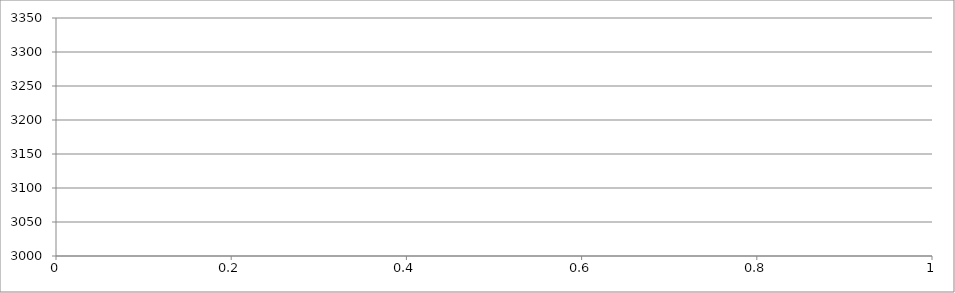
| Category | Series 0 |
|---|---|
| 0 | 3148 |
| 1 | 3148 |
| 2 | 3148 |
| 3 | 3148 |
| 4 | 3148 |
| 5 | 3148 |
| 6 | 3148 |
| 7 | 3148 |
| 8 | 3148 |
| 9 | 3148 |
| 10 | 3148 |
| 11 | 3148 |
| 12 | 3148 |
| 13 | 3148 |
| 14 | 3148 |
| 15 | 3148 |
| 16 | 3148 |
| 17 | 3148 |
| 18 | 3148 |
| 19 | 3148 |
| 20 | 3148 |
| 21 | 3148 |
| 22 | 3148 |
| 23 | 3148 |
| 24 | 3148 |
| 25 | 3148 |
| 26 | 3148 |
| 27 | 3148 |
| 28 | 3148 |
| 29 | 3148 |
| 30 | 3148 |
| 31 | 3148 |
| 32 | 3148 |
| 33 | 3148 |
| 34 | 3148 |
| 35 | 3148 |
| 36 | 3148 |
| 37 | 3148 |
| 38 | 3148 |
| 39 | 3148 |
| 40 | 3148 |
| 41 | 3148 |
| 42 | 3148 |
| 43 | 3148 |
| 44 | 3148 |
| 45 | 3148 |
| 46 | 3148 |
| 47 | 3148 |
| 48 | 3148 |
| 49 | 3148 |
| 50 | 3148 |
| 51 | 3148 |
| 52 | 3148 |
| 53 | 3148 |
| 54 | 3148 |
| 55 | 3148 |
| 56 | 3148 |
| 57 | 3148 |
| 58 | 3148 |
| 59 | 3148 |
| 60 | 3148 |
| 61 | 3148 |
| 62 | 3148 |
| 63 | 3148 |
| 64 | 3148 |
| 65 | 3148 |
| 66 | 3148 |
| 67 | 3148 |
| 68 | 3148 |
| 69 | 3148 |
| 70 | 3148 |
| 71 | 3148 |
| 72 | 3148 |
| 73 | 3148 |
| 74 | 3148 |
| 75 | 3148 |
| 76 | 3148 |
| 77 | 3148 |
| 78 | 3148 |
| 79 | 3148 |
| 80 | 3148 |
| 81 | 3148 |
| 82 | 3148 |
| 83 | 3148 |
| 84 | 3148 |
| 85 | 3148 |
| 86 | 3148 |
| 87 | 3148 |
| 88 | 3148 |
| 89 | 3148 |
| 90 | 3148 |
| 91 | 3148 |
| 92 | 3148 |
| 93 | 3148 |
| 94 | 3148 |
| 95 | 3148 |
| 96 | 3148 |
| 97 | 3148 |
| 98 | 3148 |
| 99 | 3148 |
| 100 | 3148 |
| 101 | 3148 |
| 102 | 3148 |
| 103 | 3148 |
| 104 | 3148 |
| 105 | 3136 |
| 106 | 3136 |
| 107 | 3136 |
| 108 | 3136 |
| 109 | 3136 |
| 110 | 3136 |
| 111 | 3136 |
| 112 | 3136 |
| 113 | 3136 |
| 114 | 3136 |
| 115 | 3136 |
| 116 | 3136 |
| 117 | 3136 |
| 118 | 3136 |
| 119 | 3136 |
| 120 | 3136 |
| 121 | 3136 |
| 122 | 3136 |
| 123 | 3136 |
| 124 | 3136 |
| 125 | 3136 |
| 126 | 3136 |
| 127 | 3136 |
| 128 | 3136 |
| 129 | 3136 |
| 130 | 3136 |
| 131 | 3136 |
| 132 | 3136 |
| 133 | 3136 |
| 134 | 3136 |
| 135 | 3136 |
| 136 | 3136 |
| 137 | 3136 |
| 138 | 3136 |
| 139 | 3136 |
| 140 | 3136 |
| 141 | 3136 |
| 142 | 3136 |
| 143 | 3136 |
| 144 | 3136 |
| 145 | 3136 |
| 146 | 3136 |
| 147 | 3136 |
| 148 | 3136 |
| 149 | 3136 |
| 150 | 3136 |
| 151 | 3136 |
| 152 | 3136 |
| 153 | 3136 |
| 154 | 3136 |
| 155 | 3136 |
| 156 | 3136 |
| 157 | 3136 |
| 158 | 3136 |
| 159 | 3136 |
| 160 | 3136 |
| 161 | 3136 |
| 162 | 3136 |
| 163 | 3136 |
| 164 | 3136 |
| 165 | 3136 |
| 166 | 3136 |
| 167 | 3136 |
| 168 | 3136 |
| 169 | 3136 |
| 170 | 3136 |
| 171 | 3136 |
| 172 | 3136 |
| 173 | 3136 |
| 174 | 3136 |
| 175 | 3136 |
| 176 | 3136 |
| 177 | 3136 |
| 178 | 3136 |
| 179 | 3136 |
| 180 | 3136 |
| 181 | 3136 |
| 182 | 3136 |
| 183 | 3136 |
| 184 | 3136 |
| 185 | 3136 |
| 186 | 3136 |
| 187 | 3136 |
| 188 | 3136 |
| 189 | 3136 |
| 190 | 3136 |
| 191 | 3136 |
| 192 | 3136 |
| 193 | 3136 |
| 194 | 3136 |
| 195 | 3136 |
| 196 | 3136 |
| 197 | 3136 |
| 198 | 3136 |
| 199 | 3136 |
| 200 | 3136 |
| 201 | 3136 |
| 202 | 3136 |
| 203 | 3136 |
| 204 | 3136 |
| 205 | 3136 |
| 206 | 3136 |
| 207 | 3136 |
| 208 | 3136 |
| 209 | 3136 |
| 210 | 3136 |
| 211 | 3136 |
| 212 | 3136 |
| 213 | 3136 |
| 214 | 3136 |
| 215 | 3136 |
| 216 | 3136 |
| 217 | 3136 |
| 218 | 3136 |
| 219 | 3136 |
| 220 | 3136 |
| 221 | 3136 |
| 222 | 3136 |
| 223 | 3136 |
| 224 | 3136 |
| 225 | 3136 |
| 226 | 3136 |
| 227 | 3136 |
| 228 | 3136 |
| 229 | 3136 |
| 230 | 3136 |
| 231 | 3136 |
| 232 | 3136 |
| 233 | 3136 |
| 234 | 3136 |
| 235 | 3136 |
| 236 | 3136 |
| 237 | 3136 |
| 238 | 3136 |
| 239 | 3136 |
| 240 | 3136 |
| 241 | 3136 |
| 242 | 3136 |
| 243 | 3136 |
| 244 | 3136 |
| 245 | 3136 |
| 246 | 3136 |
| 247 | 3136 |
| 248 | 3136 |
| 249 | 3136 |
| 250 | 3136 |
| 251 | 3136 |
| 252 | 3136 |
| 253 | 3136 |
| 254 | 3136 |
| 255 | 3136 |
| 256 | 3136 |
| 257 | 3136 |
| 258 | 3136 |
| 259 | 3136 |
| 260 | 3136 |
| 261 | 3136 |
| 262 | 3136 |
| 263 | 3136 |
| 264 | 3136 |
| 265 | 3136 |
| 266 | 3136 |
| 267 | 3136 |
| 268 | 3136 |
| 269 | 3136 |
| 270 | 3136 |
| 271 | 3136 |
| 272 | 3136 |
| 273 | 3136 |
| 274 | 3136 |
| 275 | 3136 |
| 276 | 3136 |
| 277 | 3136 |
| 278 | 3136 |
| 279 | 3136 |
| 280 | 3136 |
| 281 | 3136 |
| 282 | 3136 |
| 283 | 3136 |
| 284 | 3136 |
| 285 | 3136 |
| 286 | 3136 |
| 287 | 3136 |
| 288 | 3136 |
| 289 | 3136 |
| 290 | 3136 |
| 291 | 3136 |
| 292 | 3136 |
| 293 | 3136 |
| 294 | 3136 |
| 295 | 3136 |
| 296 | 3136 |
| 297 | 3136 |
| 298 | 3136 |
| 299 | 3136 |
| 300 | 3136 |
| 301 | 3136 |
| 302 | 3136 |
| 303 | 3136 |
| 304 | 3136 |
| 305 | 3136 |
| 306 | 3136 |
| 307 | 3136 |
| 308 | 3136 |
| 309 | 3136 |
| 310 | 3136 |
| 311 | 3136 |
| 312 | 3136 |
| 313 | 3136 |
| 314 | 3136 |
| 315 | 3136 |
| 316 | 3136 |
| 317 | 3136 |
| 318 | 3136 |
| 319 | 3136 |
| 320 | 3136 |
| 321 | 3136 |
| 322 | 3136 |
| 323 | 3136 |
| 324 | 3136 |
| 325 | 3136 |
| 326 | 3136 |
| 327 | 3136 |
| 328 | 3136 |
| 329 | 3136 |
| 330 | 3136 |
| 331 | 3136 |
| 332 | 3136 |
| 333 | 3136 |
| 334 | 3136 |
| 335 | 3136 |
| 336 | 3136 |
| 337 | 3136 |
| 338 | 3136 |
| 339 | 3136 |
| 340 | 3136 |
| 341 | 3148 |
| 342 | 3148 |
| 343 | 3148 |
| 344 | 3148 |
| 345 | 3148 |
| 346 | 3148 |
| 347 | 3148 |
| 348 | 3148 |
| 349 | 3148 |
| 350 | 3148 |
| 351 | 3148 |
| 352 | 3148 |
| 353 | 3148 |
| 354 | 3148 |
| 355 | 3148 |
| 356 | 3148 |
| 357 | 3148 |
| 358 | 3148 |
| 359 | 3148 |
| 360 | 3148 |
| 361 | 3148 |
| 362 | 3148 |
| 363 | 3148 |
| 364 | 3148 |
| 365 | 3148 |
| 366 | 3148 |
| 367 | 3148 |
| 368 | 3148 |
| 369 | 3148 |
| 370 | 3148 |
| 371 | 3148 |
| 372 | 3148 |
| 373 | 3148 |
| 374 | 3148 |
| 375 | 3148 |
| 376 | 3148 |
| 377 | 3148 |
| 378 | 3148 |
| 379 | 3148 |
| 380 | 3148 |
| 381 | 3148 |
| 382 | 3148 |
| 383 | 3148 |
| 384 | 3148 |
| 385 | 3148 |
| 386 | 3148 |
| 387 | 3148 |
| 388 | 3148 |
| 389 | 3148 |
| 390 | 3148 |
| 391 | 3148 |
| 392 | 3148 |
| 393 | 3148 |
| 394 | 3148 |
| 395 | 3148 |
| 396 | 3148 |
| 397 | 3148 |
| 398 | 3148 |
| 399 | 3148 |
| 400 | 3148 |
| 401 | 3148 |
| 402 | 3148 |
| 403 | 3148 |
| 404 | 3148 |
| 405 | 3148 |
| 406 | 3148 |
| 407 | 3148 |
| 408 | 3148 |
| 409 | 3148 |
| 410 | 3148 |
| 411 | 3148 |
| 412 | 3148 |
| 413 | 3148 |
| 414 | 3148 |
| 415 | 3148 |
| 416 | 3148 |
| 417 | 3148 |
| 418 | 3148 |
| 419 | 3148 |
| 420 | 3148 |
| 421 | 3148 |
| 422 | 3148 |
| 423 | 3148 |
| 424 | 3148 |
| 425 | 3148 |
| 426 | 3148 |
| 427 | 3148 |
| 428 | 3148 |
| 429 | 3148 |
| 430 | 3148 |
| 431 | 3148 |
| 432 | 3148 |
| 433 | 3148 |
| 434 | 3148 |
| 435 | 3148 |
| 436 | 3148 |
| 437 | 3148 |
| 438 | 3148 |
| 439 | 3148 |
| 440 | 3148 |
| 441 | 3148 |
| 442 | 3148 |
| 443 | 3148 |
| 444 | 3148 |
| 445 | 3148 |
| 446 | 3148 |
| 447 | 3148 |
| 448 | 3148 |
| 449 | 3148 |
| 450 | 3148 |
| 451 | 3148 |
| 452 | 3148 |
| 453 | 3148 |
| 454 | 3148 |
| 455 | 3148 |
| 456 | 3148 |
| 457 | 3148 |
| 458 | 3148 |
| 459 | 3148 |
| 460 | 3148 |
| 461 | 3148 |
| 462 | 3148 |
| 463 | 3148 |
| 464 | 3148 |
| 465 | 3148 |
| 466 | 3148 |
| 467 | 3148 |
| 468 | 3148 |
| 469 | 3148 |
| 470 | 3148 |
| 471 | 3148 |
| 472 | 3148 |
| 473 | 3148 |
| 474 | 3148 |
| 475 | 3148 |
| 476 | 3148 |
| 477 | 3148 |
| 478 | 3148 |
| 479 | 3148 |
| 480 | 3148 |
| 481 | 3148 |
| 482 | 3148 |
| 483 | 3148 |
| 484 | 3148 |
| 485 | 3148 |
| 486 | 3148 |
| 487 | 3148 |
| 488 | 3148 |
| 489 | 3148 |
| 490 | 3148 |
| 491 | 3148 |
| 492 | 3148 |
| 493 | 3148 |
| 494 | 3148 |
| 495 | 3148 |
| 496 | 3148 |
| 497 | 3148 |
| 498 | 3148 |
| 499 | 3148 |
| 500 | 3148 |
| 501 | 3148 |
| 502 | 3148 |
| 503 | 3148 |
| 504 | 3148 |
| 505 | 3148 |
| 506 | 3148 |
| 507 | 3148 |
| 508 | 3148 |
| 509 | 3148 |
| 510 | 3148 |
| 511 | 3148 |
| 512 | 3148 |
| 513 | 3148 |
| 514 | 3148 |
| 515 | 3148 |
| 516 | 3148 |
| 517 | 3148 |
| 518 | 3148 |
| 519 | 3148 |
| 520 | 3148 |
| 521 | 3148 |
| 522 | 3148 |
| 523 | 3148 |
| 524 | 3148 |
| 525 | 3148 |
| 526 | 3148 |
| 527 | 3148 |
| 528 | 3148 |
| 529 | 3148 |
| 530 | 3148 |
| 531 | 3148 |
| 532 | 3148 |
| 533 | 3148 |
| 534 | 3148 |
| 535 | 3148 |
| 536 | 3148 |
| 537 | 3148 |
| 538 | 3148 |
| 539 | 3148 |
| 540 | 3148 |
| 541 | 3148 |
| 542 | 3148 |
| 543 | 3148 |
| 544 | 3148 |
| 545 | 3148 |
| 546 | 3148 |
| 547 | 3148 |
| 548 | 3148 |
| 549 | 3148 |
| 550 | 3148 |
| 551 | 3148 |
| 552 | 3148 |
| 553 | 3148 |
| 554 | 3148 |
| 555 | 3148 |
| 556 | 3148 |
| 557 | 3148 |
| 558 | 3148 |
| 559 | 3148 |
| 560 | 3148 |
| 561 | 3148 |
| 562 | 3148 |
| 563 | 3148 |
| 564 | 3148 |
| 565 | 3148 |
| 566 | 3148 |
| 567 | 3148 |
| 568 | 3148 |
| 569 | 3148 |
| 570 | 3148 |
| 571 | 3148 |
| 572 | 3148 |
| 573 | 3148 |
| 574 | 3148 |
| 575 | 3148 |
| 576 | 3148 |
| 577 | 3148 |
| 578 | 3148 |
| 579 | 3148 |
| 580 | 3148 |
| 581 | 3148 |
| 582 | 3148 |
| 583 | 3148 |
| 584 | 3148 |
| 585 | 3148 |
| 586 | 3148 |
| 587 | 3148 |
| 588 | 3148 |
| 589 | 3148 |
| 590 | 3148 |
| 591 | 3148 |
| 592 | 3148 |
| 593 | 3148 |
| 594 | 3148 |
| 595 | 3148 |
| 596 | 3148 |
| 597 | 3148 |
| 598 | 3148 |
| 599 | 3148 |
| 600 | 3148 |
| 601 | 3148 |
| 602 | 3148 |
| 603 | 3148 |
| 604 | 3148 |
| 605 | 3148 |
| 606 | 3148 |
| 607 | 3148 |
| 608 | 3148 |
| 609 | 3148 |
| 610 | 3148 |
| 611 | 3148 |
| 612 | 3148 |
| 613 | 3148 |
| 614 | 3148 |
| 615 | 3148 |
| 616 | 3148 |
| 617 | 3148 |
| 618 | 3148 |
| 619 | 3148 |
| 620 | 3148 |
| 621 | 3148 |
| 622 | 3148 |
| 623 | 3148 |
| 624 | 3148 |
| 625 | 3148 |
| 626 | 3148 |
| 627 | 3148 |
| 628 | 3148 |
| 629 | 3148 |
| 630 | 3148 |
| 631 | 3148 |
| 632 | 3148 |
| 633 | 3148 |
| 634 | 3148 |
| 635 | 3148 |
| 636 | 3148 |
| 637 | 3148 |
| 638 | 3148 |
| 639 | 3148 |
| 640 | 3148 |
| 641 | 3148 |
| 642 | 3148 |
| 643 | 3148 |
| 644 | 3148 |
| 645 | 3148 |
| 646 | 3148 |
| 647 | 3148 |
| 648 | 3148 |
| 649 | 3148 |
| 650 | 3148 |
| 651 | 3148 |
| 652 | 3148 |
| 653 | 3148 |
| 654 | 3148 |
| 655 | 3148 |
| 656 | 3148 |
| 657 | 3148 |
| 658 | 3148 |
| 659 | 3148 |
| 660 | 3148 |
| 661 | 3148 |
| 662 | 3148 |
| 663 | 3148 |
| 664 | 3148 |
| 665 | 3148 |
| 666 | 3148 |
| 667 | 3148 |
| 668 | 3148 |
| 669 | 3148 |
| 670 | 3148 |
| 671 | 3148 |
| 672 | 3148 |
| 673 | 3148 |
| 674 | 3148 |
| 675 | 3148 |
| 676 | 3148 |
| 677 | 3148 |
| 678 | 3148 |
| 679 | 3148 |
| 680 | 3148 |
| 681 | 3148 |
| 682 | 3148 |
| 683 | 3148 |
| 684 | 3148 |
| 685 | 3148 |
| 686 | 3148 |
| 687 | 3148 |
| 688 | 3148 |
| 689 | 3148 |
| 690 | 3148 |
| 691 | 3148 |
| 692 | 3148 |
| 693 | 3148 |
| 694 | 3148 |
| 695 | 3148 |
| 696 | 3148 |
| 697 | 3148 |
| 698 | 3148 |
| 699 | 3148 |
| 700 | 3148 |
| 701 | 3148 |
| 702 | 3148 |
| 703 | 3148 |
| 704 | 3148 |
| 705 | 3148 |
| 706 | 3148 |
| 707 | 3148 |
| 708 | 3148 |
| 709 | 3148 |
| 710 | 3148 |
| 711 | 3148 |
| 712 | 3148 |
| 713 | 3148 |
| 714 | 3148 |
| 715 | 3148 |
| 716 | 3148 |
| 717 | 3148 |
| 718 | 3148 |
| 719 | 3148 |
| 720 | 3148 |
| 721 | 3148 |
| 722 | 3148 |
| 723 | 3148 |
| 724 | 3148 |
| 725 | 3148 |
| 726 | 3148 |
| 727 | 3148 |
| 728 | 3148 |
| 729 | 3148 |
| 730 | 3148 |
| 731 | 3148 |
| 732 | 3148 |
| 733 | 3148 |
| 734 | 3148 |
| 735 | 3148 |
| 736 | 3148 |
| 737 | 3148 |
| 738 | 3148 |
| 739 | 3148 |
| 740 | 3148 |
| 741 | 3148 |
| 742 | 3148 |
| 743 | 3148 |
| 744 | 3148 |
| 745 | 3148 |
| 746 | 3148 |
| 747 | 3148 |
| 748 | 3148 |
| 749 | 3148 |
| 750 | 3148 |
| 751 | 3148 |
| 752 | 3148 |
| 753 | 3148 |
| 754 | 3148 |
| 755 | 3148 |
| 756 | 3148 |
| 757 | 3148 |
| 758 | 3148 |
| 759 | 3148 |
| 760 | 3148 |
| 761 | 3148 |
| 762 | 3148 |
| 763 | 3148 |
| 764 | 3148 |
| 765 | 3148 |
| 766 | 3148 |
| 767 | 3148 |
| 768 | 3148 |
| 769 | 3148 |
| 770 | 3148 |
| 771 | 3148 |
| 772 | 3148 |
| 773 | 3148 |
| 774 | 3148 |
| 775 | 3148 |
| 776 | 3148 |
| 777 | 3148 |
| 778 | 3148 |
| 779 | 3148 |
| 780 | 3148 |
| 781 | 3148 |
| 782 | 3148 |
| 783 | 3148 |
| 784 | 3148 |
| 785 | 3148 |
| 786 | 3148 |
| 787 | 3148 |
| 788 | 3148 |
| 789 | 3148 |
| 790 | 3148 |
| 791 | 3148 |
| 792 | 3148 |
| 793 | 3148 |
| 794 | 3148 |
| 795 | 3148 |
| 796 | 3148 |
| 797 | 3148 |
| 798 | 3148 |
| 799 | 3148 |
| 800 | 3148 |
| 801 | 3148 |
| 802 | 3148 |
| 803 | 3148 |
| 804 | 3148 |
| 805 | 3148 |
| 806 | 3148 |
| 807 | 3148 |
| 808 | 3148 |
| 809 | 3148 |
| 810 | 3148 |
| 811 | 3148 |
| 812 | 3156 |
| 813 | 3156 |
| 814 | 3156 |
| 815 | 3156 |
| 816 | 3156 |
| 817 | 3156 |
| 818 | 3156 |
| 819 | 3156 |
| 820 | 3156 |
| 821 | 3156 |
| 822 | 3156 |
| 823 | 3156 |
| 824 | 3156 |
| 825 | 3156 |
| 826 | 3156 |
| 827 | 3156 |
| 828 | 3156 |
| 829 | 3156 |
| 830 | 3156 |
| 831 | 3156 |
| 832 | 3156 |
| 833 | 3156 |
| 834 | 3156 |
| 835 | 3156 |
| 836 | 3156 |
| 837 | 3156 |
| 838 | 3156 |
| 839 | 3156 |
| 840 | 3156 |
| 841 | 3156 |
| 842 | 3156 |
| 843 | 3156 |
| 844 | 3156 |
| 845 | 3156 |
| 846 | 3156 |
| 847 | 3156 |
| 848 | 3156 |
| 849 | 3156 |
| 850 | 3156 |
| 851 | 3156 |
| 852 | 3156 |
| 853 | 3156 |
| 854 | 3156 |
| 855 | 3156 |
| 856 | 3156 |
| 857 | 3156 |
| 858 | 3156 |
| 859 | 3156 |
| 860 | 3156 |
| 861 | 3156 |
| 862 | 3156 |
| 863 | 3156 |
| 864 | 3156 |
| 865 | 3156 |
| 866 | 3156 |
| 867 | 3156 |
| 868 | 3156 |
| 869 | 3156 |
| 870 | 3156 |
| 871 | 3156 |
| 872 | 3156 |
| 873 | 3156 |
| 874 | 3156 |
| 875 | 3156 |
| 876 | 3156 |
| 877 | 3156 |
| 878 | 3156 |
| 879 | 3156 |
| 880 | 3156 |
| 881 | 3156 |
| 882 | 3156 |
| 883 | 3156 |
| 884 | 3156 |
| 885 | 3156 |
| 886 | 3156 |
| 887 | 3156 |
| 888 | 3156 |
| 889 | 3156 |
| 890 | 3156 |
| 891 | 3156 |
| 892 | 3156 |
| 893 | 3156 |
| 894 | 3156 |
| 895 | 3156 |
| 896 | 3156 |
| 897 | 3156 |
| 898 | 3156 |
| 899 | 3156 |
| 900 | 3156 |
| 901 | 3156 |
| 902 | 3156 |
| 903 | 3156 |
| 904 | 3156 |
| 905 | 3156 |
| 906 | 3156 |
| 907 | 3156 |
| 908 | 3156 |
| 909 | 3156 |
| 910 | 3156 |
| 911 | 3156 |
| 912 | 3156 |
| 913 | 3156 |
| 914 | 3156 |
| 915 | 3156 |
| 916 | 3156 |
| 917 | 3156 |
| 918 | 3156 |
| 919 | 3156 |
| 920 | 3156 |
| 921 | 3156 |
| 922 | 3156 |
| 923 | 3156 |
| 924 | 3156 |
| 925 | 3156 |
| 926 | 3156 |
| 927 | 3156 |
| 928 | 3156 |
| 929 | 3156 |
| 930 | 3156 |
| 931 | 3156 |
| 932 | 3156 |
| 933 | 3156 |
| 934 | 3156 |
| 935 | 3156 |
| 936 | 3156 |
| 937 | 3156 |
| 938 | 3156 |
| 939 | 3156 |
| 940 | 3156 |
| 941 | 3156 |
| 942 | 3156 |
| 943 | 3156 |
| 944 | 3156 |
| 945 | 3156 |
| 946 | 3156 |
| 947 | 3156 |
| 948 | 3156 |
| 949 | 3156 |
| 950 | 3156 |
| 951 | 3156 |
| 952 | 3156 |
| 953 | 3156 |
| 954 | 3156 |
| 955 | 3156 |
| 956 | 3156 |
| 957 | 3156 |
| 958 | 3156 |
| 959 | 3156 |
| 960 | 3156 |
| 961 | 3156 |
| 962 | 3156 |
| 963 | 3156 |
| 964 | 3156 |
| 965 | 3156 |
| 966 | 3156 |
| 967 | 3156 |
| 968 | 3156 |
| 969 | 3156 |
| 970 | 3156 |
| 971 | 3156 |
| 972 | 3156 |
| 973 | 3156 |
| 974 | 3156 |
| 975 | 3156 |
| 976 | 3156 |
| 977 | 3156 |
| 978 | 3156 |
| 979 | 3156 |
| 980 | 3156 |
| 981 | 3156 |
| 982 | 3156 |
| 983 | 3156 |
| 984 | 3156 |
| 985 | 3156 |
| 986 | 3156 |
| 987 | 3156 |
| 988 | 3156 |
| 989 | 3156 |
| 990 | 3156 |
| 991 | 3156 |
| 992 | 3156 |
| 993 | 3156 |
| 994 | 3156 |
| 995 | 3156 |
| 996 | 3156 |
| 997 | 3156 |
| 998 | 3156 |
| 999 | 3156 |
| 1000 | 3156 |
| 1001 | 3156 |
| 1002 | 3156 |
| 1003 | 3156 |
| 1004 | 3156 |
| 1005 | 3156 |
| 1006 | 3156 |
| 1007 | 3156 |
| 1008 | 3156 |
| 1009 | 3156 |
| 1010 | 3156 |
| 1011 | 3156 |
| 1012 | 3156 |
| 1013 | 3156 |
| 1014 | 3156 |
| 1015 | 3156 |
| 1016 | 3156 |
| 1017 | 3156 |
| 1018 | 3156 |
| 1019 | 3156 |
| 1020 | 3156 |
| 1021 | 3156 |
| 1022 | 3156 |
| 1023 | 3156 |
| 1024 | 3156 |
| 1025 | 3156 |
| 1026 | 3156 |
| 1027 | 3156 |
| 1028 | 3156 |
| 1029 | 3156 |
| 1030 | 3156 |
| 1031 | 3156 |
| 1032 | 3156 |
| 1033 | 3156 |
| 1034 | 3156 |
| 1035 | 3156 |
| 1036 | 3156 |
| 1037 | 3156 |
| 1038 | 3156 |
| 1039 | 3156 |
| 1040 | 3156 |
| 1041 | 3156 |
| 1042 | 3156 |
| 1043 | 3156 |
| 1044 | 3156 |
| 1045 | 3156 |
| 1046 | 3156 |
| 1047 | 3136 |
| 1048 | 3136 |
| 1049 | 3136 |
| 1050 | 3136 |
| 1051 | 3136 |
| 1052 | 3136 |
| 1053 | 3136 |
| 1054 | 3136 |
| 1055 | 3136 |
| 1056 | 3136 |
| 1057 | 3136 |
| 1058 | 3136 |
| 1059 | 3136 |
| 1060 | 3136 |
| 1061 | 3136 |
| 1062 | 3136 |
| 1063 | 3136 |
| 1064 | 3136 |
| 1065 | 3136 |
| 1066 | 3136 |
| 1067 | 3136 |
| 1068 | 3136 |
| 1069 | 3136 |
| 1070 | 3136 |
| 1071 | 3136 |
| 1072 | 3136 |
| 1073 | 3136 |
| 1074 | 3136 |
| 1075 | 3136 |
| 1076 | 3136 |
| 1077 | 3136 |
| 1078 | 3136 |
| 1079 | 3136 |
| 1080 | 3136 |
| 1081 | 3136 |
| 1082 | 3136 |
| 1083 | 3136 |
| 1084 | 3136 |
| 1085 | 3136 |
| 1086 | 3136 |
| 1087 | 3136 |
| 1088 | 3136 |
| 1089 | 3136 |
| 1090 | 3136 |
| 1091 | 3136 |
| 1092 | 3136 |
| 1093 | 3136 |
| 1094 | 3136 |
| 1095 | 3136 |
| 1096 | 3136 |
| 1097 | 3136 |
| 1098 | 3136 |
| 1099 | 3136 |
| 1100 | 3136 |
| 1101 | 3136 |
| 1102 | 3136 |
| 1103 | 3136 |
| 1104 | 3136 |
| 1105 | 3136 |
| 1106 | 3136 |
| 1107 | 3136 |
| 1108 | 3136 |
| 1109 | 3136 |
| 1110 | 3136 |
| 1111 | 3136 |
| 1112 | 3136 |
| 1113 | 3136 |
| 1114 | 3136 |
| 1115 | 3136 |
| 1116 | 3136 |
| 1117 | 3136 |
| 1118 | 3136 |
| 1119 | 3136 |
| 1120 | 3136 |
| 1121 | 3136 |
| 1122 | 3136 |
| 1123 | 3136 |
| 1124 | 3136 |
| 1125 | 3136 |
| 1126 | 3136 |
| 1127 | 3136 |
| 1128 | 3136 |
| 1129 | 3136 |
| 1130 | 3136 |
| 1131 | 3136 |
| 1132 | 3136 |
| 1133 | 3136 |
| 1134 | 3136 |
| 1135 | 3136 |
| 1136 | 3136 |
| 1137 | 3136 |
| 1138 | 3136 |
| 1139 | 3136 |
| 1140 | 3136 |
| 1141 | 3136 |
| 1142 | 3136 |
| 1143 | 3136 |
| 1144 | 3136 |
| 1145 | 3136 |
| 1146 | 3136 |
| 1147 | 3136 |
| 1148 | 3136 |
| 1149 | 3136 |
| 1150 | 3136 |
| 1151 | 3136 |
| 1152 | 3136 |
| 1153 | 3136 |
| 1154 | 3136 |
| 1155 | 3136 |
| 1156 | 3136 |
| 1157 | 3136 |
| 1158 | 3136 |
| 1159 | 3136 |
| 1160 | 3136 |
| 1161 | 3136 |
| 1162 | 3136 |
| 1163 | 3136 |
| 1164 | 3136 |
| 1165 | 3136 |
| 1166 | 3136 |
| 1167 | 3136 |
| 1168 | 3136 |
| 1169 | 3136 |
| 1170 | 3136 |
| 1171 | 3136 |
| 1172 | 3136 |
| 1173 | 3136 |
| 1174 | 3136 |
| 1175 | 3136 |
| 1176 | 3136 |
| 1177 | 3136 |
| 1178 | 3136 |
| 1179 | 3136 |
| 1180 | 3136 |
| 1181 | 3136 |
| 1182 | 3136 |
| 1183 | 3136 |
| 1184 | 3136 |
| 1185 | 3136 |
| 1186 | 3136 |
| 1187 | 3136 |
| 1188 | 3136 |
| 1189 | 3136 |
| 1190 | 3136 |
| 1191 | 3136 |
| 1192 | 3136 |
| 1193 | 3136 |
| 1194 | 3136 |
| 1195 | 3136 |
| 1196 | 3136 |
| 1197 | 3136 |
| 1198 | 3136 |
| 1199 | 3136 |
| 1200 | 3136 |
| 1201 | 3136 |
| 1202 | 3136 |
| 1203 | 3136 |
| 1204 | 3136 |
| 1205 | 3136 |
| 1206 | 3136 |
| 1207 | 3136 |
| 1208 | 3136 |
| 1209 | 3136 |
| 1210 | 3136 |
| 1211 | 3136 |
| 1212 | 3136 |
| 1213 | 3136 |
| 1214 | 3136 |
| 1215 | 3136 |
| 1216 | 3136 |
| 1217 | 3136 |
| 1218 | 3136 |
| 1219 | 3136 |
| 1220 | 3136 |
| 1221 | 3136 |
| 1222 | 3136 |
| 1223 | 3136 |
| 1224 | 3136 |
| 1225 | 3136 |
| 1226 | 3136 |
| 1227 | 3136 |
| 1228 | 3136 |
| 1229 | 3136 |
| 1230 | 3136 |
| 1231 | 3136 |
| 1232 | 3136 |
| 1233 | 3136 |
| 1234 | 3136 |
| 1235 | 3136 |
| 1236 | 3136 |
| 1237 | 3136 |
| 1238 | 3136 |
| 1239 | 3136 |
| 1240 | 3136 |
| 1241 | 3136 |
| 1242 | 3136 |
| 1243 | 3136 |
| 1244 | 3136 |
| 1245 | 3136 |
| 1246 | 3136 |
| 1247 | 3136 |
| 1248 | 3136 |
| 1249 | 3136 |
| 1250 | 3136 |
| 1251 | 3136 |
| 1252 | 3136 |
| 1253 | 3136 |
| 1254 | 3136 |
| 1255 | 3136 |
| 1256 | 3136 |
| 1257 | 3136 |
| 1258 | 3136 |
| 1259 | 3136 |
| 1260 | 3136 |
| 1261 | 3136 |
| 1262 | 3136 |
| 1263 | 3136 |
| 1264 | 3136 |
| 1265 | 3136 |
| 1266 | 3136 |
| 1267 | 3136 |
| 1268 | 3136 |
| 1269 | 3136 |
| 1270 | 3136 |
| 1271 | 3136 |
| 1272 | 3136 |
| 1273 | 3136 |
| 1274 | 3136 |
| 1275 | 3136 |
| 1276 | 3136 |
| 1277 | 3136 |
| 1278 | 3136 |
| 1279 | 3136 |
| 1280 | 3136 |
| 1281 | 3136 |
| 1282 | 3136 |
| 1283 | 3136 |
| 1284 | 3136 |
| 1285 | 3136 |
| 1286 | 3136 |
| 1287 | 3136 |
| 1288 | 3136 |
| 1289 | 3136 |
| 1290 | 3136 |
| 1291 | 3136 |
| 1292 | 3136 |
| 1293 | 3136 |
| 1294 | 3136 |
| 1295 | 3136 |
| 1296 | 3136 |
| 1297 | 3136 |
| 1298 | 3136 |
| 1299 | 3136 |
| 1300 | 3136 |
| 1301 | 3136 |
| 1302 | 3136 |
| 1303 | 3136 |
| 1304 | 3136 |
| 1305 | 3136 |
| 1306 | 3136 |
| 1307 | 3136 |
| 1308 | 3136 |
| 1309 | 3136 |
| 1310 | 3136 |
| 1311 | 3136 |
| 1312 | 3136 |
| 1313 | 3136 |
| 1314 | 3136 |
| 1315 | 3136 |
| 1316 | 3136 |
| 1317 | 3136 |
| 1318 | 3136 |
| 1319 | 3136 |
| 1320 | 3136 |
| 1321 | 3136 |
| 1322 | 3136 |
| 1323 | 3136 |
| 1324 | 3136 |
| 1325 | 3136 |
| 1326 | 3136 |
| 1327 | 3136 |
| 1328 | 3136 |
| 1329 | 3136 |
| 1330 | 3136 |
| 1331 | 3136 |
| 1332 | 3136 |
| 1333 | 3136 |
| 1334 | 3136 |
| 1335 | 3136 |
| 1336 | 3136 |
| 1337 | 3136 |
| 1338 | 3136 |
| 1339 | 3136 |
| 1340 | 3136 |
| 1341 | 3136 |
| 1342 | 3136 |
| 1343 | 3136 |
| 1344 | 3136 |
| 1345 | 3136 |
| 1346 | 3136 |
| 1347 | 3136 |
| 1348 | 3136 |
| 1349 | 3136 |
| 1350 | 3136 |
| 1351 | 3136 |
| 1352 | 3136 |
| 1353 | 3136 |
| 1354 | 3136 |
| 1355 | 3136 |
| 1356 | 3136 |
| 1357 | 3136 |
| 1358 | 3136 |
| 1359 | 3136 |
| 1360 | 3136 |
| 1361 | 3136 |
| 1362 | 3136 |
| 1363 | 3136 |
| 1364 | 3136 |
| 1365 | 3136 |
| 1366 | 3136 |
| 1367 | 3136 |
| 1368 | 3136 |
| 1369 | 3136 |
| 1370 | 3136 |
| 1371 | 3136 |
| 1372 | 3136 |
| 1373 | 3136 |
| 1374 | 3136 |
| 1375 | 3136 |
| 1376 | 3136 |
| 1377 | 3136 |
| 1378 | 3136 |
| 1379 | 3136 |
| 1380 | 3136 |
| 1381 | 3136 |
| 1382 | 3136 |
| 1383 | 3136 |
| 1384 | 3136 |
| 1385 | 3136 |
| 1386 | 3136 |
| 1387 | 3136 |
| 1388 | 3136 |
| 1389 | 3136 |
| 1390 | 3136 |
| 1391 | 3136 |
| 1392 | 3136 |
| 1393 | 3136 |
| 1394 | 3136 |
| 1395 | 3136 |
| 1396 | 3136 |
| 1397 | 3136 |
| 1398 | 3136 |
| 1399 | 3136 |
| 1400 | 3136 |
| 1401 | 3136 |
| 1402 | 3136 |
| 1403 | 3136 |
| 1404 | 3136 |
| 1405 | 3136 |
| 1406 | 3136 |
| 1407 | 3136 |
| 1408 | 3136 |
| 1409 | 3136 |
| 1410 | 3136 |
| 1411 | 3136 |
| 1412 | 3136 |
| 1413 | 3136 |
| 1414 | 3136 |
| 1415 | 3136 |
| 1416 | 3136 |
| 1417 | 3136 |
| 1418 | 3136 |
| 1419 | 3136 |
| 1420 | 3136 |
| 1421 | 3136 |
| 1422 | 3136 |
| 1423 | 3136 |
| 1424 | 3136 |
| 1425 | 3136 |
| 1426 | 3136 |
| 1427 | 3136 |
| 1428 | 3136 |
| 1429 | 3136 |
| 1430 | 3136 |
| 1431 | 3136 |
| 1432 | 3136 |
| 1433 | 3136 |
| 1434 | 3136 |
| 1435 | 3136 |
| 1436 | 3136 |
| 1437 | 3136 |
| 1438 | 3136 |
| 1439 | 3136 |
| 1440 | 3136 |
| 1441 | 3136 |
| 1442 | 3136 |
| 1443 | 3136 |
| 1444 | 3136 |
| 1445 | 3136 |
| 1446 | 3136 |
| 1447 | 3136 |
| 1448 | 3136 |
| 1449 | 3136 |
| 1450 | 3136 |
| 1451 | 3136 |
| 1452 | 3136 |
| 1453 | 3136 |
| 1454 | 3136 |
| 1455 | 3136 |
| 1456 | 3136 |
| 1457 | 3136 |
| 1458 | 3136 |
| 1459 | 3136 |
| 1460 | 3136 |
| 1461 | 3136 |
| 1462 | 3136 |
| 1463 | 3136 |
| 1464 | 3136 |
| 1465 | 3136 |
| 1466 | 3136 |
| 1467 | 3136 |
| 1468 | 3136 |
| 1469 | 3136 |
| 1470 | 3136 |
| 1471 | 3136 |
| 1472 | 3136 |
| 1473 | 3136 |
| 1474 | 3136 |
| 1475 | 3136 |
| 1476 | 3136 |
| 1477 | 3136 |
| 1478 | 3136 |
| 1479 | 3136 |
| 1480 | 3136 |
| 1481 | 3136 |
| 1482 | 3136 |
| 1483 | 3136 |
| 1484 | 3136 |
| 1485 | 3136 |
| 1486 | 3136 |
| 1487 | 3136 |
| 1488 | 3136 |
| 1489 | 3136 |
| 1490 | 3136 |
| 1491 | 3136 |
| 1492 | 3136 |
| 1493 | 3136 |
| 1494 | 3136 |
| 1495 | 3136 |
| 1496 | 3136 |
| 1497 | 3136 |
| 1498 | 3136 |
| 1499 | 3136 |
| 1500 | 3136 |
| 1501 | 3136 |
| 1502 | 3136 |
| 1503 | 3136 |
| 1504 | 3136 |
| 1505 | 3136 |
| 1506 | 3136 |
| 1507 | 3136 |
| 1508 | 3136 |
| 1509 | 3136 |
| 1510 | 3136 |
| 1511 | 3136 |
| 1512 | 3136 |
| 1513 | 3136 |
| 1514 | 3136 |
| 1515 | 3136 |
| 1516 | 3136 |
| 1517 | 3136 |
| 1518 | 3164 |
| 1519 | 3164 |
| 1520 | 3164 |
| 1521 | 3164 |
| 1522 | 3164 |
| 1523 | 3164 |
| 1524 | 3164 |
| 1525 | 3164 |
| 1526 | 3164 |
| 1527 | 3164 |
| 1528 | 3164 |
| 1529 | 3164 |
| 1530 | 3164 |
| 1531 | 3164 |
| 1532 | 3164 |
| 1533 | 3164 |
| 1534 | 3164 |
| 1535 | 3164 |
| 1536 | 3164 |
| 1537 | 3164 |
| 1538 | 3164 |
| 1539 | 3164 |
| 1540 | 3164 |
| 1541 | 3164 |
| 1542 | 3164 |
| 1543 | 3164 |
| 1544 | 3164 |
| 1545 | 3164 |
| 1546 | 3164 |
| 1547 | 3164 |
| 1548 | 3164 |
| 1549 | 3164 |
| 1550 | 3164 |
| 1551 | 3164 |
| 1552 | 3164 |
| 1553 | 3164 |
| 1554 | 3164 |
| 1555 | 3164 |
| 1556 | 3164 |
| 1557 | 3164 |
| 1558 | 3164 |
| 1559 | 3164 |
| 1560 | 3164 |
| 1561 | 3164 |
| 1562 | 3164 |
| 1563 | 3164 |
| 1564 | 3164 |
| 1565 | 3164 |
| 1566 | 3164 |
| 1567 | 3164 |
| 1568 | 3164 |
| 1569 | 3164 |
| 1570 | 3164 |
| 1571 | 3164 |
| 1572 | 3164 |
| 1573 | 3164 |
| 1574 | 3164 |
| 1575 | 3164 |
| 1576 | 3164 |
| 1577 | 3164 |
| 1578 | 3164 |
| 1579 | 3164 |
| 1580 | 3164 |
| 1581 | 3164 |
| 1582 | 3164 |
| 1583 | 3164 |
| 1584 | 3164 |
| 1585 | 3164 |
| 1586 | 3164 |
| 1587 | 3164 |
| 1588 | 3164 |
| 1589 | 3164 |
| 1590 | 3164 |
| 1591 | 3164 |
| 1592 | 3164 |
| 1593 | 3164 |
| 1594 | 3164 |
| 1595 | 3164 |
| 1596 | 3164 |
| 1597 | 3164 |
| 1598 | 3164 |
| 1599 | 3164 |
| 1600 | 3164 |
| 1601 | 3164 |
| 1602 | 3164 |
| 1603 | 3164 |
| 1604 | 3164 |
| 1605 | 3164 |
| 1606 | 3164 |
| 1607 | 3164 |
| 1608 | 3164 |
| 1609 | 3164 |
| 1610 | 3164 |
| 1611 | 3164 |
| 1612 | 3164 |
| 1613 | 3164 |
| 1614 | 3164 |
| 1615 | 3164 |
| 1616 | 3164 |
| 1617 | 3164 |
| 1618 | 3164 |
| 1619 | 3164 |
| 1620 | 3164 |
| 1621 | 3164 |
| 1622 | 3164 |
| 1623 | 3164 |
| 1624 | 3164 |
| 1625 | 3164 |
| 1626 | 3164 |
| 1627 | 3164 |
| 1628 | 3164 |
| 1629 | 3164 |
| 1630 | 3164 |
| 1631 | 3164 |
| 1632 | 3164 |
| 1633 | 3164 |
| 1634 | 3164 |
| 1635 | 3164 |
| 1636 | 3164 |
| 1637 | 3164 |
| 1638 | 3164 |
| 1639 | 3164 |
| 1640 | 3164 |
| 1641 | 3164 |
| 1642 | 3164 |
| 1643 | 3164 |
| 1644 | 3164 |
| 1645 | 3164 |
| 1646 | 3164 |
| 1647 | 3164 |
| 1648 | 3164 |
| 1649 | 3164 |
| 1650 | 3164 |
| 1651 | 3164 |
| 1652 | 3164 |
| 1653 | 3164 |
| 1654 | 3164 |
| 1655 | 3164 |
| 1656 | 3164 |
| 1657 | 3164 |
| 1658 | 3164 |
| 1659 | 3164 |
| 1660 | 3164 |
| 1661 | 3164 |
| 1662 | 3164 |
| 1663 | 3164 |
| 1664 | 3164 |
| 1665 | 3164 |
| 1666 | 3164 |
| 1667 | 3164 |
| 1668 | 3164 |
| 1669 | 3164 |
| 1670 | 3164 |
| 1671 | 3164 |
| 1672 | 3164 |
| 1673 | 3164 |
| 1674 | 3164 |
| 1675 | 3164 |
| 1676 | 3164 |
| 1677 | 3164 |
| 1678 | 3164 |
| 1679 | 3164 |
| 1680 | 3164 |
| 1681 | 3164 |
| 1682 | 3164 |
| 1683 | 3164 |
| 1684 | 3164 |
| 1685 | 3164 |
| 1686 | 3164 |
| 1687 | 3164 |
| 1688 | 3164 |
| 1689 | 3164 |
| 1690 | 3164 |
| 1691 | 3164 |
| 1692 | 3164 |
| 1693 | 3164 |
| 1694 | 3164 |
| 1695 | 3164 |
| 1696 | 3164 |
| 1697 | 3164 |
| 1698 | 3164 |
| 1699 | 3164 |
| 1700 | 3164 |
| 1701 | 3164 |
| 1702 | 3164 |
| 1703 | 3164 |
| 1704 | 3164 |
| 1705 | 3164 |
| 1706 | 3164 |
| 1707 | 3164 |
| 1708 | 3164 |
| 1709 | 3164 |
| 1710 | 3164 |
| 1711 | 3164 |
| 1712 | 3164 |
| 1713 | 3164 |
| 1714 | 3164 |
| 1715 | 3164 |
| 1716 | 3164 |
| 1717 | 3164 |
| 1718 | 3164 |
| 1719 | 3164 |
| 1720 | 3164 |
| 1721 | 3164 |
| 1722 | 3164 |
| 1723 | 3164 |
| 1724 | 3164 |
| 1725 | 3164 |
| 1726 | 3164 |
| 1727 | 3164 |
| 1728 | 3164 |
| 1729 | 3164 |
| 1730 | 3164 |
| 1731 | 3164 |
| 1732 | 3164 |
| 1733 | 3164 |
| 1734 | 3164 |
| 1735 | 3164 |
| 1736 | 3164 |
| 1737 | 3164 |
| 1738 | 3164 |
| 1739 | 3164 |
| 1740 | 3164 |
| 1741 | 3164 |
| 1742 | 3164 |
| 1743 | 3164 |
| 1744 | 3164 |
| 1745 | 3164 |
| 1746 | 3164 |
| 1747 | 3164 |
| 1748 | 3164 |
| 1749 | 3164 |
| 1750 | 3164 |
| 1751 | 3164 |
| 1752 | 3164 |
| 1753 | 3164 |
| 1754 | 3164 |
| 1755 | 3164 |
| 1756 | 3164 |
| 1757 | 3164 |
| 1758 | 3164 |
| 1759 | 3164 |
| 1760 | 3164 |
| 1761 | 3164 |
| 1762 | 3164 |
| 1763 | 3164 |
| 1764 | 3164 |
| 1765 | 3164 |
| 1766 | 3164 |
| 1767 | 3164 |
| 1768 | 3164 |
| 1769 | 3164 |
| 1770 | 3164 |
| 1771 | 3164 |
| 1772 | 3164 |
| 1773 | 3164 |
| 1774 | 3164 |
| 1775 | 3164 |
| 1776 | 3164 |
| 1777 | 3164 |
| 1778 | 3164 |
| 1779 | 3164 |
| 1780 | 3164 |
| 1781 | 3164 |
| 1782 | 3164 |
| 1783 | 3164 |
| 1784 | 3164 |
| 1785 | 3164 |
| 1786 | 3164 |
| 1787 | 3164 |
| 1788 | 3164 |
| 1789 | 3164 |
| 1790 | 3164 |
| 1791 | 3164 |
| 1792 | 3164 |
| 1793 | 3164 |
| 1794 | 3164 |
| 1795 | 3164 |
| 1796 | 3164 |
| 1797 | 3164 |
| 1798 | 3164 |
| 1799 | 3164 |
| 1800 | 3164 |
| 1801 | 3164 |
| 1802 | 3164 |
| 1803 | 3164 |
| 1804 | 3164 |
| 1805 | 3164 |
| 1806 | 3164 |
| 1807 | 3164 |
| 1808 | 3164 |
| 1809 | 3164 |
| 1810 | 3164 |
| 1811 | 3164 |
| 1812 | 3164 |
| 1813 | 3164 |
| 1814 | 3164 |
| 1815 | 3164 |
| 1816 | 3164 |
| 1817 | 3164 |
| 1818 | 3164 |
| 1819 | 3164 |
| 1820 | 3164 |
| 1821 | 3164 |
| 1822 | 3164 |
| 1823 | 3164 |
| 1824 | 3164 |
| 1825 | 3164 |
| 1826 | 3164 |
| 1827 | 3164 |
| 1828 | 3164 |
| 1829 | 3164 |
| 1830 | 3164 |
| 1831 | 3164 |
| 1832 | 3164 |
| 1833 | 3164 |
| 1834 | 3164 |
| 1835 | 3164 |
| 1836 | 3164 |
| 1837 | 3164 |
| 1838 | 3164 |
| 1839 | 3164 |
| 1840 | 3164 |
| 1841 | 3164 |
| 1842 | 3164 |
| 1843 | 3164 |
| 1844 | 3164 |
| 1845 | 3164 |
| 1846 | 3164 |
| 1847 | 3164 |
| 1848 | 3164 |
| 1849 | 3164 |
| 1850 | 3164 |
| 1851 | 3164 |
| 1852 | 3164 |
| 1853 | 3164 |
| 1854 | 3164 |
| 1855 | 3164 |
| 1856 | 3164 |
| 1857 | 3164 |
| 1858 | 3164 |
| 1859 | 3164 |
| 1860 | 3164 |
| 1861 | 3164 |
| 1862 | 3164 |
| 1863 | 3164 |
| 1864 | 3164 |
| 1865 | 3164 |
| 1866 | 3164 |
| 1867 | 3164 |
| 1868 | 3164 |
| 1869 | 3164 |
| 1870 | 3164 |
| 1871 | 3164 |
| 1872 | 3164 |
| 1873 | 3164 |
| 1874 | 3164 |
| 1875 | 3164 |
| 1876 | 3164 |
| 1877 | 3164 |
| 1878 | 3164 |
| 1879 | 3164 |
| 1880 | 3164 |
| 1881 | 3164 |
| 1882 | 3164 |
| 1883 | 3164 |
| 1884 | 3164 |
| 1885 | 3164 |
| 1886 | 3164 |
| 1887 | 3164 |
| 1888 | 3164 |
| 1889 | 3164 |
| 1890 | 3164 |
| 1891 | 3164 |
| 1892 | 3164 |
| 1893 | 3164 |
| 1894 | 3164 |
| 1895 | 3164 |
| 1896 | 3164 |
| 1897 | 3164 |
| 1898 | 3164 |
| 1899 | 3164 |
| 1900 | 3164 |
| 1901 | 3164 |
| 1902 | 3164 |
| 1903 | 3164 |
| 1904 | 3164 |
| 1905 | 3164 |
| 1906 | 3164 |
| 1907 | 3164 |
| 1908 | 3164 |
| 1909 | 3164 |
| 1910 | 3164 |
| 1911 | 3164 |
| 1912 | 3164 |
| 1913 | 3164 |
| 1914 | 3164 |
| 1915 | 3164 |
| 1916 | 3164 |
| 1917 | 3164 |
| 1918 | 3164 |
| 1919 | 3164 |
| 1920 | 3164 |
| 1921 | 3164 |
| 1922 | 3164 |
| 1923 | 3164 |
| 1924 | 3164 |
| 1925 | 3164 |
| 1926 | 3164 |
| 1927 | 3164 |
| 1928 | 3164 |
| 1929 | 3164 |
| 1930 | 3164 |
| 1931 | 3164 |
| 1932 | 3164 |
| 1933 | 3164 |
| 1934 | 3164 |
| 1935 | 3164 |
| 1936 | 3164 |
| 1937 | 3164 |
| 1938 | 3164 |
| 1939 | 3164 |
| 1940 | 3164 |
| 1941 | 3164 |
| 1942 | 3164 |
| 1943 | 3164 |
| 1944 | 3164 |
| 1945 | 3164 |
| 1946 | 3164 |
| 1947 | 3164 |
| 1948 | 3164 |
| 1949 | 3164 |
| 1950 | 3164 |
| 1951 | 3164 |
| 1952 | 3164 |
| 1953 | 3164 |
| 1954 | 3164 |
| 1955 | 3164 |
| 1956 | 3164 |
| 1957 | 3164 |
| 1958 | 3164 |
| 1959 | 3164 |
| 1960 | 3164 |
| 1961 | 3164 |
| 1962 | 3164 |
| 1963 | 3164 |
| 1964 | 3164 |
| 1965 | 3164 |
| 1966 | 3164 |
| 1967 | 3164 |
| 1968 | 3164 |
| 1969 | 3164 |
| 1970 | 3164 |
| 1971 | 3164 |
| 1972 | 3156 |
| 1973 | 3156 |
| 1974 | 3156 |
| 1975 | 3156 |
| 1976 | 3156 |
| 1977 | 3156 |
| 1978 | 3156 |
| 1979 | 3156 |
| 1980 | 3156 |
| 1981 | 3156 |
| 1982 | 3156 |
| 1983 | 3156 |
| 1984 | 3156 |
| 1985 | 3156 |
| 1986 | 3156 |
| 1987 | 3156 |
| 1988 | 3156 |
| 1989 | 3156 |
| 1990 | 3156 |
| 1991 | 3156 |
| 1992 | 3156 |
| 1993 | 3156 |
| 1994 | 3156 |
| 1995 | 3156 |
| 1996 | 3156 |
| 1997 | 3156 |
| 1998 | 3156 |
| 1999 | 3156 |
| 2000 | 3156 |
| 2001 | 3156 |
| 2002 | 3156 |
| 2003 | 3156 |
| 2004 | 3156 |
| 2005 | 3156 |
| 2006 | 3156 |
| 2007 | 3156 |
| 2008 | 3156 |
| 2009 | 3156 |
| 2010 | 3156 |
| 2011 | 3156 |
| 2012 | 3156 |
| 2013 | 3156 |
| 2014 | 3156 |
| 2015 | 3156 |
| 2016 | 3156 |
| 2017 | 3156 |
| 2018 | 3156 |
| 2019 | 3156 |
| 2020 | 3156 |
| 2021 | 3156 |
| 2022 | 3156 |
| 2023 | 3156 |
| 2024 | 3156 |
| 2025 | 3156 |
| 2026 | 3156 |
| 2027 | 3156 |
| 2028 | 3156 |
| 2029 | 3156 |
| 2030 | 3156 |
| 2031 | 3156 |
| 2032 | 3156 |
| 2033 | 3156 |
| 2034 | 3156 |
| 2035 | 3156 |
| 2036 | 3156 |
| 2037 | 3156 |
| 2038 | 3156 |
| 2039 | 3156 |
| 2040 | 3156 |
| 2041 | 3156 |
| 2042 | 3156 |
| 2043 | 3156 |
| 2044 | 3156 |
| 2045 | 3156 |
| 2046 | 3156 |
| 2047 | 3156 |
| 2048 | 3156 |
| 2049 | 3156 |
| 2050 | 3156 |
| 2051 | 3156 |
| 2052 | 3156 |
| 2053 | 3156 |
| 2054 | 3156 |
| 2055 | 3156 |
| 2056 | 3156 |
| 2057 | 3156 |
| 2058 | 3156 |
| 2059 | 3156 |
| 2060 | 3156 |
| 2061 | 3156 |
| 2062 | 3156 |
| 2063 | 3156 |
| 2064 | 3156 |
| 2065 | 3156 |
| 2066 | 3156 |
| 2067 | 3156 |
| 2068 | 3156 |
| 2069 | 3156 |
| 2070 | 3156 |
| 2071 | 3156 |
| 2072 | 3156 |
| 2073 | 3156 |
| 2074 | 3156 |
| 2075 | 3156 |
| 2076 | 3156 |
| 2077 | 3156 |
| 2078 | 3156 |
| 2079 | 3156 |
| 2080 | 3156 |
| 2081 | 3156 |
| 2082 | 3156 |
| 2083 | 3156 |
| 2084 | 3156 |
| 2085 | 3156 |
| 2086 | 3156 |
| 2087 | 3156 |
| 2088 | 3156 |
| 2089 | 3156 |
| 2090 | 3156 |
| 2091 | 3156 |
| 2092 | 3156 |
| 2093 | 3156 |
| 2094 | 3156 |
| 2095 | 3156 |
| 2096 | 3156 |
| 2097 | 3156 |
| 2098 | 3156 |
| 2099 | 3156 |
| 2100 | 3156 |
| 2101 | 3156 |
| 2102 | 3156 |
| 2103 | 3156 |
| 2104 | 3156 |
| 2105 | 3156 |
| 2106 | 3156 |
| 2107 | 3156 |
| 2108 | 3156 |
| 2109 | 3156 |
| 2110 | 3156 |
| 2111 | 3156 |
| 2112 | 3156 |
| 2113 | 3156 |
| 2114 | 3156 |
| 2115 | 3156 |
| 2116 | 3156 |
| 2117 | 3156 |
| 2118 | 3156 |
| 2119 | 3156 |
| 2120 | 3156 |
| 2121 | 3156 |
| 2122 | 3156 |
| 2123 | 3156 |
| 2124 | 3156 |
| 2125 | 3156 |
| 2126 | 3156 |
| 2127 | 3156 |
| 2128 | 3156 |
| 2129 | 3156 |
| 2130 | 3156 |
| 2131 | 3156 |
| 2132 | 3156 |
| 2133 | 3156 |
| 2134 | 3156 |
| 2135 | 3156 |
| 2136 | 3156 |
| 2137 | 3156 |
| 2138 | 3156 |
| 2139 | 3156 |
| 2140 | 3156 |
| 2141 | 3156 |
| 2142 | 3156 |
| 2143 | 3156 |
| 2144 | 3156 |
| 2145 | 3156 |
| 2146 | 3156 |
| 2147 | 3156 |
| 2148 | 3156 |
| 2149 | 3156 |
| 2150 | 3156 |
| 2151 | 3156 |
| 2152 | 3156 |
| 2153 | 3156 |
| 2154 | 3156 |
| 2155 | 3156 |
| 2156 | 3156 |
| 2157 | 3156 |
| 2158 | 3156 |
| 2159 | 3156 |
| 2160 | 3156 |
| 2161 | 3156 |
| 2162 | 3156 |
| 2163 | 3156 |
| 2164 | 3156 |
| 2165 | 3128 |
| 2166 | 3128 |
| 2167 | 3128 |
| 2168 | 3128 |
| 2169 | 3128 |
| 2170 | 3128 |
| 2171 | 3128 |
| 2172 | 3128 |
| 2173 | 3128 |
| 2174 | 3128 |
| 2175 | 3128 |
| 2176 | 3128 |
| 2177 | 3128 |
| 2178 | 3128 |
| 2179 | 3128 |
| 2180 | 3128 |
| 2181 | 3128 |
| 2182 | 3128 |
| 2183 | 3128 |
| 2184 | 3128 |
| 2185 | 3128 |
| 2186 | 3128 |
| 2187 | 3128 |
| 2188 | 3128 |
| 2189 | 3128 |
| 2190 | 3128 |
| 2191 | 3128 |
| 2192 | 3128 |
| 2193 | 3128 |
| 2194 | 3128 |
| 2195 | 3128 |
| 2196 | 3128 |
| 2197 | 3128 |
| 2198 | 3128 |
| 2199 | 3128 |
| 2200 | 3128 |
| 2201 | 3128 |
| 2202 | 3128 |
| 2203 | 3128 |
| 2204 | 3128 |
| 2205 | 3128 |
| 2206 | 3128 |
| 2207 | 3128 |
| 2208 | 3128 |
| 2209 | 3128 |
| 2210 | 3128 |
| 2211 | 3128 |
| 2212 | 3128 |
| 2213 | 3128 |
| 2214 | 3128 |
| 2215 | 3128 |
| 2216 | 3128 |
| 2217 | 3128 |
| 2218 | 3128 |
| 2219 | 3128 |
| 2220 | 3128 |
| 2221 | 3128 |
| 2222 | 3128 |
| 2223 | 3128 |
| 2224 | 3128 |
| 2225 | 3128 |
| 2226 | 3128 |
| 2227 | 3128 |
| 2228 | 3128 |
| 2229 | 3128 |
| 2230 | 3128 |
| 2231 | 3128 |
| 2232 | 3128 |
| 2233 | 3128 |
| 2234 | 3128 |
| 2235 | 3128 |
| 2236 | 3128 |
| 2237 | 3128 |
| 2238 | 3128 |
| 2239 | 3128 |
| 2240 | 3128 |
| 2241 | 3128 |
| 2242 | 3128 |
| 2243 | 3128 |
| 2244 | 3128 |
| 2245 | 3128 |
| 2246 | 3128 |
| 2247 | 3128 |
| 2248 | 3128 |
| 2249 | 3128 |
| 2250 | 3128 |
| 2251 | 3128 |
| 2252 | 3128 |
| 2253 | 3128 |
| 2254 | 3128 |
| 2255 | 3128 |
| 2256 | 3128 |
| 2257 | 3128 |
| 2258 | 3128 |
| 2259 | 3128 |
| 2260 | 3128 |
| 2261 | 3128 |
| 2262 | 3128 |
| 2263 | 3128 |
| 2264 | 3128 |
| 2265 | 3128 |
| 2266 | 3128 |
| 2267 | 3128 |
| 2268 | 3128 |
| 2269 | 3128 |
| 2270 | 3128 |
| 2271 | 3128 |
| 2272 | 3128 |
| 2273 | 3128 |
| 2274 | 3128 |
| 2275 | 3128 |
| 2276 | 3128 |
| 2277 | 3128 |
| 2278 | 3128 |
| 2279 | 3128 |
| 2280 | 3128 |
| 2281 | 3128 |
| 2282 | 3128 |
| 2283 | 3128 |
| 2284 | 3128 |
| 2285 | 3128 |
| 2286 | 3128 |
| 2287 | 3128 |
| 2288 | 3128 |
| 2289 | 3128 |
| 2290 | 3128 |
| 2291 | 3128 |
| 2292 | 3128 |
| 2293 | 3128 |
| 2294 | 3128 |
| 2295 | 3128 |
| 2296 | 3128 |
| 2297 | 3128 |
| 2298 | 3128 |
| 2299 | 3128 |
| 2300 | 3128 |
| 2301 | 3128 |
| 2302 | 3128 |
| 2303 | 3128 |
| 2304 | 3128 |
| 2305 | 3128 |
| 2306 | 3128 |
| 2307 | 3128 |
| 2308 | 3128 |
| 2309 | 3128 |
| 2310 | 3128 |
| 2311 | 3128 |
| 2312 | 3128 |
| 2313 | 3128 |
| 2314 | 3128 |
| 2315 | 3128 |
| 2316 | 3128 |
| 2317 | 3128 |
| 2318 | 3128 |
| 2319 | 3128 |
| 2320 | 3128 |
| 2321 | 3128 |
| 2322 | 3128 |
| 2323 | 3128 |
| 2324 | 3128 |
| 2325 | 3128 |
| 2326 | 3128 |
| 2327 | 3128 |
| 2328 | 3128 |
| 2329 | 3128 |
| 2330 | 3128 |
| 2331 | 3128 |
| 2332 | 3128 |
| 2333 | 3128 |
| 2334 | 3128 |
| 2335 | 3128 |
| 2336 | 3128 |
| 2337 | 3128 |
| 2338 | 3128 |
| 2339 | 3128 |
| 2340 | 3144 |
| 2341 | 3144 |
| 2342 | 3144 |
| 2343 | 3144 |
| 2344 | 3144 |
| 2345 | 3144 |
| 2346 | 3144 |
| 2347 | 3144 |
| 2348 | 3144 |
| 2349 | 3144 |
| 2350 | 3144 |
| 2351 | 3144 |
| 2352 | 3144 |
| 2353 | 3144 |
| 2354 | 3144 |
| 2355 | 3144 |
| 2356 | 3144 |
| 2357 | 3144 |
| 2358 | 3144 |
| 2359 | 3144 |
| 2360 | 3144 |
| 2361 | 3144 |
| 2362 | 3144 |
| 2363 | 3144 |
| 2364 | 3144 |
| 2365 | 3144 |
| 2366 | 3144 |
| 2367 | 3144 |
| 2368 | 3144 |
| 2369 | 3144 |
| 2370 | 3144 |
| 2371 | 3144 |
| 2372 | 3144 |
| 2373 | 3144 |
| 2374 | 3144 |
| 2375 | 3144 |
| 2376 | 3144 |
| 2377 | 3144 |
| 2378 | 3144 |
| 2379 | 3144 |
| 2380 | 3144 |
| 2381 | 3144 |
| 2382 | 3144 |
| 2383 | 3144 |
| 2384 | 3144 |
| 2385 | 3144 |
| 2386 | 3144 |
| 2387 | 3144 |
| 2388 | 3144 |
| 2389 | 3144 |
| 2390 | 3144 |
| 2391 | 3144 |
| 2392 | 3144 |
| 2393 | 3144 |
| 2394 | 3144 |
| 2395 | 3144 |
| 2396 | 3144 |
| 2397 | 3144 |
| 2398 | 3144 |
| 2399 | 3144 |
| 2400 | 3144 |
| 2401 | 3144 |
| 2402 | 3144 |
| 2403 | 3144 |
| 2404 | 3144 |
| 2405 | 3144 |
| 2406 | 3144 |
| 2407 | 3144 |
| 2408 | 3144 |
| 2409 | 3144 |
| 2410 | 3144 |
| 2411 | 3144 |
| 2412 | 3144 |
| 2413 | 3144 |
| 2414 | 3144 |
| 2415 | 3144 |
| 2416 | 3144 |
| 2417 | 3144 |
| 2418 | 3144 |
| 2419 | 3144 |
| 2420 | 3144 |
| 2421 | 3144 |
| 2422 | 3144 |
| 2423 | 3144 |
| 2424 | 3144 |
| 2425 | 3144 |
| 2426 | 3144 |
| 2427 | 3144 |
| 2428 | 3144 |
| 2429 | 3144 |
| 2430 | 3144 |
| 2431 | 3144 |
| 2432 | 3144 |
| 2433 | 3144 |
| 2434 | 3144 |
| 2435 | 3144 |
| 2436 | 3144 |
| 2437 | 3144 |
| 2438 | 3144 |
| 2439 | 3144 |
| 2440 | 3144 |
| 2441 | 3144 |
| 2442 | 3144 |
| 2443 | 3144 |
| 2444 | 3144 |
| 2445 | 3144 |
| 2446 | 3144 |
| 2447 | 3144 |
| 2448 | 3144 |
| 2449 | 3144 |
| 2450 | 3144 |
| 2451 | 3144 |
| 2452 | 3144 |
| 2453 | 3144 |
| 2454 | 3144 |
| 2455 | 3144 |
| 2456 | 3144 |
| 2457 | 3144 |
| 2458 | 3144 |
| 2459 | 3144 |
| 2460 | 3144 |
| 2461 | 3144 |
| 2462 | 3144 |
| 2463 | 3144 |
| 2464 | 3144 |
| 2465 | 3144 |
| 2466 | 3144 |
| 2467 | 3144 |
| 2468 | 3144 |
| 2469 | 3144 |
| 2470 | 3144 |
| 2471 | 3144 |
| 2472 | 3144 |
| 2473 | 3144 |
| 2474 | 3144 |
| 2475 | 3144 |
| 2476 | 3144 |
| 2477 | 3144 |
| 2478 | 3144 |
| 2479 | 3144 |
| 2480 | 3144 |
| 2481 | 3144 |
| 2482 | 3144 |
| 2483 | 3144 |
| 2484 | 3144 |
| 2485 | 3144 |
| 2486 | 3144 |
| 2487 | 3144 |
| 2488 | 3144 |
| 2489 | 3144 |
| 2490 | 3144 |
| 2491 | 3144 |
| 2492 | 3144 |
| 2493 | 3144 |
| 2494 | 3144 |
| 2495 | 3144 |
| 2496 | 3144 |
| 2497 | 3144 |
| 2498 | 3144 |
| 2499 | 3140 |
| 2500 | 3140 |
| 2501 | 3140 |
| 2502 | 3140 |
| 2503 | 3140 |
| 2504 | 3140 |
| 2505 | 3140 |
| 2506 | 3140 |
| 2507 | 3140 |
| 2508 | 3140 |
| 2509 | 3140 |
| 2510 | 3140 |
| 2511 | 3140 |
| 2512 | 3140 |
| 2513 | 3140 |
| 2514 | 3140 |
| 2515 | 3140 |
| 2516 | 3140 |
| 2517 | 3140 |
| 2518 | 3140 |
| 2519 | 3140 |
| 2520 | 3140 |
| 2521 | 3140 |
| 2522 | 3140 |
| 2523 | 3140 |
| 2524 | 3140 |
| 2525 | 3140 |
| 2526 | 3140 |
| 2527 | 3140 |
| 2528 | 3140 |
| 2529 | 3140 |
| 2530 | 3140 |
| 2531 | 3140 |
| 2532 | 3140 |
| 2533 | 3140 |
| 2534 | 3140 |
| 2535 | 3140 |
| 2536 | 3140 |
| 2537 | 3140 |
| 2538 | 3140 |
| 2539 | 3140 |
| 2540 | 3140 |
| 2541 | 3140 |
| 2542 | 3140 |
| 2543 | 3140 |
| 2544 | 3140 |
| 2545 | 3140 |
| 2546 | 3140 |
| 2547 | 3140 |
| 2548 | 3140 |
| 2549 | 3140 |
| 2550 | 3140 |
| 2551 | 3140 |
| 2552 | 3140 |
| 2553 | 3140 |
| 2554 | 3140 |
| 2555 | 3140 |
| 2556 | 3140 |
| 2557 | 3140 |
| 2558 | 3140 |
| 2559 | 3140 |
| 2560 | 3140 |
| 2561 | 3140 |
| 2562 | 3140 |
| 2563 | 3140 |
| 2564 | 3140 |
| 2565 | 3140 |
| 2566 | 3140 |
| 2567 | 3140 |
| 2568 | 3140 |
| 2569 | 3140 |
| 2570 | 3140 |
| 2571 | 3140 |
| 2572 | 3140 |
| 2573 | 3140 |
| 2574 | 3140 |
| 2575 | 3140 |
| 2576 | 3140 |
| 2577 | 3140 |
| 2578 | 3140 |
| 2579 | 3140 |
| 2580 | 3140 |
| 2581 | 3140 |
| 2582 | 3140 |
| 2583 | 3140 |
| 2584 | 3140 |
| 2585 | 3140 |
| 2586 | 3140 |
| 2587 | 3140 |
| 2588 | 3140 |
| 2589 | 3140 |
| 2590 | 3140 |
| 2591 | 3140 |
| 2592 | 3140 |
| 2593 | 3140 |
| 2594 | 3140 |
| 2595 | 3140 |
| 2596 | 3140 |
| 2597 | 3140 |
| 2598 | 3140 |
| 2599 | 3140 |
| 2600 | 3140 |
| 2601 | 3140 |
| 2602 | 3140 |
| 2603 | 3140 |
| 2604 | 3140 |
| 2605 | 3140 |
| 2606 | 3140 |
| 2607 | 3140 |
| 2608 | 3140 |
| 2609 | 3140 |
| 2610 | 3140 |
| 2611 | 3140 |
| 2612 | 3140 |
| 2613 | 3140 |
| 2614 | 3140 |
| 2615 | 3140 |
| 2616 | 3140 |
| 2617 | 3140 |
| 2618 | 3140 |
| 2619 | 3140 |
| 2620 | 3140 |
| 2621 | 3140 |
| 2622 | 3140 |
| 2623 | 3140 |
| 2624 | 3140 |
| 2625 | 3140 |
| 2626 | 3140 |
| 2627 | 3140 |
| 2628 | 3140 |
| 2629 | 3140 |
| 2630 | 3140 |
| 2631 | 3140 |
| 2632 | 3140 |
| 2633 | 3140 |
| 2634 | 3140 |
| 2635 | 3140 |
| 2636 | 3140 |
| 2637 | 3140 |
| 2638 | 3140 |
| 2639 | 3140 |
| 2640 | 3140 |
| 2641 | 3140 |
| 2642 | 3140 |
| 2643 | 3140 |
| 2644 | 3124 |
| 2645 | 3124 |
| 2646 | 3124 |
| 2647 | 3124 |
| 2648 | 3124 |
| 2649 | 3124 |
| 2650 | 3124 |
| 2651 | 3124 |
| 2652 | 3124 |
| 2653 | 3124 |
| 2654 | 3124 |
| 2655 | 3124 |
| 2656 | 3124 |
| 2657 | 3124 |
| 2658 | 3124 |
| 2659 | 3124 |
| 2660 | 3124 |
| 2661 | 3124 |
| 2662 | 3124 |
| 2663 | 3124 |
| 2664 | 3124 |
| 2665 | 3124 |
| 2666 | 3124 |
| 2667 | 3124 |
| 2668 | 3124 |
| 2669 | 3124 |
| 2670 | 3124 |
| 2671 | 3124 |
| 2672 | 3124 |
| 2673 | 3124 |
| 2674 | 3124 |
| 2675 | 3124 |
| 2676 | 3124 |
| 2677 | 3124 |
| 2678 | 3124 |
| 2679 | 3124 |
| 2680 | 3124 |
| 2681 | 3124 |
| 2682 | 3124 |
| 2683 | 3124 |
| 2684 | 3124 |
| 2685 | 3124 |
| 2686 | 3124 |
| 2687 | 3124 |
| 2688 | 3124 |
| 2689 | 3124 |
| 2690 | 3124 |
| 2691 | 3124 |
| 2692 | 3124 |
| 2693 | 3124 |
| 2694 | 3124 |
| 2695 | 3124 |
| 2696 | 3124 |
| 2697 | 3124 |
| 2698 | 3124 |
| 2699 | 3124 |
| 2700 | 3124 |
| 2701 | 3124 |
| 2702 | 3124 |
| 2703 | 3124 |
| 2704 | 3124 |
| 2705 | 3124 |
| 2706 | 3124 |
| 2707 | 3124 |
| 2708 | 3124 |
| 2709 | 3124 |
| 2710 | 3124 |
| 2711 | 3124 |
| 2712 | 3124 |
| 2713 | 3124 |
| 2714 | 3124 |
| 2715 | 3124 |
| 2716 | 3124 |
| 2717 | 3124 |
| 2718 | 3124 |
| 2719 | 3124 |
| 2720 | 3124 |
| 2721 | 3124 |
| 2722 | 3124 |
| 2723 | 3124 |
| 2724 | 3124 |
| 2725 | 3124 |
| 2726 | 3124 |
| 2727 | 3124 |
| 2728 | 3124 |
| 2729 | 3124 |
| 2730 | 3124 |
| 2731 | 3124 |
| 2732 | 3124 |
| 2733 | 3124 |
| 2734 | 3124 |
| 2735 | 3124 |
| 2736 | 3124 |
| 2737 | 3124 |
| 2738 | 3124 |
| 2739 | 3124 |
| 2740 | 3124 |
| 2741 | 3124 |
| 2742 | 3124 |
| 2743 | 3124 |
| 2744 | 3124 |
| 2745 | 3124 |
| 2746 | 3124 |
| 2747 | 3124 |
| 2748 | 3124 |
| 2749 | 3124 |
| 2750 | 3124 |
| 2751 | 3124 |
| 2752 | 3124 |
| 2753 | 3124 |
| 2754 | 3124 |
| 2755 | 3124 |
| 2756 | 3124 |
| 2757 | 3124 |
| 2758 | 3124 |
| 2759 | 3124 |
| 2760 | 3124 |
| 2761 | 3124 |
| 2762 | 3124 |
| 2763 | 3124 |
| 2764 | 3124 |
| 2765 | 3124 |
| 2766 | 3124 |
| 2767 | 3124 |
| 2768 | 3124 |
| 2769 | 3124 |
| 2770 | 3124 |
| 2771 | 3124 |
| 2772 | 3124 |
| 2773 | 3124 |
| 2774 | 3124 |
| 2775 | 3124 |
| 2776 | 3124 |
| 2777 | 3124 |
| 2778 | 3124 |
| 2779 | 3124 |
| 2780 | 3144 |
| 2781 | 3144 |
| 2782 | 3144 |
| 2783 | 3144 |
| 2784 | 3144 |
| 2785 | 3144 |
| 2786 | 3144 |
| 2787 | 3144 |
| 2788 | 3144 |
| 2789 | 3144 |
| 2790 | 3144 |
| 2791 | 3144 |
| 2792 | 3144 |
| 2793 | 3144 |
| 2794 | 3144 |
| 2795 | 3144 |
| 2796 | 3144 |
| 2797 | 3144 |
| 2798 | 3144 |
| 2799 | 3144 |
| 2800 | 3144 |
| 2801 | 3144 |
| 2802 | 3144 |
| 2803 | 3144 |
| 2804 | 3144 |
| 2805 | 3144 |
| 2806 | 3144 |
| 2807 | 3144 |
| 2808 | 3144 |
| 2809 | 3144 |
| 2810 | 3144 |
| 2811 | 3144 |
| 2812 | 3144 |
| 2813 | 3144 |
| 2814 | 3144 |
| 2815 | 3144 |
| 2816 | 3144 |
| 2817 | 3144 |
| 2818 | 3144 |
| 2819 | 3144 |
| 2820 | 3144 |
| 2821 | 3144 |
| 2822 | 3144 |
| 2823 | 3144 |
| 2824 | 3144 |
| 2825 | 3144 |
| 2826 | 3144 |
| 2827 | 3144 |
| 2828 | 3144 |
| 2829 | 3144 |
| 2830 | 3144 |
| 2831 | 3144 |
| 2832 | 3144 |
| 2833 | 3144 |
| 2834 | 3144 |
| 2835 | 3144 |
| 2836 | 3144 |
| 2837 | 3144 |
| 2838 | 3144 |
| 2839 | 3144 |
| 2840 | 3144 |
| 2841 | 3144 |
| 2842 | 3144 |
| 2843 | 3144 |
| 2844 | 3144 |
| 2845 | 3144 |
| 2846 | 3144 |
| 2847 | 3144 |
| 2848 | 3144 |
| 2849 | 3144 |
| 2850 | 3144 |
| 2851 | 3144 |
| 2852 | 3144 |
| 2853 | 3144 |
| 2854 | 3144 |
| 2855 | 3144 |
| 2856 | 3144 |
| 2857 | 3144 |
| 2858 | 3144 |
| 2859 | 3144 |
| 2860 | 3144 |
| 2861 | 3144 |
| 2862 | 3144 |
| 2863 | 3144 |
| 2864 | 3144 |
| 2865 | 3144 |
| 2866 | 3144 |
| 2867 | 3144 |
| 2868 | 3144 |
| 2869 | 3144 |
| 2870 | 3144 |
| 2871 | 3144 |
| 2872 | 3144 |
| 2873 | 3144 |
| 2874 | 3144 |
| 2875 | 3144 |
| 2876 | 3144 |
| 2877 | 3144 |
| 2878 | 3144 |
| 2879 | 3144 |
| 2880 | 3144 |
| 2881 | 3144 |
| 2882 | 3144 |
| 2883 | 3144 |
| 2884 | 3144 |
| 2885 | 3144 |
| 2886 | 3144 |
| 2887 | 3144 |
| 2888 | 3144 |
| 2889 | 3144 |
| 2890 | 3144 |
| 2891 | 3144 |
| 2892 | 3144 |
| 2893 | 3144 |
| 2894 | 3144 |
| 2895 | 3144 |
| 2896 | 3144 |
| 2897 | 3144 |
| 2898 | 3144 |
| 2899 | 3144 |
| 2900 | 3144 |
| 2901 | 3144 |
| 2902 | 3144 |
| 2903 | 3144 |
| 2904 | 3144 |
| 2905 | 3144 |
| 2906 | 3144 |
| 2907 | 3144 |
| 2908 | 3144 |
| 2909 | 3104 |
| 2910 | 3104 |
| 2911 | 3104 |
| 2912 | 3104 |
| 2913 | 3104 |
| 2914 | 3104 |
| 2915 | 3104 |
| 2916 | 3104 |
| 2917 | 3104 |
| 2918 | 3104 |
| 2919 | 3104 |
| 2920 | 3104 |
| 2921 | 3104 |
| 2922 | 3104 |
| 2923 | 3104 |
| 2924 | 3104 |
| 2925 | 3104 |
| 2926 | 3104 |
| 2927 | 3104 |
| 2928 | 3104 |
| 2929 | 3104 |
| 2930 | 3104 |
| 2931 | 3104 |
| 2932 | 3104 |
| 2933 | 3104 |
| 2934 | 3104 |
| 2935 | 3104 |
| 2936 | 3104 |
| 2937 | 3104 |
| 2938 | 3104 |
| 2939 | 3104 |
| 2940 | 3104 |
| 2941 | 3104 |
| 2942 | 3104 |
| 2943 | 3104 |
| 2944 | 3104 |
| 2945 | 3104 |
| 2946 | 3104 |
| 2947 | 3104 |
| 2948 | 3104 |
| 2949 | 3104 |
| 2950 | 3104 |
| 2951 | 3104 |
| 2952 | 3104 |
| 2953 | 3104 |
| 2954 | 3104 |
| 2955 | 3104 |
| 2956 | 3104 |
| 2957 | 3104 |
| 2958 | 3104 |
| 2959 | 3104 |
| 2960 | 3104 |
| 2961 | 3104 |
| 2962 | 3104 |
| 2963 | 3104 |
| 2964 | 3104 |
| 2965 | 3104 |
| 2966 | 3104 |
| 2967 | 3104 |
| 2968 | 3104 |
| 2969 | 3104 |
| 2970 | 3104 |
| 2971 | 3104 |
| 2972 | 3104 |
| 2973 | 3104 |
| 2974 | 3104 |
| 2975 | 3104 |
| 2976 | 3104 |
| 2977 | 3104 |
| 2978 | 3104 |
| 2979 | 3104 |
| 2980 | 3104 |
| 2981 | 3104 |
| 2982 | 3104 |
| 2983 | 3104 |
| 2984 | 3104 |
| 2985 | 3104 |
| 2986 | 3104 |
| 2987 | 3104 |
| 2988 | 3104 |
| 2989 | 3104 |
| 2990 | 3104 |
| 2991 | 3104 |
| 2992 | 3104 |
| 2993 | 3104 |
| 2994 | 3104 |
| 2995 | 3104 |
| 2996 | 3104 |
| 2997 | 3104 |
| 2998 | 3104 |
| 2999 | 3104 |
| 3000 | 3104 |
| 3001 | 3104 |
| 3002 | 3104 |
| 3003 | 3104 |
| 3004 | 3104 |
| 3005 | 3104 |
| 3006 | 3104 |
| 3007 | 3104 |
| 3008 | 3104 |
| 3009 | 3104 |
| 3010 | 3104 |
| 3011 | 3104 |
| 3012 | 3104 |
| 3013 | 3104 |
| 3014 | 3104 |
| 3015 | 3104 |
| 3016 | 3104 |
| 3017 | 3104 |
| 3018 | 3104 |
| 3019 | 3104 |
| 3020 | 3104 |
| 3021 | 3104 |
| 3022 | 3104 |
| 3023 | 3104 |
| 3024 | 3104 |
| 3025 | 3104 |
| 3026 | 3104 |
| 3027 | 3104 |
| 3028 | 3104 |
| 3029 | 3104 |
| 3030 | 3104 |
| 3031 | 3104 |
| 3032 | 3104 |
| 3033 | 3096 |
| 3034 | 3096 |
| 3035 | 3096 |
| 3036 | 3096 |
| 3037 | 3096 |
| 3038 | 3096 |
| 3039 | 3096 |
| 3040 | 3096 |
| 3041 | 3096 |
| 3042 | 3096 |
| 3043 | 3096 |
| 3044 | 3096 |
| 3045 | 3096 |
| 3046 | 3096 |
| 3047 | 3096 |
| 3048 | 3096 |
| 3049 | 3096 |
| 3050 | 3096 |
| 3051 | 3096 |
| 3052 | 3096 |
| 3053 | 3096 |
| 3054 | 3096 |
| 3055 | 3096 |
| 3056 | 3096 |
| 3057 | 3096 |
| 3058 | 3096 |
| 3059 | 3096 |
| 3060 | 3096 |
| 3061 | 3096 |
| 3062 | 3096 |
| 3063 | 3096 |
| 3064 | 3096 |
| 3065 | 3096 |
| 3066 | 3096 |
| 3067 | 3096 |
| 3068 | 3096 |
| 3069 | 3096 |
| 3070 | 3096 |
| 3071 | 3096 |
| 3072 | 3096 |
| 3073 | 3096 |
| 3074 | 3096 |
| 3075 | 3096 |
| 3076 | 3096 |
| 3077 | 3096 |
| 3078 | 3096 |
| 3079 | 3096 |
| 3080 | 3096 |
| 3081 | 3096 |
| 3082 | 3096 |
| 3083 | 3096 |
| 3084 | 3096 |
| 3085 | 3096 |
| 3086 | 3096 |
| 3087 | 3096 |
| 3088 | 3096 |
| 3089 | 3096 |
| 3090 | 3096 |
| 3091 | 3096 |
| 3092 | 3096 |
| 3093 | 3096 |
| 3094 | 3096 |
| 3095 | 3096 |
| 3096 | 3096 |
| 3097 | 3096 |
| 3098 | 3096 |
| 3099 | 3096 |
| 3100 | 3096 |
| 3101 | 3096 |
| 3102 | 3096 |
| 3103 | 3096 |
| 3104 | 3096 |
| 3105 | 3096 |
| 3106 | 3096 |
| 3107 | 3096 |
| 3108 | 3096 |
| 3109 | 3096 |
| 3110 | 3096 |
| 3111 | 3096 |
| 3112 | 3096 |
| 3113 | 3096 |
| 3114 | 3096 |
| 3115 | 3096 |
| 3116 | 3096 |
| 3117 | 3096 |
| 3118 | 3096 |
| 3119 | 3096 |
| 3120 | 3096 |
| 3121 | 3096 |
| 3122 | 3096 |
| 3123 | 3096 |
| 3124 | 3096 |
| 3125 | 3096 |
| 3126 | 3096 |
| 3127 | 3096 |
| 3128 | 3096 |
| 3129 | 3096 |
| 3130 | 3096 |
| 3131 | 3096 |
| 3132 | 3096 |
| 3133 | 3096 |
| 3134 | 3096 |
| 3135 | 3096 |
| 3136 | 3096 |
| 3137 | 3096 |
| 3138 | 3096 |
| 3139 | 3096 |
| 3140 | 3096 |
| 3141 | 3096 |
| 3142 | 3096 |
| 3143 | 3096 |
| 3144 | 3096 |
| 3145 | 3096 |
| 3146 | 3096 |
| 3147 | 3096 |
| 3148 | 3096 |
| 3149 | 3096 |
| 3150 | 3096 |
| 3151 | 3096 |
| 3152 | 3108 |
| 3153 | 3108 |
| 3154 | 3108 |
| 3155 | 3108 |
| 3156 | 3108 |
| 3157 | 3108 |
| 3158 | 3108 |
| 3159 | 3108 |
| 3160 | 3108 |
| 3161 | 3108 |
| 3162 | 3108 |
| 3163 | 3108 |
| 3164 | 3108 |
| 3165 | 3108 |
| 3166 | 3108 |
| 3167 | 3108 |
| 3168 | 3108 |
| 3169 | 3108 |
| 3170 | 3108 |
| 3171 | 3108 |
| 3172 | 3108 |
| 3173 | 3108 |
| 3174 | 3108 |
| 3175 | 3108 |
| 3176 | 3108 |
| 3177 | 3108 |
| 3178 | 3108 |
| 3179 | 3108 |
| 3180 | 3108 |
| 3181 | 3108 |
| 3182 | 3108 |
| 3183 | 3108 |
| 3184 | 3108 |
| 3185 | 3108 |
| 3186 | 3108 |
| 3187 | 3108 |
| 3188 | 3108 |
| 3189 | 3108 |
| 3190 | 3108 |
| 3191 | 3108 |
| 3192 | 3108 |
| 3193 | 3108 |
| 3194 | 3108 |
| 3195 | 3108 |
| 3196 | 3108 |
| 3197 | 3108 |
| 3198 | 3108 |
| 3199 | 3108 |
| 3200 | 3108 |
| 3201 | 3108 |
| 3202 | 3108 |
| 3203 | 3108 |
| 3204 | 3108 |
| 3205 | 3108 |
| 3206 | 3108 |
| 3207 | 3108 |
| 3208 | 3108 |
| 3209 | 3108 |
| 3210 | 3108 |
| 3211 | 3108 |
| 3212 | 3108 |
| 3213 | 3108 |
| 3214 | 3108 |
| 3215 | 3108 |
| 3216 | 3108 |
| 3217 | 3108 |
| 3218 | 3108 |
| 3219 | 3108 |
| 3220 | 3108 |
| 3221 | 3108 |
| 3222 | 3108 |
| 3223 | 3108 |
| 3224 | 3108 |
| 3225 | 3108 |
| 3226 | 3108 |
| 3227 | 3108 |
| 3228 | 3108 |
| 3229 | 3108 |
| 3230 | 3108 |
| 3231 | 3108 |
| 3232 | 3108 |
| 3233 | 3108 |
| 3234 | 3108 |
| 3235 | 3108 |
| 3236 | 3108 |
| 3237 | 3108 |
| 3238 | 3108 |
| 3239 | 3108 |
| 3240 | 3108 |
| 3241 | 3108 |
| 3242 | 3108 |
| 3243 | 3108 |
| 3244 | 3108 |
| 3245 | 3108 |
| 3246 | 3108 |
| 3247 | 3108 |
| 3248 | 3108 |
| 3249 | 3108 |
| 3250 | 3108 |
| 3251 | 3108 |
| 3252 | 3108 |
| 3253 | 3108 |
| 3254 | 3108 |
| 3255 | 3108 |
| 3256 | 3108 |
| 3257 | 3108 |
| 3258 | 3108 |
| 3259 | 3108 |
| 3260 | 3108 |
| 3261 | 3108 |
| 3262 | 3108 |
| 3263 | 3108 |
| 3264 | 3108 |
| 3265 | 3108 |
| 3266 | 3108 |
| 3267 | 3108 |
| 3268 | 3112 |
| 3269 | 3112 |
| 3270 | 3112 |
| 3271 | 3112 |
| 3272 | 3112 |
| 3273 | 3112 |
| 3274 | 3112 |
| 3275 | 3112 |
| 3276 | 3112 |
| 3277 | 3112 |
| 3278 | 3112 |
| 3279 | 3112 |
| 3280 | 3112 |
| 3281 | 3112 |
| 3282 | 3112 |
| 3283 | 3112 |
| 3284 | 3112 |
| 3285 | 3112 |
| 3286 | 3112 |
| 3287 | 3112 |
| 3288 | 3112 |
| 3289 | 3112 |
| 3290 | 3112 |
| 3291 | 3112 |
| 3292 | 3112 |
| 3293 | 3112 |
| 3294 | 3112 |
| 3295 | 3112 |
| 3296 | 3112 |
| 3297 | 3112 |
| 3298 | 3112 |
| 3299 | 3112 |
| 3300 | 3112 |
| 3301 | 3112 |
| 3302 | 3112 |
| 3303 | 3112 |
| 3304 | 3112 |
| 3305 | 3112 |
| 3306 | 3112 |
| 3307 | 3112 |
| 3308 | 3112 |
| 3309 | 3112 |
| 3310 | 3112 |
| 3311 | 3112 |
| 3312 | 3112 |
| 3313 | 3112 |
| 3314 | 3112 |
| 3315 | 3112 |
| 3316 | 3112 |
| 3317 | 3112 |
| 3318 | 3112 |
| 3319 | 3112 |
| 3320 | 3112 |
| 3321 | 3112 |
| 3322 | 3112 |
| 3323 | 3112 |
| 3324 | 3112 |
| 3325 | 3112 |
| 3326 | 3112 |
| 3327 | 3112 |
| 3328 | 3112 |
| 3329 | 3112 |
| 3330 | 3112 |
| 3331 | 3112 |
| 3332 | 3112 |
| 3333 | 3112 |
| 3334 | 3112 |
| 3335 | 3112 |
| 3336 | 3112 |
| 3337 | 3112 |
| 3338 | 3112 |
| 3339 | 3112 |
| 3340 | 3112 |
| 3341 | 3112 |
| 3342 | 3112 |
| 3343 | 3112 |
| 3344 | 3112 |
| 3345 | 3112 |
| 3346 | 3112 |
| 3347 | 3112 |
| 3348 | 3112 |
| 3349 | 3112 |
| 3350 | 3112 |
| 3351 | 3112 |
| 3352 | 3112 |
| 3353 | 3112 |
| 3354 | 3112 |
| 3355 | 3112 |
| 3356 | 3112 |
| 3357 | 3112 |
| 3358 | 3112 |
| 3359 | 3112 |
| 3360 | 3112 |
| 3361 | 3112 |
| 3362 | 3112 |
| 3363 | 3112 |
| 3364 | 3112 |
| 3365 | 3112 |
| 3366 | 3112 |
| 3367 | 3112 |
| 3368 | 3112 |
| 3369 | 3112 |
| 3370 | 3112 |
| 3371 | 3112 |
| 3372 | 3112 |
| 3373 | 3112 |
| 3374 | 3112 |
| 3375 | 3112 |
| 3376 | 3112 |
| 3377 | 3112 |
| 3378 | 3136 |
| 3379 | 3136 |
| 3380 | 3136 |
| 3381 | 3136 |
| 3382 | 3136 |
| 3383 | 3136 |
| 3384 | 3136 |
| 3385 | 3136 |
| 3386 | 3136 |
| 3387 | 3136 |
| 3388 | 3136 |
| 3389 | 3136 |
| 3390 | 3136 |
| 3391 | 3136 |
| 3392 | 3136 |
| 3393 | 3136 |
| 3394 | 3136 |
| 3395 | 3136 |
| 3396 | 3136 |
| 3397 | 3136 |
| 3398 | 3136 |
| 3399 | 3136 |
| 3400 | 3136 |
| 3401 | 3136 |
| 3402 | 3136 |
| 3403 | 3136 |
| 3404 | 3136 |
| 3405 | 3136 |
| 3406 | 3136 |
| 3407 | 3136 |
| 3408 | 3136 |
| 3409 | 3136 |
| 3410 | 3136 |
| 3411 | 3136 |
| 3412 | 3136 |
| 3413 | 3136 |
| 3414 | 3136 |
| 3415 | 3136 |
| 3416 | 3136 |
| 3417 | 3136 |
| 3418 | 3136 |
| 3419 | 3136 |
| 3420 | 3136 |
| 3421 | 3136 |
| 3422 | 3136 |
| 3423 | 3136 |
| 3424 | 3136 |
| 3425 | 3136 |
| 3426 | 3136 |
| 3427 | 3136 |
| 3428 | 3136 |
| 3429 | 3136 |
| 3430 | 3136 |
| 3431 | 3136 |
| 3432 | 3136 |
| 3433 | 3136 |
| 3434 | 3136 |
| 3435 | 3136 |
| 3436 | 3136 |
| 3437 | 3136 |
| 3438 | 3136 |
| 3439 | 3136 |
| 3440 | 3136 |
| 3441 | 3136 |
| 3442 | 3136 |
| 3443 | 3136 |
| 3444 | 3136 |
| 3445 | 3136 |
| 3446 | 3136 |
| 3447 | 3136 |
| 3448 | 3136 |
| 3449 | 3136 |
| 3450 | 3136 |
| 3451 | 3136 |
| 3452 | 3136 |
| 3453 | 3136 |
| 3454 | 3136 |
| 3455 | 3136 |
| 3456 | 3136 |
| 3457 | 3136 |
| 3458 | 3136 |
| 3459 | 3136 |
| 3460 | 3136 |
| 3461 | 3136 |
| 3462 | 3136 |
| 3463 | 3136 |
| 3464 | 3136 |
| 3465 | 3136 |
| 3466 | 3136 |
| 3467 | 3136 |
| 3468 | 3136 |
| 3469 | 3136 |
| 3470 | 3136 |
| 3471 | 3136 |
| 3472 | 3136 |
| 3473 | 3136 |
| 3474 | 3136 |
| 3475 | 3136 |
| 3476 | 3136 |
| 3477 | 3136 |
| 3478 | 3136 |
| 3479 | 3136 |
| 3480 | 3128 |
| 3481 | 3128 |
| 3482 | 3128 |
| 3483 | 3128 |
| 3484 | 3128 |
| 3485 | 3128 |
| 3486 | 3128 |
| 3487 | 3128 |
| 3488 | 3128 |
| 3489 | 3128 |
| 3490 | 3128 |
| 3491 | 3128 |
| 3492 | 3128 |
| 3493 | 3128 |
| 3494 | 3128 |
| 3495 | 3128 |
| 3496 | 3128 |
| 3497 | 3128 |
| 3498 | 3128 |
| 3499 | 3128 |
| 3500 | 3128 |
| 3501 | 3128 |
| 3502 | 3128 |
| 3503 | 3128 |
| 3504 | 3128 |
| 3505 | 3128 |
| 3506 | 3128 |
| 3507 | 3128 |
| 3508 | 3128 |
| 3509 | 3128 |
| 3510 | 3128 |
| 3511 | 3128 |
| 3512 | 3128 |
| 3513 | 3128 |
| 3514 | 3128 |
| 3515 | 3128 |
| 3516 | 3128 |
| 3517 | 3128 |
| 3518 | 3128 |
| 3519 | 3128 |
| 3520 | 3128 |
| 3521 | 3128 |
| 3522 | 3128 |
| 3523 | 3128 |
| 3524 | 3128 |
| 3525 | 3128 |
| 3526 | 3128 |
| 3527 | 3128 |
| 3528 | 3128 |
| 3529 | 3128 |
| 3530 | 3128 |
| 3531 | 3128 |
| 3532 | 3128 |
| 3533 | 3128 |
| 3534 | 3128 |
| 3535 | 3128 |
| 3536 | 3128 |
| 3537 | 3128 |
| 3538 | 3128 |
| 3539 | 3128 |
| 3540 | 3128 |
| 3541 | 3128 |
| 3542 | 3128 |
| 3543 | 3128 |
| 3544 | 3128 |
| 3545 | 3128 |
| 3546 | 3128 |
| 3547 | 3128 |
| 3548 | 3128 |
| 3549 | 3128 |
| 3550 | 3128 |
| 3551 | 3128 |
| 3552 | 3128 |
| 3553 | 3128 |
| 3554 | 3128 |
| 3555 | 3128 |
| 3556 | 3128 |
| 3557 | 3128 |
| 3558 | 3128 |
| 3559 | 3128 |
| 3560 | 3128 |
| 3561 | 3128 |
| 3562 | 3128 |
| 3563 | 3128 |
| 3564 | 3128 |
| 3565 | 3128 |
| 3566 | 3128 |
| 3567 | 3128 |
| 3568 | 3128 |
| 3569 | 3128 |
| 3570 | 3128 |
| 3571 | 3128 |
| 3572 | 3128 |
| 3573 | 3128 |
| 3574 | 3128 |
| 3575 | 3128 |
| 3576 | 3128 |
| 3577 | 3128 |
| 3578 | 3128 |
| 3579 | 3128 |
| 3580 | 3128 |
| 3581 | 3128 |
| 3582 | 3128 |
| 3583 | 3128 |
| 3584 | 3128 |
| 3585 | 3128 |
| 3586 | 3128 |
| 3587 | 3128 |
| 3588 | 3128 |
| 3589 | 3128 |
| 3590 | 3128 |
| 3591 | 3128 |
| 3592 | 3128 |
| 3593 | 3128 |
| 3594 | 3128 |
| 3595 | 3128 |
| 3596 | 3128 |
| 3597 | 3128 |
| 3598 | 3128 |
| 3599 | 3128 |
| 3600 | 3128 |
| 3601 | 3128 |
| 3602 | 3128 |
| 3603 | 3128 |
| 3604 | 3128 |
| 3605 | 3128 |
| 3606 | 3128 |
| 3607 | 3128 |
| 3608 | 3128 |
| 3609 | 3128 |
| 3610 | 3128 |
| 3611 | 3128 |
| 3612 | 3128 |
| 3613 | 3128 |
| 3614 | 3128 |
| 3615 | 3128 |
| 3616 | 3128 |
| 3617 | 3128 |
| 3618 | 3128 |
| 3619 | 3128 |
| 3620 | 3128 |
| 3621 | 3128 |
| 3622 | 3128 |
| 3623 | 3128 |
| 3624 | 3128 |
| 3625 | 3128 |
| 3626 | 3128 |
| 3627 | 3128 |
| 3628 | 3128 |
| 3629 | 3128 |
| 3630 | 3128 |
| 3631 | 3128 |
| 3632 | 3128 |
| 3633 | 3128 |
| 3634 | 3128 |
| 3635 | 3128 |
| 3636 | 3128 |
| 3637 | 3128 |
| 3638 | 3128 |
| 3639 | 3128 |
| 3640 | 3128 |
| 3641 | 3128 |
| 3642 | 3128 |
| 3643 | 3128 |
| 3644 | 3128 |
| 3645 | 3128 |
| 3646 | 3128 |
| 3647 | 3128 |
| 3648 | 3128 |
| 3649 | 3128 |
| 3650 | 3128 |
| 3651 | 3128 |
| 3652 | 3128 |
| 3653 | 3128 |
| 3654 | 3128 |
| 3655 | 3128 |
| 3656 | 3128 |
| 3657 | 3128 |
| 3658 | 3128 |
| 3659 | 3128 |
| 3660 | 3128 |
| 3661 | 3128 |
| 3662 | 3128 |
| 3663 | 3128 |
| 3664 | 3128 |
| 3665 | 3068 |
| 3666 | 3068 |
| 3667 | 3068 |
| 3668 | 3068 |
| 3669 | 3068 |
| 3670 | 3068 |
| 3671 | 3068 |
| 3672 | 3068 |
| 3673 | 3068 |
| 3674 | 3068 |
| 3675 | 3068 |
| 3676 | 3068 |
| 3677 | 3068 |
| 3678 | 3068 |
| 3679 | 3068 |
| 3680 | 3068 |
| 3681 | 3068 |
| 3682 | 3068 |
| 3683 | 3068 |
| 3684 | 3068 |
| 3685 | 3068 |
| 3686 | 3068 |
| 3687 | 3068 |
| 3688 | 3068 |
| 3689 | 3068 |
| 3690 | 3068 |
| 3691 | 3068 |
| 3692 | 3068 |
| 3693 | 3068 |
| 3694 | 3068 |
| 3695 | 3068 |
| 3696 | 3068 |
| 3697 | 3068 |
| 3698 | 3068 |
| 3699 | 3068 |
| 3700 | 3068 |
| 3701 | 3068 |
| 3702 | 3068 |
| 3703 | 3068 |
| 3704 | 3068 |
| 3705 | 3068 |
| 3706 | 3068 |
| 3707 | 3068 |
| 3708 | 3068 |
| 3709 | 3068 |
| 3710 | 3068 |
| 3711 | 3068 |
| 3712 | 3068 |
| 3713 | 3068 |
| 3714 | 3068 |
| 3715 | 3068 |
| 3716 | 3068 |
| 3717 | 3068 |
| 3718 | 3068 |
| 3719 | 3068 |
| 3720 | 3068 |
| 3721 | 3068 |
| 3722 | 3068 |
| 3723 | 3068 |
| 3724 | 3068 |
| 3725 | 3068 |
| 3726 | 3068 |
| 3727 | 3068 |
| 3728 | 3068 |
| 3729 | 3068 |
| 3730 | 3068 |
| 3731 | 3068 |
| 3732 | 3068 |
| 3733 | 3068 |
| 3734 | 3068 |
| 3735 | 3068 |
| 3736 | 3068 |
| 3737 | 3068 |
| 3738 | 3068 |
| 3739 | 3068 |
| 3740 | 3068 |
| 3741 | 3068 |
| 3742 | 3068 |
| 3743 | 3068 |
| 3744 | 3068 |
| 3745 | 3068 |
| 3746 | 3068 |
| 3747 | 3068 |
| 3748 | 3068 |
| 3749 | 3068 |
| 3750 | 3104 |
| 3751 | 3104 |
| 3752 | 3104 |
| 3753 | 3104 |
| 3754 | 3104 |
| 3755 | 3104 |
| 3756 | 3104 |
| 3757 | 3104 |
| 3758 | 3104 |
| 3759 | 3104 |
| 3760 | 3104 |
| 3761 | 3104 |
| 3762 | 3104 |
| 3763 | 3104 |
| 3764 | 3104 |
| 3765 | 3104 |
| 3766 | 3104 |
| 3767 | 3104 |
| 3768 | 3104 |
| 3769 | 3104 |
| 3770 | 3104 |
| 3771 | 3104 |
| 3772 | 3104 |
| 3773 | 3104 |
| 3774 | 3104 |
| 3775 | 3104 |
| 3776 | 3104 |
| 3777 | 3104 |
| 3778 | 3104 |
| 3779 | 3104 |
| 3780 | 3104 |
| 3781 | 3104 |
| 3782 | 3104 |
| 3783 | 3104 |
| 3784 | 3104 |
| 3785 | 3104 |
| 3786 | 3104 |
| 3787 | 3104 |
| 3788 | 3104 |
| 3789 | 3104 |
| 3790 | 3104 |
| 3791 | 3104 |
| 3792 | 3104 |
| 3793 | 3104 |
| 3794 | 3104 |
| 3795 | 3104 |
| 3796 | 3104 |
| 3797 | 3104 |
| 3798 | 3104 |
| 3799 | 3104 |
| 3800 | 3104 |
| 3801 | 3104 |
| 3802 | 3104 |
| 3803 | 3104 |
| 3804 | 3104 |
| 3805 | 3104 |
| 3806 | 3104 |
| 3807 | 3104 |
| 3808 | 3104 |
| 3809 | 3104 |
| 3810 | 3104 |
| 3811 | 3104 |
| 3812 | 3104 |
| 3813 | 3104 |
| 3814 | 3104 |
| 3815 | 3104 |
| 3816 | 3104 |
| 3817 | 3104 |
| 3818 | 3104 |
| 3819 | 3104 |
| 3820 | 3104 |
| 3821 | 3104 |
| 3822 | 3104 |
| 3823 | 3104 |
| 3824 | 3104 |
| 3825 | 3104 |
| 3826 | 3104 |
| 3827 | 3104 |
| 3828 | 3104 |
| 3829 | 3024 |
| 3830 | 3024 |
| 3831 | 3024 |
| 3832 | 3024 |
| 3833 | 3024 |
| 3834 | 3024 |
| 3835 | 3024 |
| 3836 | 3024 |
| 3837 | 3024 |
| 3838 | 3024 |
| 3839 | 3024 |
| 3840 | 3024 |
| 3841 | 3024 |
| 3842 | 3024 |
| 3843 | 3024 |
| 3844 | 3024 |
| 3845 | 3024 |
| 3846 | 3024 |
| 3847 | 3024 |
| 3848 | 3024 |
| 3849 | 3024 |
| 3850 | 3024 |
| 3851 | 3024 |
| 3852 | 3024 |
| 3853 | 3024 |
| 3854 | 3024 |
| 3855 | 3024 |
| 3856 | 3024 |
| 3857 | 3024 |
| 3858 | 3024 |
| 3859 | 3024 |
| 3860 | 3024 |
| 3861 | 3024 |
| 3862 | 3024 |
| 3863 | 3024 |
| 3864 | 3024 |
| 3865 | 3024 |
| 3866 | 3024 |
| 3867 | 3024 |
| 3868 | 3024 |
| 3869 | 3024 |
| 3870 | 3024 |
| 3871 | 3024 |
| 3872 | 3024 |
| 3873 | 3024 |
| 3874 | 3024 |
| 3875 | 3024 |
| 3876 | 3024 |
| 3877 | 3024 |
| 3878 | 3024 |
| 3879 | 3024 |
| 3880 | 3024 |
| 3881 | 3024 |
| 3882 | 3024 |
| 3883 | 3024 |
| 3884 | 3024 |
| 3885 | 3024 |
| 3886 | 3024 |
| 3887 | 3024 |
| 3888 | 3024 |
| 3889 | 3024 |
| 3890 | 3024 |
| 3891 | 3024 |
| 3892 | 3024 |
| 3893 | 3024 |
| 3894 | 3024 |
| 3895 | 3024 |
| 3896 | 3024 |
| 3897 | 3024 |
| 3898 | 3024 |
| 3899 | 3024 |
| 3900 | 3024 |
| 3901 | 3024 |
| 3902 | 3024 |
| 3903 | 3024 |
| 3904 | 3024 |
| 3905 | 3028 |
| 3906 | 3028 |
| 3907 | 3028 |
| 3908 | 3028 |
| 3909 | 3028 |
| 3910 | 3028 |
| 3911 | 3028 |
| 3912 | 3028 |
| 3913 | 3028 |
| 3914 | 3028 |
| 3915 | 3028 |
| 3916 | 3028 |
| 3917 | 3028 |
| 3918 | 3028 |
| 3919 | 3028 |
| 3920 | 3028 |
| 3921 | 3028 |
| 3922 | 3028 |
| 3923 | 3028 |
| 3924 | 3028 |
| 3925 | 3028 |
| 3926 | 3028 |
| 3927 | 3028 |
| 3928 | 3028 |
| 3929 | 3028 |
| 3930 | 3028 |
| 3931 | 3028 |
| 3932 | 3028 |
| 3933 | 3028 |
| 3934 | 3028 |
| 3935 | 3028 |
| 3936 | 3028 |
| 3937 | 3028 |
| 3938 | 3028 |
| 3939 | 3028 |
| 3940 | 3028 |
| 3941 | 3028 |
| 3942 | 3028 |
| 3943 | 3028 |
| 3944 | 3028 |
| 3945 | 3028 |
| 3946 | 3028 |
| 3947 | 3028 |
| 3948 | 3028 |
| 3949 | 3028 |
| 3950 | 3028 |
| 3951 | 3028 |
| 3952 | 3028 |
| 3953 | 3028 |
| 3954 | 3028 |
| 3955 | 3028 |
| 3956 | 3028 |
| 3957 | 3028 |
| 3958 | 3028 |
| 3959 | 3028 |
| 3960 | 3028 |
| 3961 | 3028 |
| 3962 | 3028 |
| 3963 | 3028 |
| 3964 | 3028 |
| 3965 | 3028 |
| 3966 | 3028 |
| 3967 | 3028 |
| 3968 | 3028 |
| 3969 | 3028 |
| 3970 | 3028 |
| 3971 | 3028 |
| 3972 | 3028 |
| 3973 | 3028 |
| 3974 | 3028 |
| 3975 | 3028 |
| 3976 | 3028 |
| 3977 | 3028 |
| 3978 | 3032 |
| 3979 | 3032 |
| 3980 | 3032 |
| 3981 | 3032 |
| 3982 | 3032 |
| 3983 | 3032 |
| 3984 | 3032 |
| 3985 | 3032 |
| 3986 | 3032 |
| 3987 | 3032 |
| 3988 | 3032 |
| 3989 | 3032 |
| 3990 | 3032 |
| 3991 | 3032 |
| 3992 | 3032 |
| 3993 | 3032 |
| 3994 | 3032 |
| 3995 | 3032 |
| 3996 | 3032 |
| 3997 | 3032 |
| 3998 | 3032 |
| 3999 | 3032 |
| 4000 | 3032 |
| 4001 | 3032 |
| 4002 | 3032 |
| 4003 | 3032 |
| 4004 | 3032 |
| 4005 | 3032 |
| 4006 | 3032 |
| 4007 | 3032 |
| 4008 | 3032 |
| 4009 | 3032 |
| 4010 | 3032 |
| 4011 | 3032 |
| 4012 | 3032 |
| 4013 | 3032 |
| 4014 | 3032 |
| 4015 | 3032 |
| 4016 | 3032 |
| 4017 | 3032 |
| 4018 | 3032 |
| 4019 | 3032 |
| 4020 | 3032 |
| 4021 | 3032 |
| 4022 | 3032 |
| 4023 | 3032 |
| 4024 | 3032 |
| 4025 | 3032 |
| 4026 | 3032 |
| 4027 | 3032 |
| 4028 | 3032 |
| 4029 | 3032 |
| 4030 | 3032 |
| 4031 | 3032 |
| 4032 | 3032 |
| 4033 | 3032 |
| 4034 | 3032 |
| 4035 | 3032 |
| 4036 | 3032 |
| 4037 | 3032 |
| 4038 | 3032 |
| 4039 | 3032 |
| 4040 | 3032 |
| 4041 | 3032 |
| 4042 | 3032 |
| 4043 | 3032 |
| 4044 | 3032 |
| 4045 | 3032 |
| 4046 | 3032 |
| 4047 | 3032 |
| 4048 | 3032 |
| 4049 | 3028 |
| 4050 | 3028 |
| 4051 | 3028 |
| 4052 | 3028 |
| 4053 | 3028 |
| 4054 | 3028 |
| 4055 | 3028 |
| 4056 | 3028 |
| 4057 | 3028 |
| 4058 | 3028 |
| 4059 | 3028 |
| 4060 | 3028 |
| 4061 | 3028 |
| 4062 | 3028 |
| 4063 | 3028 |
| 4064 | 3028 |
| 4065 | 3028 |
| 4066 | 3028 |
| 4067 | 3028 |
| 4068 | 3028 |
| 4069 | 3028 |
| 4070 | 3028 |
| 4071 | 3028 |
| 4072 | 3028 |
| 4073 | 3028 |
| 4074 | 3028 |
| 4075 | 3028 |
| 4076 | 3028 |
| 4077 | 3028 |
| 4078 | 3028 |
| 4079 | 3028 |
| 4080 | 3028 |
| 4081 | 3028 |
| 4082 | 3028 |
| 4083 | 3028 |
| 4084 | 3028 |
| 4085 | 3028 |
| 4086 | 3028 |
| 4087 | 3028 |
| 4088 | 3028 |
| 4089 | 3028 |
| 4090 | 3028 |
| 4091 | 3028 |
| 4092 | 3028 |
| 4093 | 3028 |
| 4094 | 3028 |
| 4095 | 3028 |
| 4096 | 3028 |
| 4097 | 3028 |
| 4098 | 3028 |
| 4099 | 3028 |
| 4100 | 3028 |
| 4101 | 3028 |
| 4102 | 3028 |
| 4103 | 3028 |
| 4104 | 3028 |
| 4105 | 3028 |
| 4106 | 3028 |
| 4107 | 3028 |
| 4108 | 3028 |
| 4109 | 3028 |
| 4110 | 3028 |
| 4111 | 3028 |
| 4112 | 3028 |
| 4113 | 3028 |
| 4114 | 3028 |
| 4115 | 3028 |
| 4116 | 3028 |
| 4117 | 3028 |
| 4118 | 3028 |
| 4119 | 3292 |
| 4120 | 3292 |
| 4121 | 3292 |
| 4122 | 3292 |
| 4123 | 3292 |
| 4124 | 3292 |
| 4125 | 3292 |
| 4126 | 3292 |
| 4127 | 3292 |
| 4128 | 3292 |
| 4129 | 3292 |
| 4130 | 3292 |
| 4131 | 3292 |
| 4132 | 3292 |
| 4133 | 3292 |
| 4134 | 3292 |
| 4135 | 3292 |
| 4136 | 3292 |
| 4137 | 3292 |
| 4138 | 3292 |
| 4139 | 3292 |
| 4140 | 3292 |
| 4141 | 3292 |
| 4142 | 3292 |
| 4143 | 3292 |
| 4144 | 3292 |
| 4145 | 3292 |
| 4146 | 3292 |
| 4147 | 3292 |
| 4148 | 3292 |
| 4149 | 3292 |
| 4150 | 3292 |
| 4151 | 3292 |
| 4152 | 3292 |
| 4153 | 3292 |
| 4154 | 3292 |
| 4155 | 3292 |
| 4156 | 3292 |
| 4157 | 3292 |
| 4158 | 3292 |
| 4159 | 3292 |
| 4160 | 3292 |
| 4161 | 3292 |
| 4162 | 3292 |
| 4163 | 3292 |
| 4164 | 3292 |
| 4165 | 3292 |
| 4166 | 3292 |
| 4167 | 3292 |
| 4168 | 3292 |
| 4169 | 3292 |
| 4170 | 3292 |
| 4171 | 3292 |
| 4172 | 3292 |
| 4173 | 3292 |
| 4174 | 3292 |
| 4175 | 3292 |
| 4176 | 3292 |
| 4177 | 3292 |
| 4178 | 3292 |
| 4179 | 3292 |
| 4180 | 3292 |
| 4181 | 3292 |
| 4182 | 3292 |
| 4183 | 3292 |
| 4184 | 3292 |
| 4185 | 3292 |
| 4186 | 3292 |
| 4187 | 3292 |
| 4188 | 3268 |
| 4189 | 3268 |
| 4190 | 3268 |
| 4191 | 3268 |
| 4192 | 3268 |
| 4193 | 3268 |
| 4194 | 3268 |
| 4195 | 3268 |
| 4196 | 3268 |
| 4197 | 3268 |
| 4198 | 3268 |
| 4199 | 3268 |
| 4200 | 3268 |
| 4201 | 3268 |
| 4202 | 3268 |
| 4203 | 3268 |
| 4204 | 3268 |
| 4205 | 3268 |
| 4206 | 3268 |
| 4207 | 3268 |
| 4208 | 3268 |
| 4209 | 3268 |
| 4210 | 3268 |
| 4211 | 3268 |
| 4212 | 3268 |
| 4213 | 3268 |
| 4214 | 3268 |
| 4215 | 3268 |
| 4216 | 3268 |
| 4217 | 3268 |
| 4218 | 3268 |
| 4219 | 3268 |
| 4220 | 3268 |
| 4221 | 3268 |
| 4222 | 3268 |
| 4223 | 3268 |
| 4224 | 3268 |
| 4225 | 3268 |
| 4226 | 3268 |
| 4227 | 3268 |
| 4228 | 3268 |
| 4229 | 3268 |
| 4230 | 3268 |
| 4231 | 3268 |
| 4232 | 3268 |
| 4233 | 3268 |
| 4234 | 3268 |
| 4235 | 3268 |
| 4236 | 3268 |
| 4237 | 3268 |
| 4238 | 3268 |
| 4239 | 3268 |
| 4240 | 3268 |
| 4241 | 3268 |
| 4242 | 3268 |
| 4243 | 3268 |
| 4244 | 3268 |
| 4245 | 3268 |
| 4246 | 3268 |
| 4247 | 3268 |
| 4248 | 3268 |
| 4249 | 3268 |
| 4250 | 3268 |
| 4251 | 3268 |
| 4252 | 3268 |
| 4253 | 3268 |
| 4254 | 3268 |
| 4255 | 3264 |
| 4256 | 3264 |
| 4257 | 3264 |
| 4258 | 3264 |
| 4259 | 3264 |
| 4260 | 3264 |
| 4261 | 3264 |
| 4262 | 3264 |
| 4263 | 3264 |
| 4264 | 3264 |
| 4265 | 3264 |
| 4266 | 3264 |
| 4267 | 3264 |
| 4268 | 3264 |
| 4269 | 3264 |
| 4270 | 3264 |
| 4271 | 3264 |
| 4272 | 3264 |
| 4273 | 3264 |
| 4274 | 3264 |
| 4275 | 3264 |
| 4276 | 3264 |
| 4277 | 3264 |
| 4278 | 3264 |
| 4279 | 3264 |
| 4280 | 3264 |
| 4281 | 3264 |
| 4282 | 3264 |
| 4283 | 3264 |
| 4284 | 3264 |
| 4285 | 3264 |
| 4286 | 3264 |
| 4287 | 3264 |
| 4288 | 3264 |
| 4289 | 3264 |
| 4290 | 3264 |
| 4291 | 3264 |
| 4292 | 3264 |
| 4293 | 3264 |
| 4294 | 3264 |
| 4295 | 3264 |
| 4296 | 3264 |
| 4297 | 3264 |
| 4298 | 3264 |
| 4299 | 3264 |
| 4300 | 3264 |
| 4301 | 3264 |
| 4302 | 3264 |
| 4303 | 3264 |
| 4304 | 3264 |
| 4305 | 3264 |
| 4306 | 3264 |
| 4307 | 3264 |
| 4308 | 3264 |
| 4309 | 3264 |
| 4310 | 3264 |
| 4311 | 3264 |
| 4312 | 3264 |
| 4313 | 3264 |
| 4314 | 3264 |
| 4315 | 3264 |
| 4316 | 3264 |
| 4317 | 3264 |
| 4318 | 3264 |
| 4319 | 3264 |
| 4320 | 3264 |
| 4321 | 3256 |
| 4322 | 3256 |
| 4323 | 3256 |
| 4324 | 3256 |
| 4325 | 3256 |
| 4326 | 3256 |
| 4327 | 3256 |
| 4328 | 3256 |
| 4329 | 3256 |
| 4330 | 3256 |
| 4331 | 3256 |
| 4332 | 3256 |
| 4333 | 3256 |
| 4334 | 3256 |
| 4335 | 3256 |
| 4336 | 3256 |
| 4337 | 3256 |
| 4338 | 3256 |
| 4339 | 3256 |
| 4340 | 3256 |
| 4341 | 3256 |
| 4342 | 3256 |
| 4343 | 3256 |
| 4344 | 3256 |
| 4345 | 3256 |
| 4346 | 3256 |
| 4347 | 3256 |
| 4348 | 3256 |
| 4349 | 3256 |
| 4350 | 3256 |
| 4351 | 3256 |
| 4352 | 3256 |
| 4353 | 3256 |
| 4354 | 3256 |
| 4355 | 3256 |
| 4356 | 3256 |
| 4357 | 3256 |
| 4358 | 3256 |
| 4359 | 3256 |
| 4360 | 3256 |
| 4361 | 3256 |
| 4362 | 3256 |
| 4363 | 3256 |
| 4364 | 3256 |
| 4365 | 3256 |
| 4366 | 3256 |
| 4367 | 3256 |
| 4368 | 3256 |
| 4369 | 3256 |
| 4370 | 3256 |
| 4371 | 3256 |
| 4372 | 3256 |
| 4373 | 3256 |
| 4374 | 3256 |
| 4375 | 3256 |
| 4376 | 3256 |
| 4377 | 3256 |
| 4378 | 3256 |
| 4379 | 3256 |
| 4380 | 3256 |
| 4381 | 3256 |
| 4382 | 3256 |
| 4383 | 3256 |
| 4384 | 3256 |
| 4385 | 3256 |
| 4386 | 3272 |
| 4387 | 3272 |
| 4388 | 3272 |
| 4389 | 3272 |
| 4390 | 3272 |
| 4391 | 3272 |
| 4392 | 3272 |
| 4393 | 3272 |
| 4394 | 3272 |
| 4395 | 3272 |
| 4396 | 3272 |
| 4397 | 3272 |
| 4398 | 3272 |
| 4399 | 3272 |
| 4400 | 3272 |
| 4401 | 3272 |
| 4402 | 3272 |
| 4403 | 3272 |
| 4404 | 3272 |
| 4405 | 3272 |
| 4406 | 3272 |
| 4407 | 3272 |
| 4408 | 3272 |
| 4409 | 3272 |
| 4410 | 3272 |
| 4411 | 3272 |
| 4412 | 3272 |
| 4413 | 3272 |
| 4414 | 3272 |
| 4415 | 3272 |
| 4416 | 3272 |
| 4417 | 3272 |
| 4418 | 3272 |
| 4419 | 3272 |
| 4420 | 3272 |
| 4421 | 3272 |
| 4422 | 3272 |
| 4423 | 3272 |
| 4424 | 3272 |
| 4425 | 3272 |
| 4426 | 3272 |
| 4427 | 3272 |
| 4428 | 3272 |
| 4429 | 3272 |
| 4430 | 3272 |
| 4431 | 3272 |
| 4432 | 3272 |
| 4433 | 3272 |
| 4434 | 3272 |
| 4435 | 3272 |
| 4436 | 3272 |
| 4437 | 3272 |
| 4438 | 3272 |
| 4439 | 3272 |
| 4440 | 3272 |
| 4441 | 3272 |
| 4442 | 3272 |
| 4443 | 3272 |
| 4444 | 3272 |
| 4445 | 3272 |
| 4446 | 3272 |
| 4447 | 3272 |
| 4448 | 3272 |
| 4449 | 3056 |
| 4450 | 3056 |
| 4451 | 3056 |
| 4452 | 3056 |
| 4453 | 3056 |
| 4454 | 3056 |
| 4455 | 3056 |
| 4456 | 3056 |
| 4457 | 3056 |
| 4458 | 3056 |
| 4459 | 3056 |
| 4460 | 3056 |
| 4461 | 3056 |
| 4462 | 3056 |
| 4463 | 3056 |
| 4464 | 3056 |
| 4465 | 3056 |
| 4466 | 3056 |
| 4467 | 3056 |
| 4468 | 3056 |
| 4469 | 3056 |
| 4470 | 3056 |
| 4471 | 3056 |
| 4472 | 3056 |
| 4473 | 3056 |
| 4474 | 3056 |
| 4475 | 3056 |
| 4476 | 3056 |
| 4477 | 3056 |
| 4478 | 3056 |
| 4479 | 3056 |
| 4480 | 3056 |
| 4481 | 3056 |
| 4482 | 3056 |
| 4483 | 3056 |
| 4484 | 3056 |
| 4485 | 3056 |
| 4486 | 3056 |
| 4487 | 3056 |
| 4488 | 3056 |
| 4489 | 3056 |
| 4490 | 3056 |
| 4491 | 3056 |
| 4492 | 3056 |
| 4493 | 3056 |
| 4494 | 3056 |
| 4495 | 3056 |
| 4496 | 3056 |
| 4497 | 3056 |
| 4498 | 3056 |
| 4499 | 3056 |
| 4500 | 3056 |
| 4501 | 3056 |
| 4502 | 3056 |
| 4503 | 3056 |
| 4504 | 3056 |
| 4505 | 3056 |
| 4506 | 3056 |
| 4507 | 3056 |
| 4508 | 3056 |
| 4509 | 3056 |
| 4510 | 3056 |
| 4511 | 3056 |
| 4512 | 3248 |
| 4513 | 3248 |
| 4514 | 3248 |
| 4515 | 3248 |
| 4516 | 3248 |
| 4517 | 3248 |
| 4518 | 3248 |
| 4519 | 3248 |
| 4520 | 3248 |
| 4521 | 3248 |
| 4522 | 3248 |
| 4523 | 3248 |
| 4524 | 3248 |
| 4525 | 3248 |
| 4526 | 3248 |
| 4527 | 3248 |
| 4528 | 3248 |
| 4529 | 3248 |
| 4530 | 3248 |
| 4531 | 3248 |
| 4532 | 3248 |
| 4533 | 3248 |
| 4534 | 3248 |
| 4535 | 3248 |
| 4536 | 3248 |
| 4537 | 3248 |
| 4538 | 3248 |
| 4539 | 3248 |
| 4540 | 3248 |
| 4541 | 3248 |
| 4542 | 3248 |
| 4543 | 3248 |
| 4544 | 3248 |
| 4545 | 3248 |
| 4546 | 3248 |
| 4547 | 3248 |
| 4548 | 3248 |
| 4549 | 3248 |
| 4550 | 3248 |
| 4551 | 3248 |
| 4552 | 3248 |
| 4553 | 3248 |
| 4554 | 3248 |
| 4555 | 3248 |
| 4556 | 3248 |
| 4557 | 3248 |
| 4558 | 3248 |
| 4559 | 3248 |
| 4560 | 3248 |
| 4561 | 3248 |
| 4562 | 3248 |
| 4563 | 3248 |
| 4564 | 3248 |
| 4565 | 3248 |
| 4566 | 3248 |
| 4567 | 3248 |
| 4568 | 3248 |
| 4569 | 3248 |
| 4570 | 3248 |
| 4571 | 3248 |
| 4572 | 3248 |
| 4573 | 3248 |
| 4574 | 3284 |
| 4575 | 3284 |
| 4576 | 3284 |
| 4577 | 3284 |
| 4578 | 3284 |
| 4579 | 3284 |
| 4580 | 3284 |
| 4581 | 3284 |
| 4582 | 3284 |
| 4583 | 3284 |
| 4584 | 3284 |
| 4585 | 3284 |
| 4586 | 3284 |
| 4587 | 3284 |
| 4588 | 3284 |
| 4589 | 3284 |
| 4590 | 3284 |
| 4591 | 3284 |
| 4592 | 3284 |
| 4593 | 3284 |
| 4594 | 3284 |
| 4595 | 3284 |
| 4596 | 3284 |
| 4597 | 3284 |
| 4598 | 3284 |
| 4599 | 3284 |
| 4600 | 3284 |
| 4601 | 3284 |
| 4602 | 3284 |
| 4603 | 3284 |
| 4604 | 3284 |
| 4605 | 3284 |
| 4606 | 3284 |
| 4607 | 3284 |
| 4608 | 3284 |
| 4609 | 3284 |
| 4610 | 3284 |
| 4611 | 3284 |
| 4612 | 3284 |
| 4613 | 3284 |
| 4614 | 3284 |
| 4615 | 3284 |
| 4616 | 3284 |
| 4617 | 3284 |
| 4618 | 3284 |
| 4619 | 3284 |
| 4620 | 3284 |
| 4621 | 3284 |
| 4622 | 3284 |
| 4623 | 3284 |
| 4624 | 3284 |
| 4625 | 3284 |
| 4626 | 3284 |
| 4627 | 3284 |
| 4628 | 3284 |
| 4629 | 3284 |
| 4630 | 3284 |
| 4631 | 3284 |
| 4632 | 3284 |
| 4633 | 3028 |
| 4634 | 3028 |
| 4635 | 3028 |
| 4636 | 3028 |
| 4637 | 3028 |
| 4638 | 3028 |
| 4639 | 3028 |
| 4640 | 3028 |
| 4641 | 3028 |
| 4642 | 3028 |
| 4643 | 3028 |
| 4644 | 3028 |
| 4645 | 3028 |
| 4646 | 3028 |
| 4647 | 3028 |
| 4648 | 3028 |
| 4649 | 3028 |
| 4650 | 3028 |
| 4651 | 3028 |
| 4652 | 3028 |
| 4653 | 3028 |
| 4654 | 3028 |
| 4655 | 3028 |
| 4656 | 3028 |
| 4657 | 3028 |
| 4658 | 3028 |
| 4659 | 3028 |
| 4660 | 3028 |
| 4661 | 3028 |
| 4662 | 3028 |
| 4663 | 3028 |
| 4664 | 3028 |
| 4665 | 3028 |
| 4666 | 3028 |
| 4667 | 3028 |
| 4668 | 3028 |
| 4669 | 3028 |
| 4670 | 3028 |
| 4671 | 3028 |
| 4672 | 3028 |
| 4673 | 3028 |
| 4674 | 3028 |
| 4675 | 3028 |
| 4676 | 3028 |
| 4677 | 3028 |
| 4678 | 3028 |
| 4679 | 3028 |
| 4680 | 3028 |
| 4681 | 3028 |
| 4682 | 3028 |
| 4683 | 3028 |
| 4684 | 3028 |
| 4685 | 3028 |
| 4686 | 3028 |
| 4687 | 3028 |
| 4688 | 3028 |
| 4689 | 3028 |
| 4690 | 3028 |
| 4691 | 3280 |
| 4692 | 3280 |
| 4693 | 3280 |
| 4694 | 3280 |
| 4695 | 3280 |
| 4696 | 3280 |
| 4697 | 3280 |
| 4698 | 3280 |
| 4699 | 3280 |
| 4700 | 3280 |
| 4701 | 3280 |
| 4702 | 3280 |
| 4703 | 3280 |
| 4704 | 3280 |
| 4705 | 3280 |
| 4706 | 3280 |
| 4707 | 3280 |
| 4708 | 3280 |
| 4709 | 3280 |
| 4710 | 3280 |
| 4711 | 3280 |
| 4712 | 3280 |
| 4713 | 3280 |
| 4714 | 3280 |
| 4715 | 3280 |
| 4716 | 3280 |
| 4717 | 3280 |
| 4718 | 3280 |
| 4719 | 3280 |
| 4720 | 3280 |
| 4721 | 3280 |
| 4722 | 3280 |
| 4723 | 3280 |
| 4724 | 3280 |
| 4725 | 3280 |
| 4726 | 3280 |
| 4727 | 3280 |
| 4728 | 3280 |
| 4729 | 3280 |
| 4730 | 3280 |
| 4731 | 3280 |
| 4732 | 3280 |
| 4733 | 3280 |
| 4734 | 3280 |
| 4735 | 3280 |
| 4736 | 3280 |
| 4737 | 3280 |
| 4738 | 3280 |
| 4739 | 3280 |
| 4740 | 3280 |
| 4741 | 3280 |
| 4742 | 3280 |
| 4743 | 3280 |
| 4744 | 3280 |
| 4745 | 3280 |
| 4746 | 3280 |
| 4747 | 3280 |
| 4748 | 3280 |
| 4749 | 3260 |
| 4750 | 3260 |
| 4751 | 3260 |
| 4752 | 3260 |
| 4753 | 3260 |
| 4754 | 3260 |
| 4755 | 3260 |
| 4756 | 3260 |
| 4757 | 3260 |
| 4758 | 3260 |
| 4759 | 3260 |
| 4760 | 3260 |
| 4761 | 3260 |
| 4762 | 3260 |
| 4763 | 3260 |
| 4764 | 3260 |
| 4765 | 3260 |
| 4766 | 3260 |
| 4767 | 3260 |
| 4768 | 3260 |
| 4769 | 3260 |
| 4770 | 3260 |
| 4771 | 3260 |
| 4772 | 3260 |
| 4773 | 3260 |
| 4774 | 3260 |
| 4775 | 3260 |
| 4776 | 3260 |
| 4777 | 3260 |
| 4778 | 3260 |
| 4779 | 3260 |
| 4780 | 3260 |
| 4781 | 3260 |
| 4782 | 3260 |
| 4783 | 3260 |
| 4784 | 3260 |
| 4785 | 3260 |
| 4786 | 3260 |
| 4787 | 3260 |
| 4788 | 3260 |
| 4789 | 3260 |
| 4790 | 3260 |
| 4791 | 3260 |
| 4792 | 3260 |
| 4793 | 3260 |
| 4794 | 3260 |
| 4795 | 3260 |
| 4796 | 3260 |
| 4797 | 3260 |
| 4798 | 3260 |
| 4799 | 3260 |
| 4800 | 3260 |
| 4801 | 3260 |
| 4802 | 3260 |
| 4803 | 3260 |
| 4804 | 3260 |
| 4805 | 3272 |
| 4806 | 3272 |
| 4807 | 3272 |
| 4808 | 3272 |
| 4809 | 3272 |
| 4810 | 3272 |
| 4811 | 3272 |
| 4812 | 3272 |
| 4813 | 3272 |
| 4814 | 3272 |
| 4815 | 3272 |
| 4816 | 3272 |
| 4817 | 3272 |
| 4818 | 3272 |
| 4819 | 3272 |
| 4820 | 3272 |
| 4821 | 3272 |
| 4822 | 3272 |
| 4823 | 3272 |
| 4824 | 3272 |
| 4825 | 3272 |
| 4826 | 3272 |
| 4827 | 3272 |
| 4828 | 3272 |
| 4829 | 3272 |
| 4830 | 3272 |
| 4831 | 3272 |
| 4832 | 3272 |
| 4833 | 3272 |
| 4834 | 3272 |
| 4835 | 3272 |
| 4836 | 3272 |
| 4837 | 3272 |
| 4838 | 3272 |
| 4839 | 3272 |
| 4840 | 3272 |
| 4841 | 3272 |
| 4842 | 3272 |
| 4843 | 3272 |
| 4844 | 3272 |
| 4845 | 3272 |
| 4846 | 3272 |
| 4847 | 3272 |
| 4848 | 3272 |
| 4849 | 3272 |
| 4850 | 3272 |
| 4851 | 3272 |
| 4852 | 3272 |
| 4853 | 3272 |
| 4854 | 3272 |
| 4855 | 3272 |
| 4856 | 3272 |
| 4857 | 3272 |
| 4858 | 3272 |
| 4859 | 3024 |
| 4860 | 3024 |
| 4861 | 3024 |
| 4862 | 3024 |
| 4863 | 3024 |
| 4864 | 3024 |
| 4865 | 3024 |
| 4866 | 3024 |
| 4867 | 3024 |
| 4868 | 3024 |
| 4869 | 3024 |
| 4870 | 3024 |
| 4871 | 3024 |
| 4872 | 3024 |
| 4873 | 3024 |
| 4874 | 3024 |
| 4875 | 3024 |
| 4876 | 3024 |
| 4877 | 3024 |
| 4878 | 3024 |
| 4879 | 3024 |
| 4880 | 3024 |
| 4881 | 3024 |
| 4882 | 3024 |
| 4883 | 3024 |
| 4884 | 3024 |
| 4885 | 3024 |
| 4886 | 3024 |
| 4887 | 3024 |
| 4888 | 3024 |
| 4889 | 3024 |
| 4890 | 3024 |
| 4891 | 3024 |
| 4892 | 3024 |
| 4893 | 3024 |
| 4894 | 3024 |
| 4895 | 3024 |
| 4896 | 3024 |
| 4897 | 3024 |
| 4898 | 3024 |
| 4899 | 3024 |
| 4900 | 3024 |
| 4901 | 3024 |
| 4902 | 3024 |
| 4903 | 3024 |
| 4904 | 3024 |
| 4905 | 3024 |
| 4906 | 3024 |
| 4907 | 3024 |
| 4908 | 3024 |
| 4909 | 3024 |
| 4910 | 3024 |
| 4911 | 3024 |
| 4912 | 3044 |
| 4913 | 3044 |
| 4914 | 3044 |
| 4915 | 3044 |
| 4916 | 3044 |
| 4917 | 3044 |
| 4918 | 3044 |
| 4919 | 3044 |
| 4920 | 3044 |
| 4921 | 3044 |
| 4922 | 3044 |
| 4923 | 3044 |
| 4924 | 3044 |
| 4925 | 3044 |
| 4926 | 3044 |
| 4927 | 3044 |
| 4928 | 3044 |
| 4929 | 3044 |
| 4930 | 3044 |
| 4931 | 3044 |
| 4932 | 3044 |
| 4933 | 3044 |
| 4934 | 3044 |
| 4935 | 3044 |
| 4936 | 3044 |
| 4937 | 3044 |
| 4938 | 3044 |
| 4939 | 3044 |
| 4940 | 3044 |
| 4941 | 3044 |
| 4942 | 3044 |
| 4943 | 3044 |
| 4944 | 3044 |
| 4945 | 3044 |
| 4946 | 3044 |
| 4947 | 3044 |
| 4948 | 3044 |
| 4949 | 3044 |
| 4950 | 3044 |
| 4951 | 3044 |
| 4952 | 3044 |
| 4953 | 3044 |
| 4954 | 3044 |
| 4955 | 3044 |
| 4956 | 3044 |
| 4957 | 3044 |
| 4958 | 3044 |
| 4959 | 3044 |
| 4960 | 3044 |
| 4961 | 3044 |
| 4962 | 3044 |
| 4963 | 3044 |
| 4964 | 3032 |
| 4965 | 3032 |
| 4966 | 3032 |
| 4967 | 3032 |
| 4968 | 3032 |
| 4969 | 3032 |
| 4970 | 3032 |
| 4971 | 3032 |
| 4972 | 3032 |
| 4973 | 3032 |
| 4974 | 3032 |
| 4975 | 3032 |
| 4976 | 3032 |
| 4977 | 3032 |
| 4978 | 3032 |
| 4979 | 3032 |
| 4980 | 3032 |
| 4981 | 3032 |
| 4982 | 3032 |
| 4983 | 3032 |
| 4984 | 3032 |
| 4985 | 3032 |
| 4986 | 3032 |
| 4987 | 3032 |
| 4988 | 3032 |
| 4989 | 3032 |
| 4990 | 3032 |
| 4991 | 3032 |
| 4992 | 3032 |
| 4993 | 3032 |
| 4994 | 3032 |
| 4995 | 3032 |
| 4996 | 3032 |
| 4997 | 3032 |
| 4998 | 3032 |
| 4999 | 3032 |
| 5000 | 3032 |
| 5001 | 3032 |
| 5002 | 3032 |
| 5003 | 3032 |
| 5004 | 3032 |
| 5005 | 3032 |
| 5006 | 3032 |
| 5007 | 3032 |
| 5008 | 3032 |
| 5009 | 3032 |
| 5010 | 3032 |
| 5011 | 3032 |
| 5012 | 3032 |
| 5013 | 3032 |
| 5014 | 3032 |
| 5015 | 3032 |
| 5016 | 3048 |
| 5017 | 3048 |
| 5018 | 3048 |
| 5019 | 3048 |
| 5020 | 3048 |
| 5021 | 3048 |
| 5022 | 3048 |
| 5023 | 3048 |
| 5024 | 3048 |
| 5025 | 3048 |
| 5026 | 3048 |
| 5027 | 3048 |
| 5028 | 3048 |
| 5029 | 3048 |
| 5030 | 3048 |
| 5031 | 3048 |
| 5032 | 3048 |
| 5033 | 3048 |
| 5034 | 3048 |
| 5035 | 3048 |
| 5036 | 3048 |
| 5037 | 3048 |
| 5038 | 3048 |
| 5039 | 3048 |
| 5040 | 3048 |
| 5041 | 3048 |
| 5042 | 3048 |
| 5043 | 3048 |
| 5044 | 3048 |
| 5045 | 3048 |
| 5046 | 3048 |
| 5047 | 3048 |
| 5048 | 3048 |
| 5049 | 3048 |
| 5050 | 3048 |
| 5051 | 3048 |
| 5052 | 3048 |
| 5053 | 3048 |
| 5054 | 3048 |
| 5055 | 3048 |
| 5056 | 3048 |
| 5057 | 3048 |
| 5058 | 3048 |
| 5059 | 3048 |
| 5060 | 3048 |
| 5061 | 3048 |
| 5062 | 3048 |
| 5063 | 3048 |
| 5064 | 3048 |
| 5065 | 3048 |
| 5066 | 3048 |
| 5067 | 3260 |
| 5068 | 3260 |
| 5069 | 3260 |
| 5070 | 3260 |
| 5071 | 3260 |
| 5072 | 3260 |
| 5073 | 3260 |
| 5074 | 3260 |
| 5075 | 3260 |
| 5076 | 3260 |
| 5077 | 3260 |
| 5078 | 3260 |
| 5079 | 3260 |
| 5080 | 3260 |
| 5081 | 3260 |
| 5082 | 3260 |
| 5083 | 3260 |
| 5084 | 3260 |
| 5085 | 3260 |
| 5086 | 3260 |
| 5087 | 3260 |
| 5088 | 3260 |
| 5089 | 3260 |
| 5090 | 3260 |
| 5091 | 3260 |
| 5092 | 3260 |
| 5093 | 3260 |
| 5094 | 3260 |
| 5095 | 3260 |
| 5096 | 3260 |
| 5097 | 3260 |
| 5098 | 3260 |
| 5099 | 3260 |
| 5100 | 3260 |
| 5101 | 3260 |
| 5102 | 3260 |
| 5103 | 3260 |
| 5104 | 3260 |
| 5105 | 3260 |
| 5106 | 3260 |
| 5107 | 3260 |
| 5108 | 3260 |
| 5109 | 3260 |
| 5110 | 3260 |
| 5111 | 3260 |
| 5112 | 3260 |
| 5113 | 3260 |
| 5114 | 3260 |
| 5115 | 3260 |
| 5116 | 3260 |
| 5117 | 3260 |
| 5118 | 3276 |
| 5119 | 3276 |
| 5120 | 3276 |
| 5121 | 3276 |
| 5122 | 3276 |
| 5123 | 3276 |
| 5124 | 3276 |
| 5125 | 3276 |
| 5126 | 3276 |
| 5127 | 3276 |
| 5128 | 3276 |
| 5129 | 3276 |
| 5130 | 3276 |
| 5131 | 3276 |
| 5132 | 3276 |
| 5133 | 3276 |
| 5134 | 3276 |
| 5135 | 3276 |
| 5136 | 3276 |
| 5137 | 3276 |
| 5138 | 3276 |
| 5139 | 3276 |
| 5140 | 3276 |
| 5141 | 3276 |
| 5142 | 3276 |
| 5143 | 3276 |
| 5144 | 3276 |
| 5145 | 3276 |
| 5146 | 3276 |
| 5147 | 3276 |
| 5148 | 3276 |
| 5149 | 3276 |
| 5150 | 3276 |
| 5151 | 3276 |
| 5152 | 3276 |
| 5153 | 3276 |
| 5154 | 3276 |
| 5155 | 3276 |
| 5156 | 3276 |
| 5157 | 3276 |
| 5158 | 3276 |
| 5159 | 3276 |
| 5160 | 3276 |
| 5161 | 3276 |
| 5162 | 3276 |
| 5163 | 3276 |
| 5164 | 3276 |
| 5165 | 3276 |
| 5166 | 3276 |
| 5167 | 3276 |
| 5168 | 3276 |
| 5169 | 3268 |
| 5170 | 3268 |
| 5171 | 3268 |
| 5172 | 3268 |
| 5173 | 3268 |
| 5174 | 3268 |
| 5175 | 3268 |
| 5176 | 3268 |
| 5177 | 3268 |
| 5178 | 3268 |
| 5179 | 3268 |
| 5180 | 3268 |
| 5181 | 3268 |
| 5182 | 3268 |
| 5183 | 3268 |
| 5184 | 3268 |
| 5185 | 3268 |
| 5186 | 3268 |
| 5187 | 3268 |
| 5188 | 3268 |
| 5189 | 3268 |
| 5190 | 3268 |
| 5191 | 3268 |
| 5192 | 3268 |
| 5193 | 3268 |
| 5194 | 3268 |
| 5195 | 3268 |
| 5196 | 3268 |
| 5197 | 3268 |
| 5198 | 3268 |
| 5199 | 3268 |
| 5200 | 3268 |
| 5201 | 3268 |
| 5202 | 3268 |
| 5203 | 3268 |
| 5204 | 3268 |
| 5205 | 3268 |
| 5206 | 3268 |
| 5207 | 3268 |
| 5208 | 3268 |
| 5209 | 3268 |
| 5210 | 3268 |
| 5211 | 3268 |
| 5212 | 3268 |
| 5213 | 3268 |
| 5214 | 3268 |
| 5215 | 3268 |
| 5216 | 3268 |
| 5217 | 3268 |
| 5218 | 3268 |
| 5219 | 3268 |
| 5220 | 3048 |
| 5221 | 3048 |
| 5222 | 3048 |
| 5223 | 3048 |
| 5224 | 3048 |
| 5225 | 3048 |
| 5226 | 3048 |
| 5227 | 3048 |
| 5228 | 3048 |
| 5229 | 3048 |
| 5230 | 3048 |
| 5231 | 3048 |
| 5232 | 3048 |
| 5233 | 3048 |
| 5234 | 3048 |
| 5235 | 3048 |
| 5236 | 3048 |
| 5237 | 3048 |
| 5238 | 3048 |
| 5239 | 3048 |
| 5240 | 3048 |
| 5241 | 3048 |
| 5242 | 3048 |
| 5243 | 3048 |
| 5244 | 3048 |
| 5245 | 3048 |
| 5246 | 3048 |
| 5247 | 3048 |
| 5248 | 3048 |
| 5249 | 3048 |
| 5250 | 3048 |
| 5251 | 3048 |
| 5252 | 3048 |
| 5253 | 3048 |
| 5254 | 3048 |
| 5255 | 3048 |
| 5256 | 3048 |
| 5257 | 3048 |
| 5258 | 3048 |
| 5259 | 3048 |
| 5260 | 3048 |
| 5261 | 3048 |
| 5262 | 3048 |
| 5263 | 3048 |
| 5264 | 3048 |
| 5265 | 3048 |
| 5266 | 3048 |
| 5267 | 3048 |
| 5268 | 3048 |
| 5269 | 3048 |
| 5270 | 3048 |
| 5271 | 3048 |
| 5272 | 3048 |
| 5273 | 3048 |
| 5274 | 3048 |
| 5275 | 3048 |
| 5276 | 3048 |
| 5277 | 3048 |
| 5278 | 3048 |
| 5279 | 3048 |
| 5280 | 3048 |
| 5281 | 3048 |
| 5282 | 3048 |
| 5283 | 3048 |
| 5284 | 3048 |
| 5285 | 3048 |
| 5286 | 3048 |
| 5287 | 3048 |
| 5288 | 3048 |
| 5289 | 3048 |
| 5290 | 3048 |
| 5291 | 3048 |
| 5292 | 3048 |
| 5293 | 3048 |
| 5294 | 3048 |
| 5295 | 3048 |
| 5296 | 3048 |
| 5297 | 3048 |
| 5298 | 3048 |
| 5299 | 3048 |
| 5300 | 3048 |
| 5301 | 3048 |
| 5302 | 3048 |
| 5303 | 3048 |
| 5304 | 3048 |
| 5305 | 3048 |
| 5306 | 3048 |
| 5307 | 3048 |
| 5308 | 3048 |
| 5309 | 3048 |
| 5310 | 3048 |
| 5311 | 3048 |
| 5312 | 3048 |
| 5313 | 3048 |
| 5314 | 3048 |
| 5315 | 3048 |
| 5316 | 3048 |
| 5317 | 3048 |
| 5318 | 3048 |
| 5319 | 3048 |
| 5320 | 3048 |
| 5321 | 3048 |
| 5322 | 3296 |
| 5323 | 3296 |
| 5324 | 3296 |
| 5325 | 3296 |
| 5326 | 3296 |
| 5327 | 3296 |
| 5328 | 3296 |
| 5329 | 3296 |
| 5330 | 3296 |
| 5331 | 3296 |
| 5332 | 3296 |
| 5333 | 3296 |
| 5334 | 3296 |
| 5335 | 3296 |
| 5336 | 3296 |
| 5337 | 3296 |
| 5338 | 3296 |
| 5339 | 3296 |
| 5340 | 3296 |
| 5341 | 3296 |
| 5342 | 3296 |
| 5343 | 3296 |
| 5344 | 3296 |
| 5345 | 3296 |
| 5346 | 3296 |
| 5347 | 3296 |
| 5348 | 3296 |
| 5349 | 3296 |
| 5350 | 3296 |
| 5351 | 3296 |
| 5352 | 3296 |
| 5353 | 3296 |
| 5354 | 3296 |
| 5355 | 3296 |
| 5356 | 3296 |
| 5357 | 3296 |
| 5358 | 3296 |
| 5359 | 3296 |
| 5360 | 3296 |
| 5361 | 3296 |
| 5362 | 3296 |
| 5363 | 3296 |
| 5364 | 3296 |
| 5365 | 3296 |
| 5366 | 3296 |
| 5367 | 3296 |
| 5368 | 3296 |
| 5369 | 3296 |
| 5370 | 3296 |
| 5371 | 3296 |
| 5372 | 3296 |
| 5373 | 3276 |
| 5374 | 3276 |
| 5375 | 3276 |
| 5376 | 3276 |
| 5377 | 3276 |
| 5378 | 3276 |
| 5379 | 3276 |
| 5380 | 3276 |
| 5381 | 3276 |
| 5382 | 3276 |
| 5383 | 3276 |
| 5384 | 3276 |
| 5385 | 3276 |
| 5386 | 3276 |
| 5387 | 3276 |
| 5388 | 3276 |
| 5389 | 3276 |
| 5390 | 3276 |
| 5391 | 3276 |
| 5392 | 3276 |
| 5393 | 3276 |
| 5394 | 3276 |
| 5395 | 3276 |
| 5396 | 3276 |
| 5397 | 3276 |
| 5398 | 3276 |
| 5399 | 3276 |
| 5400 | 3276 |
| 5401 | 3276 |
| 5402 | 3276 |
| 5403 | 3276 |
| 5404 | 3276 |
| 5405 | 3276 |
| 5406 | 3276 |
| 5407 | 3276 |
| 5408 | 3276 |
| 5409 | 3276 |
| 5410 | 3276 |
| 5411 | 3276 |
| 5412 | 3276 |
| 5413 | 3276 |
| 5414 | 3276 |
| 5415 | 3276 |
| 5416 | 3276 |
| 5417 | 3276 |
| 5418 | 3276 |
| 5419 | 3276 |
| 5420 | 3276 |
| 5421 | 3276 |
| 5422 | 3276 |
| 5423 | 3076 |
| 5424 | 3076 |
| 5425 | 3076 |
| 5426 | 3076 |
| 5427 | 3076 |
| 5428 | 3076 |
| 5429 | 3076 |
| 5430 | 3076 |
| 5431 | 3076 |
| 5432 | 3076 |
| 5433 | 3076 |
| 5434 | 3076 |
| 5435 | 3076 |
| 5436 | 3076 |
| 5437 | 3076 |
| 5438 | 3076 |
| 5439 | 3076 |
| 5440 | 3076 |
| 5441 | 3076 |
| 5442 | 3076 |
| 5443 | 3076 |
| 5444 | 3076 |
| 5445 | 3076 |
| 5446 | 3076 |
| 5447 | 3076 |
| 5448 | 3076 |
| 5449 | 3076 |
| 5450 | 3076 |
| 5451 | 3076 |
| 5452 | 3076 |
| 5453 | 3076 |
| 5454 | 3076 |
| 5455 | 3076 |
| 5456 | 3076 |
| 5457 | 3076 |
| 5458 | 3076 |
| 5459 | 3076 |
| 5460 | 3076 |
| 5461 | 3076 |
| 5462 | 3076 |
| 5463 | 3076 |
| 5464 | 3076 |
| 5465 | 3076 |
| 5466 | 3076 |
| 5467 | 3076 |
| 5468 | 3076 |
| 5469 | 3076 |
| 5470 | 3076 |
| 5471 | 3076 |
| 5472 | 3076 |
| 5473 | 3076 |
| 5474 | 3232 |
| 5475 | 3232 |
| 5476 | 3232 |
| 5477 | 3232 |
| 5478 | 3232 |
| 5479 | 3232 |
| 5480 | 3232 |
| 5481 | 3232 |
| 5482 | 3232 |
| 5483 | 3232 |
| 5484 | 3232 |
| 5485 | 3232 |
| 5486 | 3232 |
| 5487 | 3232 |
| 5488 | 3232 |
| 5489 | 3232 |
| 5490 | 3232 |
| 5491 | 3232 |
| 5492 | 3232 |
| 5493 | 3232 |
| 5494 | 3232 |
| 5495 | 3232 |
| 5496 | 3232 |
| 5497 | 3232 |
| 5498 | 3232 |
| 5499 | 3232 |
| 5500 | 3232 |
| 5501 | 3232 |
| 5502 | 3232 |
| 5503 | 3232 |
| 5504 | 3232 |
| 5505 | 3232 |
| 5506 | 3232 |
| 5507 | 3232 |
| 5508 | 3232 |
| 5509 | 3232 |
| 5510 | 3232 |
| 5511 | 3232 |
| 5512 | 3232 |
| 5513 | 3232 |
| 5514 | 3232 |
| 5515 | 3232 |
| 5516 | 3232 |
| 5517 | 3232 |
| 5518 | 3232 |
| 5519 | 3232 |
| 5520 | 3232 |
| 5521 | 3232 |
| 5522 | 3044 |
| 5523 | 3044 |
| 5524 | 3044 |
| 5525 | 3044 |
| 5526 | 3044 |
| 5527 | 3044 |
| 5528 | 3044 |
| 5529 | 3044 |
| 5530 | 3044 |
| 5531 | 3044 |
| 5532 | 3044 |
| 5533 | 3044 |
| 5534 | 3044 |
| 5535 | 3044 |
| 5536 | 3044 |
| 5537 | 3044 |
| 5538 | 3044 |
| 5539 | 3044 |
| 5540 | 3044 |
| 5541 | 3044 |
| 5542 | 3044 |
| 5543 | 3044 |
| 5544 | 3044 |
| 5545 | 3044 |
| 5546 | 3044 |
| 5547 | 3044 |
| 5548 | 3044 |
| 5549 | 3044 |
| 5550 | 3044 |
| 5551 | 3044 |
| 5552 | 3044 |
| 5553 | 3044 |
| 5554 | 3044 |
| 5555 | 3044 |
| 5556 | 3044 |
| 5557 | 3044 |
| 5558 | 3044 |
| 5559 | 3044 |
| 5560 | 3044 |
| 5561 | 3044 |
| 5562 | 3044 |
| 5563 | 3044 |
| 5564 | 3044 |
| 5565 | 3044 |
| 5566 | 3044 |
| 5567 | 3044 |
| 5568 | 3044 |
| 5569 | 3044 |
| 5570 | 3060 |
| 5571 | 3060 |
| 5572 | 3060 |
| 5573 | 3060 |
| 5574 | 3060 |
| 5575 | 3060 |
| 5576 | 3060 |
| 5577 | 3060 |
| 5578 | 3060 |
| 5579 | 3060 |
| 5580 | 3060 |
| 5581 | 3060 |
| 5582 | 3060 |
| 5583 | 3060 |
| 5584 | 3060 |
| 5585 | 3060 |
| 5586 | 3060 |
| 5587 | 3060 |
| 5588 | 3060 |
| 5589 | 3060 |
| 5590 | 3060 |
| 5591 | 3060 |
| 5592 | 3060 |
| 5593 | 3060 |
| 5594 | 3060 |
| 5595 | 3060 |
| 5596 | 3060 |
| 5597 | 3060 |
| 5598 | 3060 |
| 5599 | 3060 |
| 5600 | 3060 |
| 5601 | 3060 |
| 5602 | 3060 |
| 5603 | 3060 |
| 5604 | 3060 |
| 5605 | 3060 |
| 5606 | 3060 |
| 5607 | 3060 |
| 5608 | 3060 |
| 5609 | 3060 |
| 5610 | 3060 |
| 5611 | 3060 |
| 5612 | 3060 |
| 5613 | 3060 |
| 5614 | 3060 |
| 5615 | 3060 |
| 5616 | 3060 |
| 5617 | 3060 |
| 5618 | 3028 |
| 5619 | 3028 |
| 5620 | 3028 |
| 5621 | 3028 |
| 5622 | 3028 |
| 5623 | 3028 |
| 5624 | 3028 |
| 5625 | 3028 |
| 5626 | 3028 |
| 5627 | 3028 |
| 5628 | 3028 |
| 5629 | 3028 |
| 5630 | 3028 |
| 5631 | 3028 |
| 5632 | 3028 |
| 5633 | 3028 |
| 5634 | 3028 |
| 5635 | 3028 |
| 5636 | 3028 |
| 5637 | 3028 |
| 5638 | 3028 |
| 5639 | 3028 |
| 5640 | 3028 |
| 5641 | 3028 |
| 5642 | 3028 |
| 5643 | 3028 |
| 5644 | 3028 |
| 5645 | 3028 |
| 5646 | 3028 |
| 5647 | 3028 |
| 5648 | 3028 |
| 5649 | 3028 |
| 5650 | 3028 |
| 5651 | 3028 |
| 5652 | 3028 |
| 5653 | 3028 |
| 5654 | 3028 |
| 5655 | 3028 |
| 5656 | 3028 |
| 5657 | 3028 |
| 5658 | 3028 |
| 5659 | 3028 |
| 5660 | 3028 |
| 5661 | 3028 |
| 5662 | 3028 |
| 5663 | 3028 |
| 5664 | 3028 |
| 5665 | 3028 |
| 5666 | 3032 |
| 5667 | 3032 |
| 5668 | 3032 |
| 5669 | 3032 |
| 5670 | 3032 |
| 5671 | 3032 |
| 5672 | 3032 |
| 5673 | 3032 |
| 5674 | 3032 |
| 5675 | 3032 |
| 5676 | 3032 |
| 5677 | 3032 |
| 5678 | 3032 |
| 5679 | 3032 |
| 5680 | 3032 |
| 5681 | 3032 |
| 5682 | 3032 |
| 5683 | 3032 |
| 5684 | 3032 |
| 5685 | 3032 |
| 5686 | 3032 |
| 5687 | 3032 |
| 5688 | 3032 |
| 5689 | 3032 |
| 5690 | 3032 |
| 5691 | 3032 |
| 5692 | 3032 |
| 5693 | 3032 |
| 5694 | 3032 |
| 5695 | 3032 |
| 5696 | 3032 |
| 5697 | 3032 |
| 5698 | 3032 |
| 5699 | 3032 |
| 5700 | 3032 |
| 5701 | 3032 |
| 5702 | 3032 |
| 5703 | 3032 |
| 5704 | 3032 |
| 5705 | 3032 |
| 5706 | 3032 |
| 5707 | 3032 |
| 5708 | 3032 |
| 5709 | 3032 |
| 5710 | 3032 |
| 5711 | 3032 |
| 5712 | 3032 |
| 5713 | 3032 |
| 5714 | 3040 |
| 5715 | 3040 |
| 5716 | 3040 |
| 5717 | 3040 |
| 5718 | 3040 |
| 5719 | 3040 |
| 5720 | 3040 |
| 5721 | 3040 |
| 5722 | 3040 |
| 5723 | 3040 |
| 5724 | 3040 |
| 5725 | 3040 |
| 5726 | 3040 |
| 5727 | 3040 |
| 5728 | 3040 |
| 5729 | 3040 |
| 5730 | 3040 |
| 5731 | 3040 |
| 5732 | 3040 |
| 5733 | 3040 |
| 5734 | 3040 |
| 5735 | 3040 |
| 5736 | 3040 |
| 5737 | 3040 |
| 5738 | 3040 |
| 5739 | 3040 |
| 5740 | 3040 |
| 5741 | 3040 |
| 5742 | 3040 |
| 5743 | 3040 |
| 5744 | 3040 |
| 5745 | 3040 |
| 5746 | 3040 |
| 5747 | 3040 |
| 5748 | 3040 |
| 5749 | 3040 |
| 5750 | 3040 |
| 5751 | 3040 |
| 5752 | 3040 |
| 5753 | 3040 |
| 5754 | 3040 |
| 5755 | 3040 |
| 5756 | 3040 |
| 5757 | 3040 |
| 5758 | 3040 |
| 5759 | 3040 |
| 5760 | 3040 |
| 5761 | 3040 |
| 5762 | 3040 |
| 5763 | 3284 |
| 5764 | 3284 |
| 5765 | 3284 |
| 5766 | 3284 |
| 5767 | 3284 |
| 5768 | 3284 |
| 5769 | 3284 |
| 5770 | 3284 |
| 5771 | 3284 |
| 5772 | 3284 |
| 5773 | 3284 |
| 5774 | 3284 |
| 5775 | 3284 |
| 5776 | 3284 |
| 5777 | 3284 |
| 5778 | 3284 |
| 5779 | 3284 |
| 5780 | 3284 |
| 5781 | 3284 |
| 5782 | 3284 |
| 5783 | 3284 |
| 5784 | 3284 |
| 5785 | 3284 |
| 5786 | 3284 |
| 5787 | 3284 |
| 5788 | 3284 |
| 5789 | 3284 |
| 5790 | 3284 |
| 5791 | 3284 |
| 5792 | 3284 |
| 5793 | 3284 |
| 5794 | 3284 |
| 5795 | 3284 |
| 5796 | 3284 |
| 5797 | 3284 |
| 5798 | 3284 |
| 5799 | 3284 |
| 5800 | 3284 |
| 5801 | 3284 |
| 5802 | 3284 |
| 5803 | 3284 |
| 5804 | 3284 |
| 5805 | 3284 |
| 5806 | 3284 |
| 5807 | 3284 |
| 5808 | 3284 |
| 5809 | 3284 |
| 5810 | 3284 |
| 5811 | 3048 |
| 5812 | 3048 |
| 5813 | 3048 |
| 5814 | 3048 |
| 5815 | 3048 |
| 5816 | 3048 |
| 5817 | 3048 |
| 5818 | 3048 |
| 5819 | 3048 |
| 5820 | 3048 |
| 5821 | 3048 |
| 5822 | 3048 |
| 5823 | 3048 |
| 5824 | 3048 |
| 5825 | 3048 |
| 5826 | 3048 |
| 5827 | 3048 |
| 5828 | 3048 |
| 5829 | 3048 |
| 5830 | 3048 |
| 5831 | 3048 |
| 5832 | 3048 |
| 5833 | 3048 |
| 5834 | 3048 |
| 5835 | 3048 |
| 5836 | 3048 |
| 5837 | 3048 |
| 5838 | 3048 |
| 5839 | 3048 |
| 5840 | 3048 |
| 5841 | 3048 |
| 5842 | 3048 |
| 5843 | 3048 |
| 5844 | 3048 |
| 5845 | 3048 |
| 5846 | 3048 |
| 5847 | 3048 |
| 5848 | 3048 |
| 5849 | 3048 |
| 5850 | 3048 |
| 5851 | 3048 |
| 5852 | 3048 |
| 5853 | 3048 |
| 5854 | 3048 |
| 5855 | 3048 |
| 5856 | 3048 |
| 5857 | 3048 |
| 5858 | 3048 |
| 5859 | 3040 |
| 5860 | 3040 |
| 5861 | 3040 |
| 5862 | 3040 |
| 5863 | 3040 |
| 5864 | 3040 |
| 5865 | 3040 |
| 5866 | 3040 |
| 5867 | 3040 |
| 5868 | 3040 |
| 5869 | 3040 |
| 5870 | 3040 |
| 5871 | 3040 |
| 5872 | 3040 |
| 5873 | 3040 |
| 5874 | 3040 |
| 5875 | 3040 |
| 5876 | 3040 |
| 5877 | 3040 |
| 5878 | 3040 |
| 5879 | 3040 |
| 5880 | 3040 |
| 5881 | 3040 |
| 5882 | 3040 |
| 5883 | 3040 |
| 5884 | 3040 |
| 5885 | 3040 |
| 5886 | 3040 |
| 5887 | 3040 |
| 5888 | 3040 |
| 5889 | 3040 |
| 5890 | 3040 |
| 5891 | 3040 |
| 5892 | 3040 |
| 5893 | 3040 |
| 5894 | 3040 |
| 5895 | 3040 |
| 5896 | 3040 |
| 5897 | 3040 |
| 5898 | 3040 |
| 5899 | 3040 |
| 5900 | 3040 |
| 5901 | 3040 |
| 5902 | 3040 |
| 5903 | 3040 |
| 5904 | 3040 |
| 5905 | 3040 |
| 5906 | 3040 |
| 5907 | 3056 |
| 5908 | 3056 |
| 5909 | 3056 |
| 5910 | 3056 |
| 5911 | 3056 |
| 5912 | 3056 |
| 5913 | 3056 |
| 5914 | 3056 |
| 5915 | 3056 |
| 5916 | 3056 |
| 5917 | 3056 |
| 5918 | 3056 |
| 5919 | 3056 |
| 5920 | 3056 |
| 5921 | 3056 |
| 5922 | 3056 |
| 5923 | 3056 |
| 5924 | 3056 |
| 5925 | 3056 |
| 5926 | 3056 |
| 5927 | 3056 |
| 5928 | 3056 |
| 5929 | 3056 |
| 5930 | 3056 |
| 5931 | 3056 |
| 5932 | 3056 |
| 5933 | 3056 |
| 5934 | 3056 |
| 5935 | 3056 |
| 5936 | 3056 |
| 5937 | 3056 |
| 5938 | 3056 |
| 5939 | 3056 |
| 5940 | 3056 |
| 5941 | 3056 |
| 5942 | 3056 |
| 5943 | 3056 |
| 5944 | 3056 |
| 5945 | 3056 |
| 5946 | 3056 |
| 5947 | 3056 |
| 5948 | 3056 |
| 5949 | 3056 |
| 5950 | 3056 |
| 5951 | 3056 |
| 5952 | 3056 |
| 5953 | 3056 |
| 5954 | 3056 |
| 5955 | 3044 |
| 5956 | 3044 |
| 5957 | 3044 |
| 5958 | 3044 |
| 5959 | 3044 |
| 5960 | 3044 |
| 5961 | 3044 |
| 5962 | 3044 |
| 5963 | 3044 |
| 5964 | 3044 |
| 5965 | 3044 |
| 5966 | 3044 |
| 5967 | 3044 |
| 5968 | 3044 |
| 5969 | 3044 |
| 5970 | 3044 |
| 5971 | 3044 |
| 5972 | 3044 |
| 5973 | 3044 |
| 5974 | 3044 |
| 5975 | 3044 |
| 5976 | 3044 |
| 5977 | 3044 |
| 5978 | 3044 |
| 5979 | 3044 |
| 5980 | 3044 |
| 5981 | 3044 |
| 5982 | 3044 |
| 5983 | 3044 |
| 5984 | 3044 |
| 5985 | 3044 |
| 5986 | 3044 |
| 5987 | 3044 |
| 5988 | 3044 |
| 5989 | 3044 |
| 5990 | 3044 |
| 5991 | 3044 |
| 5992 | 3044 |
| 5993 | 3044 |
| 5994 | 3044 |
| 5995 | 3044 |
| 5996 | 3044 |
| 5997 | 3044 |
| 5998 | 3044 |
| 5999 | 3044 |
| 6000 | 3044 |
| 6001 | 3044 |
| 6002 | 3044 |
| 6003 | 3044 |
| 6004 | 3088 |
| 6005 | 3088 |
| 6006 | 3088 |
| 6007 | 3088 |
| 6008 | 3088 |
| 6009 | 3088 |
| 6010 | 3088 |
| 6011 | 3088 |
| 6012 | 3088 |
| 6013 | 3088 |
| 6014 | 3088 |
| 6015 | 3088 |
| 6016 | 3088 |
| 6017 | 3088 |
| 6018 | 3088 |
| 6019 | 3088 |
| 6020 | 3088 |
| 6021 | 3088 |
| 6022 | 3088 |
| 6023 | 3088 |
| 6024 | 3088 |
| 6025 | 3088 |
| 6026 | 3088 |
| 6027 | 3088 |
| 6028 | 3088 |
| 6029 | 3088 |
| 6030 | 3088 |
| 6031 | 3088 |
| 6032 | 3088 |
| 6033 | 3088 |
| 6034 | 3088 |
| 6035 | 3088 |
| 6036 | 3088 |
| 6037 | 3088 |
| 6038 | 3088 |
| 6039 | 3088 |
| 6040 | 3088 |
| 6041 | 3088 |
| 6042 | 3088 |
| 6043 | 3088 |
| 6044 | 3088 |
| 6045 | 3088 |
| 6046 | 3088 |
| 6047 | 3088 |
| 6048 | 3088 |
| 6049 | 3088 |
| 6050 | 3088 |
| 6051 | 3088 |
| 6052 | 3032 |
| 6053 | 3032 |
| 6054 | 3032 |
| 6055 | 3032 |
| 6056 | 3032 |
| 6057 | 3032 |
| 6058 | 3032 |
| 6059 | 3032 |
| 6060 | 3032 |
| 6061 | 3032 |
| 6062 | 3032 |
| 6063 | 3032 |
| 6064 | 3032 |
| 6065 | 3032 |
| 6066 | 3032 |
| 6067 | 3032 |
| 6068 | 3032 |
| 6069 | 3032 |
| 6070 | 3032 |
| 6071 | 3032 |
| 6072 | 3032 |
| 6073 | 3032 |
| 6074 | 3032 |
| 6075 | 3032 |
| 6076 | 3032 |
| 6077 | 3032 |
| 6078 | 3032 |
| 6079 | 3032 |
| 6080 | 3032 |
| 6081 | 3032 |
| 6082 | 3032 |
| 6083 | 3032 |
| 6084 | 3032 |
| 6085 | 3032 |
| 6086 | 3032 |
| 6087 | 3032 |
| 6088 | 3032 |
| 6089 | 3032 |
| 6090 | 3032 |
| 6091 | 3032 |
| 6092 | 3032 |
| 6093 | 3032 |
| 6094 | 3032 |
| 6095 | 3032 |
| 6096 | 3032 |
| 6097 | 3032 |
| 6098 | 3032 |
| 6099 | 3032 |
| 6100 | 3028 |
| 6101 | 3028 |
| 6102 | 3028 |
| 6103 | 3028 |
| 6104 | 3028 |
| 6105 | 3028 |
| 6106 | 3028 |
| 6107 | 3028 |
| 6108 | 3028 |
| 6109 | 3028 |
| 6110 | 3028 |
| 6111 | 3028 |
| 6112 | 3028 |
| 6113 | 3028 |
| 6114 | 3028 |
| 6115 | 3028 |
| 6116 | 3028 |
| 6117 | 3028 |
| 6118 | 3028 |
| 6119 | 3028 |
| 6120 | 3028 |
| 6121 | 3028 |
| 6122 | 3028 |
| 6123 | 3028 |
| 6124 | 3028 |
| 6125 | 3028 |
| 6126 | 3028 |
| 6127 | 3028 |
| 6128 | 3028 |
| 6129 | 3028 |
| 6130 | 3028 |
| 6131 | 3028 |
| 6132 | 3028 |
| 6133 | 3028 |
| 6134 | 3028 |
| 6135 | 3028 |
| 6136 | 3028 |
| 6137 | 3028 |
| 6138 | 3028 |
| 6139 | 3028 |
| 6140 | 3028 |
| 6141 | 3028 |
| 6142 | 3028 |
| 6143 | 3028 |
| 6144 | 3028 |
| 6145 | 3028 |
| 6146 | 3028 |
| 6147 | 3028 |
| 6148 | 3044 |
| 6149 | 3044 |
| 6150 | 3044 |
| 6151 | 3044 |
| 6152 | 3044 |
| 6153 | 3044 |
| 6154 | 3044 |
| 6155 | 3044 |
| 6156 | 3044 |
| 6157 | 3044 |
| 6158 | 3044 |
| 6159 | 3044 |
| 6160 | 3044 |
| 6161 | 3044 |
| 6162 | 3044 |
| 6163 | 3044 |
| 6164 | 3044 |
| 6165 | 3044 |
| 6166 | 3044 |
| 6167 | 3044 |
| 6168 | 3044 |
| 6169 | 3044 |
| 6170 | 3044 |
| 6171 | 3044 |
| 6172 | 3044 |
| 6173 | 3044 |
| 6174 | 3044 |
| 6175 | 3044 |
| 6176 | 3044 |
| 6177 | 3044 |
| 6178 | 3044 |
| 6179 | 3044 |
| 6180 | 3044 |
| 6181 | 3044 |
| 6182 | 3044 |
| 6183 | 3044 |
| 6184 | 3044 |
| 6185 | 3044 |
| 6186 | 3044 |
| 6187 | 3044 |
| 6188 | 3044 |
| 6189 | 3044 |
| 6190 | 3044 |
| 6191 | 3044 |
| 6192 | 3044 |
| 6193 | 3044 |
| 6194 | 3044 |
| 6195 | 3044 |
| 6196 | 3048 |
| 6197 | 3048 |
| 6198 | 3048 |
| 6199 | 3048 |
| 6200 | 3048 |
| 6201 | 3048 |
| 6202 | 3048 |
| 6203 | 3048 |
| 6204 | 3048 |
| 6205 | 3048 |
| 6206 | 3048 |
| 6207 | 3048 |
| 6208 | 3048 |
| 6209 | 3048 |
| 6210 | 3048 |
| 6211 | 3048 |
| 6212 | 3048 |
| 6213 | 3048 |
| 6214 | 3048 |
| 6215 | 3048 |
| 6216 | 3048 |
| 6217 | 3048 |
| 6218 | 3048 |
| 6219 | 3048 |
| 6220 | 3048 |
| 6221 | 3048 |
| 6222 | 3048 |
| 6223 | 3048 |
| 6224 | 3048 |
| 6225 | 3048 |
| 6226 | 3048 |
| 6227 | 3048 |
| 6228 | 3048 |
| 6229 | 3048 |
| 6230 | 3048 |
| 6231 | 3048 |
| 6232 | 3048 |
| 6233 | 3048 |
| 6234 | 3048 |
| 6235 | 3048 |
| 6236 | 3048 |
| 6237 | 3048 |
| 6238 | 3048 |
| 6239 | 3048 |
| 6240 | 3048 |
| 6241 | 3048 |
| 6242 | 3048 |
| 6243 | 3048 |
| 6244 | 3060 |
| 6245 | 3060 |
| 6246 | 3060 |
| 6247 | 3060 |
| 6248 | 3060 |
| 6249 | 3060 |
| 6250 | 3060 |
| 6251 | 3060 |
| 6252 | 3060 |
| 6253 | 3060 |
| 6254 | 3060 |
| 6255 | 3060 |
| 6256 | 3060 |
| 6257 | 3060 |
| 6258 | 3060 |
| 6259 | 3060 |
| 6260 | 3060 |
| 6261 | 3060 |
| 6262 | 3060 |
| 6263 | 3060 |
| 6264 | 3060 |
| 6265 | 3060 |
| 6266 | 3060 |
| 6267 | 3060 |
| 6268 | 3060 |
| 6269 | 3060 |
| 6270 | 3060 |
| 6271 | 3060 |
| 6272 | 3060 |
| 6273 | 3060 |
| 6274 | 3060 |
| 6275 | 3060 |
| 6276 | 3060 |
| 6277 | 3060 |
| 6278 | 3060 |
| 6279 | 3060 |
| 6280 | 3060 |
| 6281 | 3060 |
| 6282 | 3060 |
| 6283 | 3060 |
| 6284 | 3060 |
| 6285 | 3060 |
| 6286 | 3060 |
| 6287 | 3060 |
| 6288 | 3060 |
| 6289 | 3060 |
| 6290 | 3060 |
| 6291 | 3060 |
| 6292 | 3060 |
| 6293 | 3020 |
| 6294 | 3020 |
| 6295 | 3020 |
| 6296 | 3020 |
| 6297 | 3020 |
| 6298 | 3020 |
| 6299 | 3020 |
| 6300 | 3020 |
| 6301 | 3020 |
| 6302 | 3020 |
| 6303 | 3020 |
| 6304 | 3020 |
| 6305 | 3020 |
| 6306 | 3020 |
| 6307 | 3020 |
| 6308 | 3020 |
| 6309 | 3020 |
| 6310 | 3020 |
| 6311 | 3020 |
| 6312 | 3020 |
| 6313 | 3020 |
| 6314 | 3020 |
| 6315 | 3020 |
| 6316 | 3020 |
| 6317 | 3020 |
| 6318 | 3020 |
| 6319 | 3020 |
| 6320 | 3020 |
| 6321 | 3020 |
| 6322 | 3020 |
| 6323 | 3020 |
| 6324 | 3020 |
| 6325 | 3020 |
| 6326 | 3020 |
| 6327 | 3020 |
| 6328 | 3020 |
| 6329 | 3020 |
| 6330 | 3020 |
| 6331 | 3020 |
| 6332 | 3020 |
| 6333 | 3020 |
| 6334 | 3020 |
| 6335 | 3020 |
| 6336 | 3020 |
| 6337 | 3020 |
| 6338 | 3020 |
| 6339 | 3020 |
| 6340 | 3020 |
| 6341 | 3048 |
| 6342 | 3048 |
| 6343 | 3048 |
| 6344 | 3048 |
| 6345 | 3048 |
| 6346 | 3048 |
| 6347 | 3048 |
| 6348 | 3048 |
| 6349 | 3048 |
| 6350 | 3048 |
| 6351 | 3048 |
| 6352 | 3048 |
| 6353 | 3048 |
| 6354 | 3048 |
| 6355 | 3048 |
| 6356 | 3048 |
| 6357 | 3048 |
| 6358 | 3048 |
| 6359 | 3048 |
| 6360 | 3048 |
| 6361 | 3048 |
| 6362 | 3048 |
| 6363 | 3048 |
| 6364 | 3048 |
| 6365 | 3048 |
| 6366 | 3048 |
| 6367 | 3048 |
| 6368 | 3048 |
| 6369 | 3048 |
| 6370 | 3048 |
| 6371 | 3048 |
| 6372 | 3048 |
| 6373 | 3048 |
| 6374 | 3048 |
| 6375 | 3048 |
| 6376 | 3048 |
| 6377 | 3048 |
| 6378 | 3048 |
| 6379 | 3048 |
| 6380 | 3048 |
| 6381 | 3048 |
| 6382 | 3048 |
| 6383 | 3048 |
| 6384 | 3048 |
| 6385 | 3048 |
| 6386 | 3048 |
| 6387 | 3048 |
| 6388 | 3048 |
| 6389 | 3044 |
| 6390 | 3044 |
| 6391 | 3044 |
| 6392 | 3044 |
| 6393 | 3044 |
| 6394 | 3044 |
| 6395 | 3044 |
| 6396 | 3044 |
| 6397 | 3044 |
| 6398 | 3044 |
| 6399 | 3044 |
| 6400 | 3044 |
| 6401 | 3044 |
| 6402 | 3044 |
| 6403 | 3044 |
| 6404 | 3044 |
| 6405 | 3044 |
| 6406 | 3044 |
| 6407 | 3044 |
| 6408 | 3044 |
| 6409 | 3044 |
| 6410 | 3044 |
| 6411 | 3044 |
| 6412 | 3044 |
| 6413 | 3044 |
| 6414 | 3044 |
| 6415 | 3044 |
| 6416 | 3044 |
| 6417 | 3044 |
| 6418 | 3044 |
| 6419 | 3044 |
| 6420 | 3044 |
| 6421 | 3044 |
| 6422 | 3044 |
| 6423 | 3044 |
| 6424 | 3044 |
| 6425 | 3044 |
| 6426 | 3044 |
| 6427 | 3044 |
| 6428 | 3044 |
| 6429 | 3044 |
| 6430 | 3044 |
| 6431 | 3044 |
| 6432 | 3044 |
| 6433 | 3044 |
| 6434 | 3044 |
| 6435 | 3044 |
| 6436 | 3044 |
| 6437 | 3040 |
| 6438 | 3040 |
| 6439 | 3040 |
| 6440 | 3040 |
| 6441 | 3040 |
| 6442 | 3040 |
| 6443 | 3040 |
| 6444 | 3040 |
| 6445 | 3040 |
| 6446 | 3040 |
| 6447 | 3040 |
| 6448 | 3040 |
| 6449 | 3040 |
| 6450 | 3040 |
| 6451 | 3040 |
| 6452 | 3040 |
| 6453 | 3040 |
| 6454 | 3040 |
| 6455 | 3040 |
| 6456 | 3040 |
| 6457 | 3040 |
| 6458 | 3040 |
| 6459 | 3040 |
| 6460 | 3040 |
| 6461 | 3040 |
| 6462 | 3040 |
| 6463 | 3040 |
| 6464 | 3040 |
| 6465 | 3040 |
| 6466 | 3040 |
| 6467 | 3040 |
| 6468 | 3040 |
| 6469 | 3040 |
| 6470 | 3040 |
| 6471 | 3040 |
| 6472 | 3040 |
| 6473 | 3040 |
| 6474 | 3040 |
| 6475 | 3040 |
| 6476 | 3040 |
| 6477 | 3040 |
| 6478 | 3040 |
| 6479 | 3040 |
| 6480 | 3040 |
| 6481 | 3040 |
| 6482 | 3040 |
| 6483 | 3040 |
| 6484 | 3040 |
| 6485 | 3060 |
| 6486 | 3060 |
| 6487 | 3060 |
| 6488 | 3060 |
| 6489 | 3060 |
| 6490 | 3060 |
| 6491 | 3060 |
| 6492 | 3060 |
| 6493 | 3060 |
| 6494 | 3060 |
| 6495 | 3060 |
| 6496 | 3060 |
| 6497 | 3060 |
| 6498 | 3060 |
| 6499 | 3060 |
| 6500 | 3060 |
| 6501 | 3060 |
| 6502 | 3060 |
| 6503 | 3060 |
| 6504 | 3060 |
| 6505 | 3060 |
| 6506 | 3060 |
| 6507 | 3060 |
| 6508 | 3060 |
| 6509 | 3060 |
| 6510 | 3060 |
| 6511 | 3060 |
| 6512 | 3060 |
| 6513 | 3060 |
| 6514 | 3060 |
| 6515 | 3060 |
| 6516 | 3060 |
| 6517 | 3060 |
| 6518 | 3060 |
| 6519 | 3060 |
| 6520 | 3060 |
| 6521 | 3060 |
| 6522 | 3060 |
| 6523 | 3060 |
| 6524 | 3060 |
| 6525 | 3060 |
| 6526 | 3060 |
| 6527 | 3060 |
| 6528 | 3060 |
| 6529 | 3060 |
| 6530 | 3060 |
| 6531 | 3060 |
| 6532 | 3060 |
| 6533 | 3048 |
| 6534 | 3048 |
| 6535 | 3048 |
| 6536 | 3048 |
| 6537 | 3048 |
| 6538 | 3048 |
| 6539 | 3048 |
| 6540 | 3048 |
| 6541 | 3048 |
| 6542 | 3048 |
| 6543 | 3048 |
| 6544 | 3048 |
| 6545 | 3048 |
| 6546 | 3048 |
| 6547 | 3048 |
| 6548 | 3048 |
| 6549 | 3048 |
| 6550 | 3048 |
| 6551 | 3048 |
| 6552 | 3048 |
| 6553 | 3048 |
| 6554 | 3048 |
| 6555 | 3048 |
| 6556 | 3048 |
| 6557 | 3048 |
| 6558 | 3048 |
| 6559 | 3048 |
| 6560 | 3048 |
| 6561 | 3048 |
| 6562 | 3048 |
| 6563 | 3048 |
| 6564 | 3048 |
| 6565 | 3048 |
| 6566 | 3048 |
| 6567 | 3048 |
| 6568 | 3048 |
| 6569 | 3048 |
| 6570 | 3048 |
| 6571 | 3048 |
| 6572 | 3048 |
| 6573 | 3048 |
| 6574 | 3048 |
| 6575 | 3048 |
| 6576 | 3048 |
| 6577 | 3048 |
| 6578 | 3048 |
| 6579 | 3048 |
| 6580 | 3048 |
| 6581 | 3032 |
| 6582 | 3032 |
| 6583 | 3032 |
| 6584 | 3032 |
| 6585 | 3032 |
| 6586 | 3032 |
| 6587 | 3032 |
| 6588 | 3032 |
| 6589 | 3032 |
| 6590 | 3032 |
| 6591 | 3032 |
| 6592 | 3032 |
| 6593 | 3032 |
| 6594 | 3032 |
| 6595 | 3032 |
| 6596 | 3032 |
| 6597 | 3032 |
| 6598 | 3032 |
| 6599 | 3032 |
| 6600 | 3032 |
| 6601 | 3032 |
| 6602 | 3032 |
| 6603 | 3032 |
| 6604 | 3032 |
| 6605 | 3032 |
| 6606 | 3032 |
| 6607 | 3032 |
| 6608 | 3032 |
| 6609 | 3032 |
| 6610 | 3032 |
| 6611 | 3032 |
| 6612 | 3032 |
| 6613 | 3032 |
| 6614 | 3032 |
| 6615 | 3032 |
| 6616 | 3032 |
| 6617 | 3032 |
| 6618 | 3032 |
| 6619 | 3032 |
| 6620 | 3032 |
| 6621 | 3032 |
| 6622 | 3032 |
| 6623 | 3032 |
| 6624 | 3032 |
| 6625 | 3032 |
| 6626 | 3032 |
| 6627 | 3032 |
| 6628 | 3032 |
| 6629 | 3032 |
| 6630 | 3084 |
| 6631 | 3084 |
| 6632 | 3084 |
| 6633 | 3084 |
| 6634 | 3084 |
| 6635 | 3084 |
| 6636 | 3084 |
| 6637 | 3084 |
| 6638 | 3084 |
| 6639 | 3084 |
| 6640 | 3084 |
| 6641 | 3084 |
| 6642 | 3084 |
| 6643 | 3084 |
| 6644 | 3084 |
| 6645 | 3084 |
| 6646 | 3084 |
| 6647 | 3084 |
| 6648 | 3084 |
| 6649 | 3084 |
| 6650 | 3084 |
| 6651 | 3084 |
| 6652 | 3084 |
| 6653 | 3084 |
| 6654 | 3084 |
| 6655 | 3084 |
| 6656 | 3084 |
| 6657 | 3084 |
| 6658 | 3084 |
| 6659 | 3084 |
| 6660 | 3084 |
| 6661 | 3084 |
| 6662 | 3084 |
| 6663 | 3084 |
| 6664 | 3084 |
| 6665 | 3084 |
| 6666 | 3084 |
| 6667 | 3084 |
| 6668 | 3084 |
| 6669 | 3084 |
| 6670 | 3084 |
| 6671 | 3084 |
| 6672 | 3084 |
| 6673 | 3084 |
| 6674 | 3084 |
| 6675 | 3084 |
| 6676 | 3084 |
| 6677 | 3084 |
| 6678 | 3028 |
| 6679 | 3028 |
| 6680 | 3028 |
| 6681 | 3028 |
| 6682 | 3028 |
| 6683 | 3028 |
| 6684 | 3028 |
| 6685 | 3028 |
| 6686 | 3028 |
| 6687 | 3028 |
| 6688 | 3028 |
| 6689 | 3028 |
| 6690 | 3028 |
| 6691 | 3028 |
| 6692 | 3028 |
| 6693 | 3028 |
| 6694 | 3028 |
| 6695 | 3028 |
| 6696 | 3028 |
| 6697 | 3028 |
| 6698 | 3028 |
| 6699 | 3028 |
| 6700 | 3028 |
| 6701 | 3028 |
| 6702 | 3028 |
| 6703 | 3028 |
| 6704 | 3028 |
| 6705 | 3028 |
| 6706 | 3028 |
| 6707 | 3028 |
| 6708 | 3028 |
| 6709 | 3028 |
| 6710 | 3028 |
| 6711 | 3028 |
| 6712 | 3028 |
| 6713 | 3028 |
| 6714 | 3028 |
| 6715 | 3028 |
| 6716 | 3028 |
| 6717 | 3028 |
| 6718 | 3028 |
| 6719 | 3028 |
| 6720 | 3028 |
| 6721 | 3028 |
| 6722 | 3028 |
| 6723 | 3028 |
| 6724 | 3028 |
| 6725 | 3028 |
| 6726 | 3052 |
| 6727 | 3052 |
| 6728 | 3052 |
| 6729 | 3052 |
| 6730 | 3052 |
| 6731 | 3052 |
| 6732 | 3052 |
| 6733 | 3052 |
| 6734 | 3052 |
| 6735 | 3052 |
| 6736 | 3052 |
| 6737 | 3052 |
| 6738 | 3052 |
| 6739 | 3052 |
| 6740 | 3052 |
| 6741 | 3052 |
| 6742 | 3052 |
| 6743 | 3052 |
| 6744 | 3052 |
| 6745 | 3052 |
| 6746 | 3052 |
| 6747 | 3052 |
| 6748 | 3052 |
| 6749 | 3052 |
| 6750 | 3052 |
| 6751 | 3052 |
| 6752 | 3052 |
| 6753 | 3052 |
| 6754 | 3052 |
| 6755 | 3052 |
| 6756 | 3052 |
| 6757 | 3052 |
| 6758 | 3052 |
| 6759 | 3052 |
| 6760 | 3052 |
| 6761 | 3052 |
| 6762 | 3052 |
| 6763 | 3052 |
| 6764 | 3052 |
| 6765 | 3052 |
| 6766 | 3052 |
| 6767 | 3052 |
| 6768 | 3052 |
| 6769 | 3052 |
| 6770 | 3052 |
| 6771 | 3052 |
| 6772 | 3052 |
| 6773 | 3052 |
| 6774 | 3064 |
| 6775 | 3064 |
| 6776 | 3064 |
| 6777 | 3064 |
| 6778 | 3064 |
| 6779 | 3064 |
| 6780 | 3064 |
| 6781 | 3064 |
| 6782 | 3064 |
| 6783 | 3064 |
| 6784 | 3064 |
| 6785 | 3064 |
| 6786 | 3064 |
| 6787 | 3064 |
| 6788 | 3064 |
| 6789 | 3064 |
| 6790 | 3064 |
| 6791 | 3064 |
| 6792 | 3064 |
| 6793 | 3064 |
| 6794 | 3064 |
| 6795 | 3064 |
| 6796 | 3064 |
| 6797 | 3064 |
| 6798 | 3064 |
| 6799 | 3064 |
| 6800 | 3064 |
| 6801 | 3064 |
| 6802 | 3064 |
| 6803 | 3064 |
| 6804 | 3064 |
| 6805 | 3064 |
| 6806 | 3064 |
| 6807 | 3064 |
| 6808 | 3064 |
| 6809 | 3064 |
| 6810 | 3064 |
| 6811 | 3064 |
| 6812 | 3064 |
| 6813 | 3064 |
| 6814 | 3064 |
| 6815 | 3064 |
| 6816 | 3064 |
| 6817 | 3064 |
| 6818 | 3064 |
| 6819 | 3064 |
| 6820 | 3064 |
| 6821 | 3064 |
| 6822 | 3056 |
| 6823 | 3056 |
| 6824 | 3056 |
| 6825 | 3056 |
| 6826 | 3056 |
| 6827 | 3056 |
| 6828 | 3056 |
| 6829 | 3056 |
| 6830 | 3056 |
| 6831 | 3056 |
| 6832 | 3056 |
| 6833 | 3056 |
| 6834 | 3056 |
| 6835 | 3056 |
| 6836 | 3056 |
| 6837 | 3056 |
| 6838 | 3056 |
| 6839 | 3056 |
| 6840 | 3056 |
| 6841 | 3056 |
| 6842 | 3056 |
| 6843 | 3056 |
| 6844 | 3056 |
| 6845 | 3056 |
| 6846 | 3056 |
| 6847 | 3056 |
| 6848 | 3056 |
| 6849 | 3056 |
| 6850 | 3056 |
| 6851 | 3056 |
| 6852 | 3056 |
| 6853 | 3056 |
| 6854 | 3056 |
| 6855 | 3056 |
| 6856 | 3056 |
| 6857 | 3056 |
| 6858 | 3056 |
| 6859 | 3056 |
| 6860 | 3056 |
| 6861 | 3056 |
| 6862 | 3056 |
| 6863 | 3056 |
| 6864 | 3056 |
| 6865 | 3056 |
| 6866 | 3056 |
| 6867 | 3056 |
| 6868 | 3056 |
| 6869 | 3056 |
| 6870 | 3056 |
| 6871 | 3048 |
| 6872 | 3048 |
| 6873 | 3048 |
| 6874 | 3048 |
| 6875 | 3048 |
| 6876 | 3048 |
| 6877 | 3048 |
| 6878 | 3048 |
| 6879 | 3048 |
| 6880 | 3048 |
| 6881 | 3048 |
| 6882 | 3048 |
| 6883 | 3048 |
| 6884 | 3048 |
| 6885 | 3048 |
| 6886 | 3048 |
| 6887 | 3048 |
| 6888 | 3048 |
| 6889 | 3048 |
| 6890 | 3048 |
| 6891 | 3048 |
| 6892 | 3048 |
| 6893 | 3048 |
| 6894 | 3048 |
| 6895 | 3048 |
| 6896 | 3048 |
| 6897 | 3048 |
| 6898 | 3048 |
| 6899 | 3048 |
| 6900 | 3048 |
| 6901 | 3048 |
| 6902 | 3048 |
| 6903 | 3048 |
| 6904 | 3048 |
| 6905 | 3048 |
| 6906 | 3048 |
| 6907 | 3048 |
| 6908 | 3048 |
| 6909 | 3048 |
| 6910 | 3048 |
| 6911 | 3048 |
| 6912 | 3048 |
| 6913 | 3048 |
| 6914 | 3048 |
| 6915 | 3048 |
| 6916 | 3048 |
| 6917 | 3048 |
| 6918 | 3048 |
| 6919 | 3072 |
| 6920 | 3072 |
| 6921 | 3072 |
| 6922 | 3072 |
| 6923 | 3072 |
| 6924 | 3072 |
| 6925 | 3072 |
| 6926 | 3072 |
| 6927 | 3072 |
| 6928 | 3072 |
| 6929 | 3072 |
| 6930 | 3072 |
| 6931 | 3072 |
| 6932 | 3072 |
| 6933 | 3072 |
| 6934 | 3072 |
| 6935 | 3072 |
| 6936 | 3072 |
| 6937 | 3072 |
| 6938 | 3072 |
| 6939 | 3072 |
| 6940 | 3072 |
| 6941 | 3072 |
| 6942 | 3072 |
| 6943 | 3072 |
| 6944 | 3072 |
| 6945 | 3072 |
| 6946 | 3072 |
| 6947 | 3072 |
| 6948 | 3072 |
| 6949 | 3072 |
| 6950 | 3072 |
| 6951 | 3072 |
| 6952 | 3072 |
| 6953 | 3072 |
| 6954 | 3072 |
| 6955 | 3072 |
| 6956 | 3072 |
| 6957 | 3072 |
| 6958 | 3072 |
| 6959 | 3072 |
| 6960 | 3072 |
| 6961 | 3072 |
| 6962 | 3072 |
| 6963 | 3072 |
| 6964 | 3072 |
| 6965 | 3072 |
| 6966 | 3072 |
| 6967 | 3096 |
| 6968 | 3096 |
| 6969 | 3096 |
| 6970 | 3096 |
| 6971 | 3096 |
| 6972 | 3096 |
| 6973 | 3096 |
| 6974 | 3096 |
| 6975 | 3096 |
| 6976 | 3096 |
| 6977 | 3096 |
| 6978 | 3096 |
| 6979 | 3096 |
| 6980 | 3096 |
| 6981 | 3096 |
| 6982 | 3096 |
| 6983 | 3096 |
| 6984 | 3096 |
| 6985 | 3096 |
| 6986 | 3096 |
| 6987 | 3096 |
| 6988 | 3096 |
| 6989 | 3096 |
| 6990 | 3096 |
| 6991 | 3096 |
| 6992 | 3096 |
| 6993 | 3096 |
| 6994 | 3096 |
| 6995 | 3096 |
| 6996 | 3096 |
| 6997 | 3096 |
| 6998 | 3096 |
| 6999 | 3096 |
| 7000 | 3096 |
| 7001 | 3096 |
| 7002 | 3096 |
| 7003 | 3096 |
| 7004 | 3096 |
| 7005 | 3096 |
| 7006 | 3096 |
| 7007 | 3096 |
| 7008 | 3096 |
| 7009 | 3096 |
| 7010 | 3096 |
| 7011 | 3096 |
| 7012 | 3096 |
| 7013 | 3096 |
| 7014 | 3096 |
| 7015 | 3024 |
| 7016 | 3024 |
| 7017 | 3024 |
| 7018 | 3024 |
| 7019 | 3024 |
| 7020 | 3024 |
| 7021 | 3024 |
| 7022 | 3024 |
| 7023 | 3024 |
| 7024 | 3024 |
| 7025 | 3024 |
| 7026 | 3024 |
| 7027 | 3024 |
| 7028 | 3024 |
| 7029 | 3024 |
| 7030 | 3024 |
| 7031 | 3024 |
| 7032 | 3024 |
| 7033 | 3024 |
| 7034 | 3024 |
| 7035 | 3024 |
| 7036 | 3024 |
| 7037 | 3024 |
| 7038 | 3024 |
| 7039 | 3024 |
| 7040 | 3024 |
| 7041 | 3024 |
| 7042 | 3024 |
| 7043 | 3024 |
| 7044 | 3024 |
| 7045 | 3024 |
| 7046 | 3024 |
| 7047 | 3024 |
| 7048 | 3024 |
| 7049 | 3024 |
| 7050 | 3024 |
| 7051 | 3024 |
| 7052 | 3024 |
| 7053 | 3024 |
| 7054 | 3024 |
| 7055 | 3024 |
| 7056 | 3024 |
| 7057 | 3024 |
| 7058 | 3024 |
| 7059 | 3024 |
| 7060 | 3024 |
| 7061 | 3024 |
| 7062 | 3024 |
| 7063 | 3048 |
| 7064 | 3048 |
| 7065 | 3048 |
| 7066 | 3048 |
| 7067 | 3048 |
| 7068 | 3048 |
| 7069 | 3048 |
| 7070 | 3048 |
| 7071 | 3048 |
| 7072 | 3048 |
| 7073 | 3048 |
| 7074 | 3048 |
| 7075 | 3048 |
| 7076 | 3048 |
| 7077 | 3048 |
| 7078 | 3048 |
| 7079 | 3048 |
| 7080 | 3048 |
| 7081 | 3048 |
| 7082 | 3048 |
| 7083 | 3048 |
| 7084 | 3048 |
| 7085 | 3048 |
| 7086 | 3048 |
| 7087 | 3048 |
| 7088 | 3048 |
| 7089 | 3048 |
| 7090 | 3048 |
| 7091 | 3048 |
| 7092 | 3048 |
| 7093 | 3048 |
| 7094 | 3048 |
| 7095 | 3048 |
| 7096 | 3048 |
| 7097 | 3048 |
| 7098 | 3048 |
| 7099 | 3048 |
| 7100 | 3048 |
| 7101 | 3048 |
| 7102 | 3048 |
| 7103 | 3048 |
| 7104 | 3048 |
| 7105 | 3048 |
| 7106 | 3048 |
| 7107 | 3048 |
| 7108 | 3048 |
| 7109 | 3048 |
| 7110 | 3048 |
| 7111 | 3052 |
| 7112 | 3052 |
| 7113 | 3052 |
| 7114 | 3052 |
| 7115 | 3052 |
| 7116 | 3052 |
| 7117 | 3052 |
| 7118 | 3052 |
| 7119 | 3052 |
| 7120 | 3052 |
| 7121 | 3052 |
| 7122 | 3052 |
| 7123 | 3052 |
| 7124 | 3052 |
| 7125 | 3052 |
| 7126 | 3052 |
| 7127 | 3052 |
| 7128 | 3052 |
| 7129 | 3052 |
| 7130 | 3052 |
| 7131 | 3052 |
| 7132 | 3052 |
| 7133 | 3052 |
| 7134 | 3052 |
| 7135 | 3052 |
| 7136 | 3052 |
| 7137 | 3052 |
| 7138 | 3052 |
| 7139 | 3052 |
| 7140 | 3052 |
| 7141 | 3052 |
| 7142 | 3052 |
| 7143 | 3052 |
| 7144 | 3052 |
| 7145 | 3052 |
| 7146 | 3052 |
| 7147 | 3052 |
| 7148 | 3052 |
| 7149 | 3052 |
| 7150 | 3052 |
| 7151 | 3052 |
| 7152 | 3052 |
| 7153 | 3052 |
| 7154 | 3052 |
| 7155 | 3052 |
| 7156 | 3052 |
| 7157 | 3052 |
| 7158 | 3052 |
| 7159 | 3052 |
| 7160 | 3068 |
| 7161 | 3068 |
| 7162 | 3068 |
| 7163 | 3068 |
| 7164 | 3068 |
| 7165 | 3068 |
| 7166 | 3068 |
| 7167 | 3068 |
| 7168 | 3068 |
| 7169 | 3068 |
| 7170 | 3068 |
| 7171 | 3068 |
| 7172 | 3068 |
| 7173 | 3068 |
| 7174 | 3068 |
| 7175 | 3068 |
| 7176 | 3068 |
| 7177 | 3068 |
| 7178 | 3068 |
| 7179 | 3068 |
| 7180 | 3068 |
| 7181 | 3068 |
| 7182 | 3068 |
| 7183 | 3068 |
| 7184 | 3068 |
| 7185 | 3068 |
| 7186 | 3068 |
| 7187 | 3068 |
| 7188 | 3068 |
| 7189 | 3068 |
| 7190 | 3068 |
| 7191 | 3068 |
| 7192 | 3068 |
| 7193 | 3068 |
| 7194 | 3068 |
| 7195 | 3068 |
| 7196 | 3068 |
| 7197 | 3068 |
| 7198 | 3068 |
| 7199 | 3068 |
| 7200 | 3068 |
| 7201 | 3068 |
| 7202 | 3068 |
| 7203 | 3068 |
| 7204 | 3068 |
| 7205 | 3068 |
| 7206 | 3068 |
| 7207 | 3068 |
| 7208 | 3276 |
| 7209 | 3276 |
| 7210 | 3276 |
| 7211 | 3276 |
| 7212 | 3276 |
| 7213 | 3276 |
| 7214 | 3276 |
| 7215 | 3276 |
| 7216 | 3276 |
| 7217 | 3276 |
| 7218 | 3276 |
| 7219 | 3276 |
| 7220 | 3276 |
| 7221 | 3276 |
| 7222 | 3276 |
| 7223 | 3276 |
| 7224 | 3276 |
| 7225 | 3276 |
| 7226 | 3276 |
| 7227 | 3276 |
| 7228 | 3276 |
| 7229 | 3276 |
| 7230 | 3276 |
| 7231 | 3276 |
| 7232 | 3276 |
| 7233 | 3276 |
| 7234 | 3276 |
| 7235 | 3276 |
| 7236 | 3276 |
| 7237 | 3276 |
| 7238 | 3276 |
| 7239 | 3276 |
| 7240 | 3276 |
| 7241 | 3276 |
| 7242 | 3276 |
| 7243 | 3276 |
| 7244 | 3276 |
| 7245 | 3276 |
| 7246 | 3276 |
| 7247 | 3276 |
| 7248 | 3276 |
| 7249 | 3276 |
| 7250 | 3276 |
| 7251 | 3276 |
| 7252 | 3276 |
| 7253 | 3276 |
| 7254 | 3276 |
| 7255 | 3276 |
| 7256 | 3064 |
| 7257 | 3064 |
| 7258 | 3064 |
| 7259 | 3064 |
| 7260 | 3064 |
| 7261 | 3064 |
| 7262 | 3064 |
| 7263 | 3064 |
| 7264 | 3064 |
| 7265 | 3064 |
| 7266 | 3064 |
| 7267 | 3064 |
| 7268 | 3064 |
| 7269 | 3064 |
| 7270 | 3064 |
| 7271 | 3064 |
| 7272 | 3064 |
| 7273 | 3064 |
| 7274 | 3064 |
| 7275 | 3064 |
| 7276 | 3064 |
| 7277 | 3064 |
| 7278 | 3064 |
| 7279 | 3064 |
| 7280 | 3064 |
| 7281 | 3064 |
| 7282 | 3064 |
| 7283 | 3064 |
| 7284 | 3064 |
| 7285 | 3064 |
| 7286 | 3064 |
| 7287 | 3064 |
| 7288 | 3064 |
| 7289 | 3064 |
| 7290 | 3064 |
| 7291 | 3064 |
| 7292 | 3064 |
| 7293 | 3064 |
| 7294 | 3064 |
| 7295 | 3064 |
| 7296 | 3064 |
| 7297 | 3064 |
| 7298 | 3064 |
| 7299 | 3064 |
| 7300 | 3064 |
| 7301 | 3064 |
| 7302 | 3064 |
| 7303 | 3064 |
| 7304 | 3064 |
| 7305 | 3036 |
| 7306 | 3036 |
| 7307 | 3036 |
| 7308 | 3036 |
| 7309 | 3036 |
| 7310 | 3036 |
| 7311 | 3036 |
| 7312 | 3036 |
| 7313 | 3036 |
| 7314 | 3036 |
| 7315 | 3036 |
| 7316 | 3036 |
| 7317 | 3036 |
| 7318 | 3036 |
| 7319 | 3036 |
| 7320 | 3036 |
| 7321 | 3036 |
| 7322 | 3036 |
| 7323 | 3036 |
| 7324 | 3036 |
| 7325 | 3036 |
| 7326 | 3036 |
| 7327 | 3036 |
| 7328 | 3036 |
| 7329 | 3036 |
| 7330 | 3036 |
| 7331 | 3036 |
| 7332 | 3036 |
| 7333 | 3036 |
| 7334 | 3036 |
| 7335 | 3036 |
| 7336 | 3036 |
| 7337 | 3036 |
| 7338 | 3036 |
| 7339 | 3036 |
| 7340 | 3036 |
| 7341 | 3036 |
| 7342 | 3036 |
| 7343 | 3036 |
| 7344 | 3036 |
| 7345 | 3036 |
| 7346 | 3036 |
| 7347 | 3036 |
| 7348 | 3036 |
| 7349 | 3036 |
| 7350 | 3036 |
| 7351 | 3036 |
| 7352 | 3036 |
| 7353 | 3040 |
| 7354 | 3040 |
| 7355 | 3040 |
| 7356 | 3040 |
| 7357 | 3040 |
| 7358 | 3040 |
| 7359 | 3040 |
| 7360 | 3040 |
| 7361 | 3040 |
| 7362 | 3040 |
| 7363 | 3040 |
| 7364 | 3040 |
| 7365 | 3040 |
| 7366 | 3040 |
| 7367 | 3040 |
| 7368 | 3040 |
| 7369 | 3040 |
| 7370 | 3040 |
| 7371 | 3040 |
| 7372 | 3040 |
| 7373 | 3040 |
| 7374 | 3040 |
| 7375 | 3040 |
| 7376 | 3040 |
| 7377 | 3040 |
| 7378 | 3040 |
| 7379 | 3040 |
| 7380 | 3040 |
| 7381 | 3040 |
| 7382 | 3040 |
| 7383 | 3040 |
| 7384 | 3040 |
| 7385 | 3040 |
| 7386 | 3040 |
| 7387 | 3040 |
| 7388 | 3040 |
| 7389 | 3040 |
| 7390 | 3040 |
| 7391 | 3040 |
| 7392 | 3040 |
| 7393 | 3040 |
| 7394 | 3040 |
| 7395 | 3040 |
| 7396 | 3040 |
| 7397 | 3040 |
| 7398 | 3040 |
| 7399 | 3040 |
| 7400 | 3040 |
| 7401 | 3100 |
| 7402 | 3100 |
| 7403 | 3100 |
| 7404 | 3100 |
| 7405 | 3100 |
| 7406 | 3100 |
| 7407 | 3100 |
| 7408 | 3100 |
| 7409 | 3100 |
| 7410 | 3100 |
| 7411 | 3100 |
| 7412 | 3100 |
| 7413 | 3100 |
| 7414 | 3100 |
| 7415 | 3100 |
| 7416 | 3100 |
| 7417 | 3100 |
| 7418 | 3100 |
| 7419 | 3100 |
| 7420 | 3100 |
| 7421 | 3100 |
| 7422 | 3100 |
| 7423 | 3100 |
| 7424 | 3100 |
| 7425 | 3100 |
| 7426 | 3100 |
| 7427 | 3100 |
| 7428 | 3100 |
| 7429 | 3100 |
| 7430 | 3100 |
| 7431 | 3100 |
| 7432 | 3100 |
| 7433 | 3100 |
| 7434 | 3100 |
| 7435 | 3100 |
| 7436 | 3100 |
| 7437 | 3100 |
| 7438 | 3100 |
| 7439 | 3100 |
| 7440 | 3100 |
| 7441 | 3100 |
| 7442 | 3100 |
| 7443 | 3100 |
| 7444 | 3100 |
| 7445 | 3100 |
| 7446 | 3100 |
| 7447 | 3100 |
| 7448 | 3100 |
| 7449 | 3052 |
| 7450 | 3052 |
| 7451 | 3052 |
| 7452 | 3052 |
| 7453 | 3052 |
| 7454 | 3052 |
| 7455 | 3052 |
| 7456 | 3052 |
| 7457 | 3052 |
| 7458 | 3052 |
| 7459 | 3052 |
| 7460 | 3052 |
| 7461 | 3052 |
| 7462 | 3052 |
| 7463 | 3052 |
| 7464 | 3052 |
| 7465 | 3052 |
| 7466 | 3052 |
| 7467 | 3052 |
| 7468 | 3052 |
| 7469 | 3052 |
| 7470 | 3052 |
| 7471 | 3052 |
| 7472 | 3052 |
| 7473 | 3052 |
| 7474 | 3052 |
| 7475 | 3052 |
| 7476 | 3052 |
| 7477 | 3052 |
| 7478 | 3052 |
| 7479 | 3052 |
| 7480 | 3052 |
| 7481 | 3052 |
| 7482 | 3052 |
| 7483 | 3052 |
| 7484 | 3052 |
| 7485 | 3052 |
| 7486 | 3052 |
| 7487 | 3052 |
| 7488 | 3052 |
| 7489 | 3052 |
| 7490 | 3052 |
| 7491 | 3052 |
| 7492 | 3052 |
| 7493 | 3052 |
| 7494 | 3052 |
| 7495 | 3052 |
| 7496 | 3052 |
| 7497 | 3072 |
| 7498 | 3072 |
| 7499 | 3072 |
| 7500 | 3072 |
| 7501 | 3072 |
| 7502 | 3072 |
| 7503 | 3072 |
| 7504 | 3072 |
| 7505 | 3072 |
| 7506 | 3072 |
| 7507 | 3072 |
| 7508 | 3072 |
| 7509 | 3072 |
| 7510 | 3072 |
| 7511 | 3072 |
| 7512 | 3072 |
| 7513 | 3072 |
| 7514 | 3072 |
| 7515 | 3072 |
| 7516 | 3072 |
| 7517 | 3072 |
| 7518 | 3072 |
| 7519 | 3072 |
| 7520 | 3072 |
| 7521 | 3072 |
| 7522 | 3072 |
| 7523 | 3072 |
| 7524 | 3072 |
| 7525 | 3072 |
| 7526 | 3072 |
| 7527 | 3072 |
| 7528 | 3072 |
| 7529 | 3072 |
| 7530 | 3072 |
| 7531 | 3072 |
| 7532 | 3072 |
| 7533 | 3072 |
| 7534 | 3072 |
| 7535 | 3072 |
| 7536 | 3072 |
| 7537 | 3072 |
| 7538 | 3072 |
| 7539 | 3072 |
| 7540 | 3072 |
| 7541 | 3072 |
| 7542 | 3072 |
| 7543 | 3072 |
| 7544 | 3072 |
| 7545 | 3060 |
| 7546 | 3060 |
| 7547 | 3060 |
| 7548 | 3060 |
| 7549 | 3060 |
| 7550 | 3060 |
| 7551 | 3060 |
| 7552 | 3060 |
| 7553 | 3060 |
| 7554 | 3060 |
| 7555 | 3060 |
| 7556 | 3060 |
| 7557 | 3060 |
| 7558 | 3060 |
| 7559 | 3060 |
| 7560 | 3060 |
| 7561 | 3060 |
| 7562 | 3060 |
| 7563 | 3060 |
| 7564 | 3060 |
| 7565 | 3060 |
| 7566 | 3060 |
| 7567 | 3060 |
| 7568 | 3060 |
| 7569 | 3060 |
| 7570 | 3060 |
| 7571 | 3060 |
| 7572 | 3060 |
| 7573 | 3060 |
| 7574 | 3060 |
| 7575 | 3060 |
| 7576 | 3060 |
| 7577 | 3060 |
| 7578 | 3060 |
| 7579 | 3060 |
| 7580 | 3060 |
| 7581 | 3060 |
| 7582 | 3060 |
| 7583 | 3060 |
| 7584 | 3060 |
| 7585 | 3060 |
| 7586 | 3060 |
| 7587 | 3060 |
| 7588 | 3060 |
| 7589 | 3060 |
| 7590 | 3060 |
| 7591 | 3060 |
| 7592 | 3060 |
| 7593 | 3060 |
| 7594 | 3064 |
| 7595 | 3064 |
| 7596 | 3064 |
| 7597 | 3064 |
| 7598 | 3064 |
| 7599 | 3064 |
| 7600 | 3064 |
| 7601 | 3064 |
| 7602 | 3064 |
| 7603 | 3064 |
| 7604 | 3064 |
| 7605 | 3064 |
| 7606 | 3064 |
| 7607 | 3064 |
| 7608 | 3064 |
| 7609 | 3064 |
| 7610 | 3064 |
| 7611 | 3064 |
| 7612 | 3064 |
| 7613 | 3064 |
| 7614 | 3064 |
| 7615 | 3064 |
| 7616 | 3064 |
| 7617 | 3064 |
| 7618 | 3064 |
| 7619 | 3064 |
| 7620 | 3064 |
| 7621 | 3064 |
| 7622 | 3064 |
| 7623 | 3064 |
| 7624 | 3064 |
| 7625 | 3064 |
| 7626 | 3064 |
| 7627 | 3064 |
| 7628 | 3064 |
| 7629 | 3064 |
| 7630 | 3064 |
| 7631 | 3064 |
| 7632 | 3064 |
| 7633 | 3064 |
| 7634 | 3064 |
| 7635 | 3064 |
| 7636 | 3064 |
| 7637 | 3064 |
| 7638 | 3064 |
| 7639 | 3064 |
| 7640 | 3064 |
| 7641 | 3064 |
| 7642 | 3056 |
| 7643 | 3056 |
| 7644 | 3056 |
| 7645 | 3056 |
| 7646 | 3056 |
| 7647 | 3056 |
| 7648 | 3056 |
| 7649 | 3056 |
| 7650 | 3056 |
| 7651 | 3056 |
| 7652 | 3056 |
| 7653 | 3056 |
| 7654 | 3056 |
| 7655 | 3056 |
| 7656 | 3056 |
| 7657 | 3056 |
| 7658 | 3056 |
| 7659 | 3056 |
| 7660 | 3056 |
| 7661 | 3056 |
| 7662 | 3056 |
| 7663 | 3056 |
| 7664 | 3056 |
| 7665 | 3056 |
| 7666 | 3056 |
| 7667 | 3056 |
| 7668 | 3056 |
| 7669 | 3056 |
| 7670 | 3056 |
| 7671 | 3056 |
| 7672 | 3056 |
| 7673 | 3056 |
| 7674 | 3056 |
| 7675 | 3056 |
| 7676 | 3056 |
| 7677 | 3056 |
| 7678 | 3056 |
| 7679 | 3056 |
| 7680 | 3056 |
| 7681 | 3056 |
| 7682 | 3056 |
| 7683 | 3056 |
| 7684 | 3056 |
| 7685 | 3056 |
| 7686 | 3056 |
| 7687 | 3056 |
| 7688 | 3056 |
| 7689 | 3056 |
| 7690 | 3112 |
| 7691 | 3112 |
| 7692 | 3112 |
| 7693 | 3112 |
| 7694 | 3112 |
| 7695 | 3112 |
| 7696 | 3112 |
| 7697 | 3112 |
| 7698 | 3112 |
| 7699 | 3112 |
| 7700 | 3112 |
| 7701 | 3112 |
| 7702 | 3112 |
| 7703 | 3112 |
| 7704 | 3112 |
| 7705 | 3112 |
| 7706 | 3112 |
| 7707 | 3112 |
| 7708 | 3112 |
| 7709 | 3112 |
| 7710 | 3112 |
| 7711 | 3112 |
| 7712 | 3112 |
| 7713 | 3112 |
| 7714 | 3112 |
| 7715 | 3112 |
| 7716 | 3112 |
| 7717 | 3112 |
| 7718 | 3112 |
| 7719 | 3112 |
| 7720 | 3112 |
| 7721 | 3112 |
| 7722 | 3112 |
| 7723 | 3112 |
| 7724 | 3112 |
| 7725 | 3112 |
| 7726 | 3112 |
| 7727 | 3112 |
| 7728 | 3112 |
| 7729 | 3112 |
| 7730 | 3112 |
| 7731 | 3112 |
| 7732 | 3112 |
| 7733 | 3112 |
| 7734 | 3112 |
| 7735 | 3112 |
| 7736 | 3112 |
| 7737 | 3112 |
| 7738 | 3048 |
| 7739 | 3048 |
| 7740 | 3048 |
| 7741 | 3048 |
| 7742 | 3048 |
| 7743 | 3048 |
| 7744 | 3048 |
| 7745 | 3048 |
| 7746 | 3048 |
| 7747 | 3048 |
| 7748 | 3048 |
| 7749 | 3048 |
| 7750 | 3048 |
| 7751 | 3048 |
| 7752 | 3048 |
| 7753 | 3048 |
| 7754 | 3048 |
| 7755 | 3048 |
| 7756 | 3048 |
| 7757 | 3048 |
| 7758 | 3048 |
| 7759 | 3048 |
| 7760 | 3048 |
| 7761 | 3048 |
| 7762 | 3048 |
| 7763 | 3048 |
| 7764 | 3048 |
| 7765 | 3048 |
| 7766 | 3048 |
| 7767 | 3048 |
| 7768 | 3048 |
| 7769 | 3048 |
| 7770 | 3048 |
| 7771 | 3048 |
| 7772 | 3048 |
| 7773 | 3048 |
| 7774 | 3048 |
| 7775 | 3048 |
| 7776 | 3048 |
| 7777 | 3048 |
| 7778 | 3048 |
| 7779 | 3048 |
| 7780 | 3048 |
| 7781 | 3048 |
| 7782 | 3048 |
| 7783 | 3048 |
| 7784 | 3048 |
| 7785 | 3048 |
| 7786 | 3048 |
| 7787 | 3032 |
| 7788 | 3032 |
| 7789 | 3032 |
| 7790 | 3032 |
| 7791 | 3032 |
| 7792 | 3032 |
| 7793 | 3032 |
| 7794 | 3032 |
| 7795 | 3032 |
| 7796 | 3032 |
| 7797 | 3032 |
| 7798 | 3032 |
| 7799 | 3032 |
| 7800 | 3032 |
| 7801 | 3032 |
| 7802 | 3032 |
| 7803 | 3032 |
| 7804 | 3032 |
| 7805 | 3032 |
| 7806 | 3032 |
| 7807 | 3032 |
| 7808 | 3032 |
| 7809 | 3032 |
| 7810 | 3032 |
| 7811 | 3032 |
| 7812 | 3032 |
| 7813 | 3032 |
| 7814 | 3032 |
| 7815 | 3032 |
| 7816 | 3032 |
| 7817 | 3032 |
| 7818 | 3032 |
| 7819 | 3032 |
| 7820 | 3032 |
| 7821 | 3032 |
| 7822 | 3032 |
| 7823 | 3032 |
| 7824 | 3032 |
| 7825 | 3032 |
| 7826 | 3032 |
| 7827 | 3032 |
| 7828 | 3032 |
| 7829 | 3032 |
| 7830 | 3032 |
| 7831 | 3032 |
| 7832 | 3032 |
| 7833 | 3032 |
| 7834 | 3032 |
| 7835 | 3044 |
| 7836 | 3044 |
| 7837 | 3044 |
| 7838 | 3044 |
| 7839 | 3044 |
| 7840 | 3044 |
| 7841 | 3044 |
| 7842 | 3044 |
| 7843 | 3044 |
| 7844 | 3044 |
| 7845 | 3044 |
| 7846 | 3044 |
| 7847 | 3044 |
| 7848 | 3044 |
| 7849 | 3044 |
| 7850 | 3044 |
| 7851 | 3044 |
| 7852 | 3044 |
| 7853 | 3044 |
| 7854 | 3044 |
| 7855 | 3044 |
| 7856 | 3044 |
| 7857 | 3044 |
| 7858 | 3044 |
| 7859 | 3044 |
| 7860 | 3044 |
| 7861 | 3044 |
| 7862 | 3044 |
| 7863 | 3044 |
| 7864 | 3044 |
| 7865 | 3044 |
| 7866 | 3044 |
| 7867 | 3044 |
| 7868 | 3044 |
| 7869 | 3044 |
| 7870 | 3044 |
| 7871 | 3044 |
| 7872 | 3044 |
| 7873 | 3044 |
| 7874 | 3044 |
| 7875 | 3044 |
| 7876 | 3044 |
| 7877 | 3044 |
| 7878 | 3044 |
| 7879 | 3044 |
| 7880 | 3044 |
| 7881 | 3044 |
| 7882 | 3044 |
| 7883 | 3048 |
| 7884 | 3048 |
| 7885 | 3048 |
| 7886 | 3048 |
| 7887 | 3048 |
| 7888 | 3048 |
| 7889 | 3048 |
| 7890 | 3048 |
| 7891 | 3048 |
| 7892 | 3048 |
| 7893 | 3048 |
| 7894 | 3048 |
| 7895 | 3048 |
| 7896 | 3048 |
| 7897 | 3048 |
| 7898 | 3048 |
| 7899 | 3048 |
| 7900 | 3048 |
| 7901 | 3048 |
| 7902 | 3048 |
| 7903 | 3048 |
| 7904 | 3048 |
| 7905 | 3048 |
| 7906 | 3048 |
| 7907 | 3048 |
| 7908 | 3048 |
| 7909 | 3048 |
| 7910 | 3048 |
| 7911 | 3048 |
| 7912 | 3048 |
| 7913 | 3048 |
| 7914 | 3048 |
| 7915 | 3048 |
| 7916 | 3048 |
| 7917 | 3048 |
| 7918 | 3048 |
| 7919 | 3048 |
| 7920 | 3048 |
| 7921 | 3048 |
| 7922 | 3048 |
| 7923 | 3048 |
| 7924 | 3048 |
| 7925 | 3048 |
| 7926 | 3048 |
| 7927 | 3048 |
| 7928 | 3048 |
| 7929 | 3048 |
| 7930 | 3048 |
| 7931 | 3052 |
| 7932 | 3052 |
| 7933 | 3052 |
| 7934 | 3052 |
| 7935 | 3052 |
| 7936 | 3052 |
| 7937 | 3052 |
| 7938 | 3052 |
| 7939 | 3052 |
| 7940 | 3052 |
| 7941 | 3052 |
| 7942 | 3052 |
| 7943 | 3052 |
| 7944 | 3052 |
| 7945 | 3052 |
| 7946 | 3052 |
| 7947 | 3052 |
| 7948 | 3052 |
| 7949 | 3052 |
| 7950 | 3052 |
| 7951 | 3052 |
| 7952 | 3052 |
| 7953 | 3052 |
| 7954 | 3052 |
| 7955 | 3052 |
| 7956 | 3052 |
| 7957 | 3052 |
| 7958 | 3052 |
| 7959 | 3052 |
| 7960 | 3052 |
| 7961 | 3052 |
| 7962 | 3052 |
| 7963 | 3052 |
| 7964 | 3052 |
| 7965 | 3052 |
| 7966 | 3052 |
| 7967 | 3052 |
| 7968 | 3052 |
| 7969 | 3052 |
| 7970 | 3052 |
| 7971 | 3052 |
| 7972 | 3052 |
| 7973 | 3052 |
| 7974 | 3052 |
| 7975 | 3052 |
| 7976 | 3052 |
| 7977 | 3052 |
| 7978 | 3052 |
| 7979 | 3064 |
| 7980 | 3064 |
| 7981 | 3064 |
| 7982 | 3064 |
| 7983 | 3064 |
| 7984 | 3064 |
| 7985 | 3064 |
| 7986 | 3064 |
| 7987 | 3064 |
| 7988 | 3064 |
| 7989 | 3064 |
| 7990 | 3064 |
| 7991 | 3064 |
| 7992 | 3064 |
| 7993 | 3064 |
| 7994 | 3064 |
| 7995 | 3064 |
| 7996 | 3064 |
| 7997 | 3064 |
| 7998 | 3064 |
| 7999 | 3064 |
| 8000 | 3064 |
| 8001 | 3064 |
| 8002 | 3064 |
| 8003 | 3064 |
| 8004 | 3064 |
| 8005 | 3064 |
| 8006 | 3064 |
| 8007 | 3064 |
| 8008 | 3064 |
| 8009 | 3064 |
| 8010 | 3064 |
| 8011 | 3064 |
| 8012 | 3064 |
| 8013 | 3064 |
| 8014 | 3064 |
| 8015 | 3064 |
| 8016 | 3064 |
| 8017 | 3064 |
| 8018 | 3064 |
| 8019 | 3064 |
| 8020 | 3064 |
| 8021 | 3064 |
| 8022 | 3064 |
| 8023 | 3064 |
| 8024 | 3064 |
| 8025 | 3064 |
| 8026 | 3064 |
| 8027 | 3044 |
| 8028 | 3044 |
| 8029 | 3044 |
| 8030 | 3044 |
| 8031 | 3044 |
| 8032 | 3044 |
| 8033 | 3044 |
| 8034 | 3044 |
| 8035 | 3044 |
| 8036 | 3044 |
| 8037 | 3044 |
| 8038 | 3044 |
| 8039 | 3044 |
| 8040 | 3044 |
| 8041 | 3044 |
| 8042 | 3044 |
| 8043 | 3044 |
| 8044 | 3044 |
| 8045 | 3044 |
| 8046 | 3044 |
| 8047 | 3044 |
| 8048 | 3044 |
| 8049 | 3044 |
| 8050 | 3044 |
| 8051 | 3044 |
| 8052 | 3044 |
| 8053 | 3044 |
| 8054 | 3044 |
| 8055 | 3044 |
| 8056 | 3044 |
| 8057 | 3044 |
| 8058 | 3044 |
| 8059 | 3044 |
| 8060 | 3044 |
| 8061 | 3044 |
| 8062 | 3044 |
| 8063 | 3044 |
| 8064 | 3044 |
| 8065 | 3044 |
| 8066 | 3044 |
| 8067 | 3044 |
| 8068 | 3044 |
| 8069 | 3044 |
| 8070 | 3044 |
| 8071 | 3044 |
| 8072 | 3044 |
| 8073 | 3044 |
| 8074 | 3044 |
| 8075 | 3048 |
| 8076 | 3048 |
| 8077 | 3048 |
| 8078 | 3048 |
| 8079 | 3048 |
| 8080 | 3048 |
| 8081 | 3048 |
| 8082 | 3048 |
| 8083 | 3048 |
| 8084 | 3048 |
| 8085 | 3048 |
| 8086 | 3048 |
| 8087 | 3048 |
| 8088 | 3048 |
| 8089 | 3048 |
| 8090 | 3048 |
| 8091 | 3048 |
| 8092 | 3048 |
| 8093 | 3048 |
| 8094 | 3048 |
| 8095 | 3048 |
| 8096 | 3048 |
| 8097 | 3048 |
| 8098 | 3048 |
| 8099 | 3048 |
| 8100 | 3048 |
| 8101 | 3048 |
| 8102 | 3048 |
| 8103 | 3048 |
| 8104 | 3048 |
| 8105 | 3048 |
| 8106 | 3048 |
| 8107 | 3048 |
| 8108 | 3048 |
| 8109 | 3048 |
| 8110 | 3048 |
| 8111 | 3048 |
| 8112 | 3048 |
| 8113 | 3048 |
| 8114 | 3048 |
| 8115 | 3048 |
| 8116 | 3048 |
| 8117 | 3048 |
| 8118 | 3048 |
| 8119 | 3048 |
| 8120 | 3048 |
| 8121 | 3048 |
| 8122 | 3048 |
| 8123 | 3060 |
| 8124 | 3060 |
| 8125 | 3060 |
| 8126 | 3060 |
| 8127 | 3060 |
| 8128 | 3060 |
| 8129 | 3060 |
| 8130 | 3060 |
| 8131 | 3060 |
| 8132 | 3060 |
| 8133 | 3060 |
| 8134 | 3060 |
| 8135 | 3060 |
| 8136 | 3060 |
| 8137 | 3060 |
| 8138 | 3060 |
| 8139 | 3060 |
| 8140 | 3060 |
| 8141 | 3060 |
| 8142 | 3060 |
| 8143 | 3060 |
| 8144 | 3060 |
| 8145 | 3060 |
| 8146 | 3060 |
| 8147 | 3060 |
| 8148 | 3060 |
| 8149 | 3060 |
| 8150 | 3060 |
| 8151 | 3060 |
| 8152 | 3060 |
| 8153 | 3060 |
| 8154 | 3060 |
| 8155 | 3060 |
| 8156 | 3060 |
| 8157 | 3060 |
| 8158 | 3060 |
| 8159 | 3060 |
| 8160 | 3060 |
| 8161 | 3060 |
| 8162 | 3060 |
| 8163 | 3060 |
| 8164 | 3060 |
| 8165 | 3060 |
| 8166 | 3060 |
| 8167 | 3060 |
| 8168 | 3060 |
| 8169 | 3060 |
| 8170 | 3060 |
| 8171 | 3060 |
| 8172 | 3064 |
| 8173 | 3064 |
| 8174 | 3064 |
| 8175 | 3064 |
| 8176 | 3064 |
| 8177 | 3064 |
| 8178 | 3064 |
| 8179 | 3064 |
| 8180 | 3064 |
| 8181 | 3064 |
| 8182 | 3064 |
| 8183 | 3064 |
| 8184 | 3064 |
| 8185 | 3064 |
| 8186 | 3064 |
| 8187 | 3064 |
| 8188 | 3064 |
| 8189 | 3064 |
| 8190 | 3064 |
| 8191 | 3064 |
| 8192 | 3064 |
| 8193 | 3064 |
| 8194 | 3064 |
| 8195 | 3064 |
| 8196 | 3064 |
| 8197 | 3064 |
| 8198 | 3064 |
| 8199 | 3064 |
| 8200 | 3064 |
| 8201 | 3064 |
| 8202 | 3064 |
| 8203 | 3064 |
| 8204 | 3064 |
| 8205 | 3064 |
| 8206 | 3064 |
| 8207 | 3064 |
| 8208 | 3064 |
| 8209 | 3064 |
| 8210 | 3064 |
| 8211 | 3064 |
| 8212 | 3064 |
| 8213 | 3064 |
| 8214 | 3064 |
| 8215 | 3064 |
| 8216 | 3064 |
| 8217 | 3064 |
| 8218 | 3064 |
| 8219 | 3064 |
| 8220 | 3040 |
| 8221 | 3040 |
| 8222 | 3040 |
| 8223 | 3040 |
| 8224 | 3040 |
| 8225 | 3040 |
| 8226 | 3040 |
| 8227 | 3040 |
| 8228 | 3040 |
| 8229 | 3040 |
| 8230 | 3040 |
| 8231 | 3040 |
| 8232 | 3040 |
| 8233 | 3040 |
| 8234 | 3040 |
| 8235 | 3040 |
| 8236 | 3040 |
| 8237 | 3040 |
| 8238 | 3040 |
| 8239 | 3040 |
| 8240 | 3040 |
| 8241 | 3040 |
| 8242 | 3040 |
| 8243 | 3040 |
| 8244 | 3040 |
| 8245 | 3040 |
| 8246 | 3040 |
| 8247 | 3040 |
| 8248 | 3040 |
| 8249 | 3040 |
| 8250 | 3040 |
| 8251 | 3040 |
| 8252 | 3040 |
| 8253 | 3040 |
| 8254 | 3040 |
| 8255 | 3040 |
| 8256 | 3040 |
| 8257 | 3040 |
| 8258 | 3040 |
| 8259 | 3040 |
| 8260 | 3040 |
| 8261 | 3040 |
| 8262 | 3040 |
| 8263 | 3040 |
| 8264 | 3040 |
| 8265 | 3040 |
| 8266 | 3040 |
| 8267 | 3040 |
| 8268 | 3064 |
| 8269 | 3064 |
| 8270 | 3064 |
| 8271 | 3064 |
| 8272 | 3064 |
| 8273 | 3064 |
| 8274 | 3064 |
| 8275 | 3064 |
| 8276 | 3064 |
| 8277 | 3064 |
| 8278 | 3064 |
| 8279 | 3064 |
| 8280 | 3064 |
| 8281 | 3064 |
| 8282 | 3064 |
| 8283 | 3064 |
| 8284 | 3064 |
| 8285 | 3064 |
| 8286 | 3064 |
| 8287 | 3064 |
| 8288 | 3064 |
| 8289 | 3064 |
| 8290 | 3064 |
| 8291 | 3064 |
| 8292 | 3064 |
| 8293 | 3064 |
| 8294 | 3064 |
| 8295 | 3064 |
| 8296 | 3064 |
| 8297 | 3064 |
| 8298 | 3064 |
| 8299 | 3064 |
| 8300 | 3064 |
| 8301 | 3064 |
| 8302 | 3064 |
| 8303 | 3064 |
| 8304 | 3064 |
| 8305 | 3064 |
| 8306 | 3064 |
| 8307 | 3064 |
| 8308 | 3064 |
| 8309 | 3064 |
| 8310 | 3064 |
| 8311 | 3064 |
| 8312 | 3064 |
| 8313 | 3064 |
| 8314 | 3064 |
| 8315 | 3064 |
| 8316 | 3040 |
| 8317 | 3040 |
| 8318 | 3040 |
| 8319 | 3040 |
| 8320 | 3040 |
| 8321 | 3040 |
| 8322 | 3040 |
| 8323 | 3040 |
| 8324 | 3040 |
| 8325 | 3040 |
| 8326 | 3040 |
| 8327 | 3040 |
| 8328 | 3040 |
| 8329 | 3040 |
| 8330 | 3040 |
| 8331 | 3040 |
| 8332 | 3040 |
| 8333 | 3040 |
| 8334 | 3040 |
| 8335 | 3040 |
| 8336 | 3040 |
| 8337 | 3040 |
| 8338 | 3040 |
| 8339 | 3040 |
| 8340 | 3040 |
| 8341 | 3040 |
| 8342 | 3040 |
| 8343 | 3040 |
| 8344 | 3040 |
| 8345 | 3040 |
| 8346 | 3040 |
| 8347 | 3040 |
| 8348 | 3040 |
| 8349 | 3040 |
| 8350 | 3040 |
| 8351 | 3040 |
| 8352 | 3040 |
| 8353 | 3040 |
| 8354 | 3040 |
| 8355 | 3040 |
| 8356 | 3040 |
| 8357 | 3040 |
| 8358 | 3040 |
| 8359 | 3040 |
| 8360 | 3040 |
| 8361 | 3040 |
| 8362 | 3040 |
| 8363 | 3040 |
| 8364 | 3080 |
| 8365 | 3080 |
| 8366 | 3080 |
| 8367 | 3080 |
| 8368 | 3080 |
| 8369 | 3080 |
| 8370 | 3080 |
| 8371 | 3080 |
| 8372 | 3080 |
| 8373 | 3080 |
| 8374 | 3080 |
| 8375 | 3080 |
| 8376 | 3080 |
| 8377 | 3080 |
| 8378 | 3080 |
| 8379 | 3080 |
| 8380 | 3080 |
| 8381 | 3080 |
| 8382 | 3080 |
| 8383 | 3080 |
| 8384 | 3080 |
| 8385 | 3080 |
| 8386 | 3080 |
| 8387 | 3080 |
| 8388 | 3080 |
| 8389 | 3080 |
| 8390 | 3080 |
| 8391 | 3080 |
| 8392 | 3080 |
| 8393 | 3080 |
| 8394 | 3080 |
| 8395 | 3080 |
| 8396 | 3080 |
| 8397 | 3080 |
| 8398 | 3080 |
| 8399 | 3080 |
| 8400 | 3080 |
| 8401 | 3080 |
| 8402 | 3080 |
| 8403 | 3080 |
| 8404 | 3080 |
| 8405 | 3080 |
| 8406 | 3080 |
| 8407 | 3080 |
| 8408 | 3080 |
| 8409 | 3080 |
| 8410 | 3080 |
| 8411 | 3080 |
| 8412 | 3060 |
| 8413 | 3060 |
| 8414 | 3060 |
| 8415 | 3060 |
| 8416 | 3060 |
| 8417 | 3060 |
| 8418 | 3060 |
| 8419 | 3060 |
| 8420 | 3060 |
| 8421 | 3060 |
| 8422 | 3060 |
| 8423 | 3060 |
| 8424 | 3060 |
| 8425 | 3060 |
| 8426 | 3060 |
| 8427 | 3060 |
| 8428 | 3060 |
| 8429 | 3060 |
| 8430 | 3060 |
| 8431 | 3060 |
| 8432 | 3060 |
| 8433 | 3060 |
| 8434 | 3060 |
| 8435 | 3060 |
| 8436 | 3060 |
| 8437 | 3060 |
| 8438 | 3060 |
| 8439 | 3060 |
| 8440 | 3060 |
| 8441 | 3060 |
| 8442 | 3060 |
| 8443 | 3060 |
| 8444 | 3060 |
| 8445 | 3060 |
| 8446 | 3060 |
| 8447 | 3060 |
| 8448 | 3060 |
| 8449 | 3060 |
| 8450 | 3060 |
| 8451 | 3060 |
| 8452 | 3060 |
| 8453 | 3060 |
| 8454 | 3060 |
| 8455 | 3060 |
| 8456 | 3060 |
| 8457 | 3060 |
| 8458 | 3060 |
| 8459 | 3060 |
| 8460 | 3032 |
| 8461 | 3032 |
| 8462 | 3032 |
| 8463 | 3032 |
| 8464 | 3032 |
| 8465 | 3032 |
| 8466 | 3032 |
| 8467 | 3032 |
| 8468 | 3032 |
| 8469 | 3032 |
| 8470 | 3032 |
| 8471 | 3032 |
| 8472 | 3032 |
| 8473 | 3032 |
| 8474 | 3032 |
| 8475 | 3032 |
| 8476 | 3032 |
| 8477 | 3032 |
| 8478 | 3032 |
| 8479 | 3032 |
| 8480 | 3032 |
| 8481 | 3032 |
| 8482 | 3032 |
| 8483 | 3032 |
| 8484 | 3032 |
| 8485 | 3032 |
| 8486 | 3032 |
| 8487 | 3032 |
| 8488 | 3032 |
| 8489 | 3032 |
| 8490 | 3032 |
| 8491 | 3032 |
| 8492 | 3032 |
| 8493 | 3032 |
| 8494 | 3032 |
| 8495 | 3032 |
| 8496 | 3032 |
| 8497 | 3032 |
| 8498 | 3032 |
| 8499 | 3032 |
| 8500 | 3032 |
| 8501 | 3032 |
| 8502 | 3032 |
| 8503 | 3032 |
| 8504 | 3032 |
| 8505 | 3032 |
| 8506 | 3032 |
| 8507 | 3032 |
| 8508 | 3112 |
| 8509 | 3112 |
| 8510 | 3112 |
| 8511 | 3112 |
| 8512 | 3112 |
| 8513 | 3112 |
| 8514 | 3112 |
| 8515 | 3112 |
| 8516 | 3112 |
| 8517 | 3112 |
| 8518 | 3112 |
| 8519 | 3112 |
| 8520 | 3112 |
| 8521 | 3112 |
| 8522 | 3112 |
| 8523 | 3112 |
| 8524 | 3112 |
| 8525 | 3112 |
| 8526 | 3112 |
| 8527 | 3112 |
| 8528 | 3112 |
| 8529 | 3112 |
| 8530 | 3112 |
| 8531 | 3112 |
| 8532 | 3112 |
| 8533 | 3112 |
| 8534 | 3112 |
| 8535 | 3112 |
| 8536 | 3112 |
| 8537 | 3112 |
| 8538 | 3112 |
| 8539 | 3112 |
| 8540 | 3112 |
| 8541 | 3112 |
| 8542 | 3112 |
| 8543 | 3112 |
| 8544 | 3112 |
| 8545 | 3112 |
| 8546 | 3112 |
| 8547 | 3112 |
| 8548 | 3112 |
| 8549 | 3112 |
| 8550 | 3112 |
| 8551 | 3112 |
| 8552 | 3112 |
| 8553 | 3112 |
| 8554 | 3112 |
| 8555 | 3112 |
| 8556 | 3112 |
| 8557 | 3056 |
| 8558 | 3056 |
| 8559 | 3056 |
| 8560 | 3056 |
| 8561 | 3056 |
| 8562 | 3056 |
| 8563 | 3056 |
| 8564 | 3056 |
| 8565 | 3056 |
| 8566 | 3056 |
| 8567 | 3056 |
| 8568 | 3056 |
| 8569 | 3056 |
| 8570 | 3056 |
| 8571 | 3056 |
| 8572 | 3056 |
| 8573 | 3056 |
| 8574 | 3056 |
| 8575 | 3056 |
| 8576 | 3056 |
| 8577 | 3056 |
| 8578 | 3056 |
| 8579 | 3056 |
| 8580 | 3056 |
| 8581 | 3056 |
| 8582 | 3056 |
| 8583 | 3056 |
| 8584 | 3056 |
| 8585 | 3056 |
| 8586 | 3056 |
| 8587 | 3056 |
| 8588 | 3056 |
| 8589 | 3056 |
| 8590 | 3056 |
| 8591 | 3056 |
| 8592 | 3056 |
| 8593 | 3056 |
| 8594 | 3056 |
| 8595 | 3056 |
| 8596 | 3056 |
| 8597 | 3056 |
| 8598 | 3056 |
| 8599 | 3056 |
| 8600 | 3056 |
| 8601 | 3056 |
| 8602 | 3056 |
| 8603 | 3056 |
| 8604 | 3056 |
| 8605 | 3060 |
| 8606 | 3060 |
| 8607 | 3060 |
| 8608 | 3060 |
| 8609 | 3060 |
| 8610 | 3060 |
| 8611 | 3060 |
| 8612 | 3060 |
| 8613 | 3060 |
| 8614 | 3060 |
| 8615 | 3060 |
| 8616 | 3060 |
| 8617 | 3060 |
| 8618 | 3060 |
| 8619 | 3060 |
| 8620 | 3060 |
| 8621 | 3060 |
| 8622 | 3060 |
| 8623 | 3060 |
| 8624 | 3060 |
| 8625 | 3060 |
| 8626 | 3060 |
| 8627 | 3060 |
| 8628 | 3060 |
| 8629 | 3060 |
| 8630 | 3060 |
| 8631 | 3060 |
| 8632 | 3060 |
| 8633 | 3060 |
| 8634 | 3060 |
| 8635 | 3060 |
| 8636 | 3060 |
| 8637 | 3060 |
| 8638 | 3060 |
| 8639 | 3060 |
| 8640 | 3060 |
| 8641 | 3060 |
| 8642 | 3060 |
| 8643 | 3060 |
| 8644 | 3060 |
| 8645 | 3060 |
| 8646 | 3060 |
| 8647 | 3060 |
| 8648 | 3060 |
| 8649 | 3060 |
| 8650 | 3060 |
| 8651 | 3060 |
| 8652 | 3060 |
| 8653 | 3044 |
| 8654 | 3044 |
| 8655 | 3044 |
| 8656 | 3044 |
| 8657 | 3044 |
| 8658 | 3044 |
| 8659 | 3044 |
| 8660 | 3044 |
| 8661 | 3044 |
| 8662 | 3044 |
| 8663 | 3044 |
| 8664 | 3044 |
| 8665 | 3044 |
| 8666 | 3044 |
| 8667 | 3044 |
| 8668 | 3044 |
| 8669 | 3044 |
| 8670 | 3044 |
| 8671 | 3044 |
| 8672 | 3044 |
| 8673 | 3044 |
| 8674 | 3044 |
| 8675 | 3044 |
| 8676 | 3044 |
| 8677 | 3044 |
| 8678 | 3044 |
| 8679 | 3044 |
| 8680 | 3044 |
| 8681 | 3044 |
| 8682 | 3044 |
| 8683 | 3044 |
| 8684 | 3044 |
| 8685 | 3044 |
| 8686 | 3044 |
| 8687 | 3044 |
| 8688 | 3044 |
| 8689 | 3044 |
| 8690 | 3044 |
| 8691 | 3044 |
| 8692 | 3044 |
| 8693 | 3044 |
| 8694 | 3044 |
| 8695 | 3044 |
| 8696 | 3044 |
| 8697 | 3044 |
| 8698 | 3044 |
| 8699 | 3044 |
| 8700 | 3044 |
| 8701 | 3300 |
| 8702 | 3300 |
| 8703 | 3300 |
| 8704 | 3300 |
| 8705 | 3300 |
| 8706 | 3300 |
| 8707 | 3300 |
| 8708 | 3300 |
| 8709 | 3300 |
| 8710 | 3300 |
| 8711 | 3300 |
| 8712 | 3300 |
| 8713 | 3300 |
| 8714 | 3300 |
| 8715 | 3300 |
| 8716 | 3300 |
| 8717 | 3300 |
| 8718 | 3300 |
| 8719 | 3300 |
| 8720 | 3300 |
| 8721 | 3300 |
| 8722 | 3300 |
| 8723 | 3300 |
| 8724 | 3300 |
| 8725 | 3300 |
| 8726 | 3300 |
| 8727 | 3300 |
| 8728 | 3300 |
| 8729 | 3300 |
| 8730 | 3300 |
| 8731 | 3300 |
| 8732 | 3300 |
| 8733 | 3300 |
| 8734 | 3300 |
| 8735 | 3300 |
| 8736 | 3300 |
| 8737 | 3300 |
| 8738 | 3300 |
| 8739 | 3300 |
| 8740 | 3300 |
| 8741 | 3300 |
| 8742 | 3300 |
| 8743 | 3300 |
| 8744 | 3300 |
| 8745 | 3300 |
| 8746 | 3300 |
| 8747 | 3300 |
| 8748 | 3300 |
| 8749 | 3300 |
| 8750 | 3032 |
| 8751 | 3032 |
| 8752 | 3032 |
| 8753 | 3032 |
| 8754 | 3032 |
| 8755 | 3032 |
| 8756 | 3032 |
| 8757 | 3032 |
| 8758 | 3032 |
| 8759 | 3032 |
| 8760 | 3032 |
| 8761 | 3032 |
| 8762 | 3032 |
| 8763 | 3032 |
| 8764 | 3032 |
| 8765 | 3032 |
| 8766 | 3032 |
| 8767 | 3032 |
| 8768 | 3032 |
| 8769 | 3032 |
| 8770 | 3032 |
| 8771 | 3032 |
| 8772 | 3032 |
| 8773 | 3032 |
| 8774 | 3032 |
| 8775 | 3032 |
| 8776 | 3032 |
| 8777 | 3032 |
| 8778 | 3032 |
| 8779 | 3032 |
| 8780 | 3032 |
| 8781 | 3032 |
| 8782 | 3032 |
| 8783 | 3032 |
| 8784 | 3032 |
| 8785 | 3032 |
| 8786 | 3032 |
| 8787 | 3032 |
| 8788 | 3032 |
| 8789 | 3032 |
| 8790 | 3032 |
| 8791 | 3032 |
| 8792 | 3032 |
| 8793 | 3032 |
| 8794 | 3032 |
| 8795 | 3032 |
| 8796 | 3032 |
| 8797 | 3032 |
| 8798 | 3028 |
| 8799 | 3028 |
| 8800 | 3028 |
| 8801 | 3028 |
| 8802 | 3028 |
| 8803 | 3028 |
| 8804 | 3028 |
| 8805 | 3028 |
| 8806 | 3028 |
| 8807 | 3028 |
| 8808 | 3028 |
| 8809 | 3028 |
| 8810 | 3028 |
| 8811 | 3028 |
| 8812 | 3028 |
| 8813 | 3028 |
| 8814 | 3028 |
| 8815 | 3028 |
| 8816 | 3028 |
| 8817 | 3028 |
| 8818 | 3028 |
| 8819 | 3028 |
| 8820 | 3028 |
| 8821 | 3028 |
| 8822 | 3028 |
| 8823 | 3028 |
| 8824 | 3028 |
| 8825 | 3028 |
| 8826 | 3028 |
| 8827 | 3028 |
| 8828 | 3028 |
| 8829 | 3028 |
| 8830 | 3028 |
| 8831 | 3028 |
| 8832 | 3028 |
| 8833 | 3028 |
| 8834 | 3028 |
| 8835 | 3028 |
| 8836 | 3028 |
| 8837 | 3028 |
| 8838 | 3028 |
| 8839 | 3028 |
| 8840 | 3028 |
| 8841 | 3028 |
| 8842 | 3028 |
| 8843 | 3028 |
| 8844 | 3028 |
| 8845 | 3028 |
| 8846 | 3088 |
| 8847 | 3088 |
| 8848 | 3088 |
| 8849 | 3088 |
| 8850 | 3088 |
| 8851 | 3088 |
| 8852 | 3088 |
| 8853 | 3088 |
| 8854 | 3088 |
| 8855 | 3088 |
| 8856 | 3088 |
| 8857 | 3088 |
| 8858 | 3088 |
| 8859 | 3088 |
| 8860 | 3088 |
| 8861 | 3088 |
| 8862 | 3088 |
| 8863 | 3088 |
| 8864 | 3088 |
| 8865 | 3088 |
| 8866 | 3088 |
| 8867 | 3088 |
| 8868 | 3088 |
| 8869 | 3088 |
| 8870 | 3088 |
| 8871 | 3088 |
| 8872 | 3088 |
| 8873 | 3088 |
| 8874 | 3088 |
| 8875 | 3088 |
| 8876 | 3088 |
| 8877 | 3088 |
| 8878 | 3088 |
| 8879 | 3088 |
| 8880 | 3088 |
| 8881 | 3088 |
| 8882 | 3088 |
| 8883 | 3088 |
| 8884 | 3088 |
| 8885 | 3088 |
| 8886 | 3088 |
| 8887 | 3088 |
| 8888 | 3088 |
| 8889 | 3088 |
| 8890 | 3088 |
| 8891 | 3088 |
| 8892 | 3088 |
| 8893 | 3088 |
| 8894 | 3056 |
| 8895 | 3056 |
| 8896 | 3056 |
| 8897 | 3056 |
| 8898 | 3056 |
| 8899 | 3056 |
| 8900 | 3056 |
| 8901 | 3056 |
| 8902 | 3056 |
| 8903 | 3056 |
| 8904 | 3056 |
| 8905 | 3056 |
| 8906 | 3056 |
| 8907 | 3056 |
| 8908 | 3056 |
| 8909 | 3056 |
| 8910 | 3056 |
| 8911 | 3056 |
| 8912 | 3056 |
| 8913 | 3056 |
| 8914 | 3056 |
| 8915 | 3056 |
| 8916 | 3056 |
| 8917 | 3056 |
| 8918 | 3056 |
| 8919 | 3056 |
| 8920 | 3056 |
| 8921 | 3056 |
| 8922 | 3056 |
| 8923 | 3056 |
| 8924 | 3056 |
| 8925 | 3056 |
| 8926 | 3056 |
| 8927 | 3056 |
| 8928 | 3056 |
| 8929 | 3056 |
| 8930 | 3056 |
| 8931 | 3056 |
| 8932 | 3056 |
| 8933 | 3056 |
| 8934 | 3056 |
| 8935 | 3056 |
| 8936 | 3056 |
| 8937 | 3056 |
| 8938 | 3056 |
| 8939 | 3056 |
| 8940 | 3056 |
| 8941 | 3056 |
| 8942 | 3024 |
| 8943 | 3024 |
| 8944 | 3024 |
| 8945 | 3024 |
| 8946 | 3024 |
| 8947 | 3024 |
| 8948 | 3024 |
| 8949 | 3024 |
| 8950 | 3024 |
| 8951 | 3024 |
| 8952 | 3024 |
| 8953 | 3024 |
| 8954 | 3024 |
| 8955 | 3024 |
| 8956 | 3024 |
| 8957 | 3024 |
| 8958 | 3024 |
| 8959 | 3024 |
| 8960 | 3024 |
| 8961 | 3024 |
| 8962 | 3024 |
| 8963 | 3024 |
| 8964 | 3024 |
| 8965 | 3024 |
| 8966 | 3024 |
| 8967 | 3024 |
| 8968 | 3024 |
| 8969 | 3024 |
| 8970 | 3024 |
| 8971 | 3024 |
| 8972 | 3024 |
| 8973 | 3024 |
| 8974 | 3024 |
| 8975 | 3024 |
| 8976 | 3024 |
| 8977 | 3024 |
| 8978 | 3024 |
| 8979 | 3024 |
| 8980 | 3024 |
| 8981 | 3024 |
| 8982 | 3024 |
| 8983 | 3024 |
| 8984 | 3024 |
| 8985 | 3024 |
| 8986 | 3024 |
| 8987 | 3024 |
| 8988 | 3024 |
| 8989 | 3024 |
| 8990 | 3056 |
| 8991 | 3056 |
| 8992 | 3056 |
| 8993 | 3056 |
| 8994 | 3056 |
| 8995 | 3056 |
| 8996 | 3056 |
| 8997 | 3056 |
| 8998 | 3056 |
| 8999 | 3056 |
| 9000 | 3056 |
| 9001 | 3056 |
| 9002 | 3056 |
| 9003 | 3056 |
| 9004 | 3056 |
| 9005 | 3056 |
| 9006 | 3056 |
| 9007 | 3056 |
| 9008 | 3056 |
| 9009 | 3056 |
| 9010 | 3056 |
| 9011 | 3056 |
| 9012 | 3056 |
| 9013 | 3056 |
| 9014 | 3056 |
| 9015 | 3056 |
| 9016 | 3056 |
| 9017 | 3056 |
| 9018 | 3056 |
| 9019 | 3056 |
| 9020 | 3056 |
| 9021 | 3056 |
| 9022 | 3056 |
| 9023 | 3056 |
| 9024 | 3056 |
| 9025 | 3056 |
| 9026 | 3056 |
| 9027 | 3056 |
| 9028 | 3056 |
| 9029 | 3056 |
| 9030 | 3056 |
| 9031 | 3056 |
| 9032 | 3056 |
| 9033 | 3056 |
| 9034 | 3056 |
| 9035 | 3056 |
| 9036 | 3056 |
| 9037 | 3056 |
| 9038 | 3024 |
| 9039 | 3024 |
| 9040 | 3024 |
| 9041 | 3024 |
| 9042 | 3024 |
| 9043 | 3024 |
| 9044 | 3024 |
| 9045 | 3024 |
| 9046 | 3024 |
| 9047 | 3024 |
| 9048 | 3024 |
| 9049 | 3024 |
| 9050 | 3024 |
| 9051 | 3024 |
| 9052 | 3024 |
| 9053 | 3024 |
| 9054 | 3024 |
| 9055 | 3024 |
| 9056 | 3024 |
| 9057 | 3024 |
| 9058 | 3024 |
| 9059 | 3024 |
| 9060 | 3024 |
| 9061 | 3024 |
| 9062 | 3024 |
| 9063 | 3024 |
| 9064 | 3024 |
| 9065 | 3024 |
| 9066 | 3024 |
| 9067 | 3024 |
| 9068 | 3024 |
| 9069 | 3024 |
| 9070 | 3024 |
| 9071 | 3024 |
| 9072 | 3024 |
| 9073 | 3024 |
| 9074 | 3024 |
| 9075 | 3024 |
| 9076 | 3024 |
| 9077 | 3024 |
| 9078 | 3024 |
| 9079 | 3024 |
| 9080 | 3024 |
| 9081 | 3024 |
| 9082 | 3024 |
| 9083 | 3024 |
| 9084 | 3024 |
| 9085 | 3024 |
| 9086 | 3024 |
| 9087 | 3052 |
| 9088 | 3052 |
| 9089 | 3052 |
| 9090 | 3052 |
| 9091 | 3052 |
| 9092 | 3052 |
| 9093 | 3052 |
| 9094 | 3052 |
| 9095 | 3052 |
| 9096 | 3052 |
| 9097 | 3052 |
| 9098 | 3052 |
| 9099 | 3052 |
| 9100 | 3052 |
| 9101 | 3052 |
| 9102 | 3052 |
| 9103 | 3052 |
| 9104 | 3052 |
| 9105 | 3052 |
| 9106 | 3052 |
| 9107 | 3052 |
| 9108 | 3052 |
| 9109 | 3052 |
| 9110 | 3052 |
| 9111 | 3052 |
| 9112 | 3052 |
| 9113 | 3052 |
| 9114 | 3052 |
| 9115 | 3052 |
| 9116 | 3052 |
| 9117 | 3052 |
| 9118 | 3052 |
| 9119 | 3052 |
| 9120 | 3052 |
| 9121 | 3052 |
| 9122 | 3052 |
| 9123 | 3052 |
| 9124 | 3052 |
| 9125 | 3052 |
| 9126 | 3052 |
| 9127 | 3052 |
| 9128 | 3052 |
| 9129 | 3052 |
| 9130 | 3052 |
| 9131 | 3052 |
| 9132 | 3052 |
| 9133 | 3052 |
| 9134 | 3052 |
| 9135 | 3280 |
| 9136 | 3280 |
| 9137 | 3280 |
| 9138 | 3280 |
| 9139 | 3280 |
| 9140 | 3280 |
| 9141 | 3280 |
| 9142 | 3280 |
| 9143 | 3280 |
| 9144 | 3280 |
| 9145 | 3280 |
| 9146 | 3280 |
| 9147 | 3280 |
| 9148 | 3280 |
| 9149 | 3280 |
| 9150 | 3280 |
| 9151 | 3280 |
| 9152 | 3280 |
| 9153 | 3280 |
| 9154 | 3280 |
| 9155 | 3280 |
| 9156 | 3280 |
| 9157 | 3280 |
| 9158 | 3280 |
| 9159 | 3280 |
| 9160 | 3280 |
| 9161 | 3280 |
| 9162 | 3280 |
| 9163 | 3280 |
| 9164 | 3280 |
| 9165 | 3280 |
| 9166 | 3280 |
| 9167 | 3280 |
| 9168 | 3280 |
| 9169 | 3280 |
| 9170 | 3280 |
| 9171 | 3280 |
| 9172 | 3280 |
| 9173 | 3280 |
| 9174 | 3280 |
| 9175 | 3280 |
| 9176 | 3280 |
| 9177 | 3280 |
| 9178 | 3280 |
| 9179 | 3280 |
| 9180 | 3280 |
| 9181 | 3280 |
| 9182 | 3280 |
| 9183 | 3048 |
| 9184 | 3048 |
| 9185 | 3048 |
| 9186 | 3048 |
| 9187 | 3048 |
| 9188 | 3048 |
| 9189 | 3048 |
| 9190 | 3048 |
| 9191 | 3048 |
| 9192 | 3048 |
| 9193 | 3048 |
| 9194 | 3048 |
| 9195 | 3048 |
| 9196 | 3048 |
| 9197 | 3048 |
| 9198 | 3048 |
| 9199 | 3048 |
| 9200 | 3048 |
| 9201 | 3048 |
| 9202 | 3048 |
| 9203 | 3048 |
| 9204 | 3048 |
| 9205 | 3048 |
| 9206 | 3048 |
| 9207 | 3048 |
| 9208 | 3048 |
| 9209 | 3048 |
| 9210 | 3048 |
| 9211 | 3048 |
| 9212 | 3048 |
| 9213 | 3048 |
| 9214 | 3048 |
| 9215 | 3048 |
| 9216 | 3048 |
| 9217 | 3048 |
| 9218 | 3048 |
| 9219 | 3048 |
| 9220 | 3048 |
| 9221 | 3048 |
| 9222 | 3048 |
| 9223 | 3048 |
| 9224 | 3048 |
| 9225 | 3048 |
| 9226 | 3048 |
| 9227 | 3048 |
| 9228 | 3048 |
| 9229 | 3048 |
| 9230 | 3048 |
| 9231 | 3048 |
| 9232 | 3056 |
| 9233 | 3056 |
| 9234 | 3056 |
| 9235 | 3056 |
| 9236 | 3056 |
| 9237 | 3056 |
| 9238 | 3056 |
| 9239 | 3056 |
| 9240 | 3056 |
| 9241 | 3056 |
| 9242 | 3056 |
| 9243 | 3056 |
| 9244 | 3056 |
| 9245 | 3056 |
| 9246 | 3056 |
| 9247 | 3056 |
| 9248 | 3056 |
| 9249 | 3056 |
| 9250 | 3056 |
| 9251 | 3056 |
| 9252 | 3056 |
| 9253 | 3056 |
| 9254 | 3056 |
| 9255 | 3056 |
| 9256 | 3056 |
| 9257 | 3056 |
| 9258 | 3056 |
| 9259 | 3056 |
| 9260 | 3056 |
| 9261 | 3056 |
| 9262 | 3056 |
| 9263 | 3056 |
| 9264 | 3056 |
| 9265 | 3056 |
| 9266 | 3056 |
| 9267 | 3056 |
| 9268 | 3056 |
| 9269 | 3056 |
| 9270 | 3056 |
| 9271 | 3056 |
| 9272 | 3056 |
| 9273 | 3056 |
| 9274 | 3056 |
| 9275 | 3056 |
| 9276 | 3056 |
| 9277 | 3056 |
| 9278 | 3056 |
| 9279 | 3056 |
| 9280 | 3048 |
| 9281 | 3048 |
| 9282 | 3048 |
| 9283 | 3048 |
| 9284 | 3048 |
| 9285 | 3048 |
| 9286 | 3048 |
| 9287 | 3048 |
| 9288 | 3048 |
| 9289 | 3048 |
| 9290 | 3048 |
| 9291 | 3048 |
| 9292 | 3048 |
| 9293 | 3048 |
| 9294 | 3048 |
| 9295 | 3048 |
| 9296 | 3048 |
| 9297 | 3048 |
| 9298 | 3048 |
| 9299 | 3048 |
| 9300 | 3048 |
| 9301 | 3048 |
| 9302 | 3048 |
| 9303 | 3048 |
| 9304 | 3048 |
| 9305 | 3048 |
| 9306 | 3048 |
| 9307 | 3048 |
| 9308 | 3048 |
| 9309 | 3048 |
| 9310 | 3048 |
| 9311 | 3048 |
| 9312 | 3048 |
| 9313 | 3048 |
| 9314 | 3048 |
| 9315 | 3048 |
| 9316 | 3048 |
| 9317 | 3048 |
| 9318 | 3048 |
| 9319 | 3048 |
| 9320 | 3048 |
| 9321 | 3048 |
| 9322 | 3048 |
| 9323 | 3048 |
| 9324 | 3048 |
| 9325 | 3048 |
| 9326 | 3048 |
| 9327 | 3048 |
| 9328 | 3068 |
| 9329 | 3068 |
| 9330 | 3068 |
| 9331 | 3068 |
| 9332 | 3068 |
| 9333 | 3068 |
| 9334 | 3068 |
| 9335 | 3068 |
| 9336 | 3068 |
| 9337 | 3068 |
| 9338 | 3068 |
| 9339 | 3068 |
| 9340 | 3068 |
| 9341 | 3068 |
| 9342 | 3068 |
| 9343 | 3068 |
| 9344 | 3068 |
| 9345 | 3068 |
| 9346 | 3068 |
| 9347 | 3068 |
| 9348 | 3068 |
| 9349 | 3068 |
| 9350 | 3068 |
| 9351 | 3068 |
| 9352 | 3068 |
| 9353 | 3068 |
| 9354 | 3068 |
| 9355 | 3068 |
| 9356 | 3068 |
| 9357 | 3068 |
| 9358 | 3068 |
| 9359 | 3068 |
| 9360 | 3068 |
| 9361 | 3068 |
| 9362 | 3068 |
| 9363 | 3068 |
| 9364 | 3068 |
| 9365 | 3068 |
| 9366 | 3068 |
| 9367 | 3068 |
| 9368 | 3068 |
| 9369 | 3068 |
| 9370 | 3068 |
| 9371 | 3068 |
| 9372 | 3068 |
| 9373 | 3068 |
| 9374 | 3068 |
| 9375 | 3068 |
| 9376 | 3052 |
| 9377 | 3052 |
| 9378 | 3052 |
| 9379 | 3052 |
| 9380 | 3052 |
| 9381 | 3052 |
| 9382 | 3052 |
| 9383 | 3052 |
| 9384 | 3052 |
| 9385 | 3052 |
| 9386 | 3052 |
| 9387 | 3052 |
| 9388 | 3052 |
| 9389 | 3052 |
| 9390 | 3052 |
| 9391 | 3052 |
| 9392 | 3052 |
| 9393 | 3052 |
| 9394 | 3052 |
| 9395 | 3052 |
| 9396 | 3052 |
| 9397 | 3052 |
| 9398 | 3052 |
| 9399 | 3052 |
| 9400 | 3052 |
| 9401 | 3052 |
| 9402 | 3052 |
| 9403 | 3052 |
| 9404 | 3052 |
| 9405 | 3052 |
| 9406 | 3052 |
| 9407 | 3052 |
| 9408 | 3052 |
| 9409 | 3052 |
| 9410 | 3052 |
| 9411 | 3052 |
| 9412 | 3052 |
| 9413 | 3052 |
| 9414 | 3052 |
| 9415 | 3052 |
| 9416 | 3052 |
| 9417 | 3052 |
| 9418 | 3052 |
| 9419 | 3052 |
| 9420 | 3052 |
| 9421 | 3052 |
| 9422 | 3052 |
| 9423 | 3052 |
| 9424 | 3052 |
| 9425 | 3048 |
| 9426 | 3048 |
| 9427 | 3048 |
| 9428 | 3048 |
| 9429 | 3048 |
| 9430 | 3048 |
| 9431 | 3048 |
| 9432 | 3048 |
| 9433 | 3048 |
| 9434 | 3048 |
| 9435 | 3048 |
| 9436 | 3048 |
| 9437 | 3048 |
| 9438 | 3048 |
| 9439 | 3048 |
| 9440 | 3048 |
| 9441 | 3048 |
| 9442 | 3048 |
| 9443 | 3048 |
| 9444 | 3048 |
| 9445 | 3048 |
| 9446 | 3048 |
| 9447 | 3048 |
| 9448 | 3048 |
| 9449 | 3048 |
| 9450 | 3048 |
| 9451 | 3048 |
| 9452 | 3048 |
| 9453 | 3048 |
| 9454 | 3048 |
| 9455 | 3048 |
| 9456 | 3048 |
| 9457 | 3048 |
| 9458 | 3048 |
| 9459 | 3048 |
| 9460 | 3048 |
| 9461 | 3048 |
| 9462 | 3048 |
| 9463 | 3048 |
| 9464 | 3048 |
| 9465 | 3048 |
| 9466 | 3048 |
| 9467 | 3048 |
| 9468 | 3048 |
| 9469 | 3048 |
| 9470 | 3048 |
| 9471 | 3048 |
| 9472 | 3048 |
| 9473 | 3080 |
| 9474 | 3080 |
| 9475 | 3080 |
| 9476 | 3080 |
| 9477 | 3080 |
| 9478 | 3080 |
| 9479 | 3080 |
| 9480 | 3080 |
| 9481 | 3080 |
| 9482 | 3080 |
| 9483 | 3080 |
| 9484 | 3080 |
| 9485 | 3080 |
| 9486 | 3080 |
| 9487 | 3080 |
| 9488 | 3080 |
| 9489 | 3080 |
| 9490 | 3080 |
| 9491 | 3080 |
| 9492 | 3080 |
| 9493 | 3080 |
| 9494 | 3080 |
| 9495 | 3080 |
| 9496 | 3080 |
| 9497 | 3080 |
| 9498 | 3080 |
| 9499 | 3080 |
| 9500 | 3080 |
| 9501 | 3080 |
| 9502 | 3080 |
| 9503 | 3080 |
| 9504 | 3080 |
| 9505 | 3080 |
| 9506 | 3080 |
| 9507 | 3080 |
| 9508 | 3080 |
| 9509 | 3080 |
| 9510 | 3080 |
| 9511 | 3080 |
| 9512 | 3080 |
| 9513 | 3080 |
| 9514 | 3080 |
| 9515 | 3080 |
| 9516 | 3080 |
| 9517 | 3080 |
| 9518 | 3080 |
| 9519 | 3080 |
| 9520 | 3080 |
| 9521 | 3068 |
| 9522 | 3068 |
| 9523 | 3068 |
| 9524 | 3068 |
| 9525 | 3068 |
| 9526 | 3068 |
| 9527 | 3068 |
| 9528 | 3068 |
| 9529 | 3068 |
| 9530 | 3068 |
| 9531 | 3068 |
| 9532 | 3068 |
| 9533 | 3068 |
| 9534 | 3068 |
| 9535 | 3068 |
| 9536 | 3068 |
| 9537 | 3068 |
| 9538 | 3068 |
| 9539 | 3068 |
| 9540 | 3068 |
| 9541 | 3068 |
| 9542 | 3068 |
| 9543 | 3068 |
| 9544 | 3068 |
| 9545 | 3068 |
| 9546 | 3068 |
| 9547 | 3068 |
| 9548 | 3068 |
| 9549 | 3068 |
| 9550 | 3068 |
| 9551 | 3068 |
| 9552 | 3068 |
| 9553 | 3068 |
| 9554 | 3068 |
| 9555 | 3068 |
| 9556 | 3068 |
| 9557 | 3068 |
| 9558 | 3068 |
| 9559 | 3068 |
| 9560 | 3068 |
| 9561 | 3068 |
| 9562 | 3068 |
| 9563 | 3068 |
| 9564 | 3068 |
| 9565 | 3068 |
| 9566 | 3068 |
| 9567 | 3068 |
| 9568 | 3068 |
| 9569 | 3052 |
| 9570 | 3052 |
| 9571 | 3052 |
| 9572 | 3052 |
| 9573 | 3052 |
| 9574 | 3052 |
| 9575 | 3052 |
| 9576 | 3052 |
| 9577 | 3052 |
| 9578 | 3052 |
| 9579 | 3052 |
| 9580 | 3052 |
| 9581 | 3052 |
| 9582 | 3052 |
| 9583 | 3052 |
| 9584 | 3052 |
| 9585 | 3052 |
| 9586 | 3052 |
| 9587 | 3052 |
| 9588 | 3052 |
| 9589 | 3052 |
| 9590 | 3052 |
| 9591 | 3052 |
| 9592 | 3052 |
| 9593 | 3052 |
| 9594 | 3052 |
| 9595 | 3052 |
| 9596 | 3052 |
| 9597 | 3052 |
| 9598 | 3052 |
| 9599 | 3052 |
| 9600 | 3052 |
| 9601 | 3052 |
| 9602 | 3052 |
| 9603 | 3052 |
| 9604 | 3052 |
| 9605 | 3052 |
| 9606 | 3052 |
| 9607 | 3052 |
| 9608 | 3052 |
| 9609 | 3052 |
| 9610 | 3052 |
| 9611 | 3052 |
| 9612 | 3052 |
| 9613 | 3052 |
| 9614 | 3052 |
| 9615 | 3052 |
| 9616 | 3052 |
| 9617 | 3052 |
| 9618 | 3068 |
| 9619 | 3068 |
| 9620 | 3068 |
| 9621 | 3068 |
| 9622 | 3068 |
| 9623 | 3068 |
| 9624 | 3068 |
| 9625 | 3068 |
| 9626 | 3068 |
| 9627 | 3068 |
| 9628 | 3068 |
| 9629 | 3068 |
| 9630 | 3068 |
| 9631 | 3068 |
| 9632 | 3068 |
| 9633 | 3068 |
| 9634 | 3068 |
| 9635 | 3068 |
| 9636 | 3068 |
| 9637 | 3068 |
| 9638 | 3068 |
| 9639 | 3068 |
| 9640 | 3068 |
| 9641 | 3068 |
| 9642 | 3068 |
| 9643 | 3068 |
| 9644 | 3068 |
| 9645 | 3068 |
| 9646 | 3068 |
| 9647 | 3068 |
| 9648 | 3068 |
| 9649 | 3068 |
| 9650 | 3068 |
| 9651 | 3068 |
| 9652 | 3068 |
| 9653 | 3068 |
| 9654 | 3068 |
| 9655 | 3068 |
| 9656 | 3068 |
| 9657 | 3068 |
| 9658 | 3068 |
| 9659 | 3068 |
| 9660 | 3068 |
| 9661 | 3068 |
| 9662 | 3068 |
| 9663 | 3068 |
| 9664 | 3068 |
| 9665 | 3068 |
| 9666 | 3300 |
| 9667 | 3300 |
| 9668 | 3300 |
| 9669 | 3300 |
| 9670 | 3300 |
| 9671 | 3300 |
| 9672 | 3300 |
| 9673 | 3300 |
| 9674 | 3300 |
| 9675 | 3300 |
| 9676 | 3300 |
| 9677 | 3300 |
| 9678 | 3300 |
| 9679 | 3300 |
| 9680 | 3300 |
| 9681 | 3300 |
| 9682 | 3300 |
| 9683 | 3300 |
| 9684 | 3300 |
| 9685 | 3300 |
| 9686 | 3300 |
| 9687 | 3300 |
| 9688 | 3300 |
| 9689 | 3300 |
| 9690 | 3300 |
| 9691 | 3300 |
| 9692 | 3300 |
| 9693 | 3300 |
| 9694 | 3300 |
| 9695 | 3300 |
| 9696 | 3300 |
| 9697 | 3300 |
| 9698 | 3300 |
| 9699 | 3300 |
| 9700 | 3300 |
| 9701 | 3300 |
| 9702 | 3300 |
| 9703 | 3300 |
| 9704 | 3300 |
| 9705 | 3300 |
| 9706 | 3300 |
| 9707 | 3300 |
| 9708 | 3300 |
| 9709 | 3300 |
| 9710 | 3300 |
| 9711 | 3300 |
| 9712 | 3300 |
| 9713 | 3300 |
| 9714 | 3056 |
| 9715 | 3056 |
| 9716 | 3056 |
| 9717 | 3056 |
| 9718 | 3056 |
| 9719 | 3056 |
| 9720 | 3056 |
| 9721 | 3056 |
| 9722 | 3056 |
| 9723 | 3056 |
| 9724 | 3056 |
| 9725 | 3056 |
| 9726 | 3056 |
| 9727 | 3056 |
| 9728 | 3056 |
| 9729 | 3056 |
| 9730 | 3056 |
| 9731 | 3056 |
| 9732 | 3056 |
| 9733 | 3056 |
| 9734 | 3056 |
| 9735 | 3056 |
| 9736 | 3056 |
| 9737 | 3056 |
| 9738 | 3056 |
| 9739 | 3056 |
| 9740 | 3056 |
| 9741 | 3056 |
| 9742 | 3056 |
| 9743 | 3056 |
| 9744 | 3056 |
| 9745 | 3056 |
| 9746 | 3056 |
| 9747 | 3056 |
| 9748 | 3056 |
| 9749 | 3056 |
| 9750 | 3056 |
| 9751 | 3056 |
| 9752 | 3056 |
| 9753 | 3056 |
| 9754 | 3056 |
| 9755 | 3056 |
| 9756 | 3056 |
| 9757 | 3056 |
| 9758 | 3056 |
| 9759 | 3056 |
| 9760 | 3056 |
| 9761 | 3056 |
| 9762 | 3056 |
| 9763 | 3056 |
| 9764 | 3056 |
| 9765 | 3056 |
| 9766 | 3056 |
| 9767 | 3056 |
| 9768 | 3056 |
| 9769 | 3056 |
| 9770 | 3056 |
| 9771 | 3056 |
| 9772 | 3056 |
| 9773 | 3056 |
| 9774 | 3056 |
| 9775 | 3056 |
| 9776 | 3056 |
| 9777 | 3056 |
| 9778 | 3056 |
| 9779 | 3056 |
| 9780 | 3056 |
| 9781 | 3056 |
| 9782 | 3056 |
| 9783 | 3056 |
| 9784 | 3056 |
| 9785 | 3056 |
| 9786 | 3056 |
| 9787 | 3056 |
| 9788 | 3056 |
| 9789 | 3056 |
| 9790 | 3056 |
| 9791 | 3056 |
| 9792 | 3056 |
| 9793 | 3056 |
| 9794 | 3056 |
| 9795 | 3056 |
| 9796 | 3056 |
| 9797 | 3056 |
| 9798 | 3056 |
| 9799 | 3056 |
| 9800 | 3056 |
| 9801 | 3056 |
| 9802 | 3056 |
| 9803 | 3056 |
| 9804 | 3056 |
| 9805 | 3056 |
| 9806 | 3056 |
| 9807 | 3056 |
| 9808 | 3056 |
| 9809 | 3056 |
| 9810 | 3064 |
| 9811 | 3064 |
| 9812 | 3064 |
| 9813 | 3064 |
| 9814 | 3064 |
| 9815 | 3064 |
| 9816 | 3064 |
| 9817 | 3064 |
| 9818 | 3064 |
| 9819 | 3064 |
| 9820 | 3064 |
| 9821 | 3064 |
| 9822 | 3064 |
| 9823 | 3064 |
| 9824 | 3064 |
| 9825 | 3064 |
| 9826 | 3064 |
| 9827 | 3064 |
| 9828 | 3064 |
| 9829 | 3064 |
| 9830 | 3064 |
| 9831 | 3064 |
| 9832 | 3064 |
| 9833 | 3064 |
| 9834 | 3064 |
| 9835 | 3064 |
| 9836 | 3064 |
| 9837 | 3064 |
| 9838 | 3064 |
| 9839 | 3064 |
| 9840 | 3064 |
| 9841 | 3064 |
| 9842 | 3064 |
| 9843 | 3064 |
| 9844 | 3064 |
| 9845 | 3064 |
| 9846 | 3064 |
| 9847 | 3064 |
| 9848 | 3064 |
| 9849 | 3064 |
| 9850 | 3064 |
| 9851 | 3064 |
| 9852 | 3064 |
| 9853 | 3064 |
| 9854 | 3064 |
| 9855 | 3064 |
| 9856 | 3064 |
| 9857 | 3064 |
| 9858 | 3064 |
| 9859 | 3056 |
| 9860 | 3056 |
| 9861 | 3056 |
| 9862 | 3056 |
| 9863 | 3056 |
| 9864 | 3056 |
| 9865 | 3056 |
| 9866 | 3056 |
| 9867 | 3056 |
| 9868 | 3056 |
| 9869 | 3056 |
| 9870 | 3056 |
| 9871 | 3056 |
| 9872 | 3056 |
| 9873 | 3056 |
| 9874 | 3056 |
| 9875 | 3056 |
| 9876 | 3056 |
| 9877 | 3056 |
| 9878 | 3056 |
| 9879 | 3056 |
| 9880 | 3056 |
| 9881 | 3056 |
| 9882 | 3056 |
| 9883 | 3056 |
| 9884 | 3056 |
| 9885 | 3056 |
| 9886 | 3056 |
| 9887 | 3056 |
| 9888 | 3056 |
| 9889 | 3056 |
| 9890 | 3056 |
| 9891 | 3056 |
| 9892 | 3056 |
| 9893 | 3056 |
| 9894 | 3056 |
| 9895 | 3056 |
| 9896 | 3056 |
| 9897 | 3056 |
| 9898 | 3056 |
| 9899 | 3056 |
| 9900 | 3056 |
| 9901 | 3056 |
| 9902 | 3056 |
| 9903 | 3056 |
| 9904 | 3056 |
| 9905 | 3056 |
| 9906 | 3056 |
| 9907 | 3048 |
| 9908 | 3048 |
| 9909 | 3048 |
| 9910 | 3048 |
| 9911 | 3048 |
| 9912 | 3048 |
| 9913 | 3048 |
| 9914 | 3048 |
| 9915 | 3048 |
| 9916 | 3048 |
| 9917 | 3048 |
| 9918 | 3048 |
| 9919 | 3048 |
| 9920 | 3048 |
| 9921 | 3048 |
| 9922 | 3048 |
| 9923 | 3048 |
| 9924 | 3048 |
| 9925 | 3048 |
| 9926 | 3048 |
| 9927 | 3048 |
| 9928 | 3048 |
| 9929 | 3048 |
| 9930 | 3048 |
| 9931 | 3048 |
| 9932 | 3048 |
| 9933 | 3048 |
| 9934 | 3048 |
| 9935 | 3048 |
| 9936 | 3048 |
| 9937 | 3048 |
| 9938 | 3048 |
| 9939 | 3048 |
| 9940 | 3048 |
| 9941 | 3048 |
| 9942 | 3048 |
| 9943 | 3048 |
| 9944 | 3048 |
| 9945 | 3048 |
| 9946 | 3048 |
| 9947 | 3048 |
| 9948 | 3048 |
| 9949 | 3048 |
| 9950 | 3048 |
| 9951 | 3048 |
| 9952 | 3048 |
| 9953 | 3048 |
| 9954 | 3048 |
| 9955 | 3064 |
| 9956 | 3064 |
| 9957 | 3064 |
| 9958 | 3064 |
| 9959 | 3064 |
| 9960 | 3064 |
| 9961 | 3064 |
| 9962 | 3064 |
| 9963 | 3064 |
| 9964 | 3064 |
| 9965 | 3064 |
| 9966 | 3064 |
| 9967 | 3064 |
| 9968 | 3064 |
| 9969 | 3064 |
| 9970 | 3064 |
| 9971 | 3064 |
| 9972 | 3064 |
| 9973 | 3064 |
| 9974 | 3064 |
| 9975 | 3064 |
| 9976 | 3064 |
| 9977 | 3064 |
| 9978 | 3064 |
| 9979 | 3064 |
| 9980 | 3064 |
| 9981 | 3064 |
| 9982 | 3064 |
| 9983 | 3064 |
| 9984 | 3064 |
| 9985 | 3064 |
| 9986 | 3064 |
| 9987 | 3064 |
| 9988 | 3064 |
| 9989 | 3064 |
| 9990 | 3064 |
| 9991 | 3064 |
| 9992 | 3064 |
| 9993 | 3064 |
| 9994 | 3064 |
| 9995 | 3064 |
| 9996 | 3064 |
| 9997 | 3064 |
| 9998 | 3064 |
| 9999 | 3064 |
| 10000 | 3064 |
| 10001 | 3064 |
| 10002 | 3064 |
| 10003 | 3032 |
| 10004 | 3032 |
| 10005 | 3032 |
| 10006 | 3032 |
| 10007 | 3032 |
| 10008 | 3032 |
| 10009 | 3032 |
| 10010 | 3032 |
| 10011 | 3032 |
| 10012 | 3032 |
| 10013 | 3032 |
| 10014 | 3032 |
| 10015 | 3032 |
| 10016 | 3032 |
| 10017 | 3032 |
| 10018 | 3032 |
| 10019 | 3032 |
| 10020 | 3032 |
| 10021 | 3032 |
| 10022 | 3032 |
| 10023 | 3032 |
| 10024 | 3032 |
| 10025 | 3032 |
| 10026 | 3032 |
| 10027 | 3032 |
| 10028 | 3032 |
| 10029 | 3032 |
| 10030 | 3032 |
| 10031 | 3032 |
| 10032 | 3032 |
| 10033 | 3032 |
| 10034 | 3032 |
| 10035 | 3032 |
| 10036 | 3032 |
| 10037 | 3032 |
| 10038 | 3032 |
| 10039 | 3032 |
| 10040 | 3032 |
| 10041 | 3032 |
| 10042 | 3032 |
| 10043 | 3032 |
| 10044 | 3032 |
| 10045 | 3032 |
| 10046 | 3032 |
| 10047 | 3032 |
| 10048 | 3032 |
| 10049 | 3032 |
| 10050 | 3032 |
| 10051 | 3040 |
| 10052 | 3040 |
| 10053 | 3040 |
| 10054 | 3040 |
| 10055 | 3040 |
| 10056 | 3040 |
| 10057 | 3040 |
| 10058 | 3040 |
| 10059 | 3040 |
| 10060 | 3040 |
| 10061 | 3040 |
| 10062 | 3040 |
| 10063 | 3040 |
| 10064 | 3040 |
| 10065 | 3040 |
| 10066 | 3040 |
| 10067 | 3040 |
| 10068 | 3040 |
| 10069 | 3040 |
| 10070 | 3040 |
| 10071 | 3040 |
| 10072 | 3040 |
| 10073 | 3040 |
| 10074 | 3040 |
| 10075 | 3040 |
| 10076 | 3040 |
| 10077 | 3040 |
| 10078 | 3040 |
| 10079 | 3040 |
| 10080 | 3040 |
| 10081 | 3040 |
| 10082 | 3040 |
| 10083 | 3040 |
| 10084 | 3040 |
| 10085 | 3040 |
| 10086 | 3040 |
| 10087 | 3040 |
| 10088 | 3040 |
| 10089 | 3040 |
| 10090 | 3040 |
| 10091 | 3040 |
| 10092 | 3040 |
| 10093 | 3040 |
| 10094 | 3040 |
| 10095 | 3040 |
| 10096 | 3040 |
| 10097 | 3040 |
| 10098 | 3040 |
| 10099 | 3064 |
| 10100 | 3064 |
| 10101 | 3064 |
| 10102 | 3064 |
| 10103 | 3064 |
| 10104 | 3064 |
| 10105 | 3064 |
| 10106 | 3064 |
| 10107 | 3064 |
| 10108 | 3064 |
| 10109 | 3064 |
| 10110 | 3064 |
| 10111 | 3064 |
| 10112 | 3064 |
| 10113 | 3064 |
| 10114 | 3064 |
| 10115 | 3064 |
| 10116 | 3064 |
| 10117 | 3064 |
| 10118 | 3064 |
| 10119 | 3064 |
| 10120 | 3064 |
| 10121 | 3064 |
| 10122 | 3064 |
| 10123 | 3064 |
| 10124 | 3064 |
| 10125 | 3064 |
| 10126 | 3064 |
| 10127 | 3064 |
| 10128 | 3064 |
| 10129 | 3064 |
| 10130 | 3064 |
| 10131 | 3064 |
| 10132 | 3064 |
| 10133 | 3064 |
| 10134 | 3064 |
| 10135 | 3064 |
| 10136 | 3064 |
| 10137 | 3064 |
| 10138 | 3064 |
| 10139 | 3064 |
| 10140 | 3064 |
| 10141 | 3064 |
| 10142 | 3064 |
| 10143 | 3064 |
| 10144 | 3064 |
| 10145 | 3064 |
| 10146 | 3064 |
| 10147 | 3044 |
| 10148 | 3044 |
| 10149 | 3044 |
| 10150 | 3044 |
| 10151 | 3044 |
| 10152 | 3044 |
| 10153 | 3044 |
| 10154 | 3044 |
| 10155 | 3044 |
| 10156 | 3044 |
| 10157 | 3044 |
| 10158 | 3044 |
| 10159 | 3044 |
| 10160 | 3044 |
| 10161 | 3044 |
| 10162 | 3044 |
| 10163 | 3044 |
| 10164 | 3044 |
| 10165 | 3044 |
| 10166 | 3044 |
| 10167 | 3044 |
| 10168 | 3044 |
| 10169 | 3044 |
| 10170 | 3044 |
| 10171 | 3044 |
| 10172 | 3044 |
| 10173 | 3044 |
| 10174 | 3044 |
| 10175 | 3044 |
| 10176 | 3044 |
| 10177 | 3044 |
| 10178 | 3044 |
| 10179 | 3044 |
| 10180 | 3044 |
| 10181 | 3044 |
| 10182 | 3044 |
| 10183 | 3044 |
| 10184 | 3044 |
| 10185 | 3044 |
| 10186 | 3044 |
| 10187 | 3044 |
| 10188 | 3044 |
| 10189 | 3044 |
| 10190 | 3044 |
| 10191 | 3044 |
| 10192 | 3044 |
| 10193 | 3044 |
| 10194 | 3044 |
| 10195 | 3044 |
| 10196 | 3032 |
| 10197 | 3032 |
| 10198 | 3032 |
| 10199 | 3032 |
| 10200 | 3032 |
| 10201 | 3032 |
| 10202 | 3032 |
| 10203 | 3032 |
| 10204 | 3032 |
| 10205 | 3032 |
| 10206 | 3032 |
| 10207 | 3032 |
| 10208 | 3032 |
| 10209 | 3032 |
| 10210 | 3032 |
| 10211 | 3032 |
| 10212 | 3032 |
| 10213 | 3032 |
| 10214 | 3032 |
| 10215 | 3032 |
| 10216 | 3032 |
| 10217 | 3032 |
| 10218 | 3032 |
| 10219 | 3032 |
| 10220 | 3032 |
| 10221 | 3032 |
| 10222 | 3032 |
| 10223 | 3032 |
| 10224 | 3032 |
| 10225 | 3032 |
| 10226 | 3032 |
| 10227 | 3032 |
| 10228 | 3032 |
| 10229 | 3032 |
| 10230 | 3032 |
| 10231 | 3032 |
| 10232 | 3032 |
| 10233 | 3032 |
| 10234 | 3032 |
| 10235 | 3032 |
| 10236 | 3032 |
| 10237 | 3032 |
| 10238 | 3032 |
| 10239 | 3032 |
| 10240 | 3032 |
| 10241 | 3032 |
| 10242 | 3032 |
| 10243 | 3032 |
| 10244 | 3284 |
| 10245 | 3284 |
| 10246 | 3284 |
| 10247 | 3284 |
| 10248 | 3284 |
| 10249 | 3284 |
| 10250 | 3284 |
| 10251 | 3284 |
| 10252 | 3284 |
| 10253 | 3284 |
| 10254 | 3284 |
| 10255 | 3284 |
| 10256 | 3284 |
| 10257 | 3284 |
| 10258 | 3284 |
| 10259 | 3284 |
| 10260 | 3284 |
| 10261 | 3284 |
| 10262 | 3284 |
| 10263 | 3284 |
| 10264 | 3284 |
| 10265 | 3284 |
| 10266 | 3284 |
| 10267 | 3284 |
| 10268 | 3284 |
| 10269 | 3284 |
| 10270 | 3284 |
| 10271 | 3284 |
| 10272 | 3284 |
| 10273 | 3284 |
| 10274 | 3284 |
| 10275 | 3284 |
| 10276 | 3284 |
| 10277 | 3284 |
| 10278 | 3284 |
| 10279 | 3284 |
| 10280 | 3284 |
| 10281 | 3284 |
| 10282 | 3284 |
| 10283 | 3284 |
| 10284 | 3284 |
| 10285 | 3284 |
| 10286 | 3284 |
| 10287 | 3284 |
| 10288 | 3284 |
| 10289 | 3284 |
| 10290 | 3284 |
| 10291 | 3284 |
| 10292 | 3040 |
| 10293 | 3040 |
| 10294 | 3040 |
| 10295 | 3040 |
| 10296 | 3040 |
| 10297 | 3040 |
| 10298 | 3040 |
| 10299 | 3040 |
| 10300 | 3040 |
| 10301 | 3040 |
| 10302 | 3040 |
| 10303 | 3040 |
| 10304 | 3040 |
| 10305 | 3040 |
| 10306 | 3040 |
| 10307 | 3040 |
| 10308 | 3040 |
| 10309 | 3040 |
| 10310 | 3040 |
| 10311 | 3040 |
| 10312 | 3040 |
| 10313 | 3040 |
| 10314 | 3040 |
| 10315 | 3040 |
| 10316 | 3040 |
| 10317 | 3040 |
| 10318 | 3040 |
| 10319 | 3040 |
| 10320 | 3040 |
| 10321 | 3040 |
| 10322 | 3040 |
| 10323 | 3040 |
| 10324 | 3040 |
| 10325 | 3040 |
| 10326 | 3040 |
| 10327 | 3040 |
| 10328 | 3040 |
| 10329 | 3040 |
| 10330 | 3040 |
| 10331 | 3040 |
| 10332 | 3040 |
| 10333 | 3040 |
| 10334 | 3040 |
| 10335 | 3040 |
| 10336 | 3040 |
| 10337 | 3040 |
| 10338 | 3040 |
| 10339 | 3040 |
| 10340 | 3040 |
| 10341 | 3044 |
| 10342 | 3044 |
| 10343 | 3044 |
| 10344 | 3044 |
| 10345 | 3044 |
| 10346 | 3044 |
| 10347 | 3044 |
| 10348 | 3044 |
| 10349 | 3044 |
| 10350 | 3044 |
| 10351 | 3044 |
| 10352 | 3044 |
| 10353 | 3044 |
| 10354 | 3044 |
| 10355 | 3044 |
| 10356 | 3044 |
| 10357 | 3044 |
| 10358 | 3044 |
| 10359 | 3044 |
| 10360 | 3044 |
| 10361 | 3044 |
| 10362 | 3044 |
| 10363 | 3044 |
| 10364 | 3044 |
| 10365 | 3044 |
| 10366 | 3044 |
| 10367 | 3044 |
| 10368 | 3044 |
| 10369 | 3044 |
| 10370 | 3044 |
| 10371 | 3044 |
| 10372 | 3044 |
| 10373 | 3044 |
| 10374 | 3044 |
| 10375 | 3044 |
| 10376 | 3044 |
| 10377 | 3044 |
| 10378 | 3044 |
| 10379 | 3044 |
| 10380 | 3044 |
| 10381 | 3044 |
| 10382 | 3044 |
| 10383 | 3044 |
| 10384 | 3044 |
| 10385 | 3044 |
| 10386 | 3044 |
| 10387 | 3044 |
| 10388 | 3044 |
| 10389 | 3056 |
| 10390 | 3056 |
| 10391 | 3056 |
| 10392 | 3056 |
| 10393 | 3056 |
| 10394 | 3056 |
| 10395 | 3056 |
| 10396 | 3056 |
| 10397 | 3056 |
| 10398 | 3056 |
| 10399 | 3056 |
| 10400 | 3056 |
| 10401 | 3056 |
| 10402 | 3056 |
| 10403 | 3056 |
| 10404 | 3056 |
| 10405 | 3056 |
| 10406 | 3056 |
| 10407 | 3056 |
| 10408 | 3056 |
| 10409 | 3056 |
| 10410 | 3056 |
| 10411 | 3056 |
| 10412 | 3056 |
| 10413 | 3056 |
| 10414 | 3056 |
| 10415 | 3056 |
| 10416 | 3056 |
| 10417 | 3056 |
| 10418 | 3056 |
| 10419 | 3056 |
| 10420 | 3056 |
| 10421 | 3056 |
| 10422 | 3056 |
| 10423 | 3056 |
| 10424 | 3056 |
| 10425 | 3056 |
| 10426 | 3056 |
| 10427 | 3056 |
| 10428 | 3056 |
| 10429 | 3056 |
| 10430 | 3056 |
| 10431 | 3056 |
| 10432 | 3056 |
| 10433 | 3056 |
| 10434 | 3056 |
| 10435 | 3056 |
| 10436 | 3056 |
| 10437 | 3060 |
| 10438 | 3060 |
| 10439 | 3060 |
| 10440 | 3060 |
| 10441 | 3060 |
| 10442 | 3060 |
| 10443 | 3060 |
| 10444 | 3060 |
| 10445 | 3060 |
| 10446 | 3060 |
| 10447 | 3060 |
| 10448 | 3060 |
| 10449 | 3060 |
| 10450 | 3060 |
| 10451 | 3060 |
| 10452 | 3060 |
| 10453 | 3060 |
| 10454 | 3060 |
| 10455 | 3060 |
| 10456 | 3060 |
| 10457 | 3060 |
| 10458 | 3060 |
| 10459 | 3060 |
| 10460 | 3060 |
| 10461 | 3060 |
| 10462 | 3060 |
| 10463 | 3060 |
| 10464 | 3060 |
| 10465 | 3060 |
| 10466 | 3060 |
| 10467 | 3060 |
| 10468 | 3060 |
| 10469 | 3060 |
| 10470 | 3060 |
| 10471 | 3060 |
| 10472 | 3060 |
| 10473 | 3060 |
| 10474 | 3060 |
| 10475 | 3060 |
| 10476 | 3060 |
| 10477 | 3060 |
| 10478 | 3060 |
| 10479 | 3060 |
| 10480 | 3060 |
| 10481 | 3060 |
| 10482 | 3060 |
| 10483 | 3060 |
| 10484 | 3060 |
| 10485 | 3048 |
| 10486 | 3048 |
| 10487 | 3048 |
| 10488 | 3048 |
| 10489 | 3048 |
| 10490 | 3048 |
| 10491 | 3048 |
| 10492 | 3048 |
| 10493 | 3048 |
| 10494 | 3048 |
| 10495 | 3048 |
| 10496 | 3048 |
| 10497 | 3048 |
| 10498 | 3048 |
| 10499 | 3048 |
| 10500 | 3048 |
| 10501 | 3048 |
| 10502 | 3048 |
| 10503 | 3048 |
| 10504 | 3048 |
| 10505 | 3048 |
| 10506 | 3048 |
| 10507 | 3048 |
| 10508 | 3048 |
| 10509 | 3048 |
| 10510 | 3048 |
| 10511 | 3048 |
| 10512 | 3048 |
| 10513 | 3048 |
| 10514 | 3048 |
| 10515 | 3048 |
| 10516 | 3048 |
| 10517 | 3048 |
| 10518 | 3048 |
| 10519 | 3048 |
| 10520 | 3048 |
| 10521 | 3048 |
| 10522 | 3048 |
| 10523 | 3048 |
| 10524 | 3048 |
| 10525 | 3048 |
| 10526 | 3048 |
| 10527 | 3048 |
| 10528 | 3048 |
| 10529 | 3048 |
| 10530 | 3048 |
| 10531 | 3048 |
| 10532 | 3048 |
| 10533 | 3040 |
| 10534 | 3040 |
| 10535 | 3040 |
| 10536 | 3040 |
| 10537 | 3040 |
| 10538 | 3040 |
| 10539 | 3040 |
| 10540 | 3040 |
| 10541 | 3040 |
| 10542 | 3040 |
| 10543 | 3040 |
| 10544 | 3040 |
| 10545 | 3040 |
| 10546 | 3040 |
| 10547 | 3040 |
| 10548 | 3040 |
| 10549 | 3040 |
| 10550 | 3040 |
| 10551 | 3040 |
| 10552 | 3040 |
| 10553 | 3040 |
| 10554 | 3040 |
| 10555 | 3040 |
| 10556 | 3040 |
| 10557 | 3040 |
| 10558 | 3040 |
| 10559 | 3040 |
| 10560 | 3040 |
| 10561 | 3040 |
| 10562 | 3040 |
| 10563 | 3040 |
| 10564 | 3040 |
| 10565 | 3040 |
| 10566 | 3040 |
| 10567 | 3040 |
| 10568 | 3040 |
| 10569 | 3040 |
| 10570 | 3040 |
| 10571 | 3040 |
| 10572 | 3040 |
| 10573 | 3040 |
| 10574 | 3040 |
| 10575 | 3040 |
| 10576 | 3040 |
| 10577 | 3040 |
| 10578 | 3040 |
| 10579 | 3040 |
| 10580 | 3040 |
| 10581 | 3044 |
| 10582 | 3044 |
| 10583 | 3044 |
| 10584 | 3044 |
| 10585 | 3044 |
| 10586 | 3044 |
| 10587 | 3044 |
| 10588 | 3044 |
| 10589 | 3044 |
| 10590 | 3044 |
| 10591 | 3044 |
| 10592 | 3044 |
| 10593 | 3044 |
| 10594 | 3044 |
| 10595 | 3044 |
| 10596 | 3044 |
| 10597 | 3044 |
| 10598 | 3044 |
| 10599 | 3044 |
| 10600 | 3044 |
| 10601 | 3044 |
| 10602 | 3044 |
| 10603 | 3044 |
| 10604 | 3044 |
| 10605 | 3044 |
| 10606 | 3044 |
| 10607 | 3044 |
| 10608 | 3044 |
| 10609 | 3044 |
| 10610 | 3044 |
| 10611 | 3044 |
| 10612 | 3044 |
| 10613 | 3044 |
| 10614 | 3044 |
| 10615 | 3044 |
| 10616 | 3044 |
| 10617 | 3044 |
| 10618 | 3044 |
| 10619 | 3044 |
| 10620 | 3044 |
| 10621 | 3044 |
| 10622 | 3044 |
| 10623 | 3044 |
| 10624 | 3044 |
| 10625 | 3044 |
| 10626 | 3044 |
| 10627 | 3044 |
| 10628 | 3044 |
| 10629 | 3072 |
| 10630 | 3072 |
| 10631 | 3072 |
| 10632 | 3072 |
| 10633 | 3072 |
| 10634 | 3072 |
| 10635 | 3072 |
| 10636 | 3072 |
| 10637 | 3072 |
| 10638 | 3072 |
| 10639 | 3072 |
| 10640 | 3072 |
| 10641 | 3072 |
| 10642 | 3072 |
| 10643 | 3072 |
| 10644 | 3072 |
| 10645 | 3072 |
| 10646 | 3072 |
| 10647 | 3072 |
| 10648 | 3072 |
| 10649 | 3072 |
| 10650 | 3072 |
| 10651 | 3072 |
| 10652 | 3072 |
| 10653 | 3072 |
| 10654 | 3072 |
| 10655 | 3072 |
| 10656 | 3072 |
| 10657 | 3072 |
| 10658 | 3072 |
| 10659 | 3072 |
| 10660 | 3072 |
| 10661 | 3072 |
| 10662 | 3072 |
| 10663 | 3072 |
| 10664 | 3072 |
| 10665 | 3072 |
| 10666 | 3072 |
| 10667 | 3072 |
| 10668 | 3072 |
| 10669 | 3072 |
| 10670 | 3072 |
| 10671 | 3072 |
| 10672 | 3072 |
| 10673 | 3072 |
| 10674 | 3072 |
| 10675 | 3072 |
| 10676 | 3072 |
| 10677 | 3072 |
| 10678 | 3292 |
| 10679 | 3292 |
| 10680 | 3292 |
| 10681 | 3292 |
| 10682 | 3292 |
| 10683 | 3292 |
| 10684 | 3292 |
| 10685 | 3292 |
| 10686 | 3292 |
| 10687 | 3292 |
| 10688 | 3292 |
| 10689 | 3292 |
| 10690 | 3292 |
| 10691 | 3292 |
| 10692 | 3292 |
| 10693 | 3292 |
| 10694 | 3292 |
| 10695 | 3292 |
| 10696 | 3292 |
| 10697 | 3292 |
| 10698 | 3292 |
| 10699 | 3292 |
| 10700 | 3292 |
| 10701 | 3292 |
| 10702 | 3292 |
| 10703 | 3292 |
| 10704 | 3292 |
| 10705 | 3292 |
| 10706 | 3292 |
| 10707 | 3292 |
| 10708 | 3292 |
| 10709 | 3292 |
| 10710 | 3292 |
| 10711 | 3292 |
| 10712 | 3292 |
| 10713 | 3292 |
| 10714 | 3292 |
| 10715 | 3292 |
| 10716 | 3292 |
| 10717 | 3292 |
| 10718 | 3292 |
| 10719 | 3292 |
| 10720 | 3292 |
| 10721 | 3292 |
| 10722 | 3292 |
| 10723 | 3292 |
| 10724 | 3292 |
| 10725 | 3292 |
| 10726 | 3068 |
| 10727 | 3068 |
| 10728 | 3068 |
| 10729 | 3068 |
| 10730 | 3068 |
| 10731 | 3068 |
| 10732 | 3068 |
| 10733 | 3068 |
| 10734 | 3068 |
| 10735 | 3068 |
| 10736 | 3068 |
| 10737 | 3068 |
| 10738 | 3068 |
| 10739 | 3068 |
| 10740 | 3068 |
| 10741 | 3068 |
| 10742 | 3068 |
| 10743 | 3068 |
| 10744 | 3068 |
| 10745 | 3068 |
| 10746 | 3068 |
| 10747 | 3068 |
| 10748 | 3068 |
| 10749 | 3068 |
| 10750 | 3068 |
| 10751 | 3068 |
| 10752 | 3068 |
| 10753 | 3068 |
| 10754 | 3068 |
| 10755 | 3068 |
| 10756 | 3068 |
| 10757 | 3068 |
| 10758 | 3068 |
| 10759 | 3068 |
| 10760 | 3068 |
| 10761 | 3068 |
| 10762 | 3068 |
| 10763 | 3068 |
| 10764 | 3068 |
| 10765 | 3068 |
| 10766 | 3068 |
| 10767 | 3068 |
| 10768 | 3068 |
| 10769 | 3068 |
| 10770 | 3068 |
| 10771 | 3068 |
| 10772 | 3068 |
| 10773 | 3068 |
| 10774 | 3056 |
| 10775 | 3056 |
| 10776 | 3056 |
| 10777 | 3056 |
| 10778 | 3056 |
| 10779 | 3056 |
| 10780 | 3056 |
| 10781 | 3056 |
| 10782 | 3056 |
| 10783 | 3056 |
| 10784 | 3056 |
| 10785 | 3056 |
| 10786 | 3056 |
| 10787 | 3056 |
| 10788 | 3056 |
| 10789 | 3056 |
| 10790 | 3056 |
| 10791 | 3056 |
| 10792 | 3056 |
| 10793 | 3056 |
| 10794 | 3056 |
| 10795 | 3056 |
| 10796 | 3056 |
| 10797 | 3056 |
| 10798 | 3056 |
| 10799 | 3056 |
| 10800 | 3056 |
| 10801 | 3056 |
| 10802 | 3056 |
| 10803 | 3056 |
| 10804 | 3056 |
| 10805 | 3056 |
| 10806 | 3056 |
| 10807 | 3056 |
| 10808 | 3056 |
| 10809 | 3056 |
| 10810 | 3056 |
| 10811 | 3056 |
| 10812 | 3056 |
| 10813 | 3056 |
| 10814 | 3056 |
| 10815 | 3056 |
| 10816 | 3056 |
| 10817 | 3056 |
| 10818 | 3056 |
| 10819 | 3056 |
| 10820 | 3056 |
| 10821 | 3056 |
| 10822 | 3080 |
| 10823 | 3080 |
| 10824 | 3080 |
| 10825 | 3080 |
| 10826 | 3080 |
| 10827 | 3080 |
| 10828 | 3080 |
| 10829 | 3080 |
| 10830 | 3080 |
| 10831 | 3080 |
| 10832 | 3080 |
| 10833 | 3080 |
| 10834 | 3080 |
| 10835 | 3080 |
| 10836 | 3080 |
| 10837 | 3080 |
| 10838 | 3080 |
| 10839 | 3080 |
| 10840 | 3080 |
| 10841 | 3080 |
| 10842 | 3080 |
| 10843 | 3080 |
| 10844 | 3080 |
| 10845 | 3080 |
| 10846 | 3080 |
| 10847 | 3080 |
| 10848 | 3080 |
| 10849 | 3080 |
| 10850 | 3080 |
| 10851 | 3080 |
| 10852 | 3080 |
| 10853 | 3080 |
| 10854 | 3080 |
| 10855 | 3080 |
| 10856 | 3080 |
| 10857 | 3080 |
| 10858 | 3080 |
| 10859 | 3080 |
| 10860 | 3080 |
| 10861 | 3080 |
| 10862 | 3080 |
| 10863 | 3080 |
| 10864 | 3080 |
| 10865 | 3080 |
| 10866 | 3080 |
| 10867 | 3080 |
| 10868 | 3080 |
| 10869 | 3080 |
| 10870 | 3088 |
| 10871 | 3088 |
| 10872 | 3088 |
| 10873 | 3088 |
| 10874 | 3088 |
| 10875 | 3088 |
| 10876 | 3088 |
| 10877 | 3088 |
| 10878 | 3088 |
| 10879 | 3088 |
| 10880 | 3088 |
| 10881 | 3088 |
| 10882 | 3088 |
| 10883 | 3088 |
| 10884 | 3088 |
| 10885 | 3088 |
| 10886 | 3088 |
| 10887 | 3088 |
| 10888 | 3088 |
| 10889 | 3088 |
| 10890 | 3088 |
| 10891 | 3088 |
| 10892 | 3088 |
| 10893 | 3088 |
| 10894 | 3088 |
| 10895 | 3088 |
| 10896 | 3088 |
| 10897 | 3088 |
| 10898 | 3088 |
| 10899 | 3088 |
| 10900 | 3088 |
| 10901 | 3088 |
| 10902 | 3088 |
| 10903 | 3088 |
| 10904 | 3088 |
| 10905 | 3088 |
| 10906 | 3088 |
| 10907 | 3088 |
| 10908 | 3088 |
| 10909 | 3088 |
| 10910 | 3088 |
| 10911 | 3088 |
| 10912 | 3088 |
| 10913 | 3088 |
| 10914 | 3088 |
| 10915 | 3088 |
| 10916 | 3088 |
| 10917 | 3088 |
| 10918 | 3088 |
| 10919 | 3048 |
| 10920 | 3048 |
| 10921 | 3048 |
| 10922 | 3048 |
| 10923 | 3048 |
| 10924 | 3048 |
| 10925 | 3048 |
| 10926 | 3048 |
| 10927 | 3048 |
| 10928 | 3048 |
| 10929 | 3048 |
| 10930 | 3048 |
| 10931 | 3048 |
| 10932 | 3048 |
| 10933 | 3048 |
| 10934 | 3048 |
| 10935 | 3048 |
| 10936 | 3048 |
| 10937 | 3048 |
| 10938 | 3048 |
| 10939 | 3048 |
| 10940 | 3048 |
| 10941 | 3048 |
| 10942 | 3048 |
| 10943 | 3048 |
| 10944 | 3048 |
| 10945 | 3048 |
| 10946 | 3048 |
| 10947 | 3048 |
| 10948 | 3048 |
| 10949 | 3048 |
| 10950 | 3048 |
| 10951 | 3048 |
| 10952 | 3048 |
| 10953 | 3048 |
| 10954 | 3048 |
| 10955 | 3048 |
| 10956 | 3048 |
| 10957 | 3048 |
| 10958 | 3048 |
| 10959 | 3048 |
| 10960 | 3048 |
| 10961 | 3048 |
| 10962 | 3048 |
| 10963 | 3048 |
| 10964 | 3048 |
| 10965 | 3048 |
| 10966 | 3048 |
| 10967 | 3304 |
| 10968 | 3304 |
| 10969 | 3304 |
| 10970 | 3304 |
| 10971 | 3304 |
| 10972 | 3304 |
| 10973 | 3304 |
| 10974 | 3304 |
| 10975 | 3304 |
| 10976 | 3304 |
| 10977 | 3304 |
| 10978 | 3304 |
| 10979 | 3304 |
| 10980 | 3304 |
| 10981 | 3304 |
| 10982 | 3304 |
| 10983 | 3304 |
| 10984 | 3304 |
| 10985 | 3304 |
| 10986 | 3304 |
| 10987 | 3304 |
| 10988 | 3304 |
| 10989 | 3304 |
| 10990 | 3304 |
| 10991 | 3304 |
| 10992 | 3304 |
| 10993 | 3304 |
| 10994 | 3304 |
| 10995 | 3304 |
| 10996 | 3304 |
| 10997 | 3304 |
| 10998 | 3304 |
| 10999 | 3304 |
| 11000 | 3304 |
| 11001 | 3304 |
| 11002 | 3304 |
| 11003 | 3304 |
| 11004 | 3304 |
| 11005 | 3304 |
| 11006 | 3304 |
| 11007 | 3304 |
| 11008 | 3304 |
| 11009 | 3304 |
| 11010 | 3304 |
| 11011 | 3304 |
| 11012 | 3304 |
| 11013 | 3304 |
| 11014 | 3304 |
| 11015 | 3304 |
| 11016 | 3060 |
| 11017 | 3060 |
| 11018 | 3060 |
| 11019 | 3060 |
| 11020 | 3060 |
| 11021 | 3060 |
| 11022 | 3060 |
| 11023 | 3060 |
| 11024 | 3060 |
| 11025 | 3060 |
| 11026 | 3060 |
| 11027 | 3060 |
| 11028 | 3060 |
| 11029 | 3060 |
| 11030 | 3060 |
| 11031 | 3060 |
| 11032 | 3060 |
| 11033 | 3060 |
| 11034 | 3060 |
| 11035 | 3060 |
| 11036 | 3060 |
| 11037 | 3060 |
| 11038 | 3060 |
| 11039 | 3060 |
| 11040 | 3060 |
| 11041 | 3060 |
| 11042 | 3060 |
| 11043 | 3060 |
| 11044 | 3060 |
| 11045 | 3060 |
| 11046 | 3060 |
| 11047 | 3060 |
| 11048 | 3060 |
| 11049 | 3060 |
| 11050 | 3060 |
| 11051 | 3060 |
| 11052 | 3060 |
| 11053 | 3060 |
| 11054 | 3060 |
| 11055 | 3060 |
| 11056 | 3060 |
| 11057 | 3060 |
| 11058 | 3060 |
| 11059 | 3060 |
| 11060 | 3060 |
| 11061 | 3060 |
| 11062 | 3060 |
| 11063 | 3060 |
| 11064 | 3060 |
| 11065 | 3060 |
| 11066 | 3060 |
| 11067 | 3060 |
| 11068 | 3060 |
| 11069 | 3060 |
| 11070 | 3060 |
| 11071 | 3060 |
| 11072 | 3060 |
| 11073 | 3060 |
| 11074 | 3060 |
| 11075 | 3060 |
| 11076 | 3060 |
| 11077 | 3060 |
| 11078 | 3060 |
| 11079 | 3060 |
| 11080 | 3060 |
| 11081 | 3060 |
| 11082 | 3060 |
| 11083 | 3060 |
| 11084 | 3060 |
| 11085 | 3060 |
| 11086 | 3060 |
| 11087 | 3060 |
| 11088 | 3060 |
| 11089 | 3060 |
| 11090 | 3060 |
| 11091 | 3060 |
| 11092 | 3060 |
| 11093 | 3060 |
| 11094 | 3060 |
| 11095 | 3060 |
| 11096 | 3060 |
| 11097 | 3060 |
| 11098 | 3060 |
| 11099 | 3060 |
| 11100 | 3060 |
| 11101 | 3060 |
| 11102 | 3060 |
| 11103 | 3060 |
| 11104 | 3060 |
| 11105 | 3060 |
| 11106 | 3060 |
| 11107 | 3060 |
| 11108 | 3060 |
| 11109 | 3060 |
| 11110 | 3060 |
| 11111 | 3060 |
| 11112 | 3044 |
| 11113 | 3044 |
| 11114 | 3044 |
| 11115 | 3044 |
| 11116 | 3044 |
| 11117 | 3044 |
| 11118 | 3044 |
| 11119 | 3044 |
| 11120 | 3044 |
| 11121 | 3044 |
| 11122 | 3044 |
| 11123 | 3044 |
| 11124 | 3044 |
| 11125 | 3044 |
| 11126 | 3044 |
| 11127 | 3044 |
| 11128 | 3044 |
| 11129 | 3044 |
| 11130 | 3044 |
| 11131 | 3044 |
| 11132 | 3044 |
| 11133 | 3044 |
| 11134 | 3044 |
| 11135 | 3044 |
| 11136 | 3044 |
| 11137 | 3044 |
| 11138 | 3044 |
| 11139 | 3044 |
| 11140 | 3044 |
| 11141 | 3044 |
| 11142 | 3044 |
| 11143 | 3044 |
| 11144 | 3044 |
| 11145 | 3044 |
| 11146 | 3044 |
| 11147 | 3044 |
| 11148 | 3044 |
| 11149 | 3044 |
| 11150 | 3044 |
| 11151 | 3044 |
| 11152 | 3044 |
| 11153 | 3044 |
| 11154 | 3044 |
| 11155 | 3044 |
| 11156 | 3044 |
| 11157 | 3044 |
| 11158 | 3044 |
| 11159 | 3044 |
| 11160 | 3048 |
| 11161 | 3048 |
| 11162 | 3048 |
| 11163 | 3048 |
| 11164 | 3048 |
| 11165 | 3048 |
| 11166 | 3048 |
| 11167 | 3048 |
| 11168 | 3048 |
| 11169 | 3048 |
| 11170 | 3048 |
| 11171 | 3048 |
| 11172 | 3048 |
| 11173 | 3048 |
| 11174 | 3048 |
| 11175 | 3048 |
| 11176 | 3048 |
| 11177 | 3048 |
| 11178 | 3048 |
| 11179 | 3048 |
| 11180 | 3048 |
| 11181 | 3048 |
| 11182 | 3048 |
| 11183 | 3048 |
| 11184 | 3048 |
| 11185 | 3048 |
| 11186 | 3048 |
| 11187 | 3048 |
| 11188 | 3048 |
| 11189 | 3048 |
| 11190 | 3048 |
| 11191 | 3048 |
| 11192 | 3048 |
| 11193 | 3048 |
| 11194 | 3048 |
| 11195 | 3048 |
| 11196 | 3048 |
| 11197 | 3048 |
| 11198 | 3048 |
| 11199 | 3048 |
| 11200 | 3048 |
| 11201 | 3048 |
| 11202 | 3048 |
| 11203 | 3048 |
| 11204 | 3048 |
| 11205 | 3048 |
| 11206 | 3048 |
| 11207 | 3048 |
| 11208 | 3064 |
| 11209 | 3064 |
| 11210 | 3064 |
| 11211 | 3064 |
| 11212 | 3064 |
| 11213 | 3064 |
| 11214 | 3064 |
| 11215 | 3064 |
| 11216 | 3064 |
| 11217 | 3064 |
| 11218 | 3064 |
| 11219 | 3064 |
| 11220 | 3064 |
| 11221 | 3064 |
| 11222 | 3064 |
| 11223 | 3064 |
| 11224 | 3064 |
| 11225 | 3064 |
| 11226 | 3064 |
| 11227 | 3064 |
| 11228 | 3064 |
| 11229 | 3064 |
| 11230 | 3064 |
| 11231 | 3064 |
| 11232 | 3064 |
| 11233 | 3064 |
| 11234 | 3064 |
| 11235 | 3064 |
| 11236 | 3064 |
| 11237 | 3064 |
| 11238 | 3064 |
| 11239 | 3064 |
| 11240 | 3064 |
| 11241 | 3064 |
| 11242 | 3064 |
| 11243 | 3064 |
| 11244 | 3064 |
| 11245 | 3064 |
| 11246 | 3064 |
| 11247 | 3064 |
| 11248 | 3064 |
| 11249 | 3064 |
| 11250 | 3064 |
| 11251 | 3064 |
| 11252 | 3064 |
| 11253 | 3064 |
| 11254 | 3064 |
| 11255 | 3064 |
| 11256 | 3080 |
| 11257 | 3080 |
| 11258 | 3080 |
| 11259 | 3080 |
| 11260 | 3080 |
| 11261 | 3080 |
| 11262 | 3080 |
| 11263 | 3080 |
| 11264 | 3080 |
| 11265 | 3080 |
| 11266 | 3080 |
| 11267 | 3080 |
| 11268 | 3080 |
| 11269 | 3080 |
| 11270 | 3080 |
| 11271 | 3080 |
| 11272 | 3080 |
| 11273 | 3080 |
| 11274 | 3080 |
| 11275 | 3080 |
| 11276 | 3080 |
| 11277 | 3080 |
| 11278 | 3080 |
| 11279 | 3080 |
| 11280 | 3080 |
| 11281 | 3080 |
| 11282 | 3080 |
| 11283 | 3080 |
| 11284 | 3080 |
| 11285 | 3080 |
| 11286 | 3080 |
| 11287 | 3080 |
| 11288 | 3080 |
| 11289 | 3080 |
| 11290 | 3080 |
| 11291 | 3080 |
| 11292 | 3080 |
| 11293 | 3080 |
| 11294 | 3080 |
| 11295 | 3080 |
| 11296 | 3080 |
| 11297 | 3080 |
| 11298 | 3080 |
| 11299 | 3080 |
| 11300 | 3080 |
| 11301 | 3080 |
| 11302 | 3080 |
| 11303 | 3080 |
| 11304 | 3048 |
| 11305 | 3048 |
| 11306 | 3048 |
| 11307 | 3048 |
| 11308 | 3048 |
| 11309 | 3048 |
| 11310 | 3048 |
| 11311 | 3048 |
| 11312 | 3048 |
| 11313 | 3048 |
| 11314 | 3048 |
| 11315 | 3048 |
| 11316 | 3048 |
| 11317 | 3048 |
| 11318 | 3048 |
| 11319 | 3048 |
| 11320 | 3048 |
| 11321 | 3048 |
| 11322 | 3048 |
| 11323 | 3048 |
| 11324 | 3048 |
| 11325 | 3048 |
| 11326 | 3048 |
| 11327 | 3048 |
| 11328 | 3048 |
| 11329 | 3048 |
| 11330 | 3048 |
| 11331 | 3048 |
| 11332 | 3048 |
| 11333 | 3048 |
| 11334 | 3048 |
| 11335 | 3048 |
| 11336 | 3048 |
| 11337 | 3048 |
| 11338 | 3048 |
| 11339 | 3048 |
| 11340 | 3048 |
| 11341 | 3048 |
| 11342 | 3048 |
| 11343 | 3048 |
| 11344 | 3048 |
| 11345 | 3048 |
| 11346 | 3048 |
| 11347 | 3048 |
| 11348 | 3048 |
| 11349 | 3048 |
| 11350 | 3048 |
| 11351 | 3048 |
| 11352 | 3084 |
| 11353 | 3084 |
| 11354 | 3084 |
| 11355 | 3084 |
| 11356 | 3084 |
| 11357 | 3084 |
| 11358 | 3084 |
| 11359 | 3084 |
| 11360 | 3084 |
| 11361 | 3084 |
| 11362 | 3084 |
| 11363 | 3084 |
| 11364 | 3084 |
| 11365 | 3084 |
| 11366 | 3084 |
| 11367 | 3084 |
| 11368 | 3084 |
| 11369 | 3084 |
| 11370 | 3084 |
| 11371 | 3084 |
| 11372 | 3084 |
| 11373 | 3084 |
| 11374 | 3084 |
| 11375 | 3084 |
| 11376 | 3084 |
| 11377 | 3084 |
| 11378 | 3084 |
| 11379 | 3084 |
| 11380 | 3084 |
| 11381 | 3084 |
| 11382 | 3084 |
| 11383 | 3084 |
| 11384 | 3084 |
| 11385 | 3084 |
| 11386 | 3084 |
| 11387 | 3084 |
| 11388 | 3084 |
| 11389 | 3084 |
| 11390 | 3084 |
| 11391 | 3084 |
| 11392 | 3084 |
| 11393 | 3084 |
| 11394 | 3084 |
| 11395 | 3084 |
| 11396 | 3084 |
| 11397 | 3084 |
| 11398 | 3084 |
| 11399 | 3084 |
| 11400 | 3048 |
| 11401 | 3048 |
| 11402 | 3048 |
| 11403 | 3048 |
| 11404 | 3048 |
| 11405 | 3048 |
| 11406 | 3048 |
| 11407 | 3048 |
| 11408 | 3048 |
| 11409 | 3048 |
| 11410 | 3048 |
| 11411 | 3048 |
| 11412 | 3048 |
| 11413 | 3048 |
| 11414 | 3048 |
| 11415 | 3048 |
| 11416 | 3048 |
| 11417 | 3048 |
| 11418 | 3048 |
| 11419 | 3048 |
| 11420 | 3048 |
| 11421 | 3048 |
| 11422 | 3048 |
| 11423 | 3048 |
| 11424 | 3048 |
| 11425 | 3048 |
| 11426 | 3048 |
| 11427 | 3048 |
| 11428 | 3048 |
| 11429 | 3048 |
| 11430 | 3048 |
| 11431 | 3048 |
| 11432 | 3048 |
| 11433 | 3048 |
| 11434 | 3048 |
| 11435 | 3048 |
| 11436 | 3048 |
| 11437 | 3048 |
| 11438 | 3048 |
| 11439 | 3048 |
| 11440 | 3048 |
| 11441 | 3048 |
| 11442 | 3048 |
| 11443 | 3048 |
| 11444 | 3048 |
| 11445 | 3048 |
| 11446 | 3048 |
| 11447 | 3048 |
| 11448 | 3048 |
| 11449 | 3048 |
| 11450 | 3048 |
| 11451 | 3048 |
| 11452 | 3048 |
| 11453 | 3048 |
| 11454 | 3048 |
| 11455 | 3048 |
| 11456 | 3048 |
| 11457 | 3048 |
| 11458 | 3048 |
| 11459 | 3048 |
| 11460 | 3048 |
| 11461 | 3048 |
| 11462 | 3048 |
| 11463 | 3048 |
| 11464 | 3048 |
| 11465 | 3048 |
| 11466 | 3048 |
| 11467 | 3048 |
| 11468 | 3048 |
| 11469 | 3048 |
| 11470 | 3048 |
| 11471 | 3048 |
| 11472 | 3048 |
| 11473 | 3048 |
| 11474 | 3048 |
| 11475 | 3048 |
| 11476 | 3048 |
| 11477 | 3048 |
| 11478 | 3048 |
| 11479 | 3048 |
| 11480 | 3048 |
| 11481 | 3048 |
| 11482 | 3048 |
| 11483 | 3048 |
| 11484 | 3048 |
| 11485 | 3048 |
| 11486 | 3048 |
| 11487 | 3048 |
| 11488 | 3048 |
| 11489 | 3048 |
| 11490 | 3048 |
| 11491 | 3048 |
| 11492 | 3048 |
| 11493 | 3048 |
| 11494 | 3048 |
| 11495 | 3048 |
| 11496 | 3048 |
| 11497 | 3048 |
| 11498 | 3048 |
| 11499 | 3048 |
| 11500 | 3048 |
| 11501 | 3048 |
| 11502 | 3048 |
| 11503 | 3048 |
| 11504 | 3048 |
| 11505 | 3048 |
| 11506 | 3048 |
| 11507 | 3048 |
| 11508 | 3048 |
| 11509 | 3048 |
| 11510 | 3048 |
| 11511 | 3048 |
| 11512 | 3048 |
| 11513 | 3048 |
| 11514 | 3048 |
| 11515 | 3048 |
| 11516 | 3048 |
| 11517 | 3048 |
| 11518 | 3048 |
| 11519 | 3048 |
| 11520 | 3048 |
| 11521 | 3048 |
| 11522 | 3048 |
| 11523 | 3048 |
| 11524 | 3048 |
| 11525 | 3048 |
| 11526 | 3048 |
| 11527 | 3048 |
| 11528 | 3048 |
| 11529 | 3048 |
| 11530 | 3048 |
| 11531 | 3048 |
| 11532 | 3048 |
| 11533 | 3048 |
| 11534 | 3048 |
| 11535 | 3048 |
| 11536 | 3048 |
| 11537 | 3048 |
| 11538 | 3048 |
| 11539 | 3048 |
| 11540 | 3048 |
| 11541 | 3048 |
| 11542 | 3048 |
| 11543 | 3048 |
| 11544 | 3048 |
| 11545 | 3076 |
| 11546 | 3076 |
| 11547 | 3076 |
| 11548 | 3076 |
| 11549 | 3076 |
| 11550 | 3076 |
| 11551 | 3076 |
| 11552 | 3076 |
| 11553 | 3076 |
| 11554 | 3076 |
| 11555 | 3076 |
| 11556 | 3076 |
| 11557 | 3076 |
| 11558 | 3076 |
| 11559 | 3076 |
| 11560 | 3076 |
| 11561 | 3076 |
| 11562 | 3076 |
| 11563 | 3076 |
| 11564 | 3076 |
| 11565 | 3076 |
| 11566 | 3076 |
| 11567 | 3076 |
| 11568 | 3076 |
| 11569 | 3076 |
| 11570 | 3076 |
| 11571 | 3076 |
| 11572 | 3076 |
| 11573 | 3076 |
| 11574 | 3076 |
| 11575 | 3076 |
| 11576 | 3076 |
| 11577 | 3076 |
| 11578 | 3076 |
| 11579 | 3076 |
| 11580 | 3076 |
| 11581 | 3076 |
| 11582 | 3076 |
| 11583 | 3076 |
| 11584 | 3076 |
| 11585 | 3076 |
| 11586 | 3076 |
| 11587 | 3076 |
| 11588 | 3076 |
| 11589 | 3076 |
| 11590 | 3076 |
| 11591 | 3076 |
| 11592 | 3076 |
| 11593 | 3048 |
| 11594 | 3048 |
| 11595 | 3048 |
| 11596 | 3048 |
| 11597 | 3048 |
| 11598 | 3048 |
| 11599 | 3048 |
| 11600 | 3048 |
| 11601 | 3048 |
| 11602 | 3048 |
| 11603 | 3048 |
| 11604 | 3048 |
| 11605 | 3048 |
| 11606 | 3048 |
| 11607 | 3048 |
| 11608 | 3048 |
| 11609 | 3048 |
| 11610 | 3048 |
| 11611 | 3048 |
| 11612 | 3048 |
| 11613 | 3048 |
| 11614 | 3048 |
| 11615 | 3048 |
| 11616 | 3048 |
| 11617 | 3048 |
| 11618 | 3048 |
| 11619 | 3048 |
| 11620 | 3048 |
| 11621 | 3048 |
| 11622 | 3048 |
| 11623 | 3048 |
| 11624 | 3048 |
| 11625 | 3048 |
| 11626 | 3048 |
| 11627 | 3048 |
| 11628 | 3048 |
| 11629 | 3048 |
| 11630 | 3048 |
| 11631 | 3048 |
| 11632 | 3048 |
| 11633 | 3048 |
| 11634 | 3048 |
| 11635 | 3048 |
| 11636 | 3048 |
| 11637 | 3048 |
| 11638 | 3048 |
| 11639 | 3048 |
| 11640 | 3048 |
| 11641 | 3092 |
| 11642 | 3092 |
| 11643 | 3092 |
| 11644 | 3092 |
| 11645 | 3092 |
| 11646 | 3092 |
| 11647 | 3092 |
| 11648 | 3092 |
| 11649 | 3092 |
| 11650 | 3092 |
| 11651 | 3092 |
| 11652 | 3092 |
| 11653 | 3092 |
| 11654 | 3092 |
| 11655 | 3092 |
| 11656 | 3092 |
| 11657 | 3092 |
| 11658 | 3092 |
| 11659 | 3092 |
| 11660 | 3092 |
| 11661 | 3092 |
| 11662 | 3092 |
| 11663 | 3092 |
| 11664 | 3092 |
| 11665 | 3092 |
| 11666 | 3092 |
| 11667 | 3092 |
| 11668 | 3092 |
| 11669 | 3092 |
| 11670 | 3092 |
| 11671 | 3092 |
| 11672 | 3092 |
| 11673 | 3092 |
| 11674 | 3092 |
| 11675 | 3092 |
| 11676 | 3092 |
| 11677 | 3092 |
| 11678 | 3092 |
| 11679 | 3092 |
| 11680 | 3092 |
| 11681 | 3092 |
| 11682 | 3092 |
| 11683 | 3092 |
| 11684 | 3092 |
| 11685 | 3092 |
| 11686 | 3092 |
| 11687 | 3092 |
| 11688 | 3092 |
| 11689 | 3092 |
| 11690 | 3288 |
| 11691 | 3288 |
| 11692 | 3288 |
| 11693 | 3288 |
| 11694 | 3288 |
| 11695 | 3288 |
| 11696 | 3288 |
| 11697 | 3288 |
| 11698 | 3288 |
| 11699 | 3288 |
| 11700 | 3288 |
| 11701 | 3288 |
| 11702 | 3288 |
| 11703 | 3288 |
| 11704 | 3288 |
| 11705 | 3288 |
| 11706 | 3288 |
| 11707 | 3288 |
| 11708 | 3288 |
| 11709 | 3288 |
| 11710 | 3288 |
| 11711 | 3288 |
| 11712 | 3288 |
| 11713 | 3288 |
| 11714 | 3288 |
| 11715 | 3288 |
| 11716 | 3288 |
| 11717 | 3288 |
| 11718 | 3288 |
| 11719 | 3288 |
| 11720 | 3288 |
| 11721 | 3288 |
| 11722 | 3288 |
| 11723 | 3288 |
| 11724 | 3288 |
| 11725 | 3288 |
| 11726 | 3288 |
| 11727 | 3288 |
| 11728 | 3288 |
| 11729 | 3288 |
| 11730 | 3288 |
| 11731 | 3288 |
| 11732 | 3288 |
| 11733 | 3288 |
| 11734 | 3288 |
| 11735 | 3288 |
| 11736 | 3288 |
| 11737 | 3288 |
| 11738 | 3040 |
| 11739 | 3040 |
| 11740 | 3040 |
| 11741 | 3040 |
| 11742 | 3040 |
| 11743 | 3040 |
| 11744 | 3040 |
| 11745 | 3040 |
| 11746 | 3040 |
| 11747 | 3040 |
| 11748 | 3040 |
| 11749 | 3040 |
| 11750 | 3040 |
| 11751 | 3040 |
| 11752 | 3040 |
| 11753 | 3040 |
| 11754 | 3040 |
| 11755 | 3040 |
| 11756 | 3040 |
| 11757 | 3040 |
| 11758 | 3040 |
| 11759 | 3040 |
| 11760 | 3040 |
| 11761 | 3040 |
| 11762 | 3040 |
| 11763 | 3040 |
| 11764 | 3040 |
| 11765 | 3040 |
| 11766 | 3040 |
| 11767 | 3040 |
| 11768 | 3040 |
| 11769 | 3040 |
| 11770 | 3040 |
| 11771 | 3040 |
| 11772 | 3040 |
| 11773 | 3040 |
| 11774 | 3040 |
| 11775 | 3040 |
| 11776 | 3040 |
| 11777 | 3040 |
| 11778 | 3040 |
| 11779 | 3040 |
| 11780 | 3040 |
| 11781 | 3040 |
| 11782 | 3040 |
| 11783 | 3040 |
| 11784 | 3040 |
| 11785 | 3040 |
| 11786 | 3048 |
| 11787 | 3048 |
| 11788 | 3048 |
| 11789 | 3048 |
| 11790 | 3048 |
| 11791 | 3048 |
| 11792 | 3048 |
| 11793 | 3048 |
| 11794 | 3048 |
| 11795 | 3048 |
| 11796 | 3048 |
| 11797 | 3048 |
| 11798 | 3048 |
| 11799 | 3048 |
| 11800 | 3048 |
| 11801 | 3048 |
| 11802 | 3048 |
| 11803 | 3048 |
| 11804 | 3048 |
| 11805 | 3048 |
| 11806 | 3048 |
| 11807 | 3048 |
| 11808 | 3048 |
| 11809 | 3048 |
| 11810 | 3048 |
| 11811 | 3048 |
| 11812 | 3048 |
| 11813 | 3048 |
| 11814 | 3048 |
| 11815 | 3048 |
| 11816 | 3048 |
| 11817 | 3048 |
| 11818 | 3048 |
| 11819 | 3048 |
| 11820 | 3048 |
| 11821 | 3048 |
| 11822 | 3048 |
| 11823 | 3048 |
| 11824 | 3048 |
| 11825 | 3048 |
| 11826 | 3048 |
| 11827 | 3048 |
| 11828 | 3048 |
| 11829 | 3048 |
| 11830 | 3048 |
| 11831 | 3048 |
| 11832 | 3048 |
| 11833 | 3048 |
| 11834 | 3060 |
| 11835 | 3060 |
| 11836 | 3060 |
| 11837 | 3060 |
| 11838 | 3060 |
| 11839 | 3060 |
| 11840 | 3060 |
| 11841 | 3060 |
| 11842 | 3060 |
| 11843 | 3060 |
| 11844 | 3060 |
| 11845 | 3060 |
| 11846 | 3060 |
| 11847 | 3060 |
| 11848 | 3060 |
| 11849 | 3060 |
| 11850 | 3060 |
| 11851 | 3060 |
| 11852 | 3060 |
| 11853 | 3060 |
| 11854 | 3060 |
| 11855 | 3060 |
| 11856 | 3060 |
| 11857 | 3060 |
| 11858 | 3060 |
| 11859 | 3060 |
| 11860 | 3060 |
| 11861 | 3060 |
| 11862 | 3060 |
| 11863 | 3060 |
| 11864 | 3060 |
| 11865 | 3060 |
| 11866 | 3060 |
| 11867 | 3060 |
| 11868 | 3060 |
| 11869 | 3060 |
| 11870 | 3060 |
| 11871 | 3060 |
| 11872 | 3060 |
| 11873 | 3060 |
| 11874 | 3060 |
| 11875 | 3060 |
| 11876 | 3060 |
| 11877 | 3060 |
| 11878 | 3060 |
| 11879 | 3060 |
| 11880 | 3060 |
| 11881 | 3060 |
| 11882 | 3072 |
| 11883 | 3072 |
| 11884 | 3072 |
| 11885 | 3072 |
| 11886 | 3072 |
| 11887 | 3072 |
| 11888 | 3072 |
| 11889 | 3072 |
| 11890 | 3072 |
| 11891 | 3072 |
| 11892 | 3072 |
| 11893 | 3072 |
| 11894 | 3072 |
| 11895 | 3072 |
| 11896 | 3072 |
| 11897 | 3072 |
| 11898 | 3072 |
| 11899 | 3072 |
| 11900 | 3072 |
| 11901 | 3072 |
| 11902 | 3072 |
| 11903 | 3072 |
| 11904 | 3072 |
| 11905 | 3072 |
| 11906 | 3072 |
| 11907 | 3072 |
| 11908 | 3072 |
| 11909 | 3072 |
| 11910 | 3072 |
| 11911 | 3072 |
| 11912 | 3072 |
| 11913 | 3072 |
| 11914 | 3072 |
| 11915 | 3072 |
| 11916 | 3072 |
| 11917 | 3072 |
| 11918 | 3072 |
| 11919 | 3072 |
| 11920 | 3072 |
| 11921 | 3072 |
| 11922 | 3072 |
| 11923 | 3072 |
| 11924 | 3072 |
| 11925 | 3072 |
| 11926 | 3072 |
| 11927 | 3072 |
| 11928 | 3072 |
| 11929 | 3072 |
| 11930 | 3072 |
| 11931 | 3076 |
| 11932 | 3076 |
| 11933 | 3076 |
| 11934 | 3076 |
| 11935 | 3076 |
| 11936 | 3076 |
| 11937 | 3076 |
| 11938 | 3076 |
| 11939 | 3076 |
| 11940 | 3076 |
| 11941 | 3076 |
| 11942 | 3076 |
| 11943 | 3076 |
| 11944 | 3076 |
| 11945 | 3076 |
| 11946 | 3076 |
| 11947 | 3076 |
| 11948 | 3076 |
| 11949 | 3076 |
| 11950 | 3076 |
| 11951 | 3076 |
| 11952 | 3076 |
| 11953 | 3076 |
| 11954 | 3076 |
| 11955 | 3076 |
| 11956 | 3076 |
| 11957 | 3076 |
| 11958 | 3076 |
| 11959 | 3076 |
| 11960 | 3076 |
| 11961 | 3076 |
| 11962 | 3076 |
| 11963 | 3076 |
| 11964 | 3076 |
| 11965 | 3076 |
| 11966 | 3076 |
| 11967 | 3076 |
| 11968 | 3076 |
| 11969 | 3076 |
| 11970 | 3076 |
| 11971 | 3076 |
| 11972 | 3076 |
| 11973 | 3076 |
| 11974 | 3076 |
| 11975 | 3076 |
| 11976 | 3076 |
| 11977 | 3076 |
| 11978 | 3076 |
| 11979 | 3032 |
| 11980 | 3032 |
| 11981 | 3032 |
| 11982 | 3032 |
| 11983 | 3032 |
| 11984 | 3032 |
| 11985 | 3032 |
| 11986 | 3032 |
| 11987 | 3032 |
| 11988 | 3032 |
| 11989 | 3032 |
| 11990 | 3032 |
| 11991 | 3032 |
| 11992 | 3032 |
| 11993 | 3032 |
| 11994 | 3032 |
| 11995 | 3032 |
| 11996 | 3032 |
| 11997 | 3032 |
| 11998 | 3032 |
| 11999 | 3032 |
| 12000 | 3032 |
| 12001 | 3032 |
| 12002 | 3032 |
| 12003 | 3032 |
| 12004 | 3032 |
| 12005 | 3032 |
| 12006 | 3032 |
| 12007 | 3032 |
| 12008 | 3032 |
| 12009 | 3032 |
| 12010 | 3032 |
| 12011 | 3032 |
| 12012 | 3032 |
| 12013 | 3032 |
| 12014 | 3032 |
| 12015 | 3032 |
| 12016 | 3032 |
| 12017 | 3032 |
| 12018 | 3032 |
| 12019 | 3032 |
| 12020 | 3032 |
| 12021 | 3032 |
| 12022 | 3032 |
| 12023 | 3032 |
| 12024 | 3032 |
| 12025 | 3032 |
| 12026 | 3032 |
| 12027 | 3048 |
| 12028 | 3048 |
| 12029 | 3048 |
| 12030 | 3048 |
| 12031 | 3048 |
| 12032 | 3048 |
| 12033 | 3048 |
| 12034 | 3048 |
| 12035 | 3048 |
| 12036 | 3048 |
| 12037 | 3048 |
| 12038 | 3048 |
| 12039 | 3048 |
| 12040 | 3048 |
| 12041 | 3048 |
| 12042 | 3048 |
| 12043 | 3048 |
| 12044 | 3048 |
| 12045 | 3048 |
| 12046 | 3048 |
| 12047 | 3048 |
| 12048 | 3048 |
| 12049 | 3048 |
| 12050 | 3048 |
| 12051 | 3048 |
| 12052 | 3048 |
| 12053 | 3048 |
| 12054 | 3048 |
| 12055 | 3048 |
| 12056 | 3048 |
| 12057 | 3048 |
| 12058 | 3048 |
| 12059 | 3048 |
| 12060 | 3048 |
| 12061 | 3048 |
| 12062 | 3048 |
| 12063 | 3048 |
| 12064 | 3048 |
| 12065 | 3048 |
| 12066 | 3048 |
| 12067 | 3048 |
| 12068 | 3048 |
| 12069 | 3048 |
| 12070 | 3048 |
| 12071 | 3048 |
| 12072 | 3048 |
| 12073 | 3048 |
| 12074 | 3048 |
| 12075 | 3084 |
| 12076 | 3084 |
| 12077 | 3084 |
| 12078 | 3084 |
| 12079 | 3084 |
| 12080 | 3084 |
| 12081 | 3084 |
| 12082 | 3084 |
| 12083 | 3084 |
| 12084 | 3084 |
| 12085 | 3084 |
| 12086 | 3084 |
| 12087 | 3084 |
| 12088 | 3084 |
| 12089 | 3084 |
| 12090 | 3084 |
| 12091 | 3084 |
| 12092 | 3084 |
| 12093 | 3084 |
| 12094 | 3084 |
| 12095 | 3084 |
| 12096 | 3084 |
| 12097 | 3084 |
| 12098 | 3084 |
| 12099 | 3084 |
| 12100 | 3084 |
| 12101 | 3084 |
| 12102 | 3084 |
| 12103 | 3084 |
| 12104 | 3084 |
| 12105 | 3084 |
| 12106 | 3084 |
| 12107 | 3084 |
| 12108 | 3084 |
| 12109 | 3084 |
| 12110 | 3084 |
| 12111 | 3084 |
| 12112 | 3084 |
| 12113 | 3084 |
| 12114 | 3084 |
| 12115 | 3084 |
| 12116 | 3084 |
| 12117 | 3084 |
| 12118 | 3084 |
| 12119 | 3084 |
| 12120 | 3084 |
| 12121 | 3084 |
| 12122 | 3084 |
| 12123 | 3052 |
| 12124 | 3052 |
| 12125 | 3052 |
| 12126 | 3052 |
| 12127 | 3052 |
| 12128 | 3052 |
| 12129 | 3052 |
| 12130 | 3052 |
| 12131 | 3052 |
| 12132 | 3052 |
| 12133 | 3052 |
| 12134 | 3052 |
| 12135 | 3052 |
| 12136 | 3052 |
| 12137 | 3052 |
| 12138 | 3052 |
| 12139 | 3052 |
| 12140 | 3052 |
| 12141 | 3052 |
| 12142 | 3052 |
| 12143 | 3052 |
| 12144 | 3052 |
| 12145 | 3052 |
| 12146 | 3052 |
| 12147 | 3052 |
| 12148 | 3052 |
| 12149 | 3052 |
| 12150 | 3052 |
| 12151 | 3052 |
| 12152 | 3052 |
| 12153 | 3052 |
| 12154 | 3052 |
| 12155 | 3052 |
| 12156 | 3052 |
| 12157 | 3052 |
| 12158 | 3052 |
| 12159 | 3052 |
| 12160 | 3052 |
| 12161 | 3052 |
| 12162 | 3052 |
| 12163 | 3052 |
| 12164 | 3052 |
| 12165 | 3052 |
| 12166 | 3052 |
| 12167 | 3052 |
| 12168 | 3052 |
| 12169 | 3052 |
| 12170 | 3052 |
| 12171 | 3024 |
| 12172 | 3024 |
| 12173 | 3024 |
| 12174 | 3024 |
| 12175 | 3024 |
| 12176 | 3024 |
| 12177 | 3024 |
| 12178 | 3024 |
| 12179 | 3024 |
| 12180 | 3024 |
| 12181 | 3024 |
| 12182 | 3024 |
| 12183 | 3024 |
| 12184 | 3024 |
| 12185 | 3024 |
| 12186 | 3024 |
| 12187 | 3024 |
| 12188 | 3024 |
| 12189 | 3024 |
| 12190 | 3024 |
| 12191 | 3024 |
| 12192 | 3024 |
| 12193 | 3024 |
| 12194 | 3024 |
| 12195 | 3024 |
| 12196 | 3024 |
| 12197 | 3024 |
| 12198 | 3024 |
| 12199 | 3024 |
| 12200 | 3024 |
| 12201 | 3024 |
| 12202 | 3024 |
| 12203 | 3024 |
| 12204 | 3024 |
| 12205 | 3024 |
| 12206 | 3024 |
| 12207 | 3024 |
| 12208 | 3024 |
| 12209 | 3024 |
| 12210 | 3024 |
| 12211 | 3024 |
| 12212 | 3024 |
| 12213 | 3024 |
| 12214 | 3024 |
| 12215 | 3024 |
| 12216 | 3024 |
| 12217 | 3024 |
| 12218 | 3024 |
| 12219 | 3060 |
| 12220 | 3060 |
| 12221 | 3060 |
| 12222 | 3060 |
| 12223 | 3060 |
| 12224 | 3060 |
| 12225 | 3060 |
| 12226 | 3060 |
| 12227 | 3060 |
| 12228 | 3060 |
| 12229 | 3060 |
| 12230 | 3060 |
| 12231 | 3060 |
| 12232 | 3060 |
| 12233 | 3060 |
| 12234 | 3060 |
| 12235 | 3060 |
| 12236 | 3060 |
| 12237 | 3060 |
| 12238 | 3060 |
| 12239 | 3060 |
| 12240 | 3060 |
| 12241 | 3060 |
| 12242 | 3060 |
| 12243 | 3060 |
| 12244 | 3060 |
| 12245 | 3060 |
| 12246 | 3060 |
| 12247 | 3060 |
| 12248 | 3060 |
| 12249 | 3060 |
| 12250 | 3060 |
| 12251 | 3060 |
| 12252 | 3060 |
| 12253 | 3060 |
| 12254 | 3060 |
| 12255 | 3060 |
| 12256 | 3060 |
| 12257 | 3060 |
| 12258 | 3060 |
| 12259 | 3060 |
| 12260 | 3060 |
| 12261 | 3060 |
| 12262 | 3060 |
| 12263 | 3060 |
| 12264 | 3060 |
| 12265 | 3060 |
| 12266 | 3060 |
| 12267 | 3060 |
| 12268 | 3044 |
| 12269 | 3044 |
| 12270 | 3044 |
| 12271 | 3044 |
| 12272 | 3044 |
| 12273 | 3044 |
| 12274 | 3044 |
| 12275 | 3044 |
| 12276 | 3044 |
| 12277 | 3044 |
| 12278 | 3044 |
| 12279 | 3044 |
| 12280 | 3044 |
| 12281 | 3044 |
| 12282 | 3044 |
| 12283 | 3044 |
| 12284 | 3044 |
| 12285 | 3044 |
| 12286 | 3044 |
| 12287 | 3044 |
| 12288 | 3044 |
| 12289 | 3044 |
| 12290 | 3044 |
| 12291 | 3044 |
| 12292 | 3044 |
| 12293 | 3044 |
| 12294 | 3044 |
| 12295 | 3044 |
| 12296 | 3044 |
| 12297 | 3044 |
| 12298 | 3044 |
| 12299 | 3044 |
| 12300 | 3044 |
| 12301 | 3044 |
| 12302 | 3044 |
| 12303 | 3044 |
| 12304 | 3044 |
| 12305 | 3044 |
| 12306 | 3044 |
| 12307 | 3044 |
| 12308 | 3044 |
| 12309 | 3044 |
| 12310 | 3044 |
| 12311 | 3044 |
| 12312 | 3044 |
| 12313 | 3044 |
| 12314 | 3044 |
| 12315 | 3044 |
| 12316 | 3052 |
| 12317 | 3052 |
| 12318 | 3052 |
| 12319 | 3052 |
| 12320 | 3052 |
| 12321 | 3052 |
| 12322 | 3052 |
| 12323 | 3052 |
| 12324 | 3052 |
| 12325 | 3052 |
| 12326 | 3052 |
| 12327 | 3052 |
| 12328 | 3052 |
| 12329 | 3052 |
| 12330 | 3052 |
| 12331 | 3052 |
| 12332 | 3052 |
| 12333 | 3052 |
| 12334 | 3052 |
| 12335 | 3052 |
| 12336 | 3052 |
| 12337 | 3052 |
| 12338 | 3052 |
| 12339 | 3052 |
| 12340 | 3052 |
| 12341 | 3052 |
| 12342 | 3052 |
| 12343 | 3052 |
| 12344 | 3052 |
| 12345 | 3052 |
| 12346 | 3052 |
| 12347 | 3052 |
| 12348 | 3052 |
| 12349 | 3052 |
| 12350 | 3052 |
| 12351 | 3052 |
| 12352 | 3052 |
| 12353 | 3052 |
| 12354 | 3052 |
| 12355 | 3052 |
| 12356 | 3052 |
| 12357 | 3052 |
| 12358 | 3052 |
| 12359 | 3052 |
| 12360 | 3052 |
| 12361 | 3052 |
| 12362 | 3052 |
| 12363 | 3052 |
| 12364 | 3064 |
| 12365 | 3064 |
| 12366 | 3064 |
| 12367 | 3064 |
| 12368 | 3064 |
| 12369 | 3064 |
| 12370 | 3064 |
| 12371 | 3064 |
| 12372 | 3064 |
| 12373 | 3064 |
| 12374 | 3064 |
| 12375 | 3064 |
| 12376 | 3064 |
| 12377 | 3064 |
| 12378 | 3064 |
| 12379 | 3064 |
| 12380 | 3064 |
| 12381 | 3064 |
| 12382 | 3064 |
| 12383 | 3064 |
| 12384 | 3064 |
| 12385 | 3064 |
| 12386 | 3064 |
| 12387 | 3064 |
| 12388 | 3064 |
| 12389 | 3064 |
| 12390 | 3064 |
| 12391 | 3064 |
| 12392 | 3064 |
| 12393 | 3064 |
| 12394 | 3064 |
| 12395 | 3064 |
| 12396 | 3064 |
| 12397 | 3064 |
| 12398 | 3064 |
| 12399 | 3064 |
| 12400 | 3064 |
| 12401 | 3064 |
| 12402 | 3064 |
| 12403 | 3064 |
| 12404 | 3064 |
| 12405 | 3064 |
| 12406 | 3064 |
| 12407 | 3064 |
| 12408 | 3064 |
| 12409 | 3064 |
| 12410 | 3064 |
| 12411 | 3064 |
| 12412 | 3048 |
| 12413 | 3048 |
| 12414 | 3048 |
| 12415 | 3048 |
| 12416 | 3048 |
| 12417 | 3048 |
| 12418 | 3048 |
| 12419 | 3048 |
| 12420 | 3048 |
| 12421 | 3048 |
| 12422 | 3048 |
| 12423 | 3048 |
| 12424 | 3048 |
| 12425 | 3048 |
| 12426 | 3048 |
| 12427 | 3048 |
| 12428 | 3048 |
| 12429 | 3048 |
| 12430 | 3048 |
| 12431 | 3048 |
| 12432 | 3048 |
| 12433 | 3048 |
| 12434 | 3048 |
| 12435 | 3048 |
| 12436 | 3048 |
| 12437 | 3048 |
| 12438 | 3048 |
| 12439 | 3048 |
| 12440 | 3048 |
| 12441 | 3048 |
| 12442 | 3048 |
| 12443 | 3048 |
| 12444 | 3048 |
| 12445 | 3048 |
| 12446 | 3048 |
| 12447 | 3048 |
| 12448 | 3048 |
| 12449 | 3048 |
| 12450 | 3048 |
| 12451 | 3048 |
| 12452 | 3048 |
| 12453 | 3048 |
| 12454 | 3048 |
| 12455 | 3048 |
| 12456 | 3048 |
| 12457 | 3048 |
| 12458 | 3048 |
| 12459 | 3048 |
| 12460 | 3032 |
| 12461 | 3032 |
| 12462 | 3032 |
| 12463 | 3032 |
| 12464 | 3032 |
| 12465 | 3032 |
| 12466 | 3032 |
| 12467 | 3032 |
| 12468 | 3032 |
| 12469 | 3032 |
| 12470 | 3032 |
| 12471 | 3032 |
| 12472 | 3032 |
| 12473 | 3032 |
| 12474 | 3032 |
| 12475 | 3032 |
| 12476 | 3032 |
| 12477 | 3032 |
| 12478 | 3032 |
| 12479 | 3032 |
| 12480 | 3032 |
| 12481 | 3032 |
| 12482 | 3032 |
| 12483 | 3032 |
| 12484 | 3032 |
| 12485 | 3032 |
| 12486 | 3032 |
| 12487 | 3032 |
| 12488 | 3032 |
| 12489 | 3032 |
| 12490 | 3032 |
| 12491 | 3032 |
| 12492 | 3032 |
| 12493 | 3032 |
| 12494 | 3032 |
| 12495 | 3032 |
| 12496 | 3032 |
| 12497 | 3032 |
| 12498 | 3032 |
| 12499 | 3032 |
| 12500 | 3032 |
| 12501 | 3032 |
| 12502 | 3032 |
| 12503 | 3032 |
| 12504 | 3032 |
| 12505 | 3032 |
| 12506 | 3032 |
| 12507 | 3032 |
| 12508 | 3032 |
| 12509 | 3040 |
| 12510 | 3040 |
| 12511 | 3040 |
| 12512 | 3040 |
| 12513 | 3040 |
| 12514 | 3040 |
| 12515 | 3040 |
| 12516 | 3040 |
| 12517 | 3040 |
| 12518 | 3040 |
| 12519 | 3040 |
| 12520 | 3040 |
| 12521 | 3040 |
| 12522 | 3040 |
| 12523 | 3040 |
| 12524 | 3040 |
| 12525 | 3040 |
| 12526 | 3040 |
| 12527 | 3040 |
| 12528 | 3040 |
| 12529 | 3040 |
| 12530 | 3040 |
| 12531 | 3040 |
| 12532 | 3040 |
| 12533 | 3040 |
| 12534 | 3040 |
| 12535 | 3040 |
| 12536 | 3040 |
| 12537 | 3040 |
| 12538 | 3040 |
| 12539 | 3040 |
| 12540 | 3040 |
| 12541 | 3040 |
| 12542 | 3040 |
| 12543 | 3040 |
| 12544 | 3040 |
| 12545 | 3040 |
| 12546 | 3040 |
| 12547 | 3040 |
| 12548 | 3040 |
| 12549 | 3040 |
| 12550 | 3040 |
| 12551 | 3040 |
| 12552 | 3040 |
| 12553 | 3040 |
| 12554 | 3040 |
| 12555 | 3040 |
| 12556 | 3040 |
| 12557 | 3064 |
| 12558 | 3064 |
| 12559 | 3064 |
| 12560 | 3064 |
| 12561 | 3064 |
| 12562 | 3064 |
| 12563 | 3064 |
| 12564 | 3064 |
| 12565 | 3064 |
| 12566 | 3064 |
| 12567 | 3064 |
| 12568 | 3064 |
| 12569 | 3064 |
| 12570 | 3064 |
| 12571 | 3064 |
| 12572 | 3064 |
| 12573 | 3064 |
| 12574 | 3064 |
| 12575 | 3064 |
| 12576 | 3064 |
| 12577 | 3064 |
| 12578 | 3064 |
| 12579 | 3064 |
| 12580 | 3064 |
| 12581 | 3064 |
| 12582 | 3064 |
| 12583 | 3064 |
| 12584 | 3064 |
| 12585 | 3064 |
| 12586 | 3064 |
| 12587 | 3064 |
| 12588 | 3064 |
| 12589 | 3064 |
| 12590 | 3064 |
| 12591 | 3064 |
| 12592 | 3064 |
| 12593 | 3064 |
| 12594 | 3064 |
| 12595 | 3064 |
| 12596 | 3064 |
| 12597 | 3064 |
| 12598 | 3064 |
| 12599 | 3064 |
| 12600 | 3064 |
| 12601 | 3064 |
| 12602 | 3064 |
| 12603 | 3064 |
| 12604 | 3064 |
| 12605 | 3048 |
| 12606 | 3048 |
| 12607 | 3048 |
| 12608 | 3048 |
| 12609 | 3048 |
| 12610 | 3048 |
| 12611 | 3048 |
| 12612 | 3048 |
| 12613 | 3048 |
| 12614 | 3048 |
| 12615 | 3048 |
| 12616 | 3048 |
| 12617 | 3048 |
| 12618 | 3048 |
| 12619 | 3048 |
| 12620 | 3048 |
| 12621 | 3048 |
| 12622 | 3048 |
| 12623 | 3048 |
| 12624 | 3048 |
| 12625 | 3048 |
| 12626 | 3048 |
| 12627 | 3048 |
| 12628 | 3048 |
| 12629 | 3048 |
| 12630 | 3048 |
| 12631 | 3048 |
| 12632 | 3048 |
| 12633 | 3048 |
| 12634 | 3048 |
| 12635 | 3048 |
| 12636 | 3048 |
| 12637 | 3048 |
| 12638 | 3048 |
| 12639 | 3048 |
| 12640 | 3048 |
| 12641 | 3048 |
| 12642 | 3048 |
| 12643 | 3048 |
| 12644 | 3048 |
| 12645 | 3048 |
| 12646 | 3048 |
| 12647 | 3048 |
| 12648 | 3048 |
| 12649 | 3048 |
| 12650 | 3048 |
| 12651 | 3048 |
| 12652 | 3048 |
| 12653 | 3024 |
| 12654 | 3024 |
| 12655 | 3024 |
| 12656 | 3024 |
| 12657 | 3024 |
| 12658 | 3024 |
| 12659 | 3024 |
| 12660 | 3024 |
| 12661 | 3024 |
| 12662 | 3024 |
| 12663 | 3024 |
| 12664 | 3024 |
| 12665 | 3024 |
| 12666 | 3024 |
| 12667 | 3024 |
| 12668 | 3024 |
| 12669 | 3024 |
| 12670 | 3024 |
| 12671 | 3024 |
| 12672 | 3024 |
| 12673 | 3024 |
| 12674 | 3024 |
| 12675 | 3024 |
| 12676 | 3024 |
| 12677 | 3024 |
| 12678 | 3024 |
| 12679 | 3024 |
| 12680 | 3024 |
| 12681 | 3024 |
| 12682 | 3024 |
| 12683 | 3024 |
| 12684 | 3024 |
| 12685 | 3024 |
| 12686 | 3024 |
| 12687 | 3024 |
| 12688 | 3024 |
| 12689 | 3024 |
| 12690 | 3024 |
| 12691 | 3024 |
| 12692 | 3024 |
| 12693 | 3024 |
| 12694 | 3024 |
| 12695 | 3024 |
| 12696 | 3024 |
| 12697 | 3024 |
| 12698 | 3024 |
| 12699 | 3024 |
| 12700 | 3024 |
| 12701 | 3032 |
| 12702 | 3032 |
| 12703 | 3032 |
| 12704 | 3032 |
| 12705 | 3032 |
| 12706 | 3032 |
| 12707 | 3032 |
| 12708 | 3032 |
| 12709 | 3032 |
| 12710 | 3032 |
| 12711 | 3032 |
| 12712 | 3032 |
| 12713 | 3032 |
| 12714 | 3032 |
| 12715 | 3032 |
| 12716 | 3032 |
| 12717 | 3032 |
| 12718 | 3032 |
| 12719 | 3032 |
| 12720 | 3032 |
| 12721 | 3032 |
| 12722 | 3032 |
| 12723 | 3032 |
| 12724 | 3032 |
| 12725 | 3032 |
| 12726 | 3032 |
| 12727 | 3032 |
| 12728 | 3032 |
| 12729 | 3032 |
| 12730 | 3032 |
| 12731 | 3032 |
| 12732 | 3032 |
| 12733 | 3032 |
| 12734 | 3032 |
| 12735 | 3032 |
| 12736 | 3032 |
| 12737 | 3032 |
| 12738 | 3032 |
| 12739 | 3032 |
| 12740 | 3032 |
| 12741 | 3032 |
| 12742 | 3032 |
| 12743 | 3032 |
| 12744 | 3032 |
| 12745 | 3032 |
| 12746 | 3032 |
| 12747 | 3032 |
| 12748 | 3032 |
| 12749 | 3040 |
| 12750 | 3040 |
| 12751 | 3040 |
| 12752 | 3040 |
| 12753 | 3040 |
| 12754 | 3040 |
| 12755 | 3040 |
| 12756 | 3040 |
| 12757 | 3040 |
| 12758 | 3040 |
| 12759 | 3040 |
| 12760 | 3040 |
| 12761 | 3040 |
| 12762 | 3040 |
| 12763 | 3040 |
| 12764 | 3040 |
| 12765 | 3040 |
| 12766 | 3040 |
| 12767 | 3040 |
| 12768 | 3040 |
| 12769 | 3040 |
| 12770 | 3040 |
| 12771 | 3040 |
| 12772 | 3040 |
| 12773 | 3040 |
| 12774 | 3040 |
| 12775 | 3040 |
| 12776 | 3040 |
| 12777 | 3040 |
| 12778 | 3040 |
| 12779 | 3040 |
| 12780 | 3040 |
| 12781 | 3040 |
| 12782 | 3040 |
| 12783 | 3040 |
| 12784 | 3040 |
| 12785 | 3040 |
| 12786 | 3040 |
| 12787 | 3040 |
| 12788 | 3040 |
| 12789 | 3040 |
| 12790 | 3040 |
| 12791 | 3040 |
| 12792 | 3040 |
| 12793 | 3040 |
| 12794 | 3040 |
| 12795 | 3040 |
| 12796 | 3040 |
| 12797 | 3036 |
| 12798 | 3036 |
| 12799 | 3036 |
| 12800 | 3036 |
| 12801 | 3036 |
| 12802 | 3036 |
| 12803 | 3036 |
| 12804 | 3036 |
| 12805 | 3036 |
| 12806 | 3036 |
| 12807 | 3036 |
| 12808 | 3036 |
| 12809 | 3036 |
| 12810 | 3036 |
| 12811 | 3036 |
| 12812 | 3036 |
| 12813 | 3036 |
| 12814 | 3036 |
| 12815 | 3036 |
| 12816 | 3036 |
| 12817 | 3036 |
| 12818 | 3036 |
| 12819 | 3036 |
| 12820 | 3036 |
| 12821 | 3036 |
| 12822 | 3036 |
| 12823 | 3036 |
| 12824 | 3036 |
| 12825 | 3036 |
| 12826 | 3036 |
| 12827 | 3036 |
| 12828 | 3036 |
| 12829 | 3036 |
| 12830 | 3036 |
| 12831 | 3036 |
| 12832 | 3036 |
| 12833 | 3036 |
| 12834 | 3036 |
| 12835 | 3036 |
| 12836 | 3036 |
| 12837 | 3036 |
| 12838 | 3036 |
| 12839 | 3036 |
| 12840 | 3036 |
| 12841 | 3036 |
| 12842 | 3036 |
| 12843 | 3036 |
| 12844 | 3036 |
| 12845 | 3048 |
| 12846 | 3048 |
| 12847 | 3048 |
| 12848 | 3048 |
| 12849 | 3048 |
| 12850 | 3048 |
| 12851 | 3048 |
| 12852 | 3048 |
| 12853 | 3048 |
| 12854 | 3048 |
| 12855 | 3048 |
| 12856 | 3048 |
| 12857 | 3048 |
| 12858 | 3048 |
| 12859 | 3048 |
| 12860 | 3048 |
| 12861 | 3048 |
| 12862 | 3048 |
| 12863 | 3048 |
| 12864 | 3048 |
| 12865 | 3048 |
| 12866 | 3048 |
| 12867 | 3048 |
| 12868 | 3048 |
| 12869 | 3048 |
| 12870 | 3048 |
| 12871 | 3048 |
| 12872 | 3048 |
| 12873 | 3048 |
| 12874 | 3048 |
| 12875 | 3048 |
| 12876 | 3048 |
| 12877 | 3048 |
| 12878 | 3048 |
| 12879 | 3048 |
| 12880 | 3048 |
| 12881 | 3048 |
| 12882 | 3048 |
| 12883 | 3048 |
| 12884 | 3048 |
| 12885 | 3048 |
| 12886 | 3048 |
| 12887 | 3048 |
| 12888 | 3048 |
| 12889 | 3048 |
| 12890 | 3048 |
| 12891 | 3048 |
| 12892 | 3048 |
| 12893 | 3048 |
| 12894 | 3076 |
| 12895 | 3076 |
| 12896 | 3076 |
| 12897 | 3076 |
| 12898 | 3076 |
| 12899 | 3076 |
| 12900 | 3076 |
| 12901 | 3076 |
| 12902 | 3076 |
| 12903 | 3076 |
| 12904 | 3076 |
| 12905 | 3076 |
| 12906 | 3076 |
| 12907 | 3076 |
| 12908 | 3076 |
| 12909 | 3076 |
| 12910 | 3076 |
| 12911 | 3076 |
| 12912 | 3076 |
| 12913 | 3076 |
| 12914 | 3076 |
| 12915 | 3076 |
| 12916 | 3076 |
| 12917 | 3076 |
| 12918 | 3076 |
| 12919 | 3076 |
| 12920 | 3076 |
| 12921 | 3076 |
| 12922 | 3076 |
| 12923 | 3076 |
| 12924 | 3076 |
| 12925 | 3076 |
| 12926 | 3076 |
| 12927 | 3076 |
| 12928 | 3076 |
| 12929 | 3076 |
| 12930 | 3076 |
| 12931 | 3076 |
| 12932 | 3076 |
| 12933 | 3076 |
| 12934 | 3076 |
| 12935 | 3076 |
| 12936 | 3076 |
| 12937 | 3076 |
| 12938 | 3076 |
| 12939 | 3076 |
| 12940 | 3076 |
| 12941 | 3076 |
| 12942 | 3056 |
| 12943 | 3056 |
| 12944 | 3056 |
| 12945 | 3056 |
| 12946 | 3056 |
| 12947 | 3056 |
| 12948 | 3056 |
| 12949 | 3056 |
| 12950 | 3056 |
| 12951 | 3056 |
| 12952 | 3056 |
| 12953 | 3056 |
| 12954 | 3056 |
| 12955 | 3056 |
| 12956 | 3056 |
| 12957 | 3056 |
| 12958 | 3056 |
| 12959 | 3056 |
| 12960 | 3056 |
| 12961 | 3056 |
| 12962 | 3056 |
| 12963 | 3056 |
| 12964 | 3056 |
| 12965 | 3056 |
| 12966 | 3056 |
| 12967 | 3056 |
| 12968 | 3056 |
| 12969 | 3056 |
| 12970 | 3056 |
| 12971 | 3056 |
| 12972 | 3056 |
| 12973 | 3056 |
| 12974 | 3056 |
| 12975 | 3056 |
| 12976 | 3056 |
| 12977 | 3056 |
| 12978 | 3056 |
| 12979 | 3056 |
| 12980 | 3056 |
| 12981 | 3056 |
| 12982 | 3056 |
| 12983 | 3056 |
| 12984 | 3056 |
| 12985 | 3056 |
| 12986 | 3056 |
| 12987 | 3056 |
| 12988 | 3056 |
| 12989 | 3056 |
| 12990 | 3024 |
| 12991 | 3024 |
| 12992 | 3024 |
| 12993 | 3024 |
| 12994 | 3024 |
| 12995 | 3024 |
| 12996 | 3024 |
| 12997 | 3024 |
| 12998 | 3024 |
| 12999 | 3024 |
| 13000 | 3024 |
| 13001 | 3024 |
| 13002 | 3024 |
| 13003 | 3024 |
| 13004 | 3024 |
| 13005 | 3024 |
| 13006 | 3024 |
| 13007 | 3024 |
| 13008 | 3024 |
| 13009 | 3024 |
| 13010 | 3024 |
| 13011 | 3024 |
| 13012 | 3024 |
| 13013 | 3024 |
| 13014 | 3024 |
| 13015 | 3024 |
| 13016 | 3024 |
| 13017 | 3024 |
| 13018 | 3024 |
| 13019 | 3024 |
| 13020 | 3024 |
| 13021 | 3024 |
| 13022 | 3024 |
| 13023 | 3024 |
| 13024 | 3024 |
| 13025 | 3024 |
| 13026 | 3024 |
| 13027 | 3024 |
| 13028 | 3024 |
| 13029 | 3024 |
| 13030 | 3024 |
| 13031 | 3024 |
| 13032 | 3024 |
| 13033 | 3024 |
| 13034 | 3024 |
| 13035 | 3024 |
| 13036 | 3024 |
| 13037 | 3024 |
| 13038 | 3064 |
| 13039 | 3064 |
| 13040 | 3064 |
| 13041 | 3064 |
| 13042 | 3064 |
| 13043 | 3064 |
| 13044 | 3064 |
| 13045 | 3064 |
| 13046 | 3064 |
| 13047 | 3064 |
| 13048 | 3064 |
| 13049 | 3064 |
| 13050 | 3064 |
| 13051 | 3064 |
| 13052 | 3064 |
| 13053 | 3064 |
| 13054 | 3064 |
| 13055 | 3064 |
| 13056 | 3064 |
| 13057 | 3064 |
| 13058 | 3064 |
| 13059 | 3064 |
| 13060 | 3064 |
| 13061 | 3064 |
| 13062 | 3064 |
| 13063 | 3064 |
| 13064 | 3064 |
| 13065 | 3064 |
| 13066 | 3064 |
| 13067 | 3064 |
| 13068 | 3064 |
| 13069 | 3064 |
| 13070 | 3064 |
| 13071 | 3064 |
| 13072 | 3064 |
| 13073 | 3064 |
| 13074 | 3064 |
| 13075 | 3064 |
| 13076 | 3064 |
| 13077 | 3064 |
| 13078 | 3064 |
| 13079 | 3064 |
| 13080 | 3064 |
| 13081 | 3064 |
| 13082 | 3064 |
| 13083 | 3064 |
| 13084 | 3064 |
| 13085 | 3064 |
| 13086 | 3056 |
| 13087 | 3056 |
| 13088 | 3056 |
| 13089 | 3056 |
| 13090 | 3056 |
| 13091 | 3056 |
| 13092 | 3056 |
| 13093 | 3056 |
| 13094 | 3056 |
| 13095 | 3056 |
| 13096 | 3056 |
| 13097 | 3056 |
| 13098 | 3056 |
| 13099 | 3056 |
| 13100 | 3056 |
| 13101 | 3056 |
| 13102 | 3056 |
| 13103 | 3056 |
| 13104 | 3056 |
| 13105 | 3056 |
| 13106 | 3056 |
| 13107 | 3056 |
| 13108 | 3056 |
| 13109 | 3056 |
| 13110 | 3056 |
| 13111 | 3056 |
| 13112 | 3056 |
| 13113 | 3056 |
| 13114 | 3056 |
| 13115 | 3056 |
| 13116 | 3056 |
| 13117 | 3056 |
| 13118 | 3056 |
| 13119 | 3056 |
| 13120 | 3056 |
| 13121 | 3056 |
| 13122 | 3056 |
| 13123 | 3056 |
| 13124 | 3056 |
| 13125 | 3056 |
| 13126 | 3056 |
| 13127 | 3056 |
| 13128 | 3056 |
| 13129 | 3056 |
| 13130 | 3056 |
| 13131 | 3056 |
| 13132 | 3056 |
| 13133 | 3056 |
| 13134 | 3056 |
| 13135 | 3048 |
| 13136 | 3048 |
| 13137 | 3048 |
| 13138 | 3048 |
| 13139 | 3048 |
| 13140 | 3048 |
| 13141 | 3048 |
| 13142 | 3048 |
| 13143 | 3048 |
| 13144 | 3048 |
| 13145 | 3048 |
| 13146 | 3048 |
| 13147 | 3048 |
| 13148 | 3048 |
| 13149 | 3048 |
| 13150 | 3048 |
| 13151 | 3048 |
| 13152 | 3048 |
| 13153 | 3048 |
| 13154 | 3048 |
| 13155 | 3048 |
| 13156 | 3048 |
| 13157 | 3048 |
| 13158 | 3048 |
| 13159 | 3048 |
| 13160 | 3048 |
| 13161 | 3048 |
| 13162 | 3048 |
| 13163 | 3048 |
| 13164 | 3048 |
| 13165 | 3048 |
| 13166 | 3048 |
| 13167 | 3048 |
| 13168 | 3048 |
| 13169 | 3048 |
| 13170 | 3048 |
| 13171 | 3048 |
| 13172 | 3048 |
| 13173 | 3048 |
| 13174 | 3048 |
| 13175 | 3048 |
| 13176 | 3048 |
| 13177 | 3048 |
| 13178 | 3048 |
| 13179 | 3048 |
| 13180 | 3048 |
| 13181 | 3048 |
| 13182 | 3048 |
| 13183 | 3032 |
| 13184 | 3032 |
| 13185 | 3032 |
| 13186 | 3032 |
| 13187 | 3032 |
| 13188 | 3032 |
| 13189 | 3032 |
| 13190 | 3032 |
| 13191 | 3032 |
| 13192 | 3032 |
| 13193 | 3032 |
| 13194 | 3032 |
| 13195 | 3032 |
| 13196 | 3032 |
| 13197 | 3032 |
| 13198 | 3032 |
| 13199 | 3032 |
| 13200 | 3032 |
| 13201 | 3032 |
| 13202 | 3032 |
| 13203 | 3032 |
| 13204 | 3032 |
| 13205 | 3032 |
| 13206 | 3032 |
| 13207 | 3032 |
| 13208 | 3032 |
| 13209 | 3032 |
| 13210 | 3032 |
| 13211 | 3032 |
| 13212 | 3032 |
| 13213 | 3032 |
| 13214 | 3032 |
| 13215 | 3032 |
| 13216 | 3032 |
| 13217 | 3032 |
| 13218 | 3032 |
| 13219 | 3032 |
| 13220 | 3032 |
| 13221 | 3032 |
| 13222 | 3032 |
| 13223 | 3032 |
| 13224 | 3032 |
| 13225 | 3032 |
| 13226 | 3032 |
| 13227 | 3032 |
| 13228 | 3032 |
| 13229 | 3032 |
| 13230 | 3032 |
| 13231 | 3288 |
| 13232 | 3288 |
| 13233 | 3288 |
| 13234 | 3288 |
| 13235 | 3288 |
| 13236 | 3288 |
| 13237 | 3288 |
| 13238 | 3288 |
| 13239 | 3288 |
| 13240 | 3288 |
| 13241 | 3288 |
| 13242 | 3288 |
| 13243 | 3288 |
| 13244 | 3288 |
| 13245 | 3288 |
| 13246 | 3288 |
| 13247 | 3288 |
| 13248 | 3288 |
| 13249 | 3288 |
| 13250 | 3288 |
| 13251 | 3288 |
| 13252 | 3288 |
| 13253 | 3288 |
| 13254 | 3288 |
| 13255 | 3288 |
| 13256 | 3288 |
| 13257 | 3288 |
| 13258 | 3288 |
| 13259 | 3288 |
| 13260 | 3288 |
| 13261 | 3288 |
| 13262 | 3288 |
| 13263 | 3288 |
| 13264 | 3288 |
| 13265 | 3288 |
| 13266 | 3288 |
| 13267 | 3288 |
| 13268 | 3288 |
| 13269 | 3288 |
| 13270 | 3288 |
| 13271 | 3288 |
| 13272 | 3288 |
| 13273 | 3288 |
| 13274 | 3288 |
| 13275 | 3288 |
| 13276 | 3288 |
| 13277 | 3288 |
| 13278 | 3288 |
| 13279 | 3288 |
| 13280 | 3288 |
| 13281 | 3288 |
| 13282 | 3288 |
| 13283 | 3288 |
| 13284 | 3288 |
| 13285 | 3288 |
| 13286 | 3288 |
| 13287 | 3288 |
| 13288 | 3288 |
| 13289 | 3288 |
| 13290 | 3288 |
| 13291 | 3288 |
| 13292 | 3288 |
| 13293 | 3288 |
| 13294 | 3288 |
| 13295 | 3288 |
| 13296 | 3288 |
| 13297 | 3288 |
| 13298 | 3288 |
| 13299 | 3288 |
| 13300 | 3288 |
| 13301 | 3288 |
| 13302 | 3288 |
| 13303 | 3288 |
| 13304 | 3288 |
| 13305 | 3288 |
| 13306 | 3288 |
| 13307 | 3288 |
| 13308 | 3288 |
| 13309 | 3288 |
| 13310 | 3288 |
| 13311 | 3288 |
| 13312 | 3288 |
| 13313 | 3288 |
| 13314 | 3288 |
| 13315 | 3288 |
| 13316 | 3288 |
| 13317 | 3288 |
| 13318 | 3288 |
| 13319 | 3288 |
| 13320 | 3288 |
| 13321 | 3288 |
| 13322 | 3288 |
| 13323 | 3288 |
| 13324 | 3288 |
| 13325 | 3288 |
| 13326 | 3288 |
| 13327 | 3288 |
| 13328 | 3072 |
| 13329 | 3072 |
| 13330 | 3072 |
| 13331 | 3072 |
| 13332 | 3072 |
| 13333 | 3072 |
| 13334 | 3072 |
| 13335 | 3072 |
| 13336 | 3072 |
| 13337 | 3072 |
| 13338 | 3072 |
| 13339 | 3072 |
| 13340 | 3072 |
| 13341 | 3072 |
| 13342 | 3072 |
| 13343 | 3072 |
| 13344 | 3072 |
| 13345 | 3072 |
| 13346 | 3072 |
| 13347 | 3072 |
| 13348 | 3072 |
| 13349 | 3072 |
| 13350 | 3072 |
| 13351 | 3072 |
| 13352 | 3072 |
| 13353 | 3072 |
| 13354 | 3072 |
| 13355 | 3072 |
| 13356 | 3072 |
| 13357 | 3072 |
| 13358 | 3072 |
| 13359 | 3072 |
| 13360 | 3072 |
| 13361 | 3072 |
| 13362 | 3072 |
| 13363 | 3072 |
| 13364 | 3072 |
| 13365 | 3072 |
| 13366 | 3072 |
| 13367 | 3072 |
| 13368 | 3072 |
| 13369 | 3072 |
| 13370 | 3072 |
| 13371 | 3072 |
| 13372 | 3072 |
| 13373 | 3072 |
| 13374 | 3072 |
| 13375 | 3072 |
| 13376 | 3048 |
| 13377 | 3048 |
| 13378 | 3048 |
| 13379 | 3048 |
| 13380 | 3048 |
| 13381 | 3048 |
| 13382 | 3048 |
| 13383 | 3048 |
| 13384 | 3048 |
| 13385 | 3048 |
| 13386 | 3048 |
| 13387 | 3048 |
| 13388 | 3048 |
| 13389 | 3048 |
| 13390 | 3048 |
| 13391 | 3048 |
| 13392 | 3048 |
| 13393 | 3048 |
| 13394 | 3048 |
| 13395 | 3048 |
| 13396 | 3048 |
| 13397 | 3048 |
| 13398 | 3048 |
| 13399 | 3048 |
| 13400 | 3048 |
| 13401 | 3048 |
| 13402 | 3048 |
| 13403 | 3048 |
| 13404 | 3048 |
| 13405 | 3048 |
| 13406 | 3048 |
| 13407 | 3048 |
| 13408 | 3048 |
| 13409 | 3048 |
| 13410 | 3048 |
| 13411 | 3048 |
| 13412 | 3048 |
| 13413 | 3048 |
| 13414 | 3048 |
| 13415 | 3048 |
| 13416 | 3048 |
| 13417 | 3048 |
| 13418 | 3048 |
| 13419 | 3048 |
| 13420 | 3048 |
| 13421 | 3048 |
| 13422 | 3048 |
| 13423 | 3048 |
| 13424 | 3092 |
| 13425 | 3092 |
| 13426 | 3092 |
| 13427 | 3092 |
| 13428 | 3092 |
| 13429 | 3092 |
| 13430 | 3092 |
| 13431 | 3092 |
| 13432 | 3092 |
| 13433 | 3092 |
| 13434 | 3092 |
| 13435 | 3092 |
| 13436 | 3092 |
| 13437 | 3092 |
| 13438 | 3092 |
| 13439 | 3092 |
| 13440 | 3092 |
| 13441 | 3092 |
| 13442 | 3092 |
| 13443 | 3092 |
| 13444 | 3092 |
| 13445 | 3092 |
| 13446 | 3092 |
| 13447 | 3092 |
| 13448 | 3092 |
| 13449 | 3092 |
| 13450 | 3092 |
| 13451 | 3092 |
| 13452 | 3092 |
| 13453 | 3092 |
| 13454 | 3092 |
| 13455 | 3092 |
| 13456 | 3092 |
| 13457 | 3092 |
| 13458 | 3092 |
| 13459 | 3092 |
| 13460 | 3092 |
| 13461 | 3092 |
| 13462 | 3092 |
| 13463 | 3092 |
| 13464 | 3092 |
| 13465 | 3092 |
| 13466 | 3092 |
| 13467 | 3092 |
| 13468 | 3092 |
| 13469 | 3092 |
| 13470 | 3092 |
| 13471 | 3092 |
| 13472 | 3052 |
| 13473 | 3052 |
| 13474 | 3052 |
| 13475 | 3052 |
| 13476 | 3052 |
| 13477 | 3052 |
| 13478 | 3052 |
| 13479 | 3052 |
| 13480 | 3052 |
| 13481 | 3052 |
| 13482 | 3052 |
| 13483 | 3052 |
| 13484 | 3052 |
| 13485 | 3052 |
| 13486 | 3052 |
| 13487 | 3052 |
| 13488 | 3052 |
| 13489 | 3052 |
| 13490 | 3052 |
| 13491 | 3052 |
| 13492 | 3052 |
| 13493 | 3052 |
| 13494 | 3052 |
| 13495 | 3052 |
| 13496 | 3052 |
| 13497 | 3052 |
| 13498 | 3052 |
| 13499 | 3052 |
| 13500 | 3052 |
| 13501 | 3052 |
| 13502 | 3052 |
| 13503 | 3052 |
| 13504 | 3052 |
| 13505 | 3052 |
| 13506 | 3052 |
| 13507 | 3052 |
| 13508 | 3052 |
| 13509 | 3052 |
| 13510 | 3052 |
| 13511 | 3052 |
| 13512 | 3052 |
| 13513 | 3052 |
| 13514 | 3052 |
| 13515 | 3052 |
| 13516 | 3052 |
| 13517 | 3052 |
| 13518 | 3052 |
| 13519 | 3052 |
| 13520 | 3052 |
| 13521 | 3052 |
| 13522 | 3052 |
| 13523 | 3052 |
| 13524 | 3052 |
| 13525 | 3052 |
| 13526 | 3052 |
| 13527 | 3052 |
| 13528 | 3052 |
| 13529 | 3052 |
| 13530 | 3052 |
| 13531 | 3052 |
| 13532 | 3052 |
| 13533 | 3052 |
| 13534 | 3052 |
| 13535 | 3052 |
| 13536 | 3052 |
| 13537 | 3052 |
| 13538 | 3052 |
| 13539 | 3052 |
| 13540 | 3052 |
| 13541 | 3052 |
| 13542 | 3052 |
| 13543 | 3052 |
| 13544 | 3052 |
| 13545 | 3052 |
| 13546 | 3052 |
| 13547 | 3052 |
| 13548 | 3052 |
| 13549 | 3052 |
| 13550 | 3052 |
| 13551 | 3052 |
| 13552 | 3052 |
| 13553 | 3052 |
| 13554 | 3052 |
| 13555 | 3052 |
| 13556 | 3052 |
| 13557 | 3052 |
| 13558 | 3052 |
| 13559 | 3052 |
| 13560 | 3052 |
| 13561 | 3052 |
| 13562 | 3052 |
| 13563 | 3052 |
| 13564 | 3052 |
| 13565 | 3052 |
| 13566 | 3052 |
| 13567 | 3052 |
| 13568 | 3052 |
| 13569 | 3068 |
| 13570 | 3068 |
| 13571 | 3068 |
| 13572 | 3068 |
| 13573 | 3068 |
| 13574 | 3068 |
| 13575 | 3068 |
| 13576 | 3068 |
| 13577 | 3068 |
| 13578 | 3068 |
| 13579 | 3068 |
| 13580 | 3068 |
| 13581 | 3068 |
| 13582 | 3068 |
| 13583 | 3068 |
| 13584 | 3068 |
| 13585 | 3068 |
| 13586 | 3068 |
| 13587 | 3068 |
| 13588 | 3068 |
| 13589 | 3068 |
| 13590 | 3068 |
| 13591 | 3068 |
| 13592 | 3068 |
| 13593 | 3068 |
| 13594 | 3068 |
| 13595 | 3068 |
| 13596 | 3068 |
| 13597 | 3068 |
| 13598 | 3068 |
| 13599 | 3068 |
| 13600 | 3068 |
| 13601 | 3068 |
| 13602 | 3068 |
| 13603 | 3068 |
| 13604 | 3068 |
| 13605 | 3068 |
| 13606 | 3068 |
| 13607 | 3068 |
| 13608 | 3068 |
| 13609 | 3068 |
| 13610 | 3068 |
| 13611 | 3068 |
| 13612 | 3068 |
| 13613 | 3068 |
| 13614 | 3068 |
| 13615 | 3068 |
| 13616 | 3068 |
| 13617 | 3048 |
| 13618 | 3048 |
| 13619 | 3048 |
| 13620 | 3048 |
| 13621 | 3048 |
| 13622 | 3048 |
| 13623 | 3048 |
| 13624 | 3048 |
| 13625 | 3048 |
| 13626 | 3048 |
| 13627 | 3048 |
| 13628 | 3048 |
| 13629 | 3048 |
| 13630 | 3048 |
| 13631 | 3048 |
| 13632 | 3048 |
| 13633 | 3048 |
| 13634 | 3048 |
| 13635 | 3048 |
| 13636 | 3048 |
| 13637 | 3048 |
| 13638 | 3048 |
| 13639 | 3048 |
| 13640 | 3048 |
| 13641 | 3048 |
| 13642 | 3048 |
| 13643 | 3048 |
| 13644 | 3048 |
| 13645 | 3048 |
| 13646 | 3048 |
| 13647 | 3048 |
| 13648 | 3048 |
| 13649 | 3048 |
| 13650 | 3048 |
| 13651 | 3048 |
| 13652 | 3048 |
| 13653 | 3048 |
| 13654 | 3048 |
| 13655 | 3048 |
| 13656 | 3048 |
| 13657 | 3048 |
| 13658 | 3048 |
| 13659 | 3048 |
| 13660 | 3048 |
| 13661 | 3048 |
| 13662 | 3048 |
| 13663 | 3048 |
| 13664 | 3048 |
| 13665 | 3108 |
| 13666 | 3108 |
| 13667 | 3108 |
| 13668 | 3108 |
| 13669 | 3108 |
| 13670 | 3108 |
| 13671 | 3108 |
| 13672 | 3108 |
| 13673 | 3108 |
| 13674 | 3108 |
| 13675 | 3108 |
| 13676 | 3108 |
| 13677 | 3108 |
| 13678 | 3108 |
| 13679 | 3108 |
| 13680 | 3108 |
| 13681 | 3108 |
| 13682 | 3108 |
| 13683 | 3108 |
| 13684 | 3108 |
| 13685 | 3108 |
| 13686 | 3108 |
| 13687 | 3108 |
| 13688 | 3108 |
| 13689 | 3108 |
| 13690 | 3108 |
| 13691 | 3108 |
| 13692 | 3108 |
| 13693 | 3108 |
| 13694 | 3108 |
| 13695 | 3108 |
| 13696 | 3108 |
| 13697 | 3108 |
| 13698 | 3108 |
| 13699 | 3108 |
| 13700 | 3108 |
| 13701 | 3108 |
| 13702 | 3108 |
| 13703 | 3108 |
| 13704 | 3108 |
| 13705 | 3108 |
| 13706 | 3108 |
| 13707 | 3108 |
| 13708 | 3108 |
| 13709 | 3108 |
| 13710 | 3108 |
| 13711 | 3108 |
| 13712 | 3108 |
| 13713 | 3108 |
| 13714 | 3056 |
| 13715 | 3056 |
| 13716 | 3056 |
| 13717 | 3056 |
| 13718 | 3056 |
| 13719 | 3056 |
| 13720 | 3056 |
| 13721 | 3056 |
| 13722 | 3056 |
| 13723 | 3056 |
| 13724 | 3056 |
| 13725 | 3056 |
| 13726 | 3056 |
| 13727 | 3056 |
| 13728 | 3056 |
| 13729 | 3056 |
| 13730 | 3056 |
| 13731 | 3056 |
| 13732 | 3056 |
| 13733 | 3056 |
| 13734 | 3056 |
| 13735 | 3056 |
| 13736 | 3056 |
| 13737 | 3056 |
| 13738 | 3056 |
| 13739 | 3056 |
| 13740 | 3056 |
| 13741 | 3056 |
| 13742 | 3056 |
| 13743 | 3056 |
| 13744 | 3056 |
| 13745 | 3056 |
| 13746 | 3056 |
| 13747 | 3056 |
| 13748 | 3056 |
| 13749 | 3056 |
| 13750 | 3056 |
| 13751 | 3056 |
| 13752 | 3056 |
| 13753 | 3056 |
| 13754 | 3056 |
| 13755 | 3056 |
| 13756 | 3056 |
| 13757 | 3056 |
| 13758 | 3056 |
| 13759 | 3056 |
| 13760 | 3056 |
| 13761 | 3056 |
| 13762 | 3048 |
| 13763 | 3048 |
| 13764 | 3048 |
| 13765 | 3048 |
| 13766 | 3048 |
| 13767 | 3048 |
| 13768 | 3048 |
| 13769 | 3048 |
| 13770 | 3048 |
| 13771 | 3048 |
| 13772 | 3048 |
| 13773 | 3048 |
| 13774 | 3048 |
| 13775 | 3048 |
| 13776 | 3048 |
| 13777 | 3048 |
| 13778 | 3048 |
| 13779 | 3048 |
| 13780 | 3048 |
| 13781 | 3048 |
| 13782 | 3048 |
| 13783 | 3048 |
| 13784 | 3048 |
| 13785 | 3048 |
| 13786 | 3048 |
| 13787 | 3048 |
| 13788 | 3048 |
| 13789 | 3048 |
| 13790 | 3048 |
| 13791 | 3048 |
| 13792 | 3048 |
| 13793 | 3048 |
| 13794 | 3048 |
| 13795 | 3048 |
| 13796 | 3048 |
| 13797 | 3048 |
| 13798 | 3048 |
| 13799 | 3048 |
| 13800 | 3048 |
| 13801 | 3048 |
| 13802 | 3048 |
| 13803 | 3048 |
| 13804 | 3048 |
| 13805 | 3048 |
| 13806 | 3048 |
| 13807 | 3048 |
| 13808 | 3048 |
| 13809 | 3048 |
| 13810 | 3064 |
| 13811 | 3064 |
| 13812 | 3064 |
| 13813 | 3064 |
| 13814 | 3064 |
| 13815 | 3064 |
| 13816 | 3064 |
| 13817 | 3064 |
| 13818 | 3064 |
| 13819 | 3064 |
| 13820 | 3064 |
| 13821 | 3064 |
| 13822 | 3064 |
| 13823 | 3064 |
| 13824 | 3064 |
| 13825 | 3064 |
| 13826 | 3064 |
| 13827 | 3064 |
| 13828 | 3064 |
| 13829 | 3064 |
| 13830 | 3064 |
| 13831 | 3064 |
| 13832 | 3064 |
| 13833 | 3064 |
| 13834 | 3064 |
| 13835 | 3064 |
| 13836 | 3064 |
| 13837 | 3064 |
| 13838 | 3064 |
| 13839 | 3064 |
| 13840 | 3064 |
| 13841 | 3064 |
| 13842 | 3064 |
| 13843 | 3064 |
| 13844 | 3064 |
| 13845 | 3064 |
| 13846 | 3064 |
| 13847 | 3064 |
| 13848 | 3064 |
| 13849 | 3064 |
| 13850 | 3064 |
| 13851 | 3064 |
| 13852 | 3064 |
| 13853 | 3064 |
| 13854 | 3064 |
| 13855 | 3064 |
| 13856 | 3064 |
| 13857 | 3064 |
| 13858 | 3100 |
| 13859 | 3100 |
| 13860 | 3100 |
| 13861 | 3100 |
| 13862 | 3100 |
| 13863 | 3100 |
| 13864 | 3100 |
| 13865 | 3100 |
| 13866 | 3100 |
| 13867 | 3100 |
| 13868 | 3100 |
| 13869 | 3100 |
| 13870 | 3100 |
| 13871 | 3100 |
| 13872 | 3100 |
| 13873 | 3100 |
| 13874 | 3100 |
| 13875 | 3100 |
| 13876 | 3100 |
| 13877 | 3100 |
| 13878 | 3100 |
| 13879 | 3100 |
| 13880 | 3100 |
| 13881 | 3100 |
| 13882 | 3100 |
| 13883 | 3100 |
| 13884 | 3100 |
| 13885 | 3100 |
| 13886 | 3100 |
| 13887 | 3100 |
| 13888 | 3100 |
| 13889 | 3100 |
| 13890 | 3100 |
| 13891 | 3100 |
| 13892 | 3100 |
| 13893 | 3100 |
| 13894 | 3100 |
| 13895 | 3100 |
| 13896 | 3100 |
| 13897 | 3100 |
| 13898 | 3100 |
| 13899 | 3100 |
| 13900 | 3100 |
| 13901 | 3100 |
| 13902 | 3100 |
| 13903 | 3100 |
| 13904 | 3100 |
| 13905 | 3100 |
| 13906 | 3096 |
| 13907 | 3096 |
| 13908 | 3096 |
| 13909 | 3096 |
| 13910 | 3096 |
| 13911 | 3096 |
| 13912 | 3096 |
| 13913 | 3096 |
| 13914 | 3096 |
| 13915 | 3096 |
| 13916 | 3096 |
| 13917 | 3096 |
| 13918 | 3096 |
| 13919 | 3096 |
| 13920 | 3096 |
| 13921 | 3096 |
| 13922 | 3096 |
| 13923 | 3096 |
| 13924 | 3096 |
| 13925 | 3096 |
| 13926 | 3096 |
| 13927 | 3096 |
| 13928 | 3096 |
| 13929 | 3096 |
| 13930 | 3096 |
| 13931 | 3096 |
| 13932 | 3096 |
| 13933 | 3096 |
| 13934 | 3096 |
| 13935 | 3096 |
| 13936 | 3096 |
| 13937 | 3096 |
| 13938 | 3096 |
| 13939 | 3096 |
| 13940 | 3096 |
| 13941 | 3096 |
| 13942 | 3096 |
| 13943 | 3096 |
| 13944 | 3096 |
| 13945 | 3096 |
| 13946 | 3096 |
| 13947 | 3096 |
| 13948 | 3096 |
| 13949 | 3096 |
| 13950 | 3096 |
| 13951 | 3096 |
| 13952 | 3096 |
| 13953 | 3096 |
| 13954 | 3052 |
| 13955 | 3052 |
| 13956 | 3052 |
| 13957 | 3052 |
| 13958 | 3052 |
| 13959 | 3052 |
| 13960 | 3052 |
| 13961 | 3052 |
| 13962 | 3052 |
| 13963 | 3052 |
| 13964 | 3052 |
| 13965 | 3052 |
| 13966 | 3052 |
| 13967 | 3052 |
| 13968 | 3052 |
| 13969 | 3052 |
| 13970 | 3052 |
| 13971 | 3052 |
| 13972 | 3052 |
| 13973 | 3052 |
| 13974 | 3052 |
| 13975 | 3052 |
| 13976 | 3052 |
| 13977 | 3052 |
| 13978 | 3052 |
| 13979 | 3052 |
| 13980 | 3052 |
| 13981 | 3052 |
| 13982 | 3052 |
| 13983 | 3052 |
| 13984 | 3052 |
| 13985 | 3052 |
| 13986 | 3052 |
| 13987 | 3052 |
| 13988 | 3052 |
| 13989 | 3052 |
| 13990 | 3052 |
| 13991 | 3052 |
| 13992 | 3052 |
| 13993 | 3052 |
| 13994 | 3052 |
| 13995 | 3052 |
| 13996 | 3052 |
| 13997 | 3052 |
| 13998 | 3052 |
| 13999 | 3052 |
| 14000 | 3052 |
| 14001 | 3052 |
| 14002 | 3060 |
| 14003 | 3060 |
| 14004 | 3060 |
| 14005 | 3060 |
| 14006 | 3060 |
| 14007 | 3060 |
| 14008 | 3060 |
| 14009 | 3060 |
| 14010 | 3060 |
| 14011 | 3060 |
| 14012 | 3060 |
| 14013 | 3060 |
| 14014 | 3060 |
| 14015 | 3060 |
| 14016 | 3060 |
| 14017 | 3060 |
| 14018 | 3060 |
| 14019 | 3060 |
| 14020 | 3060 |
| 14021 | 3060 |
| 14022 | 3060 |
| 14023 | 3060 |
| 14024 | 3060 |
| 14025 | 3060 |
| 14026 | 3060 |
| 14027 | 3060 |
| 14028 | 3060 |
| 14029 | 3060 |
| 14030 | 3060 |
| 14031 | 3060 |
| 14032 | 3060 |
| 14033 | 3060 |
| 14034 | 3060 |
| 14035 | 3060 |
| 14036 | 3060 |
| 14037 | 3060 |
| 14038 | 3060 |
| 14039 | 3060 |
| 14040 | 3060 |
| 14041 | 3060 |
| 14042 | 3060 |
| 14043 | 3060 |
| 14044 | 3060 |
| 14045 | 3060 |
| 14046 | 3060 |
| 14047 | 3060 |
| 14048 | 3060 |
| 14049 | 3060 |
| 14050 | 3056 |
| 14051 | 3056 |
| 14052 | 3056 |
| 14053 | 3056 |
| 14054 | 3056 |
| 14055 | 3056 |
| 14056 | 3056 |
| 14057 | 3056 |
| 14058 | 3056 |
| 14059 | 3056 |
| 14060 | 3056 |
| 14061 | 3056 |
| 14062 | 3056 |
| 14063 | 3056 |
| 14064 | 3056 |
| 14065 | 3056 |
| 14066 | 3056 |
| 14067 | 3056 |
| 14068 | 3056 |
| 14069 | 3056 |
| 14070 | 3056 |
| 14071 | 3056 |
| 14072 | 3056 |
| 14073 | 3056 |
| 14074 | 3056 |
| 14075 | 3056 |
| 14076 | 3056 |
| 14077 | 3056 |
| 14078 | 3056 |
| 14079 | 3056 |
| 14080 | 3056 |
| 14081 | 3056 |
| 14082 | 3056 |
| 14083 | 3056 |
| 14084 | 3056 |
| 14085 | 3056 |
| 14086 | 3056 |
| 14087 | 3056 |
| 14088 | 3056 |
| 14089 | 3056 |
| 14090 | 3056 |
| 14091 | 3056 |
| 14092 | 3056 |
| 14093 | 3056 |
| 14094 | 3056 |
| 14095 | 3056 |
| 14096 | 3056 |
| 14097 | 3056 |
| 14098 | 3056 |
| 14099 | 3056 |
| 14100 | 3056 |
| 14101 | 3056 |
| 14102 | 3056 |
| 14103 | 3056 |
| 14104 | 3056 |
| 14105 | 3056 |
| 14106 | 3056 |
| 14107 | 3056 |
| 14108 | 3056 |
| 14109 | 3056 |
| 14110 | 3056 |
| 14111 | 3056 |
| 14112 | 3056 |
| 14113 | 3056 |
| 14114 | 3056 |
| 14115 | 3056 |
| 14116 | 3056 |
| 14117 | 3056 |
| 14118 | 3056 |
| 14119 | 3056 |
| 14120 | 3056 |
| 14121 | 3056 |
| 14122 | 3056 |
| 14123 | 3056 |
| 14124 | 3056 |
| 14125 | 3056 |
| 14126 | 3056 |
| 14127 | 3056 |
| 14128 | 3056 |
| 14129 | 3056 |
| 14130 | 3056 |
| 14131 | 3056 |
| 14132 | 3056 |
| 14133 | 3056 |
| 14134 | 3056 |
| 14135 | 3056 |
| 14136 | 3056 |
| 14137 | 3056 |
| 14138 | 3056 |
| 14139 | 3056 |
| 14140 | 3056 |
| 14141 | 3056 |
| 14142 | 3056 |
| 14143 | 3056 |
| 14144 | 3056 |
| 14145 | 3056 |
| 14146 | 3056 |
| 14147 | 3288 |
| 14148 | 3288 |
| 14149 | 3288 |
| 14150 | 3288 |
| 14151 | 3288 |
| 14152 | 3288 |
| 14153 | 3288 |
| 14154 | 3288 |
| 14155 | 3288 |
| 14156 | 3288 |
| 14157 | 3288 |
| 14158 | 3288 |
| 14159 | 3288 |
| 14160 | 3288 |
| 14161 | 3288 |
| 14162 | 3288 |
| 14163 | 3288 |
| 14164 | 3288 |
| 14165 | 3288 |
| 14166 | 3288 |
| 14167 | 3288 |
| 14168 | 3288 |
| 14169 | 3288 |
| 14170 | 3288 |
| 14171 | 3288 |
| 14172 | 3288 |
| 14173 | 3288 |
| 14174 | 3288 |
| 14175 | 3288 |
| 14176 | 3288 |
| 14177 | 3288 |
| 14178 | 3288 |
| 14179 | 3288 |
| 14180 | 3288 |
| 14181 | 3288 |
| 14182 | 3288 |
| 14183 | 3288 |
| 14184 | 3288 |
| 14185 | 3288 |
| 14186 | 3288 |
| 14187 | 3288 |
| 14188 | 3288 |
| 14189 | 3288 |
| 14190 | 3288 |
| 14191 | 3288 |
| 14192 | 3288 |
| 14193 | 3288 |
| 14194 | 3288 |
| 14195 | 3288 |
| 14196 | 3060 |
| 14197 | 3060 |
| 14198 | 3060 |
| 14199 | 3060 |
| 14200 | 3060 |
| 14201 | 3060 |
| 14202 | 3060 |
| 14203 | 3060 |
| 14204 | 3060 |
| 14205 | 3060 |
| 14206 | 3060 |
| 14207 | 3060 |
| 14208 | 3060 |
| 14209 | 3060 |
| 14210 | 3060 |
| 14211 | 3060 |
| 14212 | 3060 |
| 14213 | 3060 |
| 14214 | 3060 |
| 14215 | 3060 |
| 14216 | 3060 |
| 14217 | 3060 |
| 14218 | 3060 |
| 14219 | 3060 |
| 14220 | 3060 |
| 14221 | 3060 |
| 14222 | 3060 |
| 14223 | 3060 |
| 14224 | 3060 |
| 14225 | 3060 |
| 14226 | 3060 |
| 14227 | 3060 |
| 14228 | 3060 |
| 14229 | 3060 |
| 14230 | 3060 |
| 14231 | 3060 |
| 14232 | 3060 |
| 14233 | 3060 |
| 14234 | 3060 |
| 14235 | 3060 |
| 14236 | 3060 |
| 14237 | 3060 |
| 14238 | 3060 |
| 14239 | 3060 |
| 14240 | 3060 |
| 14241 | 3060 |
| 14242 | 3060 |
| 14243 | 3060 |
| 14244 | 3048 |
| 14245 | 3048 |
| 14246 | 3048 |
| 14247 | 3048 |
| 14248 | 3048 |
| 14249 | 3048 |
| 14250 | 3048 |
| 14251 | 3048 |
| 14252 | 3048 |
| 14253 | 3048 |
| 14254 | 3048 |
| 14255 | 3048 |
| 14256 | 3048 |
| 14257 | 3048 |
| 14258 | 3048 |
| 14259 | 3048 |
| 14260 | 3048 |
| 14261 | 3048 |
| 14262 | 3048 |
| 14263 | 3048 |
| 14264 | 3048 |
| 14265 | 3048 |
| 14266 | 3048 |
| 14267 | 3048 |
| 14268 | 3048 |
| 14269 | 3048 |
| 14270 | 3048 |
| 14271 | 3048 |
| 14272 | 3048 |
| 14273 | 3048 |
| 14274 | 3048 |
| 14275 | 3048 |
| 14276 | 3048 |
| 14277 | 3048 |
| 14278 | 3048 |
| 14279 | 3048 |
| 14280 | 3048 |
| 14281 | 3048 |
| 14282 | 3048 |
| 14283 | 3048 |
| 14284 | 3048 |
| 14285 | 3048 |
| 14286 | 3048 |
| 14287 | 3048 |
| 14288 | 3048 |
| 14289 | 3048 |
| 14290 | 3048 |
| 14291 | 3048 |
| 14292 | 3036 |
| 14293 | 3036 |
| 14294 | 3036 |
| 14295 | 3036 |
| 14296 | 3036 |
| 14297 | 3036 |
| 14298 | 3036 |
| 14299 | 3036 |
| 14300 | 3036 |
| 14301 | 3036 |
| 14302 | 3036 |
| 14303 | 3036 |
| 14304 | 3036 |
| 14305 | 3036 |
| 14306 | 3036 |
| 14307 | 3036 |
| 14308 | 3036 |
| 14309 | 3036 |
| 14310 | 3036 |
| 14311 | 3036 |
| 14312 | 3036 |
| 14313 | 3036 |
| 14314 | 3036 |
| 14315 | 3036 |
| 14316 | 3036 |
| 14317 | 3036 |
| 14318 | 3036 |
| 14319 | 3036 |
| 14320 | 3036 |
| 14321 | 3036 |
| 14322 | 3036 |
| 14323 | 3036 |
| 14324 | 3036 |
| 14325 | 3036 |
| 14326 | 3036 |
| 14327 | 3036 |
| 14328 | 3036 |
| 14329 | 3036 |
| 14330 | 3036 |
| 14331 | 3036 |
| 14332 | 3036 |
| 14333 | 3036 |
| 14334 | 3036 |
| 14335 | 3036 |
| 14336 | 3036 |
| 14337 | 3036 |
| 14338 | 3036 |
| 14339 | 3036 |
| 14340 | 3040 |
| 14341 | 3040 |
| 14342 | 3040 |
| 14343 | 3040 |
| 14344 | 3040 |
| 14345 | 3040 |
| 14346 | 3040 |
| 14347 | 3040 |
| 14348 | 3040 |
| 14349 | 3040 |
| 14350 | 3040 |
| 14351 | 3040 |
| 14352 | 3040 |
| 14353 | 3040 |
| 14354 | 3040 |
| 14355 | 3040 |
| 14356 | 3040 |
| 14357 | 3040 |
| 14358 | 3040 |
| 14359 | 3040 |
| 14360 | 3040 |
| 14361 | 3040 |
| 14362 | 3040 |
| 14363 | 3040 |
| 14364 | 3040 |
| 14365 | 3040 |
| 14366 | 3040 |
| 14367 | 3040 |
| 14368 | 3040 |
| 14369 | 3040 |
| 14370 | 3040 |
| 14371 | 3040 |
| 14372 | 3040 |
| 14373 | 3040 |
| 14374 | 3040 |
| 14375 | 3040 |
| 14376 | 3040 |
| 14377 | 3040 |
| 14378 | 3040 |
| 14379 | 3040 |
| 14380 | 3040 |
| 14381 | 3040 |
| 14382 | 3040 |
| 14383 | 3040 |
| 14384 | 3040 |
| 14385 | 3040 |
| 14386 | 3040 |
| 14387 | 3040 |
| 14388 | 3036 |
| 14389 | 3036 |
| 14390 | 3036 |
| 14391 | 3036 |
| 14392 | 3036 |
| 14393 | 3036 |
| 14394 | 3036 |
| 14395 | 3036 |
| 14396 | 3036 |
| 14397 | 3036 |
| 14398 | 3036 |
| 14399 | 3036 |
| 14400 | 3036 |
| 14401 | 3036 |
| 14402 | 3036 |
| 14403 | 3036 |
| 14404 | 3036 |
| 14405 | 3036 |
| 14406 | 3036 |
| 14407 | 3036 |
| 14408 | 3036 |
| 14409 | 3036 |
| 14410 | 3036 |
| 14411 | 3036 |
| 14412 | 3036 |
| 14413 | 3036 |
| 14414 | 3036 |
| 14415 | 3036 |
| 14416 | 3036 |
| 14417 | 3036 |
| 14418 | 3036 |
| 14419 | 3036 |
| 14420 | 3036 |
| 14421 | 3036 |
| 14422 | 3036 |
| 14423 | 3036 |
| 14424 | 3036 |
| 14425 | 3036 |
| 14426 | 3036 |
| 14427 | 3036 |
| 14428 | 3036 |
| 14429 | 3036 |
| 14430 | 3036 |
| 14431 | 3036 |
| 14432 | 3036 |
| 14433 | 3036 |
| 14434 | 3036 |
| 14435 | 3036 |
| 14436 | 3072 |
| 14437 | 3072 |
| 14438 | 3072 |
| 14439 | 3072 |
| 14440 | 3072 |
| 14441 | 3072 |
| 14442 | 3072 |
| 14443 | 3072 |
| 14444 | 3072 |
| 14445 | 3072 |
| 14446 | 3072 |
| 14447 | 3072 |
| 14448 | 3072 |
| 14449 | 3072 |
| 14450 | 3072 |
| 14451 | 3072 |
| 14452 | 3072 |
| 14453 | 3072 |
| 14454 | 3072 |
| 14455 | 3072 |
| 14456 | 3072 |
| 14457 | 3072 |
| 14458 | 3072 |
| 14459 | 3072 |
| 14460 | 3072 |
| 14461 | 3072 |
| 14462 | 3072 |
| 14463 | 3072 |
| 14464 | 3072 |
| 14465 | 3072 |
| 14466 | 3072 |
| 14467 | 3072 |
| 14468 | 3072 |
| 14469 | 3072 |
| 14470 | 3072 |
| 14471 | 3072 |
| 14472 | 3072 |
| 14473 | 3072 |
| 14474 | 3072 |
| 14475 | 3072 |
| 14476 | 3072 |
| 14477 | 3072 |
| 14478 | 3072 |
| 14479 | 3072 |
| 14480 | 3072 |
| 14481 | 3072 |
| 14482 | 3072 |
| 14483 | 3072 |
| 14484 | 3072 |
| 14485 | 3056 |
| 14486 | 3056 |
| 14487 | 3056 |
| 14488 | 3056 |
| 14489 | 3056 |
| 14490 | 3056 |
| 14491 | 3056 |
| 14492 | 3056 |
| 14493 | 3056 |
| 14494 | 3056 |
| 14495 | 3056 |
| 14496 | 3056 |
| 14497 | 3056 |
| 14498 | 3056 |
| 14499 | 3056 |
| 14500 | 3056 |
| 14501 | 3056 |
| 14502 | 3056 |
| 14503 | 3056 |
| 14504 | 3056 |
| 14505 | 3056 |
| 14506 | 3056 |
| 14507 | 3056 |
| 14508 | 3056 |
| 14509 | 3056 |
| 14510 | 3056 |
| 14511 | 3056 |
| 14512 | 3056 |
| 14513 | 3056 |
| 14514 | 3056 |
| 14515 | 3056 |
| 14516 | 3056 |
| 14517 | 3056 |
| 14518 | 3056 |
| 14519 | 3056 |
| 14520 | 3056 |
| 14521 | 3056 |
| 14522 | 3056 |
| 14523 | 3056 |
| 14524 | 3056 |
| 14525 | 3056 |
| 14526 | 3056 |
| 14527 | 3056 |
| 14528 | 3056 |
| 14529 | 3056 |
| 14530 | 3056 |
| 14531 | 3056 |
| 14532 | 3056 |
| 14533 | 3304 |
| 14534 | 3304 |
| 14535 | 3304 |
| 14536 | 3304 |
| 14537 | 3304 |
| 14538 | 3304 |
| 14539 | 3304 |
| 14540 | 3304 |
| 14541 | 3304 |
| 14542 | 3304 |
| 14543 | 3304 |
| 14544 | 3304 |
| 14545 | 3304 |
| 14546 | 3304 |
| 14547 | 3304 |
| 14548 | 3304 |
| 14549 | 3304 |
| 14550 | 3304 |
| 14551 | 3304 |
| 14552 | 3304 |
| 14553 | 3304 |
| 14554 | 3304 |
| 14555 | 3304 |
| 14556 | 3304 |
| 14557 | 3304 |
| 14558 | 3304 |
| 14559 | 3304 |
| 14560 | 3304 |
| 14561 | 3304 |
| 14562 | 3304 |
| 14563 | 3304 |
| 14564 | 3304 |
| 14565 | 3304 |
| 14566 | 3304 |
| 14567 | 3304 |
| 14568 | 3304 |
| 14569 | 3304 |
| 14570 | 3304 |
| 14571 | 3304 |
| 14572 | 3304 |
| 14573 | 3304 |
| 14574 | 3304 |
| 14575 | 3304 |
| 14576 | 3304 |
| 14577 | 3304 |
| 14578 | 3304 |
| 14579 | 3304 |
| 14580 | 3304 |
| 14581 | 3028 |
| 14582 | 3028 |
| 14583 | 3028 |
| 14584 | 3028 |
| 14585 | 3028 |
| 14586 | 3028 |
| 14587 | 3028 |
| 14588 | 3028 |
| 14589 | 3028 |
| 14590 | 3028 |
| 14591 | 3028 |
| 14592 | 3028 |
| 14593 | 3028 |
| 14594 | 3028 |
| 14595 | 3028 |
| 14596 | 3028 |
| 14597 | 3028 |
| 14598 | 3028 |
| 14599 | 3028 |
| 14600 | 3028 |
| 14601 | 3028 |
| 14602 | 3028 |
| 14603 | 3028 |
| 14604 | 3028 |
| 14605 | 3028 |
| 14606 | 3028 |
| 14607 | 3028 |
| 14608 | 3028 |
| 14609 | 3028 |
| 14610 | 3028 |
| 14611 | 3028 |
| 14612 | 3028 |
| 14613 | 3028 |
| 14614 | 3028 |
| 14615 | 3028 |
| 14616 | 3028 |
| 14617 | 3028 |
| 14618 | 3028 |
| 14619 | 3028 |
| 14620 | 3028 |
| 14621 | 3028 |
| 14622 | 3028 |
| 14623 | 3028 |
| 14624 | 3028 |
| 14625 | 3028 |
| 14626 | 3028 |
| 14627 | 3028 |
| 14628 | 3028 |
| 14629 | 3028 |
| 14630 | 3048 |
| 14631 | 3048 |
| 14632 | 3048 |
| 14633 | 3048 |
| 14634 | 3048 |
| 14635 | 3048 |
| 14636 | 3048 |
| 14637 | 3048 |
| 14638 | 3048 |
| 14639 | 3048 |
| 14640 | 3048 |
| 14641 | 3048 |
| 14642 | 3048 |
| 14643 | 3048 |
| 14644 | 3048 |
| 14645 | 3048 |
| 14646 | 3048 |
| 14647 | 3048 |
| 14648 | 3048 |
| 14649 | 3048 |
| 14650 | 3048 |
| 14651 | 3048 |
| 14652 | 3048 |
| 14653 | 3048 |
| 14654 | 3048 |
| 14655 | 3048 |
| 14656 | 3048 |
| 14657 | 3048 |
| 14658 | 3048 |
| 14659 | 3048 |
| 14660 | 3048 |
| 14661 | 3048 |
| 14662 | 3048 |
| 14663 | 3048 |
| 14664 | 3048 |
| 14665 | 3048 |
| 14666 | 3048 |
| 14667 | 3048 |
| 14668 | 3048 |
| 14669 | 3048 |
| 14670 | 3048 |
| 14671 | 3048 |
| 14672 | 3048 |
| 14673 | 3048 |
| 14674 | 3048 |
| 14675 | 3048 |
| 14676 | 3048 |
| 14677 | 3048 |
| 14678 | 3056 |
| 14679 | 3056 |
| 14680 | 3056 |
| 14681 | 3056 |
| 14682 | 3056 |
| 14683 | 3056 |
| 14684 | 3056 |
| 14685 | 3056 |
| 14686 | 3056 |
| 14687 | 3056 |
| 14688 | 3056 |
| 14689 | 3056 |
| 14690 | 3056 |
| 14691 | 3056 |
| 14692 | 3056 |
| 14693 | 3056 |
| 14694 | 3056 |
| 14695 | 3056 |
| 14696 | 3056 |
| 14697 | 3056 |
| 14698 | 3056 |
| 14699 | 3056 |
| 14700 | 3056 |
| 14701 | 3056 |
| 14702 | 3056 |
| 14703 | 3056 |
| 14704 | 3056 |
| 14705 | 3056 |
| 14706 | 3056 |
| 14707 | 3056 |
| 14708 | 3056 |
| 14709 | 3056 |
| 14710 | 3056 |
| 14711 | 3056 |
| 14712 | 3056 |
| 14713 | 3056 |
| 14714 | 3056 |
| 14715 | 3056 |
| 14716 | 3056 |
| 14717 | 3056 |
| 14718 | 3056 |
| 14719 | 3056 |
| 14720 | 3056 |
| 14721 | 3056 |
| 14722 | 3056 |
| 14723 | 3056 |
| 14724 | 3056 |
| 14725 | 3056 |
| 14726 | 3296 |
| 14727 | 3296 |
| 14728 | 3296 |
| 14729 | 3296 |
| 14730 | 3296 |
| 14731 | 3296 |
| 14732 | 3296 |
| 14733 | 3296 |
| 14734 | 3296 |
| 14735 | 3296 |
| 14736 | 3296 |
| 14737 | 3296 |
| 14738 | 3296 |
| 14739 | 3296 |
| 14740 | 3296 |
| 14741 | 3296 |
| 14742 | 3296 |
| 14743 | 3296 |
| 14744 | 3296 |
| 14745 | 3296 |
| 14746 | 3296 |
| 14747 | 3296 |
| 14748 | 3296 |
| 14749 | 3296 |
| 14750 | 3296 |
| 14751 | 3296 |
| 14752 | 3296 |
| 14753 | 3296 |
| 14754 | 3296 |
| 14755 | 3296 |
| 14756 | 3296 |
| 14757 | 3296 |
| 14758 | 3296 |
| 14759 | 3296 |
| 14760 | 3296 |
| 14761 | 3296 |
| 14762 | 3296 |
| 14763 | 3296 |
| 14764 | 3296 |
| 14765 | 3296 |
| 14766 | 3296 |
| 14767 | 3296 |
| 14768 | 3296 |
| 14769 | 3296 |
| 14770 | 3296 |
| 14771 | 3296 |
| 14772 | 3296 |
| 14773 | 3296 |
| 14774 | 3032 |
| 14775 | 3032 |
| 14776 | 3032 |
| 14777 | 3032 |
| 14778 | 3032 |
| 14779 | 3032 |
| 14780 | 3032 |
| 14781 | 3032 |
| 14782 | 3032 |
| 14783 | 3032 |
| 14784 | 3032 |
| 14785 | 3032 |
| 14786 | 3032 |
| 14787 | 3032 |
| 14788 | 3032 |
| 14789 | 3032 |
| 14790 | 3032 |
| 14791 | 3032 |
| 14792 | 3032 |
| 14793 | 3032 |
| 14794 | 3032 |
| 14795 | 3032 |
| 14796 | 3032 |
| 14797 | 3032 |
| 14798 | 3032 |
| 14799 | 3032 |
| 14800 | 3032 |
| 14801 | 3032 |
| 14802 | 3032 |
| 14803 | 3032 |
| 14804 | 3032 |
| 14805 | 3032 |
| 14806 | 3032 |
| 14807 | 3032 |
| 14808 | 3032 |
| 14809 | 3032 |
| 14810 | 3032 |
| 14811 | 3032 |
| 14812 | 3032 |
| 14813 | 3032 |
| 14814 | 3032 |
| 14815 | 3032 |
| 14816 | 3032 |
| 14817 | 3032 |
| 14818 | 3032 |
| 14819 | 3032 |
| 14820 | 3032 |
| 14821 | 3032 |
| 14822 | 3032 |
| 14823 | 3292 |
| 14824 | 3292 |
| 14825 | 3292 |
| 14826 | 3292 |
| 14827 | 3292 |
| 14828 | 3292 |
| 14829 | 3292 |
| 14830 | 3292 |
| 14831 | 3292 |
| 14832 | 3292 |
| 14833 | 3292 |
| 14834 | 3292 |
| 14835 | 3292 |
| 14836 | 3292 |
| 14837 | 3292 |
| 14838 | 3292 |
| 14839 | 3292 |
| 14840 | 3292 |
| 14841 | 3292 |
| 14842 | 3292 |
| 14843 | 3292 |
| 14844 | 3292 |
| 14845 | 3292 |
| 14846 | 3292 |
| 14847 | 3292 |
| 14848 | 3292 |
| 14849 | 3292 |
| 14850 | 3292 |
| 14851 | 3292 |
| 14852 | 3292 |
| 14853 | 3292 |
| 14854 | 3292 |
| 14855 | 3292 |
| 14856 | 3292 |
| 14857 | 3292 |
| 14858 | 3292 |
| 14859 | 3292 |
| 14860 | 3292 |
| 14861 | 3292 |
| 14862 | 3292 |
| 14863 | 3292 |
| 14864 | 3292 |
| 14865 | 3292 |
| 14866 | 3292 |
| 14867 | 3292 |
| 14868 | 3292 |
| 14869 | 3292 |
| 14870 | 3292 |
| 14871 | 3052 |
| 14872 | 3052 |
| 14873 | 3052 |
| 14874 | 3052 |
| 14875 | 3052 |
| 14876 | 3052 |
| 14877 | 3052 |
| 14878 | 3052 |
| 14879 | 3052 |
| 14880 | 3052 |
| 14881 | 3052 |
| 14882 | 3052 |
| 14883 | 3052 |
| 14884 | 3052 |
| 14885 | 3052 |
| 14886 | 3052 |
| 14887 | 3052 |
| 14888 | 3052 |
| 14889 | 3052 |
| 14890 | 3052 |
| 14891 | 3052 |
| 14892 | 3052 |
| 14893 | 3052 |
| 14894 | 3052 |
| 14895 | 3052 |
| 14896 | 3052 |
| 14897 | 3052 |
| 14898 | 3052 |
| 14899 | 3052 |
| 14900 | 3052 |
| 14901 | 3052 |
| 14902 | 3052 |
| 14903 | 3052 |
| 14904 | 3052 |
| 14905 | 3052 |
| 14906 | 3052 |
| 14907 | 3052 |
| 14908 | 3052 |
| 14909 | 3052 |
| 14910 | 3052 |
| 14911 | 3052 |
| 14912 | 3052 |
| 14913 | 3052 |
| 14914 | 3052 |
| 14915 | 3052 |
| 14916 | 3052 |
| 14917 | 3052 |
| 14918 | 3052 |
| 14919 | 3056 |
| 14920 | 3056 |
| 14921 | 3056 |
| 14922 | 3056 |
| 14923 | 3056 |
| 14924 | 3056 |
| 14925 | 3056 |
| 14926 | 3056 |
| 14927 | 3056 |
| 14928 | 3056 |
| 14929 | 3056 |
| 14930 | 3056 |
| 14931 | 3056 |
| 14932 | 3056 |
| 14933 | 3056 |
| 14934 | 3056 |
| 14935 | 3056 |
| 14936 | 3056 |
| 14937 | 3056 |
| 14938 | 3056 |
| 14939 | 3056 |
| 14940 | 3056 |
| 14941 | 3056 |
| 14942 | 3056 |
| 14943 | 3056 |
| 14944 | 3056 |
| 14945 | 3056 |
| 14946 | 3056 |
| 14947 | 3056 |
| 14948 | 3056 |
| 14949 | 3056 |
| 14950 | 3056 |
| 14951 | 3056 |
| 14952 | 3056 |
| 14953 | 3056 |
| 14954 | 3056 |
| 14955 | 3056 |
| 14956 | 3056 |
| 14957 | 3056 |
| 14958 | 3056 |
| 14959 | 3056 |
| 14960 | 3056 |
| 14961 | 3056 |
| 14962 | 3056 |
| 14963 | 3056 |
| 14964 | 3056 |
| 14965 | 3056 |
| 14966 | 3056 |
| 14967 | 3056 |
| 14968 | 3056 |
| 14969 | 3056 |
| 14970 | 3056 |
| 14971 | 3056 |
| 14972 | 3056 |
| 14973 | 3056 |
| 14974 | 3056 |
| 14975 | 3056 |
| 14976 | 3056 |
| 14977 | 3056 |
| 14978 | 3056 |
| 14979 | 3056 |
| 14980 | 3056 |
| 14981 | 3056 |
| 14982 | 3056 |
| 14983 | 3056 |
| 14984 | 3056 |
| 14985 | 3056 |
| 14986 | 3056 |
| 14987 | 3056 |
| 14988 | 3056 |
| 14989 | 3056 |
| 14990 | 3056 |
| 14991 | 3056 |
| 14992 | 3056 |
| 14993 | 3056 |
| 14994 | 3056 |
| 14995 | 3056 |
| 14996 | 3056 |
| 14997 | 3056 |
| 14998 | 3056 |
| 14999 | 3056 |
| 15000 | 3056 |
| 15001 | 3056 |
| 15002 | 3056 |
| 15003 | 3056 |
| 15004 | 3056 |
| 15005 | 3056 |
| 15006 | 3056 |
| 15007 | 3056 |
| 15008 | 3056 |
| 15009 | 3056 |
| 15010 | 3056 |
| 15011 | 3056 |
| 15012 | 3056 |
| 15013 | 3056 |
| 15014 | 3056 |
| 15015 | 3048 |
| 15016 | 3048 |
| 15017 | 3048 |
| 15018 | 3048 |
| 15019 | 3048 |
| 15020 | 3048 |
| 15021 | 3048 |
| 15022 | 3048 |
| 15023 | 3048 |
| 15024 | 3048 |
| 15025 | 3048 |
| 15026 | 3048 |
| 15027 | 3048 |
| 15028 | 3048 |
| 15029 | 3048 |
| 15030 | 3048 |
| 15031 | 3048 |
| 15032 | 3048 |
| 15033 | 3048 |
| 15034 | 3048 |
| 15035 | 3048 |
| 15036 | 3048 |
| 15037 | 3048 |
| 15038 | 3048 |
| 15039 | 3048 |
| 15040 | 3048 |
| 15041 | 3048 |
| 15042 | 3048 |
| 15043 | 3048 |
| 15044 | 3048 |
| 15045 | 3048 |
| 15046 | 3048 |
| 15047 | 3048 |
| 15048 | 3048 |
| 15049 | 3048 |
| 15050 | 3048 |
| 15051 | 3048 |
| 15052 | 3048 |
| 15053 | 3048 |
| 15054 | 3048 |
| 15055 | 3048 |
| 15056 | 3048 |
| 15057 | 3048 |
| 15058 | 3048 |
| 15059 | 3048 |
| 15060 | 3048 |
| 15061 | 3048 |
| 15062 | 3048 |
| 15063 | 3048 |
| 15064 | 3060 |
| 15065 | 3060 |
| 15066 | 3060 |
| 15067 | 3060 |
| 15068 | 3060 |
| 15069 | 3060 |
| 15070 | 3060 |
| 15071 | 3060 |
| 15072 | 3060 |
| 15073 | 3060 |
| 15074 | 3060 |
| 15075 | 3060 |
| 15076 | 3060 |
| 15077 | 3060 |
| 15078 | 3060 |
| 15079 | 3060 |
| 15080 | 3060 |
| 15081 | 3060 |
| 15082 | 3060 |
| 15083 | 3060 |
| 15084 | 3060 |
| 15085 | 3060 |
| 15086 | 3060 |
| 15087 | 3060 |
| 15088 | 3060 |
| 15089 | 3060 |
| 15090 | 3060 |
| 15091 | 3060 |
| 15092 | 3060 |
| 15093 | 3060 |
| 15094 | 3060 |
| 15095 | 3060 |
| 15096 | 3060 |
| 15097 | 3060 |
| 15098 | 3060 |
| 15099 | 3060 |
| 15100 | 3060 |
| 15101 | 3060 |
| 15102 | 3060 |
| 15103 | 3060 |
| 15104 | 3060 |
| 15105 | 3060 |
| 15106 | 3060 |
| 15107 | 3060 |
| 15108 | 3060 |
| 15109 | 3060 |
| 15110 | 3060 |
| 15111 | 3060 |
| 15112 | 3056 |
| 15113 | 3056 |
| 15114 | 3056 |
| 15115 | 3056 |
| 15116 | 3056 |
| 15117 | 3056 |
| 15118 | 3056 |
| 15119 | 3056 |
| 15120 | 3056 |
| 15121 | 3056 |
| 15122 | 3056 |
| 15123 | 3056 |
| 15124 | 3056 |
| 15125 | 3056 |
| 15126 | 3056 |
| 15127 | 3056 |
| 15128 | 3056 |
| 15129 | 3056 |
| 15130 | 3056 |
| 15131 | 3056 |
| 15132 | 3056 |
| 15133 | 3056 |
| 15134 | 3056 |
| 15135 | 3056 |
| 15136 | 3056 |
| 15137 | 3056 |
| 15138 | 3056 |
| 15139 | 3056 |
| 15140 | 3056 |
| 15141 | 3056 |
| 15142 | 3056 |
| 15143 | 3056 |
| 15144 | 3056 |
| 15145 | 3056 |
| 15146 | 3056 |
| 15147 | 3056 |
| 15148 | 3056 |
| 15149 | 3056 |
| 15150 | 3056 |
| 15151 | 3056 |
| 15152 | 3056 |
| 15153 | 3056 |
| 15154 | 3056 |
| 15155 | 3056 |
| 15156 | 3056 |
| 15157 | 3056 |
| 15158 | 3056 |
| 15159 | 3056 |
| 15160 | 3048 |
| 15161 | 3048 |
| 15162 | 3048 |
| 15163 | 3048 |
| 15164 | 3048 |
| 15165 | 3048 |
| 15166 | 3048 |
| 15167 | 3048 |
| 15168 | 3048 |
| 15169 | 3048 |
| 15170 | 3048 |
| 15171 | 3048 |
| 15172 | 3048 |
| 15173 | 3048 |
| 15174 | 3048 |
| 15175 | 3048 |
| 15176 | 3048 |
| 15177 | 3048 |
| 15178 | 3048 |
| 15179 | 3048 |
| 15180 | 3048 |
| 15181 | 3048 |
| 15182 | 3048 |
| 15183 | 3048 |
| 15184 | 3048 |
| 15185 | 3048 |
| 15186 | 3048 |
| 15187 | 3048 |
| 15188 | 3048 |
| 15189 | 3048 |
| 15190 | 3048 |
| 15191 | 3048 |
| 15192 | 3048 |
| 15193 | 3048 |
| 15194 | 3048 |
| 15195 | 3048 |
| 15196 | 3048 |
| 15197 | 3048 |
| 15198 | 3048 |
| 15199 | 3048 |
| 15200 | 3048 |
| 15201 | 3048 |
| 15202 | 3048 |
| 15203 | 3048 |
| 15204 | 3048 |
| 15205 | 3048 |
| 15206 | 3048 |
| 15207 | 3048 |
| 15208 | 3060 |
| 15209 | 3060 |
| 15210 | 3060 |
| 15211 | 3060 |
| 15212 | 3060 |
| 15213 | 3060 |
| 15214 | 3060 |
| 15215 | 3060 |
| 15216 | 3060 |
| 15217 | 3060 |
| 15218 | 3060 |
| 15219 | 3060 |
| 15220 | 3060 |
| 15221 | 3060 |
| 15222 | 3060 |
| 15223 | 3060 |
| 15224 | 3060 |
| 15225 | 3060 |
| 15226 | 3060 |
| 15227 | 3060 |
| 15228 | 3060 |
| 15229 | 3060 |
| 15230 | 3060 |
| 15231 | 3060 |
| 15232 | 3060 |
| 15233 | 3060 |
| 15234 | 3060 |
| 15235 | 3060 |
| 15236 | 3060 |
| 15237 | 3060 |
| 15238 | 3060 |
| 15239 | 3060 |
| 15240 | 3060 |
| 15241 | 3060 |
| 15242 | 3060 |
| 15243 | 3060 |
| 15244 | 3060 |
| 15245 | 3060 |
| 15246 | 3060 |
| 15247 | 3060 |
| 15248 | 3060 |
| 15249 | 3060 |
| 15250 | 3060 |
| 15251 | 3060 |
| 15252 | 3060 |
| 15253 | 3060 |
| 15254 | 3060 |
| 15255 | 3060 |
| 15256 | 3068 |
| 15257 | 3068 |
| 15258 | 3068 |
| 15259 | 3068 |
| 15260 | 3068 |
| 15261 | 3068 |
| 15262 | 3068 |
| 15263 | 3068 |
| 15264 | 3068 |
| 15265 | 3068 |
| 15266 | 3068 |
| 15267 | 3068 |
| 15268 | 3068 |
| 15269 | 3068 |
| 15270 | 3068 |
| 15271 | 3068 |
| 15272 | 3068 |
| 15273 | 3068 |
| 15274 | 3068 |
| 15275 | 3068 |
| 15276 | 3068 |
| 15277 | 3068 |
| 15278 | 3068 |
| 15279 | 3068 |
| 15280 | 3068 |
| 15281 | 3068 |
| 15282 | 3068 |
| 15283 | 3068 |
| 15284 | 3068 |
| 15285 | 3068 |
| 15286 | 3068 |
| 15287 | 3068 |
| 15288 | 3068 |
| 15289 | 3068 |
| 15290 | 3068 |
| 15291 | 3068 |
| 15292 | 3068 |
| 15293 | 3068 |
| 15294 | 3068 |
| 15295 | 3068 |
| 15296 | 3068 |
| 15297 | 3068 |
| 15298 | 3068 |
| 15299 | 3068 |
| 15300 | 3068 |
| 15301 | 3068 |
| 15302 | 3068 |
| 15303 | 3068 |
| 15304 | 3024 |
| 15305 | 3024 |
| 15306 | 3024 |
| 15307 | 3024 |
| 15308 | 3024 |
| 15309 | 3024 |
| 15310 | 3024 |
| 15311 | 3024 |
| 15312 | 3024 |
| 15313 | 3024 |
| 15314 | 3024 |
| 15315 | 3024 |
| 15316 | 3024 |
| 15317 | 3024 |
| 15318 | 3024 |
| 15319 | 3024 |
| 15320 | 3024 |
| 15321 | 3024 |
| 15322 | 3024 |
| 15323 | 3024 |
| 15324 | 3024 |
| 15325 | 3024 |
| 15326 | 3024 |
| 15327 | 3024 |
| 15328 | 3024 |
| 15329 | 3024 |
| 15330 | 3024 |
| 15331 | 3024 |
| 15332 | 3024 |
| 15333 | 3024 |
| 15334 | 3024 |
| 15335 | 3024 |
| 15336 | 3024 |
| 15337 | 3024 |
| 15338 | 3024 |
| 15339 | 3024 |
| 15340 | 3024 |
| 15341 | 3024 |
| 15342 | 3024 |
| 15343 | 3024 |
| 15344 | 3024 |
| 15345 | 3024 |
| 15346 | 3024 |
| 15347 | 3024 |
| 15348 | 3024 |
| 15349 | 3024 |
| 15350 | 3024 |
| 15351 | 3024 |
| 15352 | 3024 |
| 15353 | 3024 |
| 15354 | 3024 |
| 15355 | 3024 |
| 15356 | 3024 |
| 15357 | 3024 |
| 15358 | 3024 |
| 15359 | 3024 |
| 15360 | 3024 |
| 15361 | 3024 |
| 15362 | 3024 |
| 15363 | 3024 |
| 15364 | 3024 |
| 15365 | 3024 |
| 15366 | 3024 |
| 15367 | 3024 |
| 15368 | 3024 |
| 15369 | 3024 |
| 15370 | 3024 |
| 15371 | 3024 |
| 15372 | 3024 |
| 15373 | 3024 |
| 15374 | 3024 |
| 15375 | 3024 |
| 15376 | 3024 |
| 15377 | 3024 |
| 15378 | 3024 |
| 15379 | 3024 |
| 15380 | 3024 |
| 15381 | 3024 |
| 15382 | 3024 |
| 15383 | 3024 |
| 15384 | 3024 |
| 15385 | 3024 |
| 15386 | 3024 |
| 15387 | 3024 |
| 15388 | 3024 |
| 15389 | 3024 |
| 15390 | 3024 |
| 15391 | 3024 |
| 15392 | 3024 |
| 15393 | 3024 |
| 15394 | 3024 |
| 15395 | 3024 |
| 15396 | 3024 |
| 15397 | 3024 |
| 15398 | 3024 |
| 15399 | 3024 |
| 15400 | 3024 |
| 15401 | 3056 |
| 15402 | 3056 |
| 15403 | 3056 |
| 15404 | 3056 |
| 15405 | 3056 |
| 15406 | 3056 |
| 15407 | 3056 |
| 15408 | 3056 |
| 15409 | 3056 |
| 15410 | 3056 |
| 15411 | 3056 |
| 15412 | 3056 |
| 15413 | 3056 |
| 15414 | 3056 |
| 15415 | 3056 |
| 15416 | 3056 |
| 15417 | 3056 |
| 15418 | 3056 |
| 15419 | 3056 |
| 15420 | 3056 |
| 15421 | 3056 |
| 15422 | 3056 |
| 15423 | 3056 |
| 15424 | 3056 |
| 15425 | 3056 |
| 15426 | 3056 |
| 15427 | 3056 |
| 15428 | 3056 |
| 15429 | 3056 |
| 15430 | 3056 |
| 15431 | 3056 |
| 15432 | 3056 |
| 15433 | 3056 |
| 15434 | 3056 |
| 15435 | 3056 |
| 15436 | 3056 |
| 15437 | 3056 |
| 15438 | 3056 |
| 15439 | 3056 |
| 15440 | 3056 |
| 15441 | 3056 |
| 15442 | 3056 |
| 15443 | 3056 |
| 15444 | 3056 |
| 15445 | 3056 |
| 15446 | 3056 |
| 15447 | 3056 |
| 15448 | 3056 |
| 15449 | 3040 |
| 15450 | 3040 |
| 15451 | 3040 |
| 15452 | 3040 |
| 15453 | 3040 |
| 15454 | 3040 |
| 15455 | 3040 |
| 15456 | 3040 |
| 15457 | 3040 |
| 15458 | 3040 |
| 15459 | 3040 |
| 15460 | 3040 |
| 15461 | 3040 |
| 15462 | 3040 |
| 15463 | 3040 |
| 15464 | 3040 |
| 15465 | 3040 |
| 15466 | 3040 |
| 15467 | 3040 |
| 15468 | 3040 |
| 15469 | 3040 |
| 15470 | 3040 |
| 15471 | 3040 |
| 15472 | 3040 |
| 15473 | 3040 |
| 15474 | 3040 |
| 15475 | 3040 |
| 15476 | 3040 |
| 15477 | 3040 |
| 15478 | 3040 |
| 15479 | 3040 |
| 15480 | 3040 |
| 15481 | 3040 |
| 15482 | 3040 |
| 15483 | 3040 |
| 15484 | 3040 |
| 15485 | 3040 |
| 15486 | 3040 |
| 15487 | 3040 |
| 15488 | 3040 |
| 15489 | 3040 |
| 15490 | 3040 |
| 15491 | 3040 |
| 15492 | 3040 |
| 15493 | 3040 |
| 15494 | 3040 |
| 15495 | 3040 |
| 15496 | 3040 |
| 15497 | 3056 |
| 15498 | 3056 |
| 15499 | 3056 |
| 15500 | 3056 |
| 15501 | 3056 |
| 15502 | 3056 |
| 15503 | 3056 |
| 15504 | 3056 |
| 15505 | 3056 |
| 15506 | 3056 |
| 15507 | 3056 |
| 15508 | 3056 |
| 15509 | 3056 |
| 15510 | 3056 |
| 15511 | 3056 |
| 15512 | 3056 |
| 15513 | 3056 |
| 15514 | 3056 |
| 15515 | 3056 |
| 15516 | 3056 |
| 15517 | 3056 |
| 15518 | 3056 |
| 15519 | 3056 |
| 15520 | 3056 |
| 15521 | 3056 |
| 15522 | 3056 |
| 15523 | 3056 |
| 15524 | 3056 |
| 15525 | 3056 |
| 15526 | 3056 |
| 15527 | 3056 |
| 15528 | 3056 |
| 15529 | 3056 |
| 15530 | 3056 |
| 15531 | 3056 |
| 15532 | 3056 |
| 15533 | 3056 |
| 15534 | 3056 |
| 15535 | 3056 |
| 15536 | 3056 |
| 15537 | 3056 |
| 15538 | 3056 |
| 15539 | 3056 |
| 15540 | 3056 |
| 15541 | 3056 |
| 15542 | 3056 |
| 15543 | 3056 |
| 15544 | 3056 |
| 15545 | 3296 |
| 15546 | 3296 |
| 15547 | 3296 |
| 15548 | 3296 |
| 15549 | 3296 |
| 15550 | 3296 |
| 15551 | 3296 |
| 15552 | 3296 |
| 15553 | 3296 |
| 15554 | 3296 |
| 15555 | 3296 |
| 15556 | 3296 |
| 15557 | 3296 |
| 15558 | 3296 |
| 15559 | 3296 |
| 15560 | 3296 |
| 15561 | 3296 |
| 15562 | 3296 |
| 15563 | 3296 |
| 15564 | 3296 |
| 15565 | 3296 |
| 15566 | 3296 |
| 15567 | 3296 |
| 15568 | 3296 |
| 15569 | 3296 |
| 15570 | 3296 |
| 15571 | 3296 |
| 15572 | 3296 |
| 15573 | 3296 |
| 15574 | 3296 |
| 15575 | 3296 |
| 15576 | 3296 |
| 15577 | 3296 |
| 15578 | 3296 |
| 15579 | 3296 |
| 15580 | 3296 |
| 15581 | 3296 |
| 15582 | 3296 |
| 15583 | 3296 |
| 15584 | 3296 |
| 15585 | 3296 |
| 15586 | 3296 |
| 15587 | 3296 |
| 15588 | 3296 |
| 15589 | 3296 |
| 15590 | 3296 |
| 15591 | 3296 |
| 15592 | 3296 |
| 15593 | 3296 |
| 15594 | 3060 |
| 15595 | 3060 |
| 15596 | 3060 |
| 15597 | 3060 |
| 15598 | 3060 |
| 15599 | 3060 |
| 15600 | 3060 |
| 15601 | 3060 |
| 15602 | 3060 |
| 15603 | 3060 |
| 15604 | 3060 |
| 15605 | 3060 |
| 15606 | 3060 |
| 15607 | 3060 |
| 15608 | 3060 |
| 15609 | 3060 |
| 15610 | 3060 |
| 15611 | 3060 |
| 15612 | 3060 |
| 15613 | 3060 |
| 15614 | 3060 |
| 15615 | 3060 |
| 15616 | 3060 |
| 15617 | 3060 |
| 15618 | 3060 |
| 15619 | 3060 |
| 15620 | 3060 |
| 15621 | 3060 |
| 15622 | 3060 |
| 15623 | 3060 |
| 15624 | 3060 |
| 15625 | 3060 |
| 15626 | 3060 |
| 15627 | 3060 |
| 15628 | 3060 |
| 15629 | 3060 |
| 15630 | 3060 |
| 15631 | 3060 |
| 15632 | 3060 |
| 15633 | 3060 |
| 15634 | 3060 |
| 15635 | 3060 |
| 15636 | 3060 |
| 15637 | 3060 |
| 15638 | 3060 |
| 15639 | 3060 |
| 15640 | 3060 |
| 15641 | 3060 |
| 15642 | 3052 |
| 15643 | 3052 |
| 15644 | 3052 |
| 15645 | 3052 |
| 15646 | 3052 |
| 15647 | 3052 |
| 15648 | 3052 |
| 15649 | 3052 |
| 15650 | 3052 |
| 15651 | 3052 |
| 15652 | 3052 |
| 15653 | 3052 |
| 15654 | 3052 |
| 15655 | 3052 |
| 15656 | 3052 |
| 15657 | 3052 |
| 15658 | 3052 |
| 15659 | 3052 |
| 15660 | 3052 |
| 15661 | 3052 |
| 15662 | 3052 |
| 15663 | 3052 |
| 15664 | 3052 |
| 15665 | 3052 |
| 15666 | 3052 |
| 15667 | 3052 |
| 15668 | 3052 |
| 15669 | 3052 |
| 15670 | 3052 |
| 15671 | 3052 |
| 15672 | 3052 |
| 15673 | 3052 |
| 15674 | 3052 |
| 15675 | 3052 |
| 15676 | 3052 |
| 15677 | 3052 |
| 15678 | 3052 |
| 15679 | 3052 |
| 15680 | 3052 |
| 15681 | 3052 |
| 15682 | 3052 |
| 15683 | 3052 |
| 15684 | 3052 |
| 15685 | 3052 |
| 15686 | 3052 |
| 15687 | 3052 |
| 15688 | 3052 |
| 15689 | 3052 |
| 15690 | 3060 |
| 15691 | 3060 |
| 15692 | 3060 |
| 15693 | 3060 |
| 15694 | 3060 |
| 15695 | 3060 |
| 15696 | 3060 |
| 15697 | 3060 |
| 15698 | 3060 |
| 15699 | 3060 |
| 15700 | 3060 |
| 15701 | 3060 |
| 15702 | 3060 |
| 15703 | 3060 |
| 15704 | 3060 |
| 15705 | 3060 |
| 15706 | 3060 |
| 15707 | 3060 |
| 15708 | 3060 |
| 15709 | 3060 |
| 15710 | 3060 |
| 15711 | 3060 |
| 15712 | 3060 |
| 15713 | 3060 |
| 15714 | 3060 |
| 15715 | 3060 |
| 15716 | 3060 |
| 15717 | 3060 |
| 15718 | 3060 |
| 15719 | 3060 |
| 15720 | 3060 |
| 15721 | 3060 |
| 15722 | 3060 |
| 15723 | 3060 |
| 15724 | 3060 |
| 15725 | 3060 |
| 15726 | 3060 |
| 15727 | 3060 |
| 15728 | 3060 |
| 15729 | 3060 |
| 15730 | 3060 |
| 15731 | 3060 |
| 15732 | 3060 |
| 15733 | 3060 |
| 15734 | 3060 |
| 15735 | 3060 |
| 15736 | 3060 |
| 15737 | 3060 |
| 15738 | 3032 |
| 15739 | 3032 |
| 15740 | 3032 |
| 15741 | 3032 |
| 15742 | 3032 |
| 15743 | 3032 |
| 15744 | 3032 |
| 15745 | 3032 |
| 15746 | 3032 |
| 15747 | 3032 |
| 15748 | 3032 |
| 15749 | 3032 |
| 15750 | 3032 |
| 15751 | 3032 |
| 15752 | 3032 |
| 15753 | 3032 |
| 15754 | 3032 |
| 15755 | 3032 |
| 15756 | 3032 |
| 15757 | 3032 |
| 15758 | 3032 |
| 15759 | 3032 |
| 15760 | 3032 |
| 15761 | 3032 |
| 15762 | 3032 |
| 15763 | 3032 |
| 15764 | 3032 |
| 15765 | 3032 |
| 15766 | 3032 |
| 15767 | 3032 |
| 15768 | 3032 |
| 15769 | 3032 |
| 15770 | 3032 |
| 15771 | 3032 |
| 15772 | 3032 |
| 15773 | 3032 |
| 15774 | 3032 |
| 15775 | 3032 |
| 15776 | 3032 |
| 15777 | 3032 |
| 15778 | 3032 |
| 15779 | 3032 |
| 15780 | 3032 |
| 15781 | 3032 |
| 15782 | 3032 |
| 15783 | 3032 |
| 15784 | 3032 |
| 15785 | 3032 |
| 15786 | 3032 |
| 15787 | 3052 |
| 15788 | 3052 |
| 15789 | 3052 |
| 15790 | 3052 |
| 15791 | 3052 |
| 15792 | 3052 |
| 15793 | 3052 |
| 15794 | 3052 |
| 15795 | 3052 |
| 15796 | 3052 |
| 15797 | 3052 |
| 15798 | 3052 |
| 15799 | 3052 |
| 15800 | 3052 |
| 15801 | 3052 |
| 15802 | 3052 |
| 15803 | 3052 |
| 15804 | 3052 |
| 15805 | 3052 |
| 15806 | 3052 |
| 15807 | 3052 |
| 15808 | 3052 |
| 15809 | 3052 |
| 15810 | 3052 |
| 15811 | 3052 |
| 15812 | 3052 |
| 15813 | 3052 |
| 15814 | 3052 |
| 15815 | 3052 |
| 15816 | 3052 |
| 15817 | 3052 |
| 15818 | 3052 |
| 15819 | 3052 |
| 15820 | 3052 |
| 15821 | 3052 |
| 15822 | 3052 |
| 15823 | 3052 |
| 15824 | 3052 |
| 15825 | 3052 |
| 15826 | 3052 |
| 15827 | 3052 |
| 15828 | 3052 |
| 15829 | 3052 |
| 15830 | 3052 |
| 15831 | 3052 |
| 15832 | 3052 |
| 15833 | 3052 |
| 15834 | 3052 |
| 15835 | 3064 |
| 15836 | 3064 |
| 15837 | 3064 |
| 15838 | 3064 |
| 15839 | 3064 |
| 15840 | 3064 |
| 15841 | 3064 |
| 15842 | 3064 |
| 15843 | 3064 |
| 15844 | 3064 |
| 15845 | 3064 |
| 15846 | 3064 |
| 15847 | 3064 |
| 15848 | 3064 |
| 15849 | 3064 |
| 15850 | 3064 |
| 15851 | 3064 |
| 15852 | 3064 |
| 15853 | 3064 |
| 15854 | 3064 |
| 15855 | 3064 |
| 15856 | 3064 |
| 15857 | 3064 |
| 15858 | 3064 |
| 15859 | 3064 |
| 15860 | 3064 |
| 15861 | 3064 |
| 15862 | 3064 |
| 15863 | 3064 |
| 15864 | 3064 |
| 15865 | 3064 |
| 15866 | 3064 |
| 15867 | 3064 |
| 15868 | 3064 |
| 15869 | 3064 |
| 15870 | 3064 |
| 15871 | 3064 |
| 15872 | 3064 |
| 15873 | 3064 |
| 15874 | 3064 |
| 15875 | 3064 |
| 15876 | 3064 |
| 15877 | 3064 |
| 15878 | 3064 |
| 15879 | 3064 |
| 15880 | 3064 |
| 15881 | 3064 |
| 15882 | 3064 |
| 15883 | 3064 |
| 15884 | 3064 |
| 15885 | 3064 |
| 15886 | 3064 |
| 15887 | 3064 |
| 15888 | 3064 |
| 15889 | 3064 |
| 15890 | 3064 |
| 15891 | 3064 |
| 15892 | 3064 |
| 15893 | 3064 |
| 15894 | 3064 |
| 15895 | 3064 |
| 15896 | 3064 |
| 15897 | 3064 |
| 15898 | 3064 |
| 15899 | 3064 |
| 15900 | 3064 |
| 15901 | 3064 |
| 15902 | 3064 |
| 15903 | 3064 |
| 15904 | 3064 |
| 15905 | 3064 |
| 15906 | 3064 |
| 15907 | 3064 |
| 15908 | 3064 |
| 15909 | 3064 |
| 15910 | 3064 |
| 15911 | 3064 |
| 15912 | 3064 |
| 15913 | 3064 |
| 15914 | 3064 |
| 15915 | 3064 |
| 15916 | 3064 |
| 15917 | 3064 |
| 15918 | 3064 |
| 15919 | 3064 |
| 15920 | 3064 |
| 15921 | 3064 |
| 15922 | 3064 |
| 15923 | 3064 |
| 15924 | 3064 |
| 15925 | 3064 |
| 15926 | 3064 |
| 15927 | 3064 |
| 15928 | 3064 |
| 15929 | 3064 |
| 15930 | 3064 |
| 15931 | 3032 |
| 15932 | 3032 |
| 15933 | 3032 |
| 15934 | 3032 |
| 15935 | 3032 |
| 15936 | 3032 |
| 15937 | 3032 |
| 15938 | 3032 |
| 15939 | 3032 |
| 15940 | 3032 |
| 15941 | 3032 |
| 15942 | 3032 |
| 15943 | 3032 |
| 15944 | 3032 |
| 15945 | 3032 |
| 15946 | 3032 |
| 15947 | 3032 |
| 15948 | 3032 |
| 15949 | 3032 |
| 15950 | 3032 |
| 15951 | 3032 |
| 15952 | 3032 |
| 15953 | 3032 |
| 15954 | 3032 |
| 15955 | 3032 |
| 15956 | 3032 |
| 15957 | 3032 |
| 15958 | 3032 |
| 15959 | 3032 |
| 15960 | 3032 |
| 15961 | 3032 |
| 15962 | 3032 |
| 15963 | 3032 |
| 15964 | 3032 |
| 15965 | 3032 |
| 15966 | 3032 |
| 15967 | 3032 |
| 15968 | 3032 |
| 15969 | 3032 |
| 15970 | 3032 |
| 15971 | 3032 |
| 15972 | 3032 |
| 15973 | 3032 |
| 15974 | 3032 |
| 15975 | 3032 |
| 15976 | 3032 |
| 15977 | 3032 |
| 15978 | 3032 |
| 15979 | 3032 |
| 15980 | 3064 |
| 15981 | 3064 |
| 15982 | 3064 |
| 15983 | 3064 |
| 15984 | 3064 |
| 15985 | 3064 |
| 15986 | 3064 |
| 15987 | 3064 |
| 15988 | 3064 |
| 15989 | 3064 |
| 15990 | 3064 |
| 15991 | 3064 |
| 15992 | 3064 |
| 15993 | 3064 |
| 15994 | 3064 |
| 15995 | 3064 |
| 15996 | 3064 |
| 15997 | 3064 |
| 15998 | 3064 |
| 15999 | 3064 |
| 16000 | 3064 |
| 16001 | 3064 |
| 16002 | 3064 |
| 16003 | 3064 |
| 16004 | 3064 |
| 16005 | 3064 |
| 16006 | 3064 |
| 16007 | 3064 |
| 16008 | 3064 |
| 16009 | 3064 |
| 16010 | 3064 |
| 16011 | 3064 |
| 16012 | 3064 |
| 16013 | 3064 |
| 16014 | 3064 |
| 16015 | 3064 |
| 16016 | 3064 |
| 16017 | 3064 |
| 16018 | 3064 |
| 16019 | 3064 |
| 16020 | 3064 |
| 16021 | 3064 |
| 16022 | 3064 |
| 16023 | 3064 |
| 16024 | 3064 |
| 16025 | 3064 |
| 16026 | 3064 |
| 16027 | 3064 |
| 16028 | 3044 |
| 16029 | 3044 |
| 16030 | 3044 |
| 16031 | 3044 |
| 16032 | 3044 |
| 16033 | 3044 |
| 16034 | 3044 |
| 16035 | 3044 |
| 16036 | 3044 |
| 16037 | 3044 |
| 16038 | 3044 |
| 16039 | 3044 |
| 16040 | 3044 |
| 16041 | 3044 |
| 16042 | 3044 |
| 16043 | 3044 |
| 16044 | 3044 |
| 16045 | 3044 |
| 16046 | 3044 |
| 16047 | 3044 |
| 16048 | 3044 |
| 16049 | 3044 |
| 16050 | 3044 |
| 16051 | 3044 |
| 16052 | 3044 |
| 16053 | 3044 |
| 16054 | 3044 |
| 16055 | 3044 |
| 16056 | 3044 |
| 16057 | 3044 |
| 16058 | 3044 |
| 16059 | 3044 |
| 16060 | 3044 |
| 16061 | 3044 |
| 16062 | 3044 |
| 16063 | 3044 |
| 16064 | 3044 |
| 16065 | 3044 |
| 16066 | 3044 |
| 16067 | 3044 |
| 16068 | 3044 |
| 16069 | 3044 |
| 16070 | 3044 |
| 16071 | 3044 |
| 16072 | 3044 |
| 16073 | 3044 |
| 16074 | 3044 |
| 16075 | 3044 |
| 16076 | 3056 |
| 16077 | 3056 |
| 16078 | 3056 |
| 16079 | 3056 |
| 16080 | 3056 |
| 16081 | 3056 |
| 16082 | 3056 |
| 16083 | 3056 |
| 16084 | 3056 |
| 16085 | 3056 |
| 16086 | 3056 |
| 16087 | 3056 |
| 16088 | 3056 |
| 16089 | 3056 |
| 16090 | 3056 |
| 16091 | 3056 |
| 16092 | 3056 |
| 16093 | 3056 |
| 16094 | 3056 |
| 16095 | 3056 |
| 16096 | 3056 |
| 16097 | 3056 |
| 16098 | 3056 |
| 16099 | 3056 |
| 16100 | 3056 |
| 16101 | 3056 |
| 16102 | 3056 |
| 16103 | 3056 |
| 16104 | 3056 |
| 16105 | 3056 |
| 16106 | 3056 |
| 16107 | 3056 |
| 16108 | 3056 |
| 16109 | 3056 |
| 16110 | 3056 |
| 16111 | 3056 |
| 16112 | 3056 |
| 16113 | 3056 |
| 16114 | 3056 |
| 16115 | 3056 |
| 16116 | 3056 |
| 16117 | 3056 |
| 16118 | 3056 |
| 16119 | 3056 |
| 16120 | 3056 |
| 16121 | 3056 |
| 16122 | 3056 |
| 16123 | 3056 |
| 16124 | 3052 |
| 16125 | 3052 |
| 16126 | 3052 |
| 16127 | 3052 |
| 16128 | 3052 |
| 16129 | 3052 |
| 16130 | 3052 |
| 16131 | 3052 |
| 16132 | 3052 |
| 16133 | 3052 |
| 16134 | 3052 |
| 16135 | 3052 |
| 16136 | 3052 |
| 16137 | 3052 |
| 16138 | 3052 |
| 16139 | 3052 |
| 16140 | 3052 |
| 16141 | 3052 |
| 16142 | 3052 |
| 16143 | 3052 |
| 16144 | 3052 |
| 16145 | 3052 |
| 16146 | 3052 |
| 16147 | 3052 |
| 16148 | 3052 |
| 16149 | 3052 |
| 16150 | 3052 |
| 16151 | 3052 |
| 16152 | 3052 |
| 16153 | 3052 |
| 16154 | 3052 |
| 16155 | 3052 |
| 16156 | 3052 |
| 16157 | 3052 |
| 16158 | 3052 |
| 16159 | 3052 |
| 16160 | 3052 |
| 16161 | 3052 |
| 16162 | 3052 |
| 16163 | 3052 |
| 16164 | 3052 |
| 16165 | 3052 |
| 16166 | 3052 |
| 16167 | 3052 |
| 16168 | 3052 |
| 16169 | 3052 |
| 16170 | 3052 |
| 16171 | 3052 |
| 16172 | 3052 |
| 16173 | 3108 |
| 16174 | 3108 |
| 16175 | 3108 |
| 16176 | 3108 |
| 16177 | 3108 |
| 16178 | 3108 |
| 16179 | 3108 |
| 16180 | 3108 |
| 16181 | 3108 |
| 16182 | 3108 |
| 16183 | 3108 |
| 16184 | 3108 |
| 16185 | 3108 |
| 16186 | 3108 |
| 16187 | 3108 |
| 16188 | 3108 |
| 16189 | 3108 |
| 16190 | 3108 |
| 16191 | 3108 |
| 16192 | 3108 |
| 16193 | 3108 |
| 16194 | 3108 |
| 16195 | 3108 |
| 16196 | 3108 |
| 16197 | 3108 |
| 16198 | 3108 |
| 16199 | 3108 |
| 16200 | 3108 |
| 16201 | 3108 |
| 16202 | 3108 |
| 16203 | 3108 |
| 16204 | 3108 |
| 16205 | 3108 |
| 16206 | 3108 |
| 16207 | 3108 |
| 16208 | 3108 |
| 16209 | 3108 |
| 16210 | 3108 |
| 16211 | 3108 |
| 16212 | 3108 |
| 16213 | 3108 |
| 16214 | 3108 |
| 16215 | 3108 |
| 16216 | 3108 |
| 16217 | 3108 |
| 16218 | 3108 |
| 16219 | 3108 |
| 16220 | 3108 |
| 16221 | 3056 |
| 16222 | 3056 |
| 16223 | 3056 |
| 16224 | 3056 |
| 16225 | 3056 |
| 16226 | 3056 |
| 16227 | 3056 |
| 16228 | 3056 |
| 16229 | 3056 |
| 16230 | 3056 |
| 16231 | 3056 |
| 16232 | 3056 |
| 16233 | 3056 |
| 16234 | 3056 |
| 16235 | 3056 |
| 16236 | 3056 |
| 16237 | 3056 |
| 16238 | 3056 |
| 16239 | 3056 |
| 16240 | 3056 |
| 16241 | 3056 |
| 16242 | 3056 |
| 16243 | 3056 |
| 16244 | 3056 |
| 16245 | 3056 |
| 16246 | 3056 |
| 16247 | 3056 |
| 16248 | 3056 |
| 16249 | 3056 |
| 16250 | 3056 |
| 16251 | 3056 |
| 16252 | 3056 |
| 16253 | 3056 |
| 16254 | 3056 |
| 16255 | 3056 |
| 16256 | 3056 |
| 16257 | 3056 |
| 16258 | 3056 |
| 16259 | 3056 |
| 16260 | 3056 |
| 16261 | 3056 |
| 16262 | 3056 |
| 16263 | 3056 |
| 16264 | 3056 |
| 16265 | 3056 |
| 16266 | 3056 |
| 16267 | 3056 |
| 16268 | 3056 |
| 16269 | 3060 |
| 16270 | 3060 |
| 16271 | 3060 |
| 16272 | 3060 |
| 16273 | 3060 |
| 16274 | 3060 |
| 16275 | 3060 |
| 16276 | 3060 |
| 16277 | 3060 |
| 16278 | 3060 |
| 16279 | 3060 |
| 16280 | 3060 |
| 16281 | 3060 |
| 16282 | 3060 |
| 16283 | 3060 |
| 16284 | 3060 |
| 16285 | 3060 |
| 16286 | 3060 |
| 16287 | 3060 |
| 16288 | 3060 |
| 16289 | 3060 |
| 16290 | 3060 |
| 16291 | 3060 |
| 16292 | 3060 |
| 16293 | 3060 |
| 16294 | 3060 |
| 16295 | 3060 |
| 16296 | 3060 |
| 16297 | 3060 |
| 16298 | 3060 |
| 16299 | 3060 |
| 16300 | 3060 |
| 16301 | 3060 |
| 16302 | 3060 |
| 16303 | 3060 |
| 16304 | 3060 |
| 16305 | 3060 |
| 16306 | 3060 |
| 16307 | 3060 |
| 16308 | 3060 |
| 16309 | 3060 |
| 16310 | 3060 |
| 16311 | 3060 |
| 16312 | 3060 |
| 16313 | 3060 |
| 16314 | 3060 |
| 16315 | 3060 |
| 16316 | 3060 |
| 16317 | 3056 |
| 16318 | 3056 |
| 16319 | 3056 |
| 16320 | 3056 |
| 16321 | 3056 |
| 16322 | 3056 |
| 16323 | 3056 |
| 16324 | 3056 |
| 16325 | 3056 |
| 16326 | 3056 |
| 16327 | 3056 |
| 16328 | 3056 |
| 16329 | 3056 |
| 16330 | 3056 |
| 16331 | 3056 |
| 16332 | 3056 |
| 16333 | 3056 |
| 16334 | 3056 |
| 16335 | 3056 |
| 16336 | 3056 |
| 16337 | 3056 |
| 16338 | 3056 |
| 16339 | 3056 |
| 16340 | 3056 |
| 16341 | 3056 |
| 16342 | 3056 |
| 16343 | 3056 |
| 16344 | 3056 |
| 16345 | 3056 |
| 16346 | 3056 |
| 16347 | 3056 |
| 16348 | 3056 |
| 16349 | 3056 |
| 16350 | 3056 |
| 16351 | 3056 |
| 16352 | 3056 |
| 16353 | 3056 |
| 16354 | 3056 |
| 16355 | 3056 |
| 16356 | 3056 |
| 16357 | 3056 |
| 16358 | 3056 |
| 16359 | 3056 |
| 16360 | 3056 |
| 16361 | 3056 |
| 16362 | 3056 |
| 16363 | 3056 |
| 16364 | 3056 |
| 16365 | 3056 |
| 16366 | 3020 |
| 16367 | 3020 |
| 16368 | 3020 |
| 16369 | 3020 |
| 16370 | 3020 |
| 16371 | 3020 |
| 16372 | 3020 |
| 16373 | 3020 |
| 16374 | 3020 |
| 16375 | 3020 |
| 16376 | 3020 |
| 16377 | 3020 |
| 16378 | 3020 |
| 16379 | 3020 |
| 16380 | 3020 |
| 16381 | 3020 |
| 16382 | 3020 |
| 16383 | 3020 |
| 16384 | 3020 |
| 16385 | 3020 |
| 16386 | 3020 |
| 16387 | 3020 |
| 16388 | 3020 |
| 16389 | 3020 |
| 16390 | 3020 |
| 16391 | 3020 |
| 16392 | 3020 |
| 16393 | 3020 |
| 16394 | 3020 |
| 16395 | 3020 |
| 16396 | 3020 |
| 16397 | 3020 |
| 16398 | 3020 |
| 16399 | 3020 |
| 16400 | 3020 |
| 16401 | 3020 |
| 16402 | 3020 |
| 16403 | 3020 |
| 16404 | 3020 |
| 16405 | 3020 |
| 16406 | 3020 |
| 16407 | 3020 |
| 16408 | 3020 |
| 16409 | 3020 |
| 16410 | 3020 |
| 16411 | 3020 |
| 16412 | 3020 |
| 16413 | 3020 |
| 16414 | 3044 |
| 16415 | 3044 |
| 16416 | 3044 |
| 16417 | 3044 |
| 16418 | 3044 |
| 16419 | 3044 |
| 16420 | 3044 |
| 16421 | 3044 |
| 16422 | 3044 |
| 16423 | 3044 |
| 16424 | 3044 |
| 16425 | 3044 |
| 16426 | 3044 |
| 16427 | 3044 |
| 16428 | 3044 |
| 16429 | 3044 |
| 16430 | 3044 |
| 16431 | 3044 |
| 16432 | 3044 |
| 16433 | 3044 |
| 16434 | 3044 |
| 16435 | 3044 |
| 16436 | 3044 |
| 16437 | 3044 |
| 16438 | 3044 |
| 16439 | 3044 |
| 16440 | 3044 |
| 16441 | 3044 |
| 16442 | 3044 |
| 16443 | 3044 |
| 16444 | 3044 |
| 16445 | 3044 |
| 16446 | 3044 |
| 16447 | 3044 |
| 16448 | 3044 |
| 16449 | 3044 |
| 16450 | 3044 |
| 16451 | 3044 |
| 16452 | 3044 |
| 16453 | 3044 |
| 16454 | 3044 |
| 16455 | 3044 |
| 16456 | 3044 |
| 16457 | 3044 |
| 16458 | 3044 |
| 16459 | 3044 |
| 16460 | 3044 |
| 16461 | 3044 |
| 16462 | 3044 |
| 16463 | 3044 |
| 16464 | 3044 |
| 16465 | 3044 |
| 16466 | 3044 |
| 16467 | 3044 |
| 16468 | 3044 |
| 16469 | 3044 |
| 16470 | 3044 |
| 16471 | 3044 |
| 16472 | 3044 |
| 16473 | 3044 |
| 16474 | 3044 |
| 16475 | 3044 |
| 16476 | 3044 |
| 16477 | 3044 |
| 16478 | 3044 |
| 16479 | 3044 |
| 16480 | 3044 |
| 16481 | 3044 |
| 16482 | 3044 |
| 16483 | 3044 |
| 16484 | 3044 |
| 16485 | 3044 |
| 16486 | 3044 |
| 16487 | 3044 |
| 16488 | 3044 |
| 16489 | 3044 |
| 16490 | 3044 |
| 16491 | 3044 |
| 16492 | 3044 |
| 16493 | 3044 |
| 16494 | 3044 |
| 16495 | 3044 |
| 16496 | 3044 |
| 16497 | 3044 |
| 16498 | 3044 |
| 16499 | 3044 |
| 16500 | 3044 |
| 16501 | 3044 |
| 16502 | 3044 |
| 16503 | 3044 |
| 16504 | 3044 |
| 16505 | 3044 |
| 16506 | 3044 |
| 16507 | 3044 |
| 16508 | 3044 |
| 16509 | 3044 |
| 16510 | 3296 |
| 16511 | 3296 |
| 16512 | 3296 |
| 16513 | 3296 |
| 16514 | 3296 |
| 16515 | 3296 |
| 16516 | 3296 |
| 16517 | 3296 |
| 16518 | 3296 |
| 16519 | 3296 |
| 16520 | 3296 |
| 16521 | 3296 |
| 16522 | 3296 |
| 16523 | 3296 |
| 16524 | 3296 |
| 16525 | 3296 |
| 16526 | 3296 |
| 16527 | 3296 |
| 16528 | 3296 |
| 16529 | 3296 |
| 16530 | 3296 |
| 16531 | 3296 |
| 16532 | 3296 |
| 16533 | 3296 |
| 16534 | 3296 |
| 16535 | 3296 |
| 16536 | 3296 |
| 16537 | 3296 |
| 16538 | 3296 |
| 16539 | 3296 |
| 16540 | 3296 |
| 16541 | 3296 |
| 16542 | 3296 |
| 16543 | 3296 |
| 16544 | 3296 |
| 16545 | 3296 |
| 16546 | 3296 |
| 16547 | 3296 |
| 16548 | 3296 |
| 16549 | 3296 |
| 16550 | 3296 |
| 16551 | 3296 |
| 16552 | 3296 |
| 16553 | 3296 |
| 16554 | 3296 |
| 16555 | 3296 |
| 16556 | 3296 |
| 16557 | 3296 |
| 16558 | 3296 |
| 16559 | 3044 |
| 16560 | 3044 |
| 16561 | 3044 |
| 16562 | 3044 |
| 16563 | 3044 |
| 16564 | 3044 |
| 16565 | 3044 |
| 16566 | 3044 |
| 16567 | 3044 |
| 16568 | 3044 |
| 16569 | 3044 |
| 16570 | 3044 |
| 16571 | 3044 |
| 16572 | 3044 |
| 16573 | 3044 |
| 16574 | 3044 |
| 16575 | 3044 |
| 16576 | 3044 |
| 16577 | 3044 |
| 16578 | 3044 |
| 16579 | 3044 |
| 16580 | 3044 |
| 16581 | 3044 |
| 16582 | 3044 |
| 16583 | 3044 |
| 16584 | 3044 |
| 16585 | 3044 |
| 16586 | 3044 |
| 16587 | 3044 |
| 16588 | 3044 |
| 16589 | 3044 |
| 16590 | 3044 |
| 16591 | 3044 |
| 16592 | 3044 |
| 16593 | 3044 |
| 16594 | 3044 |
| 16595 | 3044 |
| 16596 | 3044 |
| 16597 | 3044 |
| 16598 | 3044 |
| 16599 | 3044 |
| 16600 | 3044 |
| 16601 | 3044 |
| 16602 | 3044 |
| 16603 | 3044 |
| 16604 | 3044 |
| 16605 | 3044 |
| 16606 | 3044 |
| 16607 | 3044 |
| 16608 | 3044 |
| 16609 | 3044 |
| 16610 | 3044 |
| 16611 | 3044 |
| 16612 | 3044 |
| 16613 | 3044 |
| 16614 | 3044 |
| 16615 | 3044 |
| 16616 | 3044 |
| 16617 | 3044 |
| 16618 | 3044 |
| 16619 | 3044 |
| 16620 | 3044 |
| 16621 | 3044 |
| 16622 | 3044 |
| 16623 | 3044 |
| 16624 | 3044 |
| 16625 | 3044 |
| 16626 | 3044 |
| 16627 | 3044 |
| 16628 | 3044 |
| 16629 | 3044 |
| 16630 | 3044 |
| 16631 | 3044 |
| 16632 | 3044 |
| 16633 | 3044 |
| 16634 | 3044 |
| 16635 | 3044 |
| 16636 | 3044 |
| 16637 | 3044 |
| 16638 | 3044 |
| 16639 | 3044 |
| 16640 | 3044 |
| 16641 | 3044 |
| 16642 | 3044 |
| 16643 | 3044 |
| 16644 | 3044 |
| 16645 | 3044 |
| 16646 | 3044 |
| 16647 | 3044 |
| 16648 | 3044 |
| 16649 | 3044 |
| 16650 | 3044 |
| 16651 | 3044 |
| 16652 | 3044 |
| 16653 | 3044 |
| 16654 | 3044 |
| 16655 | 3044 |
| 16656 | 3044 |
| 16657 | 3044 |
| 16658 | 3044 |
| 16659 | 3044 |
| 16660 | 3044 |
| 16661 | 3044 |
| 16662 | 3044 |
| 16663 | 3044 |
| 16664 | 3044 |
| 16665 | 3044 |
| 16666 | 3044 |
| 16667 | 3044 |
| 16668 | 3044 |
| 16669 | 3044 |
| 16670 | 3044 |
| 16671 | 3044 |
| 16672 | 3044 |
| 16673 | 3044 |
| 16674 | 3044 |
| 16675 | 3044 |
| 16676 | 3044 |
| 16677 | 3044 |
| 16678 | 3044 |
| 16679 | 3044 |
| 16680 | 3044 |
| 16681 | 3044 |
| 16682 | 3044 |
| 16683 | 3044 |
| 16684 | 3044 |
| 16685 | 3044 |
| 16686 | 3044 |
| 16687 | 3044 |
| 16688 | 3044 |
| 16689 | 3044 |
| 16690 | 3044 |
| 16691 | 3044 |
| 16692 | 3044 |
| 16693 | 3044 |
| 16694 | 3044 |
| 16695 | 3044 |
| 16696 | 3044 |
| 16697 | 3044 |
| 16698 | 3044 |
| 16699 | 3044 |
| 16700 | 3044 |
| 16701 | 3044 |
| 16702 | 3044 |
| 16703 | 3040 |
| 16704 | 3040 |
| 16705 | 3040 |
| 16706 | 3040 |
| 16707 | 3040 |
| 16708 | 3040 |
| 16709 | 3040 |
| 16710 | 3040 |
| 16711 | 3040 |
| 16712 | 3040 |
| 16713 | 3040 |
| 16714 | 3040 |
| 16715 | 3040 |
| 16716 | 3040 |
| 16717 | 3040 |
| 16718 | 3040 |
| 16719 | 3040 |
| 16720 | 3040 |
| 16721 | 3040 |
| 16722 | 3040 |
| 16723 | 3040 |
| 16724 | 3040 |
| 16725 | 3040 |
| 16726 | 3040 |
| 16727 | 3040 |
| 16728 | 3040 |
| 16729 | 3040 |
| 16730 | 3040 |
| 16731 | 3040 |
| 16732 | 3040 |
| 16733 | 3040 |
| 16734 | 3040 |
| 16735 | 3040 |
| 16736 | 3040 |
| 16737 | 3040 |
| 16738 | 3040 |
| 16739 | 3040 |
| 16740 | 3040 |
| 16741 | 3040 |
| 16742 | 3040 |
| 16743 | 3040 |
| 16744 | 3040 |
| 16745 | 3040 |
| 16746 | 3040 |
| 16747 | 3040 |
| 16748 | 3040 |
| 16749 | 3040 |
| 16750 | 3040 |
| 16751 | 3268 |
| 16752 | 3268 |
| 16753 | 3268 |
| 16754 | 3268 |
| 16755 | 3268 |
| 16756 | 3268 |
| 16757 | 3268 |
| 16758 | 3268 |
| 16759 | 3268 |
| 16760 | 3268 |
| 16761 | 3268 |
| 16762 | 3268 |
| 16763 | 3268 |
| 16764 | 3268 |
| 16765 | 3268 |
| 16766 | 3268 |
| 16767 | 3268 |
| 16768 | 3268 |
| 16769 | 3268 |
| 16770 | 3268 |
| 16771 | 3268 |
| 16772 | 3268 |
| 16773 | 3268 |
| 16774 | 3268 |
| 16775 | 3268 |
| 16776 | 3268 |
| 16777 | 3268 |
| 16778 | 3268 |
| 16779 | 3268 |
| 16780 | 3268 |
| 16781 | 3268 |
| 16782 | 3268 |
| 16783 | 3268 |
| 16784 | 3268 |
| 16785 | 3268 |
| 16786 | 3268 |
| 16787 | 3268 |
| 16788 | 3268 |
| 16789 | 3268 |
| 16790 | 3268 |
| 16791 | 3268 |
| 16792 | 3268 |
| 16793 | 3268 |
| 16794 | 3268 |
| 16795 | 3268 |
| 16796 | 3268 |
| 16797 | 3268 |
| 16798 | 3268 |
| 16799 | 3056 |
| 16800 | 3056 |
| 16801 | 3056 |
| 16802 | 3056 |
| 16803 | 3056 |
| 16804 | 3056 |
| 16805 | 3056 |
| 16806 | 3056 |
| 16807 | 3056 |
| 16808 | 3056 |
| 16809 | 3056 |
| 16810 | 3056 |
| 16811 | 3056 |
| 16812 | 3056 |
| 16813 | 3056 |
| 16814 | 3056 |
| 16815 | 3056 |
| 16816 | 3056 |
| 16817 | 3056 |
| 16818 | 3056 |
| 16819 | 3056 |
| 16820 | 3056 |
| 16821 | 3056 |
| 16822 | 3056 |
| 16823 | 3056 |
| 16824 | 3056 |
| 16825 | 3056 |
| 16826 | 3056 |
| 16827 | 3056 |
| 16828 | 3056 |
| 16829 | 3056 |
| 16830 | 3056 |
| 16831 | 3056 |
| 16832 | 3056 |
| 16833 | 3056 |
| 16834 | 3056 |
| 16835 | 3056 |
| 16836 | 3056 |
| 16837 | 3056 |
| 16838 | 3056 |
| 16839 | 3056 |
| 16840 | 3056 |
| 16841 | 3056 |
| 16842 | 3056 |
| 16843 | 3056 |
| 16844 | 3056 |
| 16845 | 3056 |
| 16846 | 3056 |
| 16847 | 3064 |
| 16848 | 3064 |
| 16849 | 3064 |
| 16850 | 3064 |
| 16851 | 3064 |
| 16852 | 3064 |
| 16853 | 3064 |
| 16854 | 3064 |
| 16855 | 3064 |
| 16856 | 3064 |
| 16857 | 3064 |
| 16858 | 3064 |
| 16859 | 3064 |
| 16860 | 3064 |
| 16861 | 3064 |
| 16862 | 3064 |
| 16863 | 3064 |
| 16864 | 3064 |
| 16865 | 3064 |
| 16866 | 3064 |
| 16867 | 3064 |
| 16868 | 3064 |
| 16869 | 3064 |
| 16870 | 3064 |
| 16871 | 3064 |
| 16872 | 3064 |
| 16873 | 3064 |
| 16874 | 3064 |
| 16875 | 3064 |
| 16876 | 3064 |
| 16877 | 3064 |
| 16878 | 3064 |
| 16879 | 3064 |
| 16880 | 3064 |
| 16881 | 3064 |
| 16882 | 3064 |
| 16883 | 3064 |
| 16884 | 3064 |
| 16885 | 3064 |
| 16886 | 3064 |
| 16887 | 3064 |
| 16888 | 3064 |
| 16889 | 3064 |
| 16890 | 3064 |
| 16891 | 3064 |
| 16892 | 3064 |
| 16893 | 3064 |
| 16894 | 3064 |
| 16895 | 3036 |
| 16896 | 3036 |
| 16897 | 3036 |
| 16898 | 3036 |
| 16899 | 3036 |
| 16900 | 3036 |
| 16901 | 3036 |
| 16902 | 3036 |
| 16903 | 3036 |
| 16904 | 3036 |
| 16905 | 3036 |
| 16906 | 3036 |
| 16907 | 3036 |
| 16908 | 3036 |
| 16909 | 3036 |
| 16910 | 3036 |
| 16911 | 3036 |
| 16912 | 3036 |
| 16913 | 3036 |
| 16914 | 3036 |
| 16915 | 3036 |
| 16916 | 3036 |
| 16917 | 3036 |
| 16918 | 3036 |
| 16919 | 3036 |
| 16920 | 3036 |
| 16921 | 3036 |
| 16922 | 3036 |
| 16923 | 3036 |
| 16924 | 3036 |
| 16925 | 3036 |
| 16926 | 3036 |
| 16927 | 3036 |
| 16928 | 3036 |
| 16929 | 3036 |
| 16930 | 3036 |
| 16931 | 3036 |
| 16932 | 3036 |
| 16933 | 3036 |
| 16934 | 3036 |
| 16935 | 3036 |
| 16936 | 3036 |
| 16937 | 3036 |
| 16938 | 3036 |
| 16939 | 3036 |
| 16940 | 3036 |
| 16941 | 3036 |
| 16942 | 3036 |
| 16943 | 3060 |
| 16944 | 3060 |
| 16945 | 3060 |
| 16946 | 3060 |
| 16947 | 3060 |
| 16948 | 3060 |
| 16949 | 3060 |
| 16950 | 3060 |
| 16951 | 3060 |
| 16952 | 3060 |
| 16953 | 3060 |
| 16954 | 3060 |
| 16955 | 3060 |
| 16956 | 3060 |
| 16957 | 3060 |
| 16958 | 3060 |
| 16959 | 3060 |
| 16960 | 3060 |
| 16961 | 3060 |
| 16962 | 3060 |
| 16963 | 3060 |
| 16964 | 3060 |
| 16965 | 3060 |
| 16966 | 3060 |
| 16967 | 3060 |
| 16968 | 3060 |
| 16969 | 3060 |
| 16970 | 3060 |
| 16971 | 3060 |
| 16972 | 3060 |
| 16973 | 3060 |
| 16974 | 3060 |
| 16975 | 3060 |
| 16976 | 3060 |
| 16977 | 3060 |
| 16978 | 3060 |
| 16979 | 3060 |
| 16980 | 3060 |
| 16981 | 3060 |
| 16982 | 3060 |
| 16983 | 3060 |
| 16984 | 3060 |
| 16985 | 3060 |
| 16986 | 3060 |
| 16987 | 3060 |
| 16988 | 3060 |
| 16989 | 3060 |
| 16990 | 3060 |
| 16991 | 3048 |
| 16992 | 3048 |
| 16993 | 3048 |
| 16994 | 3048 |
| 16995 | 3048 |
| 16996 | 3048 |
| 16997 | 3048 |
| 16998 | 3048 |
| 16999 | 3048 |
| 17000 | 3048 |
| 17001 | 3048 |
| 17002 | 3048 |
| 17003 | 3048 |
| 17004 | 3048 |
| 17005 | 3048 |
| 17006 | 3048 |
| 17007 | 3048 |
| 17008 | 3048 |
| 17009 | 3048 |
| 17010 | 3048 |
| 17011 | 3048 |
| 17012 | 3048 |
| 17013 | 3048 |
| 17014 | 3048 |
| 17015 | 3048 |
| 17016 | 3048 |
| 17017 | 3048 |
| 17018 | 3048 |
| 17019 | 3048 |
| 17020 | 3048 |
| 17021 | 3048 |
| 17022 | 3048 |
| 17023 | 3048 |
| 17024 | 3048 |
| 17025 | 3048 |
| 17026 | 3048 |
| 17027 | 3048 |
| 17028 | 3048 |
| 17029 | 3048 |
| 17030 | 3048 |
| 17031 | 3048 |
| 17032 | 3048 |
| 17033 | 3048 |
| 17034 | 3048 |
| 17035 | 3048 |
| 17036 | 3048 |
| 17037 | 3048 |
| 17038 | 3048 |
| 17039 | 3048 |
| 17040 | 3040 |
| 17041 | 3040 |
| 17042 | 3040 |
| 17043 | 3040 |
| 17044 | 3040 |
| 17045 | 3040 |
| 17046 | 3040 |
| 17047 | 3040 |
| 17048 | 3040 |
| 17049 | 3040 |
| 17050 | 3040 |
| 17051 | 3040 |
| 17052 | 3040 |
| 17053 | 3040 |
| 17054 | 3040 |
| 17055 | 3040 |
| 17056 | 3040 |
| 17057 | 3040 |
| 17058 | 3040 |
| 17059 | 3040 |
| 17060 | 3040 |
| 17061 | 3040 |
| 17062 | 3040 |
| 17063 | 3040 |
| 17064 | 3040 |
| 17065 | 3040 |
| 17066 | 3040 |
| 17067 | 3040 |
| 17068 | 3040 |
| 17069 | 3040 |
| 17070 | 3040 |
| 17071 | 3040 |
| 17072 | 3040 |
| 17073 | 3040 |
| 17074 | 3040 |
| 17075 | 3040 |
| 17076 | 3040 |
| 17077 | 3040 |
| 17078 | 3040 |
| 17079 | 3040 |
| 17080 | 3040 |
| 17081 | 3040 |
| 17082 | 3040 |
| 17083 | 3040 |
| 17084 | 3040 |
| 17085 | 3040 |
| 17086 | 3040 |
| 17087 | 3040 |
| 17088 | 3052 |
| 17089 | 3052 |
| 17090 | 3052 |
| 17091 | 3052 |
| 17092 | 3052 |
| 17093 | 3052 |
| 17094 | 3052 |
| 17095 | 3052 |
| 17096 | 3052 |
| 17097 | 3052 |
| 17098 | 3052 |
| 17099 | 3052 |
| 17100 | 3052 |
| 17101 | 3052 |
| 17102 | 3052 |
| 17103 | 3052 |
| 17104 | 3052 |
| 17105 | 3052 |
| 17106 | 3052 |
| 17107 | 3052 |
| 17108 | 3052 |
| 17109 | 3052 |
| 17110 | 3052 |
| 17111 | 3052 |
| 17112 | 3052 |
| 17113 | 3052 |
| 17114 | 3052 |
| 17115 | 3052 |
| 17116 | 3052 |
| 17117 | 3052 |
| 17118 | 3052 |
| 17119 | 3052 |
| 17120 | 3052 |
| 17121 | 3052 |
| 17122 | 3052 |
| 17123 | 3052 |
| 17124 | 3052 |
| 17125 | 3052 |
| 17126 | 3052 |
| 17127 | 3052 |
| 17128 | 3052 |
| 17129 | 3052 |
| 17130 | 3052 |
| 17131 | 3052 |
| 17132 | 3052 |
| 17133 | 3052 |
| 17134 | 3052 |
| 17135 | 3052 |
| 17136 | 3036 |
| 17137 | 3036 |
| 17138 | 3036 |
| 17139 | 3036 |
| 17140 | 3036 |
| 17141 | 3036 |
| 17142 | 3036 |
| 17143 | 3036 |
| 17144 | 3036 |
| 17145 | 3036 |
| 17146 | 3036 |
| 17147 | 3036 |
| 17148 | 3036 |
| 17149 | 3036 |
| 17150 | 3036 |
| 17151 | 3036 |
| 17152 | 3036 |
| 17153 | 3036 |
| 17154 | 3036 |
| 17155 | 3036 |
| 17156 | 3036 |
| 17157 | 3036 |
| 17158 | 3036 |
| 17159 | 3036 |
| 17160 | 3036 |
| 17161 | 3036 |
| 17162 | 3036 |
| 17163 | 3036 |
| 17164 | 3036 |
| 17165 | 3036 |
| 17166 | 3036 |
| 17167 | 3036 |
| 17168 | 3036 |
| 17169 | 3036 |
| 17170 | 3036 |
| 17171 | 3036 |
| 17172 | 3036 |
| 17173 | 3036 |
| 17174 | 3036 |
| 17175 | 3036 |
| 17176 | 3036 |
| 17177 | 3036 |
| 17178 | 3036 |
| 17179 | 3036 |
| 17180 | 3036 |
| 17181 | 3036 |
| 17182 | 3036 |
| 17183 | 3036 |
| 17184 | 3040 |
| 17185 | 3040 |
| 17186 | 3040 |
| 17187 | 3040 |
| 17188 | 3040 |
| 17189 | 3040 |
| 17190 | 3040 |
| 17191 | 3040 |
| 17192 | 3040 |
| 17193 | 3040 |
| 17194 | 3040 |
| 17195 | 3040 |
| 17196 | 3040 |
| 17197 | 3040 |
| 17198 | 3040 |
| 17199 | 3040 |
| 17200 | 3040 |
| 17201 | 3040 |
| 17202 | 3040 |
| 17203 | 3040 |
| 17204 | 3040 |
| 17205 | 3040 |
| 17206 | 3040 |
| 17207 | 3040 |
| 17208 | 3040 |
| 17209 | 3040 |
| 17210 | 3040 |
| 17211 | 3040 |
| 17212 | 3040 |
| 17213 | 3040 |
| 17214 | 3040 |
| 17215 | 3040 |
| 17216 | 3040 |
| 17217 | 3040 |
| 17218 | 3040 |
| 17219 | 3040 |
| 17220 | 3040 |
| 17221 | 3040 |
| 17222 | 3040 |
| 17223 | 3040 |
| 17224 | 3040 |
| 17225 | 3040 |
| 17226 | 3040 |
| 17227 | 3040 |
| 17228 | 3040 |
| 17229 | 3040 |
| 17230 | 3040 |
| 17231 | 3040 |
| 17232 | 3040 |
| 17233 | 3040 |
| 17234 | 3040 |
| 17235 | 3040 |
| 17236 | 3040 |
| 17237 | 3040 |
| 17238 | 3040 |
| 17239 | 3040 |
| 17240 | 3040 |
| 17241 | 3040 |
| 17242 | 3040 |
| 17243 | 3040 |
| 17244 | 3040 |
| 17245 | 3040 |
| 17246 | 3040 |
| 17247 | 3040 |
| 17248 | 3040 |
| 17249 | 3040 |
| 17250 | 3040 |
| 17251 | 3040 |
| 17252 | 3040 |
| 17253 | 3040 |
| 17254 | 3040 |
| 17255 | 3040 |
| 17256 | 3040 |
| 17257 | 3040 |
| 17258 | 3040 |
| 17259 | 3040 |
| 17260 | 3040 |
| 17261 | 3040 |
| 17262 | 3040 |
| 17263 | 3040 |
| 17264 | 3040 |
| 17265 | 3040 |
| 17266 | 3040 |
| 17267 | 3040 |
| 17268 | 3040 |
| 17269 | 3040 |
| 17270 | 3040 |
| 17271 | 3040 |
| 17272 | 3040 |
| 17273 | 3040 |
| 17274 | 3040 |
| 17275 | 3040 |
| 17276 | 3040 |
| 17277 | 3040 |
| 17278 | 3040 |
| 17279 | 3040 |
| 17280 | 3040 |
| 17281 | 3036 |
| 17282 | 3036 |
| 17283 | 3036 |
| 17284 | 3036 |
| 17285 | 3036 |
| 17286 | 3036 |
| 17287 | 3036 |
| 17288 | 3036 |
| 17289 | 3036 |
| 17290 | 3036 |
| 17291 | 3036 |
| 17292 | 3036 |
| 17293 | 3036 |
| 17294 | 3036 |
| 17295 | 3036 |
| 17296 | 3036 |
| 17297 | 3036 |
| 17298 | 3036 |
| 17299 | 3036 |
| 17300 | 3036 |
| 17301 | 3036 |
| 17302 | 3036 |
| 17303 | 3036 |
| 17304 | 3036 |
| 17305 | 3036 |
| 17306 | 3036 |
| 17307 | 3036 |
| 17308 | 3036 |
| 17309 | 3036 |
| 17310 | 3036 |
| 17311 | 3036 |
| 17312 | 3036 |
| 17313 | 3036 |
| 17314 | 3036 |
| 17315 | 3036 |
| 17316 | 3036 |
| 17317 | 3036 |
| 17318 | 3036 |
| 17319 | 3036 |
| 17320 | 3036 |
| 17321 | 3036 |
| 17322 | 3036 |
| 17323 | 3036 |
| 17324 | 3036 |
| 17325 | 3036 |
| 17326 | 3036 |
| 17327 | 3036 |
| 17328 | 3036 |
| 17329 | 3040 |
| 17330 | 3040 |
| 17331 | 3040 |
| 17332 | 3040 |
| 17333 | 3040 |
| 17334 | 3040 |
| 17335 | 3040 |
| 17336 | 3040 |
| 17337 | 3040 |
| 17338 | 3040 |
| 17339 | 3040 |
| 17340 | 3040 |
| 17341 | 3040 |
| 17342 | 3040 |
| 17343 | 3040 |
| 17344 | 3040 |
| 17345 | 3040 |
| 17346 | 3040 |
| 17347 | 3040 |
| 17348 | 3040 |
| 17349 | 3040 |
| 17350 | 3040 |
| 17351 | 3040 |
| 17352 | 3040 |
| 17353 | 3040 |
| 17354 | 3040 |
| 17355 | 3040 |
| 17356 | 3040 |
| 17357 | 3040 |
| 17358 | 3040 |
| 17359 | 3040 |
| 17360 | 3040 |
| 17361 | 3040 |
| 17362 | 3040 |
| 17363 | 3040 |
| 17364 | 3040 |
| 17365 | 3040 |
| 17366 | 3040 |
| 17367 | 3040 |
| 17368 | 3040 |
| 17369 | 3040 |
| 17370 | 3040 |
| 17371 | 3040 |
| 17372 | 3040 |
| 17373 | 3040 |
| 17374 | 3040 |
| 17375 | 3040 |
| 17376 | 3040 |
| 17377 | 3064 |
| 17378 | 3064 |
| 17379 | 3064 |
| 17380 | 3064 |
| 17381 | 3064 |
| 17382 | 3064 |
| 17383 | 3064 |
| 17384 | 3064 |
| 17385 | 3064 |
| 17386 | 3064 |
| 17387 | 3064 |
| 17388 | 3064 |
| 17389 | 3064 |
| 17390 | 3064 |
| 17391 | 3064 |
| 17392 | 3064 |
| 17393 | 3064 |
| 17394 | 3064 |
| 17395 | 3064 |
| 17396 | 3064 |
| 17397 | 3064 |
| 17398 | 3064 |
| 17399 | 3064 |
| 17400 | 3064 |
| 17401 | 3064 |
| 17402 | 3064 |
| 17403 | 3064 |
| 17404 | 3064 |
| 17405 | 3064 |
| 17406 | 3064 |
| 17407 | 3064 |
| 17408 | 3064 |
| 17409 | 3064 |
| 17410 | 3064 |
| 17411 | 3064 |
| 17412 | 3064 |
| 17413 | 3064 |
| 17414 | 3064 |
| 17415 | 3064 |
| 17416 | 3064 |
| 17417 | 3064 |
| 17418 | 3064 |
| 17419 | 3064 |
| 17420 | 3064 |
| 17421 | 3064 |
| 17422 | 3064 |
| 17423 | 3064 |
| 17424 | 3064 |
| 17425 | 3064 |
| 17426 | 3064 |
| 17427 | 3064 |
| 17428 | 3064 |
| 17429 | 3064 |
| 17430 | 3064 |
| 17431 | 3064 |
| 17432 | 3064 |
| 17433 | 3064 |
| 17434 | 3064 |
| 17435 | 3064 |
| 17436 | 3064 |
| 17437 | 3064 |
| 17438 | 3064 |
| 17439 | 3064 |
| 17440 | 3064 |
| 17441 | 3064 |
| 17442 | 3064 |
| 17443 | 3064 |
| 17444 | 3064 |
| 17445 | 3064 |
| 17446 | 3064 |
| 17447 | 3064 |
| 17448 | 3064 |
| 17449 | 3064 |
| 17450 | 3064 |
| 17451 | 3064 |
| 17452 | 3064 |
| 17453 | 3064 |
| 17454 | 3064 |
| 17455 | 3064 |
| 17456 | 3064 |
| 17457 | 3064 |
| 17458 | 3064 |
| 17459 | 3064 |
| 17460 | 3064 |
| 17461 | 3064 |
| 17462 | 3064 |
| 17463 | 3064 |
| 17464 | 3064 |
| 17465 | 3064 |
| 17466 | 3064 |
| 17467 | 3064 |
| 17468 | 3064 |
| 17469 | 3064 |
| 17470 | 3064 |
| 17471 | 3064 |
| 17472 | 3064 |
| 17473 | 3064 |
| 17474 | 3056 |
| 17475 | 3056 |
| 17476 | 3056 |
| 17477 | 3056 |
| 17478 | 3056 |
| 17479 | 3056 |
| 17480 | 3056 |
| 17481 | 3056 |
| 17482 | 3056 |
| 17483 | 3056 |
| 17484 | 3056 |
| 17485 | 3056 |
| 17486 | 3056 |
| 17487 | 3056 |
| 17488 | 3056 |
| 17489 | 3056 |
| 17490 | 3056 |
| 17491 | 3056 |
| 17492 | 3056 |
| 17493 | 3056 |
| 17494 | 3056 |
| 17495 | 3056 |
| 17496 | 3056 |
| 17497 | 3056 |
| 17498 | 3056 |
| 17499 | 3056 |
| 17500 | 3056 |
| 17501 | 3056 |
| 17502 | 3056 |
| 17503 | 3056 |
| 17504 | 3056 |
| 17505 | 3056 |
| 17506 | 3056 |
| 17507 | 3056 |
| 17508 | 3056 |
| 17509 | 3056 |
| 17510 | 3056 |
| 17511 | 3056 |
| 17512 | 3056 |
| 17513 | 3056 |
| 17514 | 3056 |
| 17515 | 3056 |
| 17516 | 3056 |
| 17517 | 3056 |
| 17518 | 3056 |
| 17519 | 3056 |
| 17520 | 3056 |
| 17521 | 3056 |
| 17522 | 3056 |
| 17523 | 3056 |
| 17524 | 3056 |
| 17525 | 3056 |
| 17526 | 3056 |
| 17527 | 3056 |
| 17528 | 3056 |
| 17529 | 3056 |
| 17530 | 3056 |
| 17531 | 3056 |
| 17532 | 3056 |
| 17533 | 3056 |
| 17534 | 3056 |
| 17535 | 3056 |
| 17536 | 3056 |
| 17537 | 3056 |
| 17538 | 3056 |
| 17539 | 3056 |
| 17540 | 3056 |
| 17541 | 3056 |
| 17542 | 3056 |
| 17543 | 3056 |
| 17544 | 3056 |
| 17545 | 3056 |
| 17546 | 3056 |
| 17547 | 3056 |
| 17548 | 3056 |
| 17549 | 3056 |
| 17550 | 3056 |
| 17551 | 3056 |
| 17552 | 3056 |
| 17553 | 3056 |
| 17554 | 3056 |
| 17555 | 3056 |
| 17556 | 3056 |
| 17557 | 3056 |
| 17558 | 3056 |
| 17559 | 3056 |
| 17560 | 3056 |
| 17561 | 3056 |
| 17562 | 3056 |
| 17563 | 3056 |
| 17564 | 3056 |
| 17565 | 3056 |
| 17566 | 3056 |
| 17567 | 3056 |
| 17568 | 3056 |
| 17569 | 3056 |
| 17570 | 3080 |
| 17571 | 3080 |
| 17572 | 3080 |
| 17573 | 3080 |
| 17574 | 3080 |
| 17575 | 3080 |
| 17576 | 3080 |
| 17577 | 3080 |
| 17578 | 3080 |
| 17579 | 3080 |
| 17580 | 3080 |
| 17581 | 3080 |
| 17582 | 3080 |
| 17583 | 3080 |
| 17584 | 3080 |
| 17585 | 3080 |
| 17586 | 3080 |
| 17587 | 3080 |
| 17588 | 3080 |
| 17589 | 3080 |
| 17590 | 3080 |
| 17591 | 3080 |
| 17592 | 3080 |
| 17593 | 3080 |
| 17594 | 3080 |
| 17595 | 3080 |
| 17596 | 3080 |
| 17597 | 3080 |
| 17598 | 3080 |
| 17599 | 3080 |
| 17600 | 3080 |
| 17601 | 3080 |
| 17602 | 3080 |
| 17603 | 3080 |
| 17604 | 3080 |
| 17605 | 3080 |
| 17606 | 3080 |
| 17607 | 3080 |
| 17608 | 3080 |
| 17609 | 3080 |
| 17610 | 3080 |
| 17611 | 3080 |
| 17612 | 3080 |
| 17613 | 3080 |
| 17614 | 3080 |
| 17615 | 3080 |
| 17616 | 3080 |
| 17617 | 3080 |
| 17618 | 3284 |
| 17619 | 3284 |
| 17620 | 3284 |
| 17621 | 3284 |
| 17622 | 3284 |
| 17623 | 3284 |
| 17624 | 3284 |
| 17625 | 3284 |
| 17626 | 3284 |
| 17627 | 3284 |
| 17628 | 3284 |
| 17629 | 3284 |
| 17630 | 3284 |
| 17631 | 3284 |
| 17632 | 3284 |
| 17633 | 3284 |
| 17634 | 3284 |
| 17635 | 3284 |
| 17636 | 3284 |
| 17637 | 3284 |
| 17638 | 3284 |
| 17639 | 3284 |
| 17640 | 3284 |
| 17641 | 3284 |
| 17642 | 3284 |
| 17643 | 3284 |
| 17644 | 3284 |
| 17645 | 3284 |
| 17646 | 3284 |
| 17647 | 3284 |
| 17648 | 3284 |
| 17649 | 3284 |
| 17650 | 3284 |
| 17651 | 3284 |
| 17652 | 3284 |
| 17653 | 3284 |
| 17654 | 3284 |
| 17655 | 3284 |
| 17656 | 3284 |
| 17657 | 3284 |
| 17658 | 3284 |
| 17659 | 3284 |
| 17660 | 3284 |
| 17661 | 3284 |
| 17662 | 3284 |
| 17663 | 3284 |
| 17664 | 3284 |
| 17665 | 3284 |
| 17666 | 3284 |
| 17667 | 3036 |
| 17668 | 3036 |
| 17669 | 3036 |
| 17670 | 3036 |
| 17671 | 3036 |
| 17672 | 3036 |
| 17673 | 3036 |
| 17674 | 3036 |
| 17675 | 3036 |
| 17676 | 3036 |
| 17677 | 3036 |
| 17678 | 3036 |
| 17679 | 3036 |
| 17680 | 3036 |
| 17681 | 3036 |
| 17682 | 3036 |
| 17683 | 3036 |
| 17684 | 3036 |
| 17685 | 3036 |
| 17686 | 3036 |
| 17687 | 3036 |
| 17688 | 3036 |
| 17689 | 3036 |
| 17690 | 3036 |
| 17691 | 3036 |
| 17692 | 3036 |
| 17693 | 3036 |
| 17694 | 3036 |
| 17695 | 3036 |
| 17696 | 3036 |
| 17697 | 3036 |
| 17698 | 3036 |
| 17699 | 3036 |
| 17700 | 3036 |
| 17701 | 3036 |
| 17702 | 3036 |
| 17703 | 3036 |
| 17704 | 3036 |
| 17705 | 3036 |
| 17706 | 3036 |
| 17707 | 3036 |
| 17708 | 3036 |
| 17709 | 3036 |
| 17710 | 3036 |
| 17711 | 3036 |
| 17712 | 3036 |
| 17713 | 3036 |
| 17714 | 3036 |
| 17715 | 3048 |
| 17716 | 3048 |
| 17717 | 3048 |
| 17718 | 3048 |
| 17719 | 3048 |
| 17720 | 3048 |
| 17721 | 3048 |
| 17722 | 3048 |
| 17723 | 3048 |
| 17724 | 3048 |
| 17725 | 3048 |
| 17726 | 3048 |
| 17727 | 3048 |
| 17728 | 3048 |
| 17729 | 3048 |
| 17730 | 3048 |
| 17731 | 3048 |
| 17732 | 3048 |
| 17733 | 3048 |
| 17734 | 3048 |
| 17735 | 3048 |
| 17736 | 3048 |
| 17737 | 3048 |
| 17738 | 3048 |
| 17739 | 3048 |
| 17740 | 3048 |
| 17741 | 3048 |
| 17742 | 3048 |
| 17743 | 3048 |
| 17744 | 3048 |
| 17745 | 3048 |
| 17746 | 3048 |
| 17747 | 3048 |
| 17748 | 3048 |
| 17749 | 3048 |
| 17750 | 3048 |
| 17751 | 3048 |
| 17752 | 3048 |
| 17753 | 3048 |
| 17754 | 3048 |
| 17755 | 3048 |
| 17756 | 3048 |
| 17757 | 3048 |
| 17758 | 3048 |
| 17759 | 3048 |
| 17760 | 3048 |
| 17761 | 3048 |
| 17762 | 3048 |
| 17763 | 3096 |
| 17764 | 3096 |
| 17765 | 3096 |
| 17766 | 3096 |
| 17767 | 3096 |
| 17768 | 3096 |
| 17769 | 3096 |
| 17770 | 3096 |
| 17771 | 3096 |
| 17772 | 3096 |
| 17773 | 3096 |
| 17774 | 3096 |
| 17775 | 3096 |
| 17776 | 3096 |
| 17777 | 3096 |
| 17778 | 3096 |
| 17779 | 3096 |
| 17780 | 3096 |
| 17781 | 3096 |
| 17782 | 3096 |
| 17783 | 3096 |
| 17784 | 3096 |
| 17785 | 3096 |
| 17786 | 3096 |
| 17787 | 3096 |
| 17788 | 3096 |
| 17789 | 3096 |
| 17790 | 3096 |
| 17791 | 3096 |
| 17792 | 3096 |
| 17793 | 3096 |
| 17794 | 3096 |
| 17795 | 3096 |
| 17796 | 3096 |
| 17797 | 3096 |
| 17798 | 3096 |
| 17799 | 3096 |
| 17800 | 3096 |
| 17801 | 3096 |
| 17802 | 3096 |
| 17803 | 3096 |
| 17804 | 3096 |
| 17805 | 3096 |
| 17806 | 3096 |
| 17807 | 3096 |
| 17808 | 3096 |
| 17809 | 3096 |
| 17810 | 3096 |
| 17811 | 3048 |
| 17812 | 3048 |
| 17813 | 3048 |
| 17814 | 3048 |
| 17815 | 3048 |
| 17816 | 3048 |
| 17817 | 3048 |
| 17818 | 3048 |
| 17819 | 3048 |
| 17820 | 3048 |
| 17821 | 3048 |
| 17822 | 3048 |
| 17823 | 3048 |
| 17824 | 3048 |
| 17825 | 3048 |
| 17826 | 3048 |
| 17827 | 3048 |
| 17828 | 3048 |
| 17829 | 3048 |
| 17830 | 3048 |
| 17831 | 3048 |
| 17832 | 3048 |
| 17833 | 3048 |
| 17834 | 3048 |
| 17835 | 3048 |
| 17836 | 3048 |
| 17837 | 3048 |
| 17838 | 3048 |
| 17839 | 3048 |
| 17840 | 3048 |
| 17841 | 3048 |
| 17842 | 3048 |
| 17843 | 3048 |
| 17844 | 3048 |
| 17845 | 3048 |
| 17846 | 3048 |
| 17847 | 3048 |
| 17848 | 3048 |
| 17849 | 3048 |
| 17850 | 3048 |
| 17851 | 3048 |
| 17852 | 3048 |
| 17853 | 3048 |
| 17854 | 3048 |
| 17855 | 3048 |
| 17856 | 3048 |
| 17857 | 3048 |
| 17858 | 3048 |
| 17859 | 3052 |
| 17860 | 3052 |
| 17861 | 3052 |
| 17862 | 3052 |
| 17863 | 3052 |
| 17864 | 3052 |
| 17865 | 3052 |
| 17866 | 3052 |
| 17867 | 3052 |
| 17868 | 3052 |
| 17869 | 3052 |
| 17870 | 3052 |
| 17871 | 3052 |
| 17872 | 3052 |
| 17873 | 3052 |
| 17874 | 3052 |
| 17875 | 3052 |
| 17876 | 3052 |
| 17877 | 3052 |
| 17878 | 3052 |
| 17879 | 3052 |
| 17880 | 3052 |
| 17881 | 3052 |
| 17882 | 3052 |
| 17883 | 3052 |
| 17884 | 3052 |
| 17885 | 3052 |
| 17886 | 3052 |
| 17887 | 3052 |
| 17888 | 3052 |
| 17889 | 3052 |
| 17890 | 3052 |
| 17891 | 3052 |
| 17892 | 3052 |
| 17893 | 3052 |
| 17894 | 3052 |
| 17895 | 3052 |
| 17896 | 3052 |
| 17897 | 3052 |
| 17898 | 3052 |
| 17899 | 3052 |
| 17900 | 3052 |
| 17901 | 3052 |
| 17902 | 3052 |
| 17903 | 3052 |
| 17904 | 3052 |
| 17905 | 3052 |
| 17906 | 3052 |
| 17907 | 3052 |
| 17908 | 3056 |
| 17909 | 3056 |
| 17910 | 3056 |
| 17911 | 3056 |
| 17912 | 3056 |
| 17913 | 3056 |
| 17914 | 3056 |
| 17915 | 3056 |
| 17916 | 3056 |
| 17917 | 3056 |
| 17918 | 3056 |
| 17919 | 3056 |
| 17920 | 3056 |
| 17921 | 3056 |
| 17922 | 3056 |
| 17923 | 3056 |
| 17924 | 3056 |
| 17925 | 3056 |
| 17926 | 3056 |
| 17927 | 3056 |
| 17928 | 3056 |
| 17929 | 3056 |
| 17930 | 3056 |
| 17931 | 3056 |
| 17932 | 3056 |
| 17933 | 3056 |
| 17934 | 3056 |
| 17935 | 3056 |
| 17936 | 3056 |
| 17937 | 3056 |
| 17938 | 3056 |
| 17939 | 3056 |
| 17940 | 3056 |
| 17941 | 3056 |
| 17942 | 3056 |
| 17943 | 3056 |
| 17944 | 3056 |
| 17945 | 3056 |
| 17946 | 3056 |
| 17947 | 3056 |
| 17948 | 3056 |
| 17949 | 3056 |
| 17950 | 3056 |
| 17951 | 3056 |
| 17952 | 3056 |
| 17953 | 3056 |
| 17954 | 3056 |
| 17955 | 3056 |
| 17956 | 3068 |
| 17957 | 3068 |
| 17958 | 3068 |
| 17959 | 3068 |
| 17960 | 3068 |
| 17961 | 3068 |
| 17962 | 3068 |
| 17963 | 3068 |
| 17964 | 3068 |
| 17965 | 3068 |
| 17966 | 3068 |
| 17967 | 3068 |
| 17968 | 3068 |
| 17969 | 3068 |
| 17970 | 3068 |
| 17971 | 3068 |
| 17972 | 3068 |
| 17973 | 3068 |
| 17974 | 3068 |
| 17975 | 3068 |
| 17976 | 3068 |
| 17977 | 3068 |
| 17978 | 3068 |
| 17979 | 3068 |
| 17980 | 3068 |
| 17981 | 3068 |
| 17982 | 3068 |
| 17983 | 3068 |
| 17984 | 3068 |
| 17985 | 3068 |
| 17986 | 3068 |
| 17987 | 3068 |
| 17988 | 3068 |
| 17989 | 3068 |
| 17990 | 3068 |
| 17991 | 3068 |
| 17992 | 3068 |
| 17993 | 3068 |
| 17994 | 3068 |
| 17995 | 3068 |
| 17996 | 3068 |
| 17997 | 3068 |
| 17998 | 3068 |
| 17999 | 3068 |
| 18000 | 3068 |
| 18001 | 3068 |
| 18002 | 3068 |
| 18003 | 3068 |
| 18004 | 3068 |
| 18005 | 3068 |
| 18006 | 3068 |
| 18007 | 3068 |
| 18008 | 3068 |
| 18009 | 3068 |
| 18010 | 3068 |
| 18011 | 3068 |
| 18012 | 3068 |
| 18013 | 3068 |
| 18014 | 3068 |
| 18015 | 3068 |
| 18016 | 3068 |
| 18017 | 3068 |
| 18018 | 3068 |
| 18019 | 3068 |
| 18020 | 3068 |
| 18021 | 3068 |
| 18022 | 3068 |
| 18023 | 3068 |
| 18024 | 3068 |
| 18025 | 3068 |
| 18026 | 3068 |
| 18027 | 3068 |
| 18028 | 3068 |
| 18029 | 3068 |
| 18030 | 3068 |
| 18031 | 3068 |
| 18032 | 3068 |
| 18033 | 3068 |
| 18034 | 3068 |
| 18035 | 3068 |
| 18036 | 3068 |
| 18037 | 3068 |
| 18038 | 3068 |
| 18039 | 3068 |
| 18040 | 3068 |
| 18041 | 3068 |
| 18042 | 3068 |
| 18043 | 3068 |
| 18044 | 3068 |
| 18045 | 3068 |
| 18046 | 3068 |
| 18047 | 3068 |
| 18048 | 3068 |
| 18049 | 3068 |
| 18050 | 3068 |
| 18051 | 3068 |
| 18052 | 3056 |
| 18053 | 3056 |
| 18054 | 3056 |
| 18055 | 3056 |
| 18056 | 3056 |
| 18057 | 3056 |
| 18058 | 3056 |
| 18059 | 3056 |
| 18060 | 3056 |
| 18061 | 3056 |
| 18062 | 3056 |
| 18063 | 3056 |
| 18064 | 3056 |
| 18065 | 3056 |
| 18066 | 3056 |
| 18067 | 3056 |
| 18068 | 3056 |
| 18069 | 3056 |
| 18070 | 3056 |
| 18071 | 3056 |
| 18072 | 3056 |
| 18073 | 3056 |
| 18074 | 3056 |
| 18075 | 3056 |
| 18076 | 3056 |
| 18077 | 3056 |
| 18078 | 3056 |
| 18079 | 3056 |
| 18080 | 3056 |
| 18081 | 3056 |
| 18082 | 3056 |
| 18083 | 3056 |
| 18084 | 3056 |
| 18085 | 3056 |
| 18086 | 3056 |
| 18087 | 3056 |
| 18088 | 3056 |
| 18089 | 3056 |
| 18090 | 3056 |
| 18091 | 3056 |
| 18092 | 3056 |
| 18093 | 3056 |
| 18094 | 3056 |
| 18095 | 3056 |
| 18096 | 3056 |
| 18097 | 3056 |
| 18098 | 3056 |
| 18099 | 3056 |
| 18100 | 3048 |
| 18101 | 3048 |
| 18102 | 3048 |
| 18103 | 3048 |
| 18104 | 3048 |
| 18105 | 3048 |
| 18106 | 3048 |
| 18107 | 3048 |
| 18108 | 3048 |
| 18109 | 3048 |
| 18110 | 3048 |
| 18111 | 3048 |
| 18112 | 3048 |
| 18113 | 3048 |
| 18114 | 3048 |
| 18115 | 3048 |
| 18116 | 3048 |
| 18117 | 3048 |
| 18118 | 3048 |
| 18119 | 3048 |
| 18120 | 3048 |
| 18121 | 3048 |
| 18122 | 3048 |
| 18123 | 3048 |
| 18124 | 3048 |
| 18125 | 3048 |
| 18126 | 3048 |
| 18127 | 3048 |
| 18128 | 3048 |
| 18129 | 3048 |
| 18130 | 3048 |
| 18131 | 3048 |
| 18132 | 3048 |
| 18133 | 3048 |
| 18134 | 3048 |
| 18135 | 3048 |
| 18136 | 3048 |
| 18137 | 3048 |
| 18138 | 3048 |
| 18139 | 3048 |
| 18140 | 3048 |
| 18141 | 3048 |
| 18142 | 3048 |
| 18143 | 3048 |
| 18144 | 3048 |
| 18145 | 3048 |
| 18146 | 3048 |
| 18147 | 3048 |
| 18148 | 3024 |
| 18149 | 3024 |
| 18150 | 3024 |
| 18151 | 3024 |
| 18152 | 3024 |
| 18153 | 3024 |
| 18154 | 3024 |
| 18155 | 3024 |
| 18156 | 3024 |
| 18157 | 3024 |
| 18158 | 3024 |
| 18159 | 3024 |
| 18160 | 3024 |
| 18161 | 3024 |
| 18162 | 3024 |
| 18163 | 3024 |
| 18164 | 3024 |
| 18165 | 3024 |
| 18166 | 3024 |
| 18167 | 3024 |
| 18168 | 3024 |
| 18169 | 3024 |
| 18170 | 3024 |
| 18171 | 3024 |
| 18172 | 3024 |
| 18173 | 3024 |
| 18174 | 3024 |
| 18175 | 3024 |
| 18176 | 3024 |
| 18177 | 3024 |
| 18178 | 3024 |
| 18179 | 3024 |
| 18180 | 3024 |
| 18181 | 3024 |
| 18182 | 3024 |
| 18183 | 3024 |
| 18184 | 3024 |
| 18185 | 3024 |
| 18186 | 3024 |
| 18187 | 3024 |
| 18188 | 3024 |
| 18189 | 3024 |
| 18190 | 3024 |
| 18191 | 3024 |
| 18192 | 3024 |
| 18193 | 3024 |
| 18194 | 3024 |
| 18195 | 3024 |
| 18196 | 3024 |
| 18197 | 3080 |
| 18198 | 3080 |
| 18199 | 3080 |
| 18200 | 3080 |
| 18201 | 3080 |
| 18202 | 3080 |
| 18203 | 3080 |
| 18204 | 3080 |
| 18205 | 3080 |
| 18206 | 3080 |
| 18207 | 3080 |
| 18208 | 3080 |
| 18209 | 3080 |
| 18210 | 3080 |
| 18211 | 3080 |
| 18212 | 3080 |
| 18213 | 3080 |
| 18214 | 3080 |
| 18215 | 3080 |
| 18216 | 3080 |
| 18217 | 3080 |
| 18218 | 3080 |
| 18219 | 3080 |
| 18220 | 3080 |
| 18221 | 3080 |
| 18222 | 3080 |
| 18223 | 3080 |
| 18224 | 3080 |
| 18225 | 3080 |
| 18226 | 3080 |
| 18227 | 3080 |
| 18228 | 3080 |
| 18229 | 3080 |
| 18230 | 3080 |
| 18231 | 3080 |
| 18232 | 3080 |
| 18233 | 3080 |
| 18234 | 3080 |
| 18235 | 3080 |
| 18236 | 3080 |
| 18237 | 3080 |
| 18238 | 3080 |
| 18239 | 3080 |
| 18240 | 3080 |
| 18241 | 3080 |
| 18242 | 3080 |
| 18243 | 3080 |
| 18244 | 3080 |
| 18245 | 3040 |
| 18246 | 3040 |
| 18247 | 3040 |
| 18248 | 3040 |
| 18249 | 3040 |
| 18250 | 3040 |
| 18251 | 3040 |
| 18252 | 3040 |
| 18253 | 3040 |
| 18254 | 3040 |
| 18255 | 3040 |
| 18256 | 3040 |
| 18257 | 3040 |
| 18258 | 3040 |
| 18259 | 3040 |
| 18260 | 3040 |
| 18261 | 3040 |
| 18262 | 3040 |
| 18263 | 3040 |
| 18264 | 3040 |
| 18265 | 3040 |
| 18266 | 3040 |
| 18267 | 3040 |
| 18268 | 3040 |
| 18269 | 3040 |
| 18270 | 3040 |
| 18271 | 3040 |
| 18272 | 3040 |
| 18273 | 3040 |
| 18274 | 3040 |
| 18275 | 3040 |
| 18276 | 3040 |
| 18277 | 3040 |
| 18278 | 3040 |
| 18279 | 3040 |
| 18280 | 3040 |
| 18281 | 3040 |
| 18282 | 3040 |
| 18283 | 3040 |
| 18284 | 3040 |
| 18285 | 3040 |
| 18286 | 3040 |
| 18287 | 3040 |
| 18288 | 3040 |
| 18289 | 3040 |
| 18290 | 3040 |
| 18291 | 3040 |
| 18292 | 3040 |
| 18293 | 3056 |
| 18294 | 3056 |
| 18295 | 3056 |
| 18296 | 3056 |
| 18297 | 3056 |
| 18298 | 3056 |
| 18299 | 3056 |
| 18300 | 3056 |
| 18301 | 3056 |
| 18302 | 3056 |
| 18303 | 3056 |
| 18304 | 3056 |
| 18305 | 3056 |
| 18306 | 3056 |
| 18307 | 3056 |
| 18308 | 3056 |
| 18309 | 3056 |
| 18310 | 3056 |
| 18311 | 3056 |
| 18312 | 3056 |
| 18313 | 3056 |
| 18314 | 3056 |
| 18315 | 3056 |
| 18316 | 3056 |
| 18317 | 3056 |
| 18318 | 3056 |
| 18319 | 3056 |
| 18320 | 3056 |
| 18321 | 3056 |
| 18322 | 3056 |
| 18323 | 3056 |
| 18324 | 3056 |
| 18325 | 3056 |
| 18326 | 3056 |
| 18327 | 3056 |
| 18328 | 3056 |
| 18329 | 3056 |
| 18330 | 3056 |
| 18331 | 3056 |
| 18332 | 3056 |
| 18333 | 3056 |
| 18334 | 3056 |
| 18335 | 3056 |
| 18336 | 3056 |
| 18337 | 3056 |
| 18338 | 3056 |
| 18339 | 3056 |
| 18340 | 3056 |
| 18341 | 3072 |
| 18342 | 3072 |
| 18343 | 3072 |
| 18344 | 3072 |
| 18345 | 3072 |
| 18346 | 3072 |
| 18347 | 3072 |
| 18348 | 3072 |
| 18349 | 3072 |
| 18350 | 3072 |
| 18351 | 3072 |
| 18352 | 3072 |
| 18353 | 3072 |
| 18354 | 3072 |
| 18355 | 3072 |
| 18356 | 3072 |
| 18357 | 3072 |
| 18358 | 3072 |
| 18359 | 3072 |
| 18360 | 3072 |
| 18361 | 3072 |
| 18362 | 3072 |
| 18363 | 3072 |
| 18364 | 3072 |
| 18365 | 3072 |
| 18366 | 3072 |
| 18367 | 3072 |
| 18368 | 3072 |
| 18369 | 3072 |
| 18370 | 3072 |
| 18371 | 3072 |
| 18372 | 3072 |
| 18373 | 3072 |
| 18374 | 3072 |
| 18375 | 3072 |
| 18376 | 3072 |
| 18377 | 3072 |
| 18378 | 3072 |
| 18379 | 3072 |
| 18380 | 3072 |
| 18381 | 3072 |
| 18382 | 3072 |
| 18383 | 3072 |
| 18384 | 3072 |
| 18385 | 3072 |
| 18386 | 3072 |
| 18387 | 3072 |
| 18388 | 3072 |
| 18389 | 3072 |
| 18390 | 3072 |
| 18391 | 3072 |
| 18392 | 3072 |
| 18393 | 3072 |
| 18394 | 3072 |
| 18395 | 3072 |
| 18396 | 3072 |
| 18397 | 3072 |
| 18398 | 3072 |
| 18399 | 3072 |
| 18400 | 3072 |
| 18401 | 3072 |
| 18402 | 3072 |
| 18403 | 3072 |
| 18404 | 3072 |
| 18405 | 3072 |
| 18406 | 3072 |
| 18407 | 3072 |
| 18408 | 3072 |
| 18409 | 3072 |
| 18410 | 3072 |
| 18411 | 3072 |
| 18412 | 3072 |
| 18413 | 3072 |
| 18414 | 3072 |
| 18415 | 3072 |
| 18416 | 3072 |
| 18417 | 3072 |
| 18418 | 3072 |
| 18419 | 3072 |
| 18420 | 3072 |
| 18421 | 3072 |
| 18422 | 3072 |
| 18423 | 3072 |
| 18424 | 3072 |
| 18425 | 3072 |
| 18426 | 3072 |
| 18427 | 3072 |
| 18428 | 3072 |
| 18429 | 3072 |
| 18430 | 3072 |
| 18431 | 3072 |
| 18432 | 3072 |
| 18433 | 3072 |
| 18434 | 3072 |
| 18435 | 3072 |
| 18436 | 3072 |
| 18437 | 3072 |
| 18438 | 3056 |
| 18439 | 3056 |
| 18440 | 3056 |
| 18441 | 3056 |
| 18442 | 3056 |
| 18443 | 3056 |
| 18444 | 3056 |
| 18445 | 3056 |
| 18446 | 3056 |
| 18447 | 3056 |
| 18448 | 3056 |
| 18449 | 3056 |
| 18450 | 3056 |
| 18451 | 3056 |
| 18452 | 3056 |
| 18453 | 3056 |
| 18454 | 3056 |
| 18455 | 3056 |
| 18456 | 3056 |
| 18457 | 3056 |
| 18458 | 3056 |
| 18459 | 3056 |
| 18460 | 3056 |
| 18461 | 3056 |
| 18462 | 3056 |
| 18463 | 3056 |
| 18464 | 3056 |
| 18465 | 3056 |
| 18466 | 3056 |
| 18467 | 3056 |
| 18468 | 3056 |
| 18469 | 3056 |
| 18470 | 3056 |
| 18471 | 3056 |
| 18472 | 3056 |
| 18473 | 3056 |
| 18474 | 3056 |
| 18475 | 3056 |
| 18476 | 3056 |
| 18477 | 3056 |
| 18478 | 3056 |
| 18479 | 3056 |
| 18480 | 3056 |
| 18481 | 3056 |
| 18482 | 3056 |
| 18483 | 3056 |
| 18484 | 3056 |
| 18485 | 3056 |
| 18486 | 3028 |
| 18487 | 3028 |
| 18488 | 3028 |
| 18489 | 3028 |
| 18490 | 3028 |
| 18491 | 3028 |
| 18492 | 3028 |
| 18493 | 3028 |
| 18494 | 3028 |
| 18495 | 3028 |
| 18496 | 3028 |
| 18497 | 3028 |
| 18498 | 3028 |
| 18499 | 3028 |
| 18500 | 3028 |
| 18501 | 3028 |
| 18502 | 3028 |
| 18503 | 3028 |
| 18504 | 3028 |
| 18505 | 3028 |
| 18506 | 3028 |
| 18507 | 3028 |
| 18508 | 3028 |
| 18509 | 3028 |
| 18510 | 3028 |
| 18511 | 3028 |
| 18512 | 3028 |
| 18513 | 3028 |
| 18514 | 3028 |
| 18515 | 3028 |
| 18516 | 3028 |
| 18517 | 3028 |
| 18518 | 3028 |
| 18519 | 3028 |
| 18520 | 3028 |
| 18521 | 3028 |
| 18522 | 3028 |
| 18523 | 3028 |
| 18524 | 3028 |
| 18525 | 3028 |
| 18526 | 3028 |
| 18527 | 3028 |
| 18528 | 3028 |
| 18529 | 3028 |
| 18530 | 3028 |
| 18531 | 3028 |
| 18532 | 3028 |
| 18533 | 3028 |
| 18534 | 3060 |
| 18535 | 3060 |
| 18536 | 3060 |
| 18537 | 3060 |
| 18538 | 3060 |
| 18539 | 3060 |
| 18540 | 3060 |
| 18541 | 3060 |
| 18542 | 3060 |
| 18543 | 3060 |
| 18544 | 3060 |
| 18545 | 3060 |
| 18546 | 3060 |
| 18547 | 3060 |
| 18548 | 3060 |
| 18549 | 3060 |
| 18550 | 3060 |
| 18551 | 3060 |
| 18552 | 3060 |
| 18553 | 3060 |
| 18554 | 3060 |
| 18555 | 3060 |
| 18556 | 3060 |
| 18557 | 3060 |
| 18558 | 3060 |
| 18559 | 3060 |
| 18560 | 3060 |
| 18561 | 3060 |
| 18562 | 3060 |
| 18563 | 3060 |
| 18564 | 3060 |
| 18565 | 3060 |
| 18566 | 3060 |
| 18567 | 3060 |
| 18568 | 3060 |
| 18569 | 3060 |
| 18570 | 3060 |
| 18571 | 3060 |
| 18572 | 3060 |
| 18573 | 3060 |
| 18574 | 3060 |
| 18575 | 3060 |
| 18576 | 3060 |
| 18577 | 3060 |
| 18578 | 3060 |
| 18579 | 3060 |
| 18580 | 3060 |
| 18581 | 3060 |
| 18582 | 3048 |
| 18583 | 3048 |
| 18584 | 3048 |
| 18585 | 3048 |
| 18586 | 3048 |
| 18587 | 3048 |
| 18588 | 3048 |
| 18589 | 3048 |
| 18590 | 3048 |
| 18591 | 3048 |
| 18592 | 3048 |
| 18593 | 3048 |
| 18594 | 3048 |
| 18595 | 3048 |
| 18596 | 3048 |
| 18597 | 3048 |
| 18598 | 3048 |
| 18599 | 3048 |
| 18600 | 3048 |
| 18601 | 3048 |
| 18602 | 3048 |
| 18603 | 3048 |
| 18604 | 3048 |
| 18605 | 3048 |
| 18606 | 3048 |
| 18607 | 3048 |
| 18608 | 3048 |
| 18609 | 3048 |
| 18610 | 3048 |
| 18611 | 3048 |
| 18612 | 3048 |
| 18613 | 3048 |
| 18614 | 3048 |
| 18615 | 3048 |
| 18616 | 3048 |
| 18617 | 3048 |
| 18618 | 3048 |
| 18619 | 3048 |
| 18620 | 3048 |
| 18621 | 3048 |
| 18622 | 3048 |
| 18623 | 3048 |
| 18624 | 3048 |
| 18625 | 3048 |
| 18626 | 3048 |
| 18627 | 3048 |
| 18628 | 3048 |
| 18629 | 3048 |
| 18630 | 3076 |
| 18631 | 3076 |
| 18632 | 3076 |
| 18633 | 3076 |
| 18634 | 3076 |
| 18635 | 3076 |
| 18636 | 3076 |
| 18637 | 3076 |
| 18638 | 3076 |
| 18639 | 3076 |
| 18640 | 3076 |
| 18641 | 3076 |
| 18642 | 3076 |
| 18643 | 3076 |
| 18644 | 3076 |
| 18645 | 3076 |
| 18646 | 3076 |
| 18647 | 3076 |
| 18648 | 3076 |
| 18649 | 3076 |
| 18650 | 3076 |
| 18651 | 3076 |
| 18652 | 3076 |
| 18653 | 3076 |
| 18654 | 3076 |
| 18655 | 3076 |
| 18656 | 3076 |
| 18657 | 3076 |
| 18658 | 3076 |
| 18659 | 3076 |
| 18660 | 3076 |
| 18661 | 3076 |
| 18662 | 3076 |
| 18663 | 3076 |
| 18664 | 3076 |
| 18665 | 3076 |
| 18666 | 3076 |
| 18667 | 3076 |
| 18668 | 3076 |
| 18669 | 3076 |
| 18670 | 3076 |
| 18671 | 3076 |
| 18672 | 3076 |
| 18673 | 3076 |
| 18674 | 3076 |
| 18675 | 3076 |
| 18676 | 3076 |
| 18677 | 3076 |
| 18678 | 3036 |
| 18679 | 3036 |
| 18680 | 3036 |
| 18681 | 3036 |
| 18682 | 3036 |
| 18683 | 3036 |
| 18684 | 3036 |
| 18685 | 3036 |
| 18686 | 3036 |
| 18687 | 3036 |
| 18688 | 3036 |
| 18689 | 3036 |
| 18690 | 3036 |
| 18691 | 3036 |
| 18692 | 3036 |
| 18693 | 3036 |
| 18694 | 3036 |
| 18695 | 3036 |
| 18696 | 3036 |
| 18697 | 3036 |
| 18698 | 3036 |
| 18699 | 3036 |
| 18700 | 3036 |
| 18701 | 3036 |
| 18702 | 3036 |
| 18703 | 3036 |
| 18704 | 3036 |
| 18705 | 3036 |
| 18706 | 3036 |
| 18707 | 3036 |
| 18708 | 3036 |
| 18709 | 3036 |
| 18710 | 3036 |
| 18711 | 3036 |
| 18712 | 3036 |
| 18713 | 3036 |
| 18714 | 3036 |
| 18715 | 3036 |
| 18716 | 3036 |
| 18717 | 3036 |
| 18718 | 3036 |
| 18719 | 3036 |
| 18720 | 3036 |
| 18721 | 3036 |
| 18722 | 3036 |
| 18723 | 3036 |
| 18724 | 3036 |
| 18725 | 3036 |
| 18726 | 3036 |
| 18727 | 3036 |
| 18728 | 3036 |
| 18729 | 3036 |
| 18730 | 3036 |
| 18731 | 3036 |
| 18732 | 3036 |
| 18733 | 3036 |
| 18734 | 3036 |
| 18735 | 3036 |
| 18736 | 3036 |
| 18737 | 3036 |
| 18738 | 3036 |
| 18739 | 3036 |
| 18740 | 3036 |
| 18741 | 3036 |
| 18742 | 3036 |
| 18743 | 3036 |
| 18744 | 3036 |
| 18745 | 3036 |
| 18746 | 3036 |
| 18747 | 3036 |
| 18748 | 3036 |
| 18749 | 3036 |
| 18750 | 3036 |
| 18751 | 3036 |
| 18752 | 3036 |
| 18753 | 3036 |
| 18754 | 3036 |
| 18755 | 3036 |
| 18756 | 3036 |
| 18757 | 3036 |
| 18758 | 3036 |
| 18759 | 3036 |
| 18760 | 3036 |
| 18761 | 3036 |
| 18762 | 3036 |
| 18763 | 3036 |
| 18764 | 3036 |
| 18765 | 3036 |
| 18766 | 3036 |
| 18767 | 3036 |
| 18768 | 3036 |
| 18769 | 3036 |
| 18770 | 3036 |
| 18771 | 3036 |
| 18772 | 3036 |
| 18773 | 3036 |
| 18774 | 3036 |
| 18775 | 3272 |
| 18776 | 3272 |
| 18777 | 3272 |
| 18778 | 3272 |
| 18779 | 3272 |
| 18780 | 3272 |
| 18781 | 3272 |
| 18782 | 3272 |
| 18783 | 3272 |
| 18784 | 3272 |
| 18785 | 3272 |
| 18786 | 3272 |
| 18787 | 3272 |
| 18788 | 3272 |
| 18789 | 3272 |
| 18790 | 3272 |
| 18791 | 3272 |
| 18792 | 3272 |
| 18793 | 3272 |
| 18794 | 3272 |
| 18795 | 3272 |
| 18796 | 3272 |
| 18797 | 3272 |
| 18798 | 3272 |
| 18799 | 3272 |
| 18800 | 3272 |
| 18801 | 3272 |
| 18802 | 3272 |
| 18803 | 3272 |
| 18804 | 3272 |
| 18805 | 3272 |
| 18806 | 3272 |
| 18807 | 3272 |
| 18808 | 3272 |
| 18809 | 3272 |
| 18810 | 3272 |
| 18811 | 3272 |
| 18812 | 3272 |
| 18813 | 3272 |
| 18814 | 3272 |
| 18815 | 3272 |
| 18816 | 3272 |
| 18817 | 3272 |
| 18818 | 3272 |
| 18819 | 3272 |
| 18820 | 3272 |
| 18821 | 3272 |
| 18822 | 3272 |
| 18823 | 3052 |
| 18824 | 3052 |
| 18825 | 3052 |
| 18826 | 3052 |
| 18827 | 3052 |
| 18828 | 3052 |
| 18829 | 3052 |
| 18830 | 3052 |
| 18831 | 3052 |
| 18832 | 3052 |
| 18833 | 3052 |
| 18834 | 3052 |
| 18835 | 3052 |
| 18836 | 3052 |
| 18837 | 3052 |
| 18838 | 3052 |
| 18839 | 3052 |
| 18840 | 3052 |
| 18841 | 3052 |
| 18842 | 3052 |
| 18843 | 3052 |
| 18844 | 3052 |
| 18845 | 3052 |
| 18846 | 3052 |
| 18847 | 3052 |
| 18848 | 3052 |
| 18849 | 3052 |
| 18850 | 3052 |
| 18851 | 3052 |
| 18852 | 3052 |
| 18853 | 3052 |
| 18854 | 3052 |
| 18855 | 3052 |
| 18856 | 3052 |
| 18857 | 3052 |
| 18858 | 3052 |
| 18859 | 3052 |
| 18860 | 3052 |
| 18861 | 3052 |
| 18862 | 3052 |
| 18863 | 3052 |
| 18864 | 3052 |
| 18865 | 3052 |
| 18866 | 3052 |
| 18867 | 3052 |
| 18868 | 3052 |
| 18869 | 3052 |
| 18870 | 3052 |
| 18871 | 3076 |
| 18872 | 3076 |
| 18873 | 3076 |
| 18874 | 3076 |
| 18875 | 3076 |
| 18876 | 3076 |
| 18877 | 3076 |
| 18878 | 3076 |
| 18879 | 3076 |
| 18880 | 3076 |
| 18881 | 3076 |
| 18882 | 3076 |
| 18883 | 3076 |
| 18884 | 3076 |
| 18885 | 3076 |
| 18886 | 3076 |
| 18887 | 3076 |
| 18888 | 3076 |
| 18889 | 3076 |
| 18890 | 3076 |
| 18891 | 3076 |
| 18892 | 3076 |
| 18893 | 3076 |
| 18894 | 3076 |
| 18895 | 3076 |
| 18896 | 3076 |
| 18897 | 3076 |
| 18898 | 3076 |
| 18899 | 3076 |
| 18900 | 3076 |
| 18901 | 3076 |
| 18902 | 3076 |
| 18903 | 3076 |
| 18904 | 3076 |
| 18905 | 3076 |
| 18906 | 3076 |
| 18907 | 3076 |
| 18908 | 3076 |
| 18909 | 3076 |
| 18910 | 3076 |
| 18911 | 3076 |
| 18912 | 3076 |
| 18913 | 3076 |
| 18914 | 3076 |
| 18915 | 3076 |
| 18916 | 3076 |
| 18917 | 3076 |
| 18918 | 3076 |
| 18919 | 3076 |
| 18920 | 3052 |
| 18921 | 3052 |
| 18922 | 3052 |
| 18923 | 3052 |
| 18924 | 3052 |
| 18925 | 3052 |
| 18926 | 3052 |
| 18927 | 3052 |
| 18928 | 3052 |
| 18929 | 3052 |
| 18930 | 3052 |
| 18931 | 3052 |
| 18932 | 3052 |
| 18933 | 3052 |
| 18934 | 3052 |
| 18935 | 3052 |
| 18936 | 3052 |
| 18937 | 3052 |
| 18938 | 3052 |
| 18939 | 3052 |
| 18940 | 3052 |
| 18941 | 3052 |
| 18942 | 3052 |
| 18943 | 3052 |
| 18944 | 3052 |
| 18945 | 3052 |
| 18946 | 3052 |
| 18947 | 3052 |
| 18948 | 3052 |
| 18949 | 3052 |
| 18950 | 3052 |
| 18951 | 3052 |
| 18952 | 3052 |
| 18953 | 3052 |
| 18954 | 3052 |
| 18955 | 3052 |
| 18956 | 3052 |
| 18957 | 3052 |
| 18958 | 3052 |
| 18959 | 3052 |
| 18960 | 3052 |
| 18961 | 3052 |
| 18962 | 3052 |
| 18963 | 3052 |
| 18964 | 3052 |
| 18965 | 3052 |
| 18966 | 3052 |
| 18967 | 3052 |
| 18968 | 3040 |
| 18969 | 3040 |
| 18970 | 3040 |
| 18971 | 3040 |
| 18972 | 3040 |
| 18973 | 3040 |
| 18974 | 3040 |
| 18975 | 3040 |
| 18976 | 3040 |
| 18977 | 3040 |
| 18978 | 3040 |
| 18979 | 3040 |
| 18980 | 3040 |
| 18981 | 3040 |
| 18982 | 3040 |
| 18983 | 3040 |
| 18984 | 3040 |
| 18985 | 3040 |
| 18986 | 3040 |
| 18987 | 3040 |
| 18988 | 3040 |
| 18989 | 3040 |
| 18990 | 3040 |
| 18991 | 3040 |
| 18992 | 3040 |
| 18993 | 3040 |
| 18994 | 3040 |
| 18995 | 3040 |
| 18996 | 3040 |
| 18997 | 3040 |
| 18998 | 3040 |
| 18999 | 3040 |
| 19000 | 3040 |
| 19001 | 3040 |
| 19002 | 3040 |
| 19003 | 3040 |
| 19004 | 3040 |
| 19005 | 3040 |
| 19006 | 3040 |
| 19007 | 3040 |
| 19008 | 3040 |
| 19009 | 3040 |
| 19010 | 3040 |
| 19011 | 3040 |
| 19012 | 3040 |
| 19013 | 3040 |
| 19014 | 3040 |
| 19015 | 3040 |
| 19016 | 3060 |
| 19017 | 3060 |
| 19018 | 3060 |
| 19019 | 3060 |
| 19020 | 3060 |
| 19021 | 3060 |
| 19022 | 3060 |
| 19023 | 3060 |
| 19024 | 3060 |
| 19025 | 3060 |
| 19026 | 3060 |
| 19027 | 3060 |
| 19028 | 3060 |
| 19029 | 3060 |
| 19030 | 3060 |
| 19031 | 3060 |
| 19032 | 3060 |
| 19033 | 3060 |
| 19034 | 3060 |
| 19035 | 3060 |
| 19036 | 3060 |
| 19037 | 3060 |
| 19038 | 3060 |
| 19039 | 3060 |
| 19040 | 3060 |
| 19041 | 3060 |
| 19042 | 3060 |
| 19043 | 3060 |
| 19044 | 3060 |
| 19045 | 3060 |
| 19046 | 3060 |
| 19047 | 3060 |
| 19048 | 3060 |
| 19049 | 3060 |
| 19050 | 3060 |
| 19051 | 3060 |
| 19052 | 3060 |
| 19053 | 3060 |
| 19054 | 3060 |
| 19055 | 3060 |
| 19056 | 3060 |
| 19057 | 3060 |
| 19058 | 3060 |
| 19059 | 3060 |
| 19060 | 3060 |
| 19061 | 3060 |
| 19062 | 3060 |
| 19063 | 3060 |
| 19064 | 3072 |
| 19065 | 3072 |
| 19066 | 3072 |
| 19067 | 3072 |
| 19068 | 3072 |
| 19069 | 3072 |
| 19070 | 3072 |
| 19071 | 3072 |
| 19072 | 3072 |
| 19073 | 3072 |
| 19074 | 3072 |
| 19075 | 3072 |
| 19076 | 3072 |
| 19077 | 3072 |
| 19078 | 3072 |
| 19079 | 3072 |
| 19080 | 3072 |
| 19081 | 3072 |
| 19082 | 3072 |
| 19083 | 3072 |
| 19084 | 3072 |
| 19085 | 3072 |
| 19086 | 3072 |
| 19087 | 3072 |
| 19088 | 3072 |
| 19089 | 3072 |
| 19090 | 3072 |
| 19091 | 3072 |
| 19092 | 3072 |
| 19093 | 3072 |
| 19094 | 3072 |
| 19095 | 3072 |
| 19096 | 3072 |
| 19097 | 3072 |
| 19098 | 3072 |
| 19099 | 3072 |
| 19100 | 3072 |
| 19101 | 3072 |
| 19102 | 3072 |
| 19103 | 3072 |
| 19104 | 3072 |
| 19105 | 3072 |
| 19106 | 3072 |
| 19107 | 3072 |
| 19108 | 3072 |
| 19109 | 3072 |
| 19110 | 3072 |
| 19111 | 3072 |
| 19112 | 3040 |
| 19113 | 3040 |
| 19114 | 3040 |
| 19115 | 3040 |
| 19116 | 3040 |
| 19117 | 3040 |
| 19118 | 3040 |
| 19119 | 3040 |
| 19120 | 3040 |
| 19121 | 3040 |
| 19122 | 3040 |
| 19123 | 3040 |
| 19124 | 3040 |
| 19125 | 3040 |
| 19126 | 3040 |
| 19127 | 3040 |
| 19128 | 3040 |
| 19129 | 3040 |
| 19130 | 3040 |
| 19131 | 3040 |
| 19132 | 3040 |
| 19133 | 3040 |
| 19134 | 3040 |
| 19135 | 3040 |
| 19136 | 3040 |
| 19137 | 3040 |
| 19138 | 3040 |
| 19139 | 3040 |
| 19140 | 3040 |
| 19141 | 3040 |
| 19142 | 3040 |
| 19143 | 3040 |
| 19144 | 3040 |
| 19145 | 3040 |
| 19146 | 3040 |
| 19147 | 3040 |
| 19148 | 3040 |
| 19149 | 3040 |
| 19150 | 3040 |
| 19151 | 3040 |
| 19152 | 3040 |
| 19153 | 3040 |
| 19154 | 3040 |
| 19155 | 3040 |
| 19156 | 3040 |
| 19157 | 3040 |
| 19158 | 3040 |
| 19159 | 3040 |
| 19160 | 3040 |
| 19161 | 3304 |
| 19162 | 3304 |
| 19163 | 3304 |
| 19164 | 3304 |
| 19165 | 3304 |
| 19166 | 3304 |
| 19167 | 3304 |
| 19168 | 3304 |
| 19169 | 3304 |
| 19170 | 3304 |
| 19171 | 3304 |
| 19172 | 3304 |
| 19173 | 3304 |
| 19174 | 3304 |
| 19175 | 3304 |
| 19176 | 3304 |
| 19177 | 3304 |
| 19178 | 3304 |
| 19179 | 3304 |
| 19180 | 3304 |
| 19181 | 3304 |
| 19182 | 3304 |
| 19183 | 3304 |
| 19184 | 3304 |
| 19185 | 3304 |
| 19186 | 3304 |
| 19187 | 3304 |
| 19188 | 3304 |
| 19189 | 3304 |
| 19190 | 3304 |
| 19191 | 3304 |
| 19192 | 3304 |
| 19193 | 3304 |
| 19194 | 3304 |
| 19195 | 3304 |
| 19196 | 3304 |
| 19197 | 3304 |
| 19198 | 3304 |
| 19199 | 3304 |
| 19200 | 3304 |
| 19201 | 3304 |
| 19202 | 3304 |
| 19203 | 3304 |
| 19204 | 3304 |
| 19205 | 3304 |
| 19206 | 3304 |
| 19207 | 3304 |
| 19208 | 3304 |
| 19209 | 3048 |
| 19210 | 3048 |
| 19211 | 3048 |
| 19212 | 3048 |
| 19213 | 3048 |
| 19214 | 3048 |
| 19215 | 3048 |
| 19216 | 3048 |
| 19217 | 3048 |
| 19218 | 3048 |
| 19219 | 3048 |
| 19220 | 3048 |
| 19221 | 3048 |
| 19222 | 3048 |
| 19223 | 3048 |
| 19224 | 3048 |
| 19225 | 3048 |
| 19226 | 3048 |
| 19227 | 3048 |
| 19228 | 3048 |
| 19229 | 3048 |
| 19230 | 3048 |
| 19231 | 3048 |
| 19232 | 3048 |
| 19233 | 3048 |
| 19234 | 3048 |
| 19235 | 3048 |
| 19236 | 3048 |
| 19237 | 3048 |
| 19238 | 3048 |
| 19239 | 3048 |
| 19240 | 3048 |
| 19241 | 3048 |
| 19242 | 3048 |
| 19243 | 3048 |
| 19244 | 3048 |
| 19245 | 3048 |
| 19246 | 3048 |
| 19247 | 3048 |
| 19248 | 3048 |
| 19249 | 3048 |
| 19250 | 3048 |
| 19251 | 3048 |
| 19252 | 3048 |
| 19253 | 3048 |
| 19254 | 3048 |
| 19255 | 3048 |
| 19256 | 3048 |
| 19257 | 3024 |
| 19258 | 3024 |
| 19259 | 3024 |
| 19260 | 3024 |
| 19261 | 3024 |
| 19262 | 3024 |
| 19263 | 3024 |
| 19264 | 3024 |
| 19265 | 3024 |
| 19266 | 3024 |
| 19267 | 3024 |
| 19268 | 3024 |
| 19269 | 3024 |
| 19270 | 3024 |
| 19271 | 3024 |
| 19272 | 3024 |
| 19273 | 3024 |
| 19274 | 3024 |
| 19275 | 3024 |
| 19276 | 3024 |
| 19277 | 3024 |
| 19278 | 3024 |
| 19279 | 3024 |
| 19280 | 3024 |
| 19281 | 3024 |
| 19282 | 3024 |
| 19283 | 3024 |
| 19284 | 3024 |
| 19285 | 3024 |
| 19286 | 3024 |
| 19287 | 3024 |
| 19288 | 3024 |
| 19289 | 3024 |
| 19290 | 3024 |
| 19291 | 3024 |
| 19292 | 3024 |
| 19293 | 3024 |
| 19294 | 3024 |
| 19295 | 3024 |
| 19296 | 3024 |
| 19297 | 3024 |
| 19298 | 3024 |
| 19299 | 3024 |
| 19300 | 3024 |
| 19301 | 3024 |
| 19302 | 3024 |
| 19303 | 3024 |
| 19304 | 3024 |
| 19305 | 3048 |
| 19306 | 3048 |
| 19307 | 3048 |
| 19308 | 3048 |
| 19309 | 3048 |
| 19310 | 3048 |
| 19311 | 3048 |
| 19312 | 3048 |
| 19313 | 3048 |
| 19314 | 3048 |
| 19315 | 3048 |
| 19316 | 3048 |
| 19317 | 3048 |
| 19318 | 3048 |
| 19319 | 3048 |
| 19320 | 3048 |
| 19321 | 3048 |
| 19322 | 3048 |
| 19323 | 3048 |
| 19324 | 3048 |
| 19325 | 3048 |
| 19326 | 3048 |
| 19327 | 3048 |
| 19328 | 3048 |
| 19329 | 3048 |
| 19330 | 3048 |
| 19331 | 3048 |
| 19332 | 3048 |
| 19333 | 3048 |
| 19334 | 3048 |
| 19335 | 3048 |
| 19336 | 3048 |
| 19337 | 3048 |
| 19338 | 3048 |
| 19339 | 3048 |
| 19340 | 3048 |
| 19341 | 3048 |
| 19342 | 3048 |
| 19343 | 3048 |
| 19344 | 3048 |